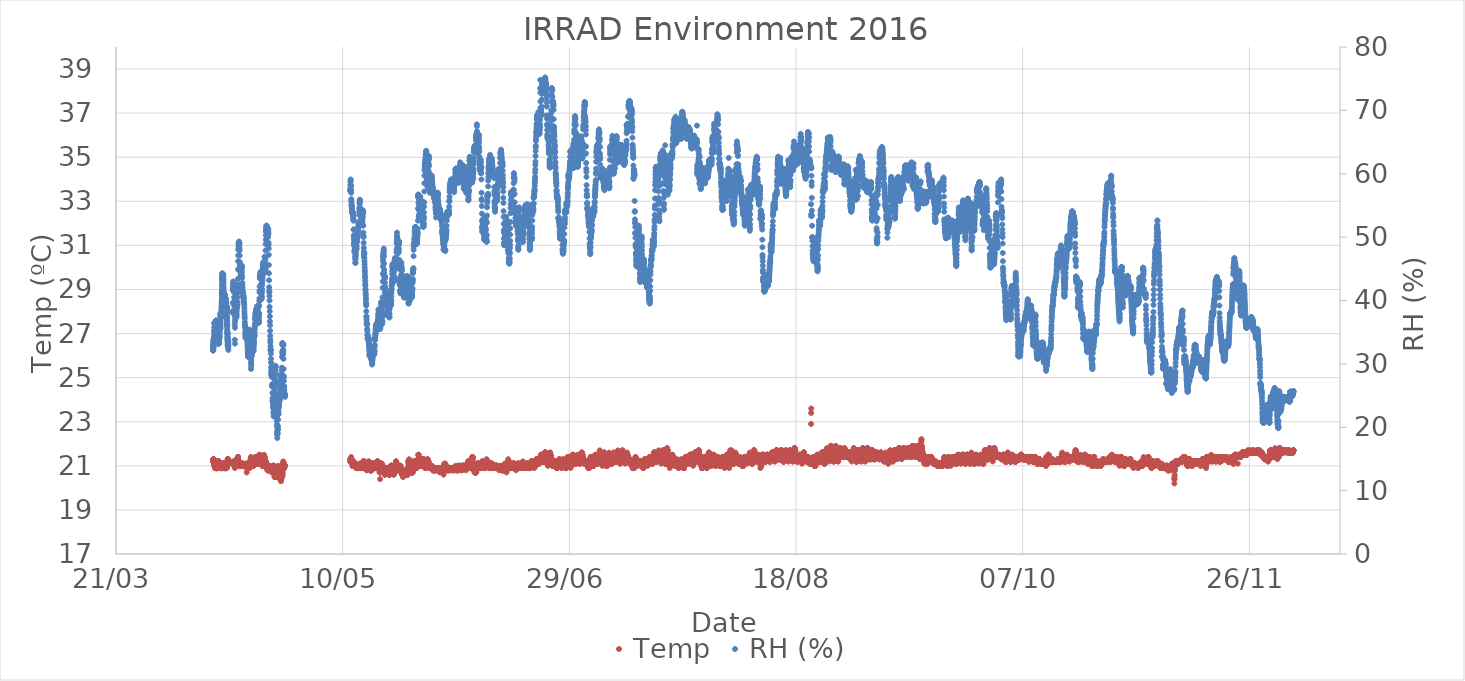
| Category | Temp |
|---|---|
| 42471.41693287037 | 21.2 |
| 42471.42386574074 | 21.2 |
| 42471.430810185186 | 21.2 |
| 42471.43775462963 | 21.2 |
| 42471.444699074076 | 21.2 |
| 42471.45164351852 | 21.2 |
| 42471.45858796296 | 21.2 |
| 42471.465532407405 | 21.2 |
| 42471.47247685185 | 21.2 |
| 42471.479421296295 | 21.2 |
| 42471.48636574074 | 21.2 |
| 42471.493310185186 | 21.3 |
| 42471.50025462963 | 21.3 |
| 42471.507199074076 | 21.3 |
| 42471.51414351852 | 21.3 |
| 42471.52108796296 | 21.2 |
| 42471.528032407405 | 21.2 |
| 42471.53497685185 | 21.3 |
| 42471.541921296295 | 21.3 |
| 42471.54886574074 | 21.2 |
| 42471.555810185186 | 21.2 |
| 42471.56275462963 | 21.2 |
| 42471.569699074076 | 21.2 |
| 42471.57664351852 | 21.2 |
| 42471.58358796296 | 21.2 |
| 42471.590532407405 | 21.2 |
| 42471.59747685185 | 21.2 |
| 42471.604421296295 | 21.2 |
| 42471.61136574074 | 21.2 |
| 42471.618310185186 | 21.2 |
| 42471.62525462963 | 21.2 |
| 42471.632199074076 | 21.2 |
| 42471.63914351852 | 21.2 |
| 42471.64608796296 | 21.2 |
| 42471.653032407405 | 21.2 |
| 42471.65997685185 | 21.2 |
| 42471.666921296295 | 21.2 |
| 42471.67386574074 | 21.2 |
| 42471.680810185186 | 21.2 |
| 42471.68775462963 | 21.2 |
| 42471.694699074076 | 21.1 |
| 42471.70164351852 | 21.1 |
| 42471.70858796296 | 21 |
| 42471.715532407405 | 21.1 |
| 42471.72247685185 | 21.1 |
| 42471.729421296295 | 21 |
| 42471.73636574074 | 21 |
| 42471.743310185186 | 21.1 |
| 42471.75025462963 | 21.1 |
| 42471.757199074076 | 21.1 |
| 42471.76414351852 | 21.1 |
| 42471.77108796296 | 21.1 |
| 42471.778032407405 | 21.1 |
| 42471.78497685185 | 21.1 |
| 42471.791921296295 | 21.1 |
| 42471.79886574074 | 21 |
| 42471.805810185186 | 21 |
| 42471.81275462963 | 21 |
| 42471.819699074076 | 21 |
| 42471.82664351852 | 21 |
| 42471.83358796296 | 21 |
| 42471.840532407405 | 21 |
| 42471.84747685185 | 21 |
| 42471.854421296295 | 21 |
| 42471.86136574074 | 21 |
| 42471.868310185186 | 21 |
| 42471.87525462963 | 21 |
| 42471.882199074076 | 21 |
| 42471.88914351852 | 21 |
| 42471.89608796296 | 20.9 |
| 42471.903032407405 | 20.9 |
| 42471.90997685185 | 20.9 |
| 42471.916921296295 | 20.9 |
| 42471.92386574074 | 21 |
| 42471.930810185186 | 21 |
| 42471.93775462963 | 20.9 |
| 42471.944699074076 | 20.9 |
| 42471.95164351852 | 20.9 |
| 42471.95858796296 | 20.9 |
| 42471.965532407405 | 20.9 |
| 42471.97247685185 | 20.9 |
| 42471.979421296295 | 21 |
| 42471.98636574074 | 21 |
| 42471.993310185186 | 21 |
| 42472.00025462963 | 21 |
| 42472.007199074076 | 21 |
| 42472.01414351852 | 21 |
| 42472.02108796296 | 20.9 |
| 42472.028032407405 | 20.9 |
| 42472.03497685185 | 20.9 |
| 42472.041921296295 | 20.9 |
| 42472.04886574074 | 20.9 |
| 42472.055810185186 | 20.9 |
| 42472.06275462963 | 20.9 |
| 42472.069699074076 | 20.9 |
| 42472.07664351852 | 20.9 |
| 42472.08358796296 | 20.9 |
| 42472.090532407405 | 20.9 |
| 42472.09747685185 | 20.9 |
| 42472.104421296295 | 20.9 |
| 42472.11136574074 | 20.9 |
| 42472.118310185186 | 20.9 |
| 42472.12525462963 | 20.9 |
| 42472.132199074076 | 20.9 |
| 42472.13914351852 | 20.9 |
| 42472.14608796296 | 20.9 |
| 42472.153032407405 | 20.9 |
| 42472.15997685185 | 20.9 |
| 42472.166921296295 | 20.9 |
| 42472.17386574074 | 20.9 |
| 42472.180810185186 | 20.9 |
| 42472.18775462963 | 20.9 |
| 42472.194699074076 | 20.9 |
| 42472.20164351852 | 20.9 |
| 42472.20858796296 | 20.9 |
| 42472.215532407405 | 20.9 |
| 42472.22247685185 | 20.9 |
| 42472.229421296295 | 20.9 |
| 42472.23636574074 | 20.9 |
| 42472.243310185186 | 20.9 |
| 42472.25025462963 | 20.9 |
| 42472.257199074076 | 20.9 |
| 42472.26414351852 | 20.9 |
| 42472.27108796296 | 20.9 |
| 42472.278032407405 | 20.9 |
| 42472.28497685185 | 20.9 |
| 42472.291921296295 | 20.9 |
| 42472.29886574074 | 20.9 |
| 42472.305810185186 | 20.9 |
| 42472.31275462963 | 20.9 |
| 42472.319699074076 | 20.9 |
| 42472.32664351852 | 20.9 |
| 42472.33358796296 | 20.9 |
| 42472.340532407405 | 20.9 |
| 42472.34747685185 | 20.9 |
| 42472.354421296295 | 20.9 |
| 42472.36136574074 | 20.9 |
| 42472.368310185186 | 20.9 |
| 42472.37525462963 | 20.9 |
| 42472.382199074076 | 20.9 |
| 42472.38914351852 | 20.9 |
| 42472.39608796296 | 20.9 |
| 42472.403032407405 | 20.9 |
| 42472.40997685185 | 20.9 |
| 42472.416921296295 | 20.9 |
| 42472.42386574074 | 20.9 |
| 42472.430810185186 | 20.9 |
| 42472.43775462963 | 20.9 |
| 42472.444699074076 | 20.9 |
| 42472.45164351852 | 20.9 |
| 42472.45858796296 | 20.9 |
| 42472.465532407405 | 20.9 |
| 42472.47247685185 | 20.9 |
| 42472.479421296295 | 20.9 |
| 42472.48636574074 | 21 |
| 42472.493310185186 | 20.9 |
| 42472.50025462963 | 21 |
| 42472.507199074076 | 21 |
| 42472.51414351852 | 21 |
| 42472.52108796296 | 21 |
| 42472.528032407405 | 21 |
| 42472.53497685185 | 21 |
| 42472.541921296295 | 21 |
| 42472.54886574074 | 21 |
| 42472.555810185186 | 21.1 |
| 42472.56275462963 | 21.1 |
| 42472.569699074076 | 21.1 |
| 42472.57664351852 | 21.1 |
| 42472.58358796296 | 21.1 |
| 42472.590532407405 | 21.1 |
| 42472.59747685185 | 21.1 |
| 42472.604421296295 | 21.1 |
| 42472.61136574074 | 21.1 |
| 42472.618310185186 | 21.1 |
| 42472.62525462963 | 21.1 |
| 42472.632199074076 | 21.1 |
| 42472.63914351852 | 21.1 |
| 42472.64608796296 | 21.2 |
| 42472.653032407405 | 21.2 |
| 42472.65997685185 | 21.2 |
| 42472.666921296295 | 21.2 |
| 42472.67386574074 | 21.2 |
| 42472.680810185186 | 21.2 |
| 42472.68775462963 | 21.2 |
| 42472.694699074076 | 21.2 |
| 42472.70164351852 | 21.2 |
| 42472.70858796296 | 21.1 |
| 42472.715532407405 | 21.1 |
| 42472.72247685185 | 21.1 |
| 42472.729421296295 | 21.1 |
| 42472.73636574074 | 21.1 |
| 42472.743310185186 | 21.1 |
| 42472.75025462963 | 21.1 |
| 42472.757199074076 | 21.1 |
| 42472.76414351852 | 21.1 |
| 42472.77108796296 | 21.1 |
| 42472.778032407405 | 21.1 |
| 42472.78497685185 | 21.1 |
| 42472.791921296295 | 21.1 |
| 42472.79886574074 | 21.1 |
| 42472.805810185186 | 21.1 |
| 42472.81275462963 | 21.1 |
| 42472.819699074076 | 21.1 |
| 42472.82664351852 | 21 |
| 42472.83358796296 | 21 |
| 42472.840532407405 | 21 |
| 42472.84747685185 | 21 |
| 42472.854421296295 | 21 |
| 42472.86136574074 | 21 |
| 42472.868310185186 | 21 |
| 42472.87525462963 | 21 |
| 42472.882199074076 | 21 |
| 42472.88914351852 | 21 |
| 42472.89608796296 | 21 |
| 42472.903032407405 | 21 |
| 42472.90997685185 | 21 |
| 42472.916921296295 | 21 |
| 42472.92386574074 | 21 |
| 42472.930810185186 | 21 |
| 42472.93775462963 | 21 |
| 42472.944699074076 | 21 |
| 42472.95164351852 | 21 |
| 42472.95858796296 | 21 |
| 42472.965532407405 | 21 |
| 42472.97247685185 | 21 |
| 42472.979421296295 | 21 |
| 42472.98636574074 | 21 |
| 42472.993310185186 | 21 |
| 42473.00025462963 | 21 |
| 42473.007199074076 | 21 |
| 42473.01414351852 | 21 |
| 42473.02108796296 | 21 |
| 42473.028032407405 | 21 |
| 42473.03497685185 | 21 |
| 42473.041921296295 | 21 |
| 42473.04886574074 | 21 |
| 42473.055810185186 | 21 |
| 42473.06275462963 | 21 |
| 42473.069699074076 | 21 |
| 42473.07664351852 | 20.9 |
| 42473.08358796296 | 20.9 |
| 42473.090532407405 | 20.9 |
| 42473.09747685185 | 21 |
| 42473.104421296295 | 20.9 |
| 42473.11136574074 | 20.9 |
| 42473.118310185186 | 21 |
| 42473.12525462963 | 20.9 |
| 42473.132199074076 | 21 |
| 42473.13914351852 | 21 |
| 42473.14608796296 | 21 |
| 42473.153032407405 | 20.9 |
| 42473.15997685185 | 21 |
| 42473.166921296295 | 20.9 |
| 42473.17386574074 | 20.9 |
| 42473.180810185186 | 21 |
| 42473.18775462963 | 20.9 |
| 42473.194699074076 | 20.9 |
| 42473.20164351852 | 20.9 |
| 42473.20858796296 | 20.9 |
| 42473.215532407405 | 20.9 |
| 42473.22247685185 | 20.9 |
| 42473.229421296295 | 20.9 |
| 42473.23636574074 | 20.9 |
| 42473.243310185186 | 20.9 |
| 42473.25025462963 | 20.9 |
| 42473.257199074076 | 20.9 |
| 42473.26414351852 | 20.9 |
| 42473.27108796296 | 20.9 |
| 42473.278032407405 | 20.9 |
| 42473.28497685185 | 20.9 |
| 42473.291921296295 | 20.9 |
| 42473.29886574074 | 20.9 |
| 42473.305810185186 | 20.9 |
| 42473.31275462963 | 20.9 |
| 42473.319699074076 | 20.9 |
| 42473.32664351852 | 20.9 |
| 42473.33358796296 | 20.9 |
| 42473.340532407405 | 20.9 |
| 42473.34747685185 | 20.9 |
| 42473.354421296295 | 20.9 |
| 42473.36136574074 | 20.9 |
| 42473.368310185186 | 20.9 |
| 42473.37525462963 | 20.9 |
| 42473.382199074076 | 20.9 |
| 42473.38914351852 | 20.9 |
| 42473.39608796296 | 20.9 |
| 42473.403032407405 | 20.9 |
| 42473.40997685185 | 20.9 |
| 42473.416921296295 | 20.9 |
| 42473.42386574074 | 20.9 |
| 42473.430810185186 | 20.9 |
| 42473.43775462963 | 20.9 |
| 42473.444699074076 | 20.9 |
| 42473.45164351852 | 20.9 |
| 42473.45858796296 | 20.9 |
| 42473.465532407405 | 20.9 |
| 42473.47247685185 | 20.9 |
| 42473.479421296295 | 20.9 |
| 42473.48636574074 | 20.9 |
| 42473.493310185186 | 20.9 |
| 42473.50025462963 | 20.9 |
| 42473.507199074076 | 21 |
| 42473.51414351852 | 20.9 |
| 42473.52108796296 | 21 |
| 42473.528032407405 | 20.9 |
| 42473.53497685185 | 21 |
| 42473.541921296295 | 21 |
| 42473.54886574074 | 21 |
| 42473.555810185186 | 21 |
| 42473.56275462963 | 21 |
| 42473.569699074076 | 21 |
| 42473.57664351852 | 21 |
| 42473.58358796296 | 21 |
| 42473.590532407405 | 21 |
| 42473.59747685185 | 21 |
| 42473.604421296295 | 21 |
| 42473.61136574074 | 21 |
| 42473.618310185186 | 21 |
| 42473.62525462963 | 21 |
| 42473.632199074076 | 21 |
| 42473.63914351852 | 21 |
| 42473.64608796296 | 21 |
| 42473.653032407405 | 21 |
| 42473.65997685185 | 21 |
| 42473.666921296295 | 21 |
| 42473.67386574074 | 21 |
| 42473.680810185186 | 21 |
| 42473.68775462963 | 21.1 |
| 42473.694699074076 | 21.1 |
| 42473.70164351852 | 21.1 |
| 42473.70858796296 | 21.1 |
| 42473.715532407405 | 21.1 |
| 42473.72247685185 | 21.1 |
| 42473.729421296295 | 21.1 |
| 42473.73636574074 | 21.1 |
| 42473.743310185186 | 21.1 |
| 42473.75025462963 | 21.1 |
| 42473.757199074076 | 21.1 |
| 42473.76414351852 | 21.1 |
| 42473.77108796296 | 21.1 |
| 42473.778032407405 | 21.1 |
| 42473.78497685185 | 21 |
| 42473.791921296295 | 21 |
| 42473.79886574074 | 21 |
| 42473.805810185186 | 21 |
| 42473.81275462963 | 21 |
| 42473.819699074076 | 21 |
| 42473.82664351852 | 21 |
| 42473.83358796296 | 21 |
| 42473.840532407405 | 21 |
| 42473.84747685185 | 21 |
| 42473.854421296295 | 21 |
| 42473.86136574074 | 21 |
| 42473.868310185186 | 21 |
| 42473.87525462963 | 21 |
| 42473.882199074076 | 21 |
| 42473.88914351852 | 21 |
| 42473.89608796296 | 21 |
| 42473.903032407405 | 21 |
| 42473.90997685185 | 20.9 |
| 42473.916921296295 | 20.9 |
| 42473.92386574074 | 20.9 |
| 42473.930810185186 | 20.9 |
| 42473.93775462963 | 20.9 |
| 42473.944699074076 | 20.9 |
| 42473.95164351852 | 20.9 |
| 42473.95858796296 | 20.9 |
| 42473.965532407405 | 20.9 |
| 42473.97247685185 | 20.9 |
| 42473.979421296295 | 20.9 |
| 42473.98636574074 | 20.9 |
| 42473.993310185186 | 20.9 |
| 42474.00025462963 | 20.9 |
| 42474.007199074076 | 20.9 |
| 42474.01414351852 | 20.9 |
| 42474.02108796296 | 20.9 |
| 42474.028032407405 | 20.9 |
| 42474.03497685185 | 20.9 |
| 42474.041921296295 | 20.9 |
| 42474.04886574074 | 20.9 |
| 42474.055810185186 | 20.9 |
| 42474.06275462963 | 20.9 |
| 42474.069699074076 | 20.9 |
| 42474.07664351852 | 20.9 |
| 42474.08358796296 | 20.9 |
| 42474.090532407405 | 20.9 |
| 42474.09747685185 | 20.9 |
| 42474.104421296295 | 20.9 |
| 42474.11136574074 | 20.9 |
| 42474.118310185186 | 20.9 |
| 42474.12525462963 | 20.9 |
| 42474.132199074076 | 20.9 |
| 42474.13914351852 | 20.9 |
| 42474.14608796296 | 20.9 |
| 42474.153032407405 | 20.9 |
| 42474.15997685185 | 20.9 |
| 42474.166921296295 | 20.9 |
| 42474.17386574074 | 20.9 |
| 42474.180810185186 | 20.9 |
| 42474.18775462963 | 20.9 |
| 42474.194699074076 | 20.9 |
| 42474.20164351852 | 20.9 |
| 42474.20858796296 | 20.9 |
| 42474.215532407405 | 20.9 |
| 42474.22247685185 | 20.9 |
| 42474.229421296295 | 20.9 |
| 42474.23636574074 | 20.9 |
| 42474.243310185186 | 20.9 |
| 42474.25025462963 | 20.9 |
| 42474.257199074076 | 20.9 |
| 42474.26414351852 | 20.9 |
| 42474.27108796296 | 20.9 |
| 42474.278032407405 | 20.9 |
| 42474.28497685185 | 20.9 |
| 42474.291921296295 | 20.9 |
| 42474.29886574074 | 20.9 |
| 42474.305810185186 | 20.9 |
| 42474.31275462963 | 20.9 |
| 42474.319699074076 | 20.9 |
| 42474.32664351852 | 20.9 |
| 42474.33358796296 | 20.9 |
| 42474.340532407405 | 20.9 |
| 42474.34747685185 | 20.9 |
| 42474.354421296295 | 20.9 |
| 42474.36136574074 | 20.9 |
| 42474.368310185186 | 20.9 |
| 42474.37525462963 | 21 |
| 42474.382199074076 | 20.9 |
| 42474.38914351852 | 20.9 |
| 42474.39608796296 | 20.9 |
| 42474.403032407405 | 21 |
| 42474.40997685185 | 21 |
| 42474.416921296295 | 21 |
| 42474.42386574074 | 21 |
| 42474.430810185186 | 21 |
| 42474.43775462963 | 21 |
| 42474.444699074076 | 21 |
| 42474.45164351852 | 21 |
| 42474.45858796296 | 21 |
| 42474.465532407405 | 21 |
| 42474.47247685185 | 21 |
| 42474.479421296295 | 21 |
| 42474.48636574074 | 21 |
| 42474.493310185186 | 21 |
| 42474.50025462963 | 21 |
| 42474.507199074076 | 21 |
| 42474.51414351852 | 21 |
| 42474.52108796296 | 21 |
| 42474.528032407405 | 21.1 |
| 42474.53497685185 | 21.1 |
| 42474.541921296295 | 21.1 |
| 42474.54886574074 | 21.1 |
| 42474.555810185186 | 21.1 |
| 42474.56275462963 | 21.1 |
| 42474.569699074076 | 21.1 |
| 42474.57664351852 | 21.2 |
| 42474.58358796296 | 21.2 |
| 42474.590532407405 | 21.2 |
| 42474.59747685185 | 21.2 |
| 42474.604421296295 | 21.2 |
| 42474.61136574074 | 21.2 |
| 42474.618310185186 | 21.2 |
| 42474.62525462963 | 21.2 |
| 42474.632199074076 | 21.2 |
| 42474.63914351852 | 21.2 |
| 42474.64608796296 | 21.2 |
| 42474.653032407405 | 21.2 |
| 42474.65997685185 | 21.3 |
| 42474.666921296295 | 21.3 |
| 42474.67386574074 | 21.3 |
| 42474.680810185186 | 21.3 |
| 42474.68775462963 | 21.3 |
| 42474.694699074076 | 21.3 |
| 42474.70164351852 | 21.3 |
| 42474.70858796296 | 21.2 |
| 42474.715532407405 | 21.2 |
| 42474.72247685185 | 21.2 |
| 42474.729421296295 | 21.2 |
| 42474.73636574074 | 21.2 |
| 42474.743310185186 | 21.2 |
| 42474.75025462963 | 21.2 |
| 42474.757199074076 | 21.2 |
| 42474.76414351852 | 21.2 |
| 42474.77108796296 | 21.2 |
| 42474.778032407405 | 21.2 |
| 42475.72274305556 | 21.1 |
| 42475.723078703704 | 21.1 |
| 42475.723391203705 | 21.1 |
| 42475.72390046297 | 21.1 |
| 42475.744733796295 | 21.1 |
| 42475.76556712963 | 21.1 |
| 42475.78640046297 | 21.1 |
| 42475.807233796295 | 21.2 |
| 42475.82806712963 | 21.1 |
| 42475.84890046297 | 21.1 |
| 42475.869733796295 | 21.1 |
| 42475.89056712963 | 21.1 |
| 42475.91140046297 | 21.1 |
| 42475.932233796295 | 21.1 |
| 42475.95306712963 | 21.1 |
| 42475.97390046297 | 21.1 |
| 42475.994733796295 | 21.1 |
| 42476.01556712963 | 21.1 |
| 42476.03640046297 | 21.1 |
| 42476.057233796295 | 21.1 |
| 42476.07806712963 | 21 |
| 42476.09890046297 | 21 |
| 42476.119733796295 | 21 |
| 42476.14056712963 | 21 |
| 42476.16140046297 | 21 |
| 42476.182233796295 | 21 |
| 42476.20306712963 | 21 |
| 42476.22390046297 | 20.9 |
| 42476.244733796295 | 21 |
| 42476.26556712963 | 21 |
| 42476.28640046297 | 21 |
| 42476.307233796295 | 21 |
| 42476.32806712963 | 21 |
| 42476.34890046297 | 21 |
| 42476.369733796295 | 21 |
| 42476.39056712963 | 21 |
| 42476.41140046297 | 21 |
| 42476.432233796295 | 21 |
| 42476.45306712963 | 21 |
| 42476.47390046297 | 21.1 |
| 42476.494733796295 | 21.1 |
| 42476.51556712963 | 21.1 |
| 42476.53640046297 | 21.2 |
| 42476.557233796295 | 21.2 |
| 42476.57806712963 | 21.2 |
| 42476.59890046297 | 21.2 |
| 42476.619733796295 | 21.3 |
| 42476.64056712963 | 21.3 |
| 42476.66140046297 | 21.3 |
| 42476.682233796295 | 21.3 |
| 42476.70306712963 | 21.3 |
| 42476.72390046297 | 21.3 |
| 42476.744733796295 | 21.3 |
| 42476.76556712963 | 21.3 |
| 42476.78640046297 | 21.3 |
| 42476.807233796295 | 21.3 |
| 42476.82806712963 | 21.3 |
| 42476.84890046297 | 21.3 |
| 42476.869733796295 | 21.3 |
| 42476.89056712963 | 21.4 |
| 42476.91140046297 | 21.4 |
| 42476.932233796295 | 21.4 |
| 42476.95306712963 | 21.2 |
| 42476.97390046297 | 21.2 |
| 42476.994733796295 | 21.2 |
| 42477.01556712963 | 21.2 |
| 42477.03640046297 | 21.1 |
| 42477.057233796295 | 21.1 |
| 42477.07806712963 | 21.1 |
| 42477.09890046297 | 21.1 |
| 42477.119733796295 | 21.1 |
| 42477.14056712963 | 21.1 |
| 42477.16140046297 | 21.1 |
| 42477.182233796295 | 21.2 |
| 42477.20306712963 | 21.1 |
| 42477.22390046297 | 21.1 |
| 42477.244733796295 | 21.1 |
| 42477.26556712963 | 21 |
| 42477.28640046297 | 21 |
| 42477.307233796295 | 21.1 |
| 42477.32806712963 | 21 |
| 42477.34890046297 | 21 |
| 42477.369733796295 | 21 |
| 42477.39056712963 | 21.1 |
| 42477.41140046297 | 21.1 |
| 42477.432233796295 | 21.1 |
| 42477.45306712963 | 21.1 |
| 42477.47390046297 | 21.1 |
| 42477.494733796295 | 21.1 |
| 42477.51556712963 | 21.1 |
| 42477.53640046297 | 21.1 |
| 42477.557233796295 | 21.1 |
| 42477.57806712963 | 21.1 |
| 42477.59890046297 | 21.1 |
| 42477.619733796295 | 21.1 |
| 42477.64056712963 | 21.1 |
| 42477.66140046297 | 21.1 |
| 42477.682233796295 | 21.1 |
| 42477.70306712963 | 21.1 |
| 42477.72390046297 | 21.1 |
| 42477.744733796295 | 21.1 |
| 42477.76556712963 | 21.1 |
| 42477.78640046297 | 21 |
| 42477.807233796295 | 21 |
| 42477.82806712963 | 21 |
| 42477.84890046297 | 21 |
| 42477.869733796295 | 21 |
| 42477.89056712963 | 21.1 |
| 42477.91140046297 | 21 |
| 42477.932233796295 | 21.1 |
| 42477.95306712963 | 21 |
| 42477.97390046297 | 21 |
| 42477.994733796295 | 21 |
| 42478.01556712963 | 21 |
| 42478.03640046297 | 21 |
| 42478.057233796295 | 21 |
| 42478.07806712963 | 21 |
| 42478.09890046297 | 21 |
| 42478.119733796295 | 21 |
| 42478.14056712963 | 21 |
| 42478.16140046297 | 21 |
| 42478.182233796295 | 21 |
| 42478.20306712963 | 21 |
| 42478.22390046297 | 21 |
| 42478.244733796295 | 21 |
| 42478.26556712963 | 21 |
| 42478.28640046297 | 21 |
| 42478.307233796295 | 21 |
| 42478.32806712963 | 21 |
| 42478.34890046297 | 21 |
| 42478.369733796295 | 21 |
| 42478.39056712963 | 21 |
| 42478.41140046297 | 21 |
| 42478.432233796295 | 21 |
| 42478.45306712963 | 21 |
| 42478.47390046297 | 21 |
| 42478.494733796295 | 21 |
| 42478.51556712963 | 21 |
| 42478.53640046297 | 21 |
| 42478.557233796295 | 21.1 |
| 42478.57806712963 | 21 |
| 42478.59890046297 | 21 |
| 42478.619733796295 | 21 |
| 42478.64056712963 | 21 |
| 42478.66140046297 | 21 |
| 42478.682233796295 | 21 |
| 42478.70306712963 | 21 |
| 42478.72390046297 | 21 |
| 42478.744733796295 | 20.9 |
| 42478.76556712963 | 21 |
| 42478.78640046297 | 21.1 |
| 42478.807233796295 | 21 |
| 42478.82806712963 | 20.7 |
| 42478.84890046297 | 21 |
| 42478.869733796295 | 21 |
| 42478.89056712963 | 21 |
| 42478.91140046297 | 21 |
| 42478.932233796295 | 21 |
| 42478.95306712963 | 21 |
| 42478.97390046297 | 21 |
| 42478.994733796295 | 20.9 |
| 42479.01556712963 | 20.9 |
| 42479.03640046297 | 20.9 |
| 42479.057233796295 | 20.9 |
| 42479.07806712963 | 20.9 |
| 42479.09890046297 | 20.9 |
| 42479.119733796295 | 20.9 |
| 42479.14056712963 | 20.9 |
| 42479.16140046297 | 20.9 |
| 42479.182233796295 | 20.9 |
| 42479.20306712963 | 20.9 |
| 42479.22390046297 | 20.9 |
| 42479.244733796295 | 20.9 |
| 42479.26556712963 | 20.9 |
| 42479.28640046297 | 20.9 |
| 42479.307233796295 | 20.9 |
| 42479.32806712963 | 20.9 |
| 42479.34890046297 | 21 |
| 42479.369733796295 | 21 |
| 42479.39056712963 | 21.1 |
| 42479.41140046297 | 21.1 |
| 42479.432233796295 | 21 |
| 42479.45306712963 | 20.9 |
| 42479.47390046297 | 21 |
| 42479.494733796295 | 21 |
| 42479.51556712963 | 21 |
| 42479.53640046297 | 21 |
| 42479.557233796295 | 21.1 |
| 42479.57806712963 | 21.2 |
| 42479.59890046297 | 21.2 |
| 42479.619733796295 | 21.2 |
| 42479.64056712963 | 21.2 |
| 42479.66140046297 | 21.2 |
| 42479.682233796295 | 21.2 |
| 42479.70306712963 | 21.3 |
| 42479.72390046297 | 21.3 |
| 42479.744733796295 | 21.4 |
| 42479.76556712963 | 21.2 |
| 42479.78640046297 | 21.3 |
| 42479.807233796295 | 21.3 |
| 42479.82806712963 | 21.3 |
| 42479.84890046297 | 21.3 |
| 42479.869733796295 | 21.3 |
| 42479.89056712963 | 21.3 |
| 42479.91140046297 | 21.2 |
| 42479.932233796295 | 21.2 |
| 42479.95306712963 | 21.2 |
| 42479.97390046297 | 21.2 |
| 42479.994733796295 | 21.2 |
| 42480.01556712963 | 21.2 |
| 42480.03640046297 | 21.1 |
| 42480.057233796295 | 21.1 |
| 42480.07806712963 | 21.1 |
| 42480.09890046297 | 21.1 |
| 42480.119733796295 | 21.1 |
| 42480.14056712963 | 21.1 |
| 42480.16140046297 | 21.1 |
| 42480.182233796295 | 21 |
| 42480.20306712963 | 21.1 |
| 42480.22390046297 | 21 |
| 42480.244733796295 | 21 |
| 42480.26556712963 | 21 |
| 42480.28640046297 | 21 |
| 42480.307233796295 | 21 |
| 42480.32806712963 | 21 |
| 42480.34890046297 | 21 |
| 42480.369733796295 | 21.1 |
| 42480.39056712963 | 21.2 |
| 42480.41140046297 | 21.2 |
| 42480.432233796295 | 21.2 |
| 42480.45306712963 | 21.1 |
| 42480.47390046297 | 21.1 |
| 42480.494733796295 | 21.1 |
| 42480.51556712963 | 21.1 |
| 42480.53640046297 | 21.2 |
| 42480.557233796295 | 21.2 |
| 42480.57806712963 | 21.3 |
| 42480.59890046297 | 21.3 |
| 42480.619733796295 | 21.3 |
| 42480.64056712963 | 21.3 |
| 42480.66140046297 | 21.4 |
| 42480.682233796295 | 21.3 |
| 42480.70306712963 | 21.3 |
| 42480.72390046297 | 21.2 |
| 42480.744733796295 | 21.3 |
| 42480.76556712963 | 21.2 |
| 42480.78640046297 | 21.4 |
| 42480.807233796295 | 21.3 |
| 42480.82806712963 | 21.2 |
| 42480.84890046297 | 21.3 |
| 42480.869733796295 | 21.2 |
| 42480.89056712963 | 21.2 |
| 42480.91140046297 | 21.2 |
| 42480.932233796295 | 21.3 |
| 42480.95306712963 | 21.2 |
| 42480.97390046297 | 21.3 |
| 42480.994733796295 | 21.2 |
| 42481.01556712963 | 21.3 |
| 42481.03640046297 | 21.2 |
| 42481.057233796295 | 21.2 |
| 42481.07806712963 | 21.2 |
| 42481.09890046297 | 21.2 |
| 42481.119733796295 | 21.2 |
| 42481.14056712963 | 21.2 |
| 42481.16140046297 | 21.1 |
| 42481.182233796295 | 21.2 |
| 42481.20306712963 | 21.1 |
| 42481.22390046297 | 21.2 |
| 42481.244733796295 | 21.1 |
| 42481.26556712963 | 21.1 |
| 42481.28640046297 | 21.1 |
| 42481.307233796295 | 21.1 |
| 42481.32806712963 | 21.1 |
| 42481.34890046297 | 21.2 |
| 42481.369733796295 | 21.2 |
| 42481.39056712963 | 21.2 |
| 42481.41140046297 | 21.2 |
| 42481.432233796295 | 21.3 |
| 42481.45306712963 | 21.2 |
| 42481.47390046297 | 21.3 |
| 42481.494733796295 | 21.3 |
| 42481.51556712963 | 21.3 |
| 42481.53640046297 | 21.4 |
| 42481.557233796295 | 21.4 |
| 42481.57806712963 | 21.5 |
| 42481.59890046297 | 21.3 |
| 42481.619733796295 | 21.3 |
| 42481.64056712963 | 21.3 |
| 42481.66140046297 | 21.3 |
| 42481.682233796295 | 21.2 |
| 42481.70306712963 | 21.4 |
| 42481.72390046297 | 21.4 |
| 42481.744733796295 | 21.4 |
| 42481.76556712963 | 21.5 |
| 42481.78640046297 | 21.4 |
| 42481.807233796295 | 21.3 |
| 42481.82806712963 | 21.2 |
| 42481.84890046297 | 21.3 |
| 42481.869733796295 | 21.2 |
| 42481.89056712963 | 21.2 |
| 42481.91140046297 | 21.2 |
| 42481.932233796295 | 21.2 |
| 42481.95306712963 | 21.3 |
| 42481.97390046297 | 21.3 |
| 42481.994733796295 | 21.3 |
| 42482.01556712963 | 21.3 |
| 42482.03640046297 | 21.2 |
| 42482.057233796295 | 21.2 |
| 42482.07806712963 | 21.2 |
| 42482.09890046297 | 21.2 |
| 42482.119733796295 | 21.1 |
| 42482.14056712963 | 21.1 |
| 42482.16140046297 | 21.1 |
| 42482.182233796295 | 21.1 |
| 42482.20306712963 | 21.1 |
| 42482.22390046297 | 21.1 |
| 42482.244733796295 | 21.1 |
| 42482.26556712963 | 21 |
| 42482.28640046297 | 21.1 |
| 42482.307233796295 | 21 |
| 42482.32806712963 | 21 |
| 42482.34890046297 | 21 |
| 42482.369733796295 | 21 |
| 42482.39056712963 | 21 |
| 42482.41140046297 | 21 |
| 42482.432233796295 | 21.1 |
| 42482.45306712963 | 21.1 |
| 42482.47390046297 | 21.2 |
| 42482.494733796295 | 21.3 |
| 42482.51556712963 | 21.4 |
| 42482.53640046297 | 21.4 |
| 42482.557233796295 | 21.4 |
| 42482.57806712963 | 21.4 |
| 42482.59890046297 | 21.3 |
| 42482.619733796295 | 21.4 |
| 42482.64056712963 | 21.4 |
| 42482.66140046297 | 21.5 |
| 42482.682233796295 | 21.4 |
| 42482.70306712963 | 21.4 |
| 42482.72390046297 | 21.4 |
| 42482.744733796295 | 21.3 |
| 42482.76556712963 | 21.3 |
| 42482.78640046297 | 21.2 |
| 42482.807233796295 | 21.4 |
| 42482.82806712963 | 21.2 |
| 42482.84890046297 | 21.3 |
| 42482.869733796295 | 21.3 |
| 42482.89056712963 | 21.2 |
| 42482.91140046297 | 21.2 |
| 42482.932233796295 | 21.2 |
| 42482.95306712963 | 21.2 |
| 42482.97390046297 | 21.2 |
| 42482.994733796295 | 21.2 |
| 42483.01556712963 | 21.2 |
| 42483.03640046297 | 21.1 |
| 42483.057233796295 | 21.1 |
| 42483.07806712963 | 21.1 |
| 42483.09890046297 | 21.1 |
| 42483.119733796295 | 21 |
| 42483.14056712963 | 21 |
| 42483.16140046297 | 21 |
| 42483.182233796295 | 21 |
| 42483.20306712963 | 21 |
| 42483.22390046297 | 20.9 |
| 42483.244733796295 | 20.9 |
| 42483.26556712963 | 20.9 |
| 42483.28640046297 | 20.9 |
| 42483.307233796295 | 20.9 |
| 42483.32806712963 | 20.9 |
| 42483.34890046297 | 20.9 |
| 42483.369733796295 | 20.9 |
| 42483.39056712963 | 20.9 |
| 42483.41140046297 | 20.8 |
| 42483.432233796295 | 20.9 |
| 42483.45306712963 | 20.8 |
| 42483.47390046297 | 20.9 |
| 42483.494733796295 | 20.8 |
| 42483.51556712963 | 20.9 |
| 42483.53640046297 | 20.8 |
| 42483.557233796295 | 20.8 |
| 42483.57806712963 | 20.9 |
| 42483.59890046297 | 20.8 |
| 42483.619733796295 | 20.8 |
| 42483.64056712963 | 20.9 |
| 42483.66140046297 | 20.9 |
| 42483.682233796295 | 21 |
| 42483.70306712963 | 21 |
| 42483.72390046297 | 21 |
| 42483.744733796295 | 21 |
| 42483.76556712963 | 20.9 |
| 42483.78640046297 | 20.9 |
| 42483.807233796295 | 20.9 |
| 42483.82806712963 | 20.9 |
| 42483.84890046297 | 20.9 |
| 42483.869733796295 | 20.9 |
| 42483.89056712963 | 20.9 |
| 42483.91140046297 | 20.9 |
| 42483.932233796295 | 20.9 |
| 42483.95306712963 | 20.9 |
| 42483.97390046297 | 20.9 |
| 42483.994733796295 | 20.9 |
| 42484.01556712963 | 20.8 |
| 42484.03640046297 | 20.8 |
| 42484.057233796295 | 20.8 |
| 42484.07806712963 | 20.9 |
| 42484.09890046297 | 20.9 |
| 42484.119733796295 | 20.9 |
| 42484.14056712963 | 20.9 |
| 42484.16140046297 | 20.9 |
| 42484.182233796295 | 20.9 |
| 42484.20306712963 | 20.9 |
| 42484.22390046297 | 20.8 |
| 42484.244733796295 | 20.8 |
| 42484.26556712963 | 20.8 |
| 42484.28640046297 | 20.8 |
| 42484.307233796295 | 20.8 |
| 42484.32806712963 | 20.7 |
| 42484.34890046297 | 20.8 |
| 42484.369733796295 | 20.8 |
| 42484.39056712963 | 20.8 |
| 42484.41140046297 | 20.9 |
| 42484.432233796295 | 20.8 |
| 42484.45306712963 | 20.8 |
| 42484.47390046297 | 20.8 |
| 42484.494733796295 | 20.8 |
| 42484.51556712963 | 20.9 |
| 42484.53640046297 | 20.8 |
| 42484.557233796295 | 20.9 |
| 42484.57806712963 | 20.9 |
| 42484.59890046297 | 21 |
| 42484.619733796295 | 20.9 |
| 42484.64056712963 | 21 |
| 42484.66140046297 | 21 |
| 42484.682233796295 | 20.9 |
| 42484.70306712963 | 21 |
| 42484.72390046297 | 20.9 |
| 42484.744733796295 | 21 |
| 42484.76556712963 | 21 |
| 42484.78640046297 | 21 |
| 42484.807233796295 | 21 |
| 42484.82806712963 | 21 |
| 42484.84890046297 | 20.9 |
| 42484.869733796295 | 20.9 |
| 42484.89056712963 | 20.9 |
| 42484.91140046297 | 20.7 |
| 42484.932233796295 | 20.7 |
| 42484.95306712963 | 20.7 |
| 42484.97390046297 | 20.6 |
| 42484.994733796295 | 20.5 |
| 42485.01556712963 | 20.5 |
| 42485.03640046297 | 20.5 |
| 42485.057233796295 | 20.5 |
| 42485.07806712963 | 20.5 |
| 42485.09890046297 | 20.5 |
| 42485.119733796295 | 20.5 |
| 42485.14056712963 | 20.5 |
| 42485.16140046297 | 20.5 |
| 42485.182233796295 | 20.5 |
| 42485.20306712963 | 20.5 |
| 42485.22390046297 | 20.6 |
| 42485.244733796295 | 20.6 |
| 42485.26556712963 | 20.5 |
| 42485.28640046297 | 20.6 |
| 42485.307233796295 | 20.6 |
| 42485.32806712963 | 20.6 |
| 42485.34890046297 | 20.7 |
| 42485.369733796295 | 20.7 |
| 42485.39056712963 | 20.6 |
| 42485.41140046297 | 20.6 |
| 42485.432233796295 | 20.5 |
| 42485.45306712963 | 20.6 |
| 42485.47390046297 | 20.7 |
| 42485.494733796295 | 20.8 |
| 42485.51556712963 | 20.7 |
| 42485.53640046297 | 20.8 |
| 42485.557233796295 | 20.9 |
| 42485.57806712963 | 20.9 |
| 42485.59890046297 | 20.9 |
| 42485.619733796295 | 20.9 |
| 42485.64056712963 | 20.9 |
| 42485.66140046297 | 20.9 |
| 42485.682233796295 | 20.9 |
| 42485.70306712963 | 20.9 |
| 42485.72390046297 | 20.9 |
| 42485.744733796295 | 20.9 |
| 42485.76556712963 | 21 |
| 42485.78640046297 | 20.9 |
| 42485.807233796295 | 20.9 |
| 42485.82806712963 | 20.8 |
| 42485.84890046297 | 20.8 |
| 42485.869733796295 | 20.8 |
| 42485.89056712963 | 20.7 |
| 42485.91140046297 | 20.7 |
| 42485.932233796295 | 20.7 |
| 42485.95306712963 | 20.7 |
| 42485.97390046297 | 20.7 |
| 42485.994733796295 | 20.6 |
| 42486.01556712963 | 20.6 |
| 42486.03640046297 | 20.6 |
| 42486.057233796295 | 20.6 |
| 42486.07806712963 | 20.6 |
| 42486.09890046297 | 20.5 |
| 42486.119733796295 | 20.5 |
| 42486.14056712963 | 20.5 |
| 42486.16140046297 | 20.4 |
| 42486.182233796295 | 20.5 |
| 42486.20306712963 | 20.5 |
| 42486.22390046297 | 20.5 |
| 42486.244733796295 | 20.5 |
| 42486.26556712963 | 20.5 |
| 42486.28640046297 | 20.5 |
| 42486.307233796295 | 20.4 |
| 42486.32806712963 | 20.4 |
| 42486.34890046297 | 20.4 |
| 42486.369733796295 | 20.4 |
| 42486.39056712963 | 20.3 |
| 42486.41140046297 | 20.4 |
| 42486.432233796295 | 20.4 |
| 42486.45306712963 | 20.4 |
| 42486.47390046297 | 20.5 |
| 42486.494733796295 | 20.5 |
| 42486.51556712963 | 20.5 |
| 42486.53640046297 | 20.5 |
| 42486.557233796295 | 20.6 |
| 42486.57806712963 | 20.6 |
| 42486.59890046297 | 20.6 |
| 42486.619733796295 | 20.6 |
| 42486.64056712963 | 20.6 |
| 42486.66140046297 | 20.6 |
| 42486.682233796295 | 20.5 |
| 42486.70306712963 | 20.6 |
| 42486.72390046297 | 20.6 |
| 42486.744733796295 | 20.8 |
| 42486.76556712963 | 20.7 |
| 42486.78640046297 | 21.1 |
| 42486.807233796295 | 21.1 |
| 42486.82806712963 | 21.1 |
| 42486.84890046297 | 21.1 |
| 42486.869733796295 | 21.1 |
| 42486.89056712963 | 21.2 |
| 42486.91140046297 | 21.1 |
| 42486.932233796295 | 21.1 |
| 42486.95306712963 | 21.1 |
| 42486.97390046297 | 21.1 |
| 42486.994733796295 | 21.1 |
| 42487.01556712963 | 21.1 |
| 42487.03640046297 | 21.1 |
| 42487.057233796295 | 21.1 |
| 42487.07806712963 | 21.1 |
| 42487.09890046297 | 21 |
| 42487.119733796295 | 21 |
| 42487.14056712963 | 21 |
| 42487.16140046297 | 20.9 |
| 42487.182233796295 | 21 |
| 42487.20306712963 | 21 |
| 42487.22390046297 | 21 |
| 42487.244733796295 | 21 |
| 42487.26556712963 | 21 |
| 42487.28640046297 | 21 |
| 42501.67082175926 | 21.3 |
| 42501.671273148146 | 21.2 |
| 42501.69210648148 | 21.2 |
| 42501.71293981482 | 21.2 |
| 42501.733773148146 | 21.3 |
| 42501.75460648148 | 21.3 |
| 42501.77543981482 | 21.2 |
| 42501.796273148146 | 21.3 |
| 42501.81710648148 | 21.3 |
| 42501.83793981482 | 21.2 |
| 42501.858773148146 | 21.3 |
| 42501.87960648148 | 21.4 |
| 42501.90043981482 | 21.3 |
| 42501.921273148146 | 21.2 |
| 42501.94210648148 | 21.2 |
| 42501.96293981482 | 21.3 |
| 42501.983773148146 | 21.2 |
| 42502.00460648148 | 21.2 |
| 42502.02543981482 | 21.2 |
| 42502.046273148146 | 21.2 |
| 42502.06710648148 | 21.2 |
| 42502.08793981482 | 21.2 |
| 42502.108773148146 | 21.1 |
| 42502.12960648148 | 21.1 |
| 42502.15043981482 | 21.2 |
| 42502.171273148146 | 21 |
| 42502.19210648148 | 21.1 |
| 42502.21293981482 | 21 |
| 42502.233773148146 | 21.1 |
| 42502.25460648148 | 21 |
| 42502.27543981482 | 21 |
| 42502.296273148146 | 21 |
| 42502.31710648148 | 21 |
| 42502.33793981482 | 21.2 |
| 42502.358773148146 | 21.1 |
| 42502.37960648148 | 21.1 |
| 42502.40043981482 | 21 |
| 42502.421273148146 | 21.2 |
| 42502.44210648148 | 21.1 |
| 42502.46293981482 | 21 |
| 42502.483773148146 | 21 |
| 42502.50460648148 | 21.1 |
| 42502.52543981482 | 21.1 |
| 42502.546273148146 | 21.1 |
| 42502.550462962965 | 21 |
| 42502.551516203705 | 21.1 |
| 42502.55201388889 | 21.1 |
| 42502.55216435185 | 21.1 |
| 42502.55231481481 | 21 |
| 42502.55318287037 | 21 |
| 42502.574016203704 | 21 |
| 42502.59484953704 | 21 |
| 42502.61568287037 | 21 |
| 42502.636516203704 | 21 |
| 42502.65734953704 | 21.1 |
| 42502.67818287037 | 21 |
| 42502.699016203704 | 21 |
| 42502.71984953704 | 21 |
| 42502.74068287037 | 21 |
| 42502.761516203704 | 21 |
| 42502.78234953704 | 21 |
| 42502.80318287037 | 21.1 |
| 42502.824016203704 | 21 |
| 42502.84484953704 | 21 |
| 42502.86568287037 | 21 |
| 42502.886516203704 | 21 |
| 42502.90734953704 | 21 |
| 42502.92818287037 | 21 |
| 42502.949016203704 | 21 |
| 42502.96984953704 | 21 |
| 42502.99068287037 | 20.9 |
| 42503.011516203704 | 20.9 |
| 42503.03234953704 | 20.9 |
| 42503.05318287037 | 20.9 |
| 42503.074016203704 | 20.9 |
| 42503.09484953704 | 20.9 |
| 42503.11568287037 | 20.9 |
| 42503.136516203704 | 20.9 |
| 42503.15734953704 | 20.9 |
| 42503.17818287037 | 20.9 |
| 42503.199016203704 | 20.9 |
| 42503.21984953704 | 20.9 |
| 42503.24068287037 | 20.9 |
| 42503.261516203704 | 20.9 |
| 42503.28234953704 | 20.9 |
| 42503.30318287037 | 20.9 |
| 42503.324016203704 | 20.9 |
| 42503.34484953704 | 20.9 |
| 42503.36568287037 | 20.9 |
| 42503.386516203704 | 20.9 |
| 42503.40734953704 | 20.9 |
| 42503.42818287037 | 20.9 |
| 42503.449016203704 | 20.9 |
| 42503.46984953704 | 20.9 |
| 42503.49068287037 | 21 |
| 42503.511516203704 | 21 |
| 42503.53234953704 | 20.9 |
| 42503.54733796296 | 21 |
| 42503.547534722224 | 21 |
| 42503.548946759256 | 21 |
| 42503.569768518515 | 21 |
| 42503.59060185185 | 21 |
| 42503.61143518519 | 21 |
| 42503.632268518515 | 20.9 |
| 42503.65310185185 | 21 |
| 42503.67393518519 | 21.1 |
| 42503.694768518515 | 21 |
| 42503.71560185185 | 21 |
| 42503.73643518519 | 20.9 |
| 42503.757268518515 | 21 |
| 42503.77810185185 | 21 |
| 42503.79893518519 | 21 |
| 42503.819768518515 | 21 |
| 42503.84060185185 | 20.9 |
| 42503.86143518519 | 21 |
| 42503.882268518515 | 20.9 |
| 42503.90310185185 | 21 |
| 42503.92393518519 | 21 |
| 42503.944768518515 | 20.9 |
| 42503.96560185185 | 21 |
| 42503.98643518519 | 20.9 |
| 42504.007268518515 | 21 |
| 42504.02810185185 | 21 |
| 42504.04893518519 | 21 |
| 42504.069768518515 | 20.9 |
| 42504.09060185185 | 20.9 |
| 42504.11143518519 | 21 |
| 42504.132268518515 | 20.9 |
| 42504.15310185185 | 21 |
| 42504.17393518519 | 21 |
| 42504.194768518515 | 20.9 |
| 42504.21560185185 | 20.9 |
| 42504.23643518519 | 20.9 |
| 42504.257268518515 | 20.9 |
| 42504.27810185185 | 20.9 |
| 42504.29893518519 | 20.9 |
| 42504.319768518515 | 21 |
| 42504.34060185185 | 21 |
| 42504.36143518519 | 20.9 |
| 42504.382268518515 | 20.9 |
| 42504.40310185185 | 21 |
| 42504.42393518519 | 21 |
| 42504.444768518515 | 21 |
| 42504.46560185185 | 21 |
| 42504.48643518519 | 21.1 |
| 42504.507268518515 | 21.1 |
| 42504.52810185185 | 21.1 |
| 42504.54893518519 | 21.2 |
| 42504.569768518515 | 21.2 |
| 42504.59060185185 | 21.1 |
| 42504.61143518519 | 21.1 |
| 42504.632268518515 | 21.2 |
| 42504.65310185185 | 21.1 |
| 42504.67393518519 | 21.1 |
| 42504.694768518515 | 21.1 |
| 42504.71560185185 | 21 |
| 42504.73643518519 | 21.1 |
| 42504.757268518515 | 21.2 |
| 42504.77810185185 | 21.2 |
| 42504.79893518519 | 21.1 |
| 42504.819768518515 | 21.1 |
| 42504.84060185185 | 21.1 |
| 42504.86143518519 | 21.1 |
| 42504.882268518515 | 21.1 |
| 42504.90310185185 | 21 |
| 42504.92393518519 | 21.1 |
| 42504.944768518515 | 21 |
| 42504.96560185185 | 21 |
| 42504.98643518519 | 21 |
| 42505.007268518515 | 21 |
| 42505.02810185185 | 21 |
| 42505.04893518519 | 21 |
| 42505.069768518515 | 21 |
| 42505.09060185185 | 21 |
| 42505.11143518519 | 21 |
| 42505.132268518515 | 20.9 |
| 42505.15310185185 | 20.9 |
| 42505.17393518519 | 20.9 |
| 42505.194768518515 | 20.9 |
| 42505.21560185185 | 20.9 |
| 42505.23643518519 | 20.9 |
| 42505.257268518515 | 20.8 |
| 42505.27810185185 | 20.9 |
| 42505.29893518519 | 20.9 |
| 42505.319768518515 | 20.9 |
| 42505.34060185185 | 20.8 |
| 42505.36143518519 | 20.9 |
| 42505.382268518515 | 20.9 |
| 42505.40310185185 | 20.9 |
| 42505.42393518519 | 20.9 |
| 42505.444768518515 | 20.9 |
| 42505.46560185185 | 20.9 |
| 42505.48643518519 | 21 |
| 42505.507268518515 | 21 |
| 42505.52810185185 | 21 |
| 42505.54893518519 | 21 |
| 42505.569768518515 | 21 |
| 42505.59060185185 | 21.1 |
| 42505.61143518519 | 21.1 |
| 42505.632268518515 | 21 |
| 42505.65310185185 | 21.1 |
| 42505.67393518519 | 21.1 |
| 42505.694768518515 | 21.1 |
| 42505.71560185185 | 21.1 |
| 42505.73643518519 | 21.2 |
| 42505.757268518515 | 21.2 |
| 42505.77810185185 | 21.1 |
| 42505.79893518519 | 21.1 |
| 42505.819768518515 | 21.1 |
| 42505.84060185185 | 21.1 |
| 42505.86143518519 | 21 |
| 42505.882268518515 | 21.1 |
| 42505.90310185185 | 21 |
| 42505.92393518519 | 21 |
| 42505.944768518515 | 20.9 |
| 42505.96560185185 | 20.9 |
| 42505.98643518519 | 21 |
| 42506.007268518515 | 20.9 |
| 42506.02810185185 | 20.9 |
| 42506.04893518519 | 20.9 |
| 42506.069768518515 | 20.9 |
| 42506.09060185185 | 20.8 |
| 42506.11143518519 | 20.8 |
| 42506.132268518515 | 20.8 |
| 42506.15310185185 | 20.8 |
| 42506.17393518519 | 20.8 |
| 42506.194768518515 | 20.8 |
| 42506.21560185185 | 20.8 |
| 42506.23643518519 | 20.8 |
| 42506.257268518515 | 20.8 |
| 42506.27810185185 | 20.8 |
| 42506.29893518519 | 20.8 |
| 42506.319768518515 | 20.8 |
| 42506.34060185185 | 20.8 |
| 42506.36143518519 | 20.9 |
| 42506.382268518515 | 20.8 |
| 42506.40310185185 | 20.8 |
| 42506.42393518519 | 20.9 |
| 42506.444768518515 | 20.9 |
| 42506.46560185185 | 20.9 |
| 42506.48643518519 | 20.9 |
| 42506.507268518515 | 20.9 |
| 42506.52810185185 | 20.9 |
| 42506.54893518519 | 20.9 |
| 42506.569768518515 | 21 |
| 42506.59060185185 | 21 |
| 42506.61143518519 | 21 |
| 42506.632268518515 | 21 |
| 42506.65310185185 | 21 |
| 42506.67393518519 | 21 |
| 42506.694768518515 | 21.1 |
| 42506.71560185185 | 21.1 |
| 42506.73643518519 | 21.1 |
| 42506.757268518515 | 21.1 |
| 42506.77810185185 | 21.1 |
| 42506.79893518519 | 21.1 |
| 42506.819768518515 | 21.1 |
| 42506.84060185185 | 21.1 |
| 42506.86143518519 | 21 |
| 42506.882268518515 | 21.1 |
| 42506.90310185185 | 21 |
| 42506.92393518519 | 21 |
| 42506.944768518515 | 21 |
| 42506.96560185185 | 21 |
| 42506.98643518519 | 21 |
| 42507.007268518515 | 20.9 |
| 42507.02810185185 | 21 |
| 42507.04893518519 | 20.9 |
| 42507.069768518515 | 21 |
| 42507.09060185185 | 20.9 |
| 42507.11143518519 | 20.9 |
| 42507.132268518515 | 20.9 |
| 42507.15310185185 | 20.9 |
| 42507.17393518519 | 20.9 |
| 42507.194768518515 | 20.9 |
| 42507.21560185185 | 20.9 |
| 42507.23643518519 | 20.9 |
| 42507.257268518515 | 20.9 |
| 42507.27810185185 | 20.9 |
| 42507.29893518519 | 20.9 |
| 42507.319768518515 | 20.9 |
| 42507.34060185185 | 20.9 |
| 42507.36143518519 | 20.9 |
| 42507.382268518515 | 20.9 |
| 42507.40310185185 | 20.9 |
| 42507.42393518519 | 20.9 |
| 42507.444768518515 | 21 |
| 42507.46560185185 | 21 |
| 42507.48643518519 | 21 |
| 42507.507268518515 | 21.1 |
| 42507.52810185185 | 21.1 |
| 42507.54893518519 | 21 |
| 42507.569768518515 | 21.2 |
| 42507.59060185185 | 21.1 |
| 42507.61143518519 | 21.2 |
| 42507.632268518515 | 21.1 |
| 42507.65310185185 | 21.1 |
| 42507.67393518519 | 21.1 |
| 42507.694768518515 | 21.1 |
| 42507.71560185185 | 21.2 |
| 42507.73643518519 | 21.1 |
| 42507.757268518515 | 21.1 |
| 42507.77810185185 | 21.2 |
| 42507.79893518519 | 21 |
| 42507.819768518515 | 21 |
| 42507.84060185185 | 21 |
| 42507.86143518519 | 21 |
| 42507.882268518515 | 21.1 |
| 42507.90310185185 | 21 |
| 42507.92393518519 | 21 |
| 42507.944768518515 | 21 |
| 42507.96560185185 | 21 |
| 42507.98643518519 | 20.9 |
| 42508.007268518515 | 20.9 |
| 42508.02810185185 | 20.9 |
| 42508.04893518519 | 20.9 |
| 42508.069768518515 | 20.9 |
| 42508.09060185185 | 20.9 |
| 42508.11143518519 | 20.8 |
| 42508.132268518515 | 20.8 |
| 42508.15310185185 | 20.7 |
| 42508.17393518519 | 20.8 |
| 42508.194768518515 | 20.7 |
| 42508.21560185185 | 20.7 |
| 42508.23643518519 | 20.7 |
| 42508.257268518515 | 20.4 |
| 42508.27810185185 | 20.9 |
| 42508.29893518519 | 20.9 |
| 42508.319768518515 | 21 |
| 42508.34060185185 | 21 |
| 42508.36143518519 | 21 |
| 42508.382268518515 | 21 |
| 42508.40310185185 | 20.9 |
| 42508.42393518519 | 20.9 |
| 42508.444768518515 | 21 |
| 42508.46560185185 | 21.1 |
| 42508.48643518519 | 21.1 |
| 42508.507268518515 | 21 |
| 42508.52810185185 | 21.1 |
| 42508.54893518519 | 21 |
| 42508.569768518515 | 21 |
| 42508.59060185185 | 21 |
| 42508.61143518519 | 21 |
| 42508.632268518515 | 21 |
| 42508.65310185185 | 21.1 |
| 42508.67393518519 | 21 |
| 42508.694768518515 | 21 |
| 42508.71560185185 | 21 |
| 42508.73643518519 | 21 |
| 42508.757268518515 | 21 |
| 42508.77810185185 | 21 |
| 42508.79893518519 | 21 |
| 42508.819768518515 | 21 |
| 42508.84060185185 | 20.9 |
| 42508.86143518519 | 20.9 |
| 42508.882268518515 | 20.9 |
| 42508.90310185185 | 20.8 |
| 42508.92393518519 | 20.8 |
| 42508.944768518515 | 20.8 |
| 42508.96560185185 | 20.8 |
| 42508.98643518519 | 20.8 |
| 42509.007268518515 | 20.8 |
| 42509.02810185185 | 20.8 |
| 42509.04893518519 | 20.7 |
| 42509.069768518515 | 20.7 |
| 42509.09060185185 | 20.7 |
| 42509.11143518519 | 20.7 |
| 42509.132268518515 | 20.7 |
| 42509.15310185185 | 20.7 |
| 42509.17393518519 | 20.7 |
| 42509.194768518515 | 20.7 |
| 42509.21560185185 | 20.7 |
| 42509.23643518519 | 20.7 |
| 42509.257268518515 | 20.7 |
| 42509.27810185185 | 20.6 |
| 42509.29893518519 | 20.7 |
| 42509.319768518515 | 20.6 |
| 42509.34060185185 | 20.6 |
| 42509.36143518519 | 20.6 |
| 42509.382268518515 | 20.7 |
| 42509.40310185185 | 20.7 |
| 42509.42393518519 | 20.9 |
| 42509.444768518515 | 20.7 |
| 42509.46560185185 | 20.7 |
| 42509.48643518519 | 20.7 |
| 42509.507268518515 | 20.9 |
| 42509.52810185185 | 20.9 |
| 42509.54893518519 | 20.7 |
| 42509.569768518515 | 20.7 |
| 42509.59060185185 | 20.8 |
| 42509.61143518519 | 20.8 |
| 42509.632268518515 | 20.8 |
| 42509.65310185185 | 20.8 |
| 42509.67393518519 | 20.8 |
| 42509.694768518515 | 20.9 |
| 42509.71560185185 | 20.8 |
| 42509.73643518519 | 20.8 |
| 42509.757268518515 | 20.8 |
| 42509.77810185185 | 20.9 |
| 42509.79893518519 | 20.9 |
| 42509.819768518515 | 20.9 |
| 42509.84060185185 | 20.8 |
| 42509.86143518519 | 20.9 |
| 42509.882268518515 | 20.8 |
| 42509.90310185185 | 20.8 |
| 42509.92393518519 | 20.8 |
| 42509.944768518515 | 20.8 |
| 42509.96560185185 | 20.8 |
| 42509.98643518519 | 20.8 |
| 42510.007268518515 | 20.8 |
| 42510.02810185185 | 20.8 |
| 42510.04893518519 | 20.8 |
| 42510.069768518515 | 20.8 |
| 42510.09060185185 | 20.7 |
| 42510.11143518519 | 20.8 |
| 42510.132268518515 | 20.7 |
| 42510.15310185185 | 20.7 |
| 42510.17393518519 | 20.7 |
| 42510.194768518515 | 20.7 |
| 42510.21560185185 | 20.7 |
| 42510.23643518519 | 20.6 |
| 42510.257268518515 | 20.6 |
| 42510.27810185185 | 20.6 |
| 42510.29893518519 | 20.6 |
| 42510.319768518515 | 20.6 |
| 42510.34060185185 | 20.7 |
| 42510.36143518519 | 20.6 |
| 42510.382268518515 | 20.6 |
| 42510.40310185185 | 20.7 |
| 42510.42393518519 | 20.7 |
| 42510.444768518515 | 20.7 |
| 42510.46560185185 | 20.7 |
| 42510.48643518519 | 20.7 |
| 42510.507268518515 | 20.8 |
| 42510.52810185185 | 20.8 |
| 42510.54893518519 | 20.9 |
| 42510.569768518515 | 20.9 |
| 42510.59060185185 | 20.9 |
| 42510.61143518519 | 20.9 |
| 42510.632268518515 | 20.9 |
| 42510.65310185185 | 21 |
| 42510.67393518519 | 21 |
| 42510.694768518515 | 21 |
| 42510.71560185185 | 21 |
| 42510.73643518519 | 21 |
| 42510.757268518515 | 21 |
| 42510.77810185185 | 21 |
| 42510.79893518519 | 21 |
| 42510.819768518515 | 21 |
| 42510.84060185185 | 21 |
| 42510.86143518519 | 20.9 |
| 42510.882268518515 | 21 |
| 42510.90310185185 | 20.9 |
| 42510.92393518519 | 20.9 |
| 42510.944768518515 | 20.9 |
| 42510.96560185185 | 20.9 |
| 42510.98643518519 | 20.9 |
| 42511.007268518515 | 20.8 |
| 42511.02810185185 | 20.8 |
| 42511.04893518519 | 20.8 |
| 42511.069768518515 | 20.8 |
| 42511.09060185185 | 20.7 |
| 42511.11143518519 | 20.8 |
| 42511.132268518515 | 20.7 |
| 42511.15310185185 | 20.7 |
| 42511.17393518519 | 20.7 |
| 42511.194768518515 | 20.7 |
| 42511.21560185185 | 20.7 |
| 42511.23643518519 | 20.7 |
| 42511.257268518515 | 20.6 |
| 42511.27810185185 | 20.7 |
| 42511.29893518519 | 20.6 |
| 42511.319768518515 | 20.7 |
| 42511.34060185185 | 20.7 |
| 42511.36143518519 | 20.7 |
| 42511.382268518515 | 20.7 |
| 42511.40310185185 | 20.7 |
| 42511.42393518519 | 20.8 |
| 42511.444768518515 | 20.8 |
| 42511.46560185185 | 20.8 |
| 42511.48643518519 | 20.8 |
| 42511.507268518515 | 20.8 |
| 42511.52810185185 | 20.8 |
| 42511.54893518519 | 20.9 |
| 42511.569768518515 | 20.9 |
| 42511.59060185185 | 21 |
| 42511.61143518519 | 21 |
| 42511.632268518515 | 21 |
| 42511.65310185185 | 21 |
| 42511.67393518519 | 21 |
| 42511.694768518515 | 21.1 |
| 42511.71560185185 | 21.1 |
| 42511.73643518519 | 21.1 |
| 42511.757268518515 | 21.2 |
| 42511.77810185185 | 21.2 |
| 42511.79893518519 | 21.2 |
| 42511.819768518515 | 21.1 |
| 42511.84060185185 | 21.1 |
| 42511.86143518519 | 21.1 |
| 42511.882268518515 | 21 |
| 42511.90310185185 | 21 |
| 42511.92393518519 | 21 |
| 42511.944768518515 | 21 |
| 42511.96560185185 | 21.1 |
| 42511.98643518519 | 21 |
| 42512.007268518515 | 20.9 |
| 42512.02810185185 | 20.9 |
| 42512.04893518519 | 20.9 |
| 42512.069768518515 | 20.9 |
| 42512.09060185185 | 20.9 |
| 42512.11143518519 | 20.8 |
| 42512.132268518515 | 20.9 |
| 42512.15310185185 | 20.8 |
| 42512.17393518519 | 20.8 |
| 42512.194768518515 | 20.8 |
| 42512.21560185185 | 20.8 |
| 42512.23643518519 | 20.8 |
| 42512.257268518515 | 20.8 |
| 42512.27810185185 | 20.8 |
| 42512.29893518519 | 20.8 |
| 42512.319768518515 | 20.8 |
| 42512.34060185185 | 20.8 |
| 42512.36143518519 | 20.9 |
| 42512.382268518515 | 20.8 |
| 42512.40310185185 | 20.9 |
| 42512.42393518519 | 20.9 |
| 42512.444768518515 | 20.9 |
| 42512.46560185185 | 20.9 |
| 42512.48643518519 | 20.9 |
| 42512.507268518515 | 20.9 |
| 42512.52810185185 | 20.9 |
| 42512.54893518519 | 20.9 |
| 42512.569768518515 | 20.9 |
| 42512.59060185185 | 20.9 |
| 42512.61143518519 | 20.9 |
| 42512.632268518515 | 20.9 |
| 42512.65310185185 | 20.9 |
| 42512.67393518519 | 21 |
| 42512.694768518515 | 21 |
| 42512.71560185185 | 20.9 |
| 42512.73643518519 | 21 |
| 42512.757268518515 | 20.9 |
| 42512.77810185185 | 21 |
| 42512.79893518519 | 20.9 |
| 42512.819768518515 | 20.9 |
| 42512.84060185185 | 20.8 |
| 42512.86143518519 | 20.8 |
| 42512.882268518515 | 20.7 |
| 42512.90310185185 | 20.7 |
| 42512.92393518519 | 20.7 |
| 42512.944768518515 | 20.7 |
| 42512.96560185185 | 20.7 |
| 42512.98643518519 | 20.7 |
| 42513.007268518515 | 20.7 |
| 42513.02810185185 | 20.7 |
| 42513.04893518519 | 20.7 |
| 42513.069768518515 | 20.7 |
| 42513.09060185185 | 20.7 |
| 42513.11143518519 | 20.6 |
| 42513.132268518515 | 20.6 |
| 42513.15310185185 | 20.6 |
| 42513.17393518519 | 20.6 |
| 42513.194768518515 | 20.6 |
| 42513.21560185185 | 20.6 |
| 42513.23643518519 | 20.6 |
| 42513.257268518515 | 20.6 |
| 42513.27810185185 | 20.6 |
| 42513.29893518519 | 20.5 |
| 42513.319768518515 | 20.6 |
| 42513.34060185185 | 20.5 |
| 42513.36143518519 | 20.6 |
| 42513.382268518515 | 20.6 |
| 42513.40310185185 | 20.7 |
| 42513.42393518519 | 20.7 |
| 42513.444768518515 | 20.7 |
| 42513.46560185185 | 20.7 |
| 42513.48643518519 | 20.7 |
| 42513.507268518515 | 20.7 |
| 42513.52810185185 | 20.7 |
| 42513.54893518519 | 20.7 |
| 42513.569768518515 | 20.7 |
| 42513.59060185185 | 20.7 |
| 42513.61143518519 | 20.8 |
| 42513.632268518515 | 20.7 |
| 42513.65310185185 | 20.7 |
| 42513.67393518519 | 20.6 |
| 42513.694768518515 | 20.7 |
| 42513.71560185185 | 20.6 |
| 42513.73643518519 | 20.7 |
| 42513.757268518515 | 20.6 |
| 42513.77810185185 | 20.6 |
| 42513.79893518519 | 20.6 |
| 42513.819768518515 | 20.6 |
| 42513.84060185185 | 20.7 |
| 42513.86143518519 | 20.7 |
| 42513.882268518515 | 20.7 |
| 42513.90310185185 | 20.7 |
| 42513.92393518519 | 20.7 |
| 42513.944768518515 | 20.7 |
| 42513.96560185185 | 20.6 |
| 42513.98643518519 | 20.7 |
| 42514.007268518515 | 20.7 |
| 42514.02810185185 | 20.7 |
| 42514.04893518519 | 20.7 |
| 42514.069768518515 | 20.7 |
| 42514.09060185185 | 20.7 |
| 42514.11143518519 | 20.7 |
| 42514.132268518515 | 20.6 |
| 42514.15310185185 | 20.7 |
| 42514.17393518519 | 20.6 |
| 42514.194768518515 | 20.6 |
| 42514.21560185185 | 20.6 |
| 42514.23643518519 | 20.6 |
| 42514.257268518515 | 20.6 |
| 42514.27810185185 | 20.6 |
| 42514.29893518519 | 20.7 |
| 42514.319768518515 | 20.6 |
| 42514.34060185185 | 20.7 |
| 42514.36143518519 | 20.7 |
| 42514.382268518515 | 20.7 |
| 42514.40310185185 | 20.7 |
| 42514.42393518519 | 20.7 |
| 42514.444768518515 | 20.9 |
| 42514.46560185185 | 21.2 |
| 42514.48643518519 | 20.9 |
| 42514.507268518515 | 21 |
| 42514.52810185185 | 21.1 |
| 42514.54893518519 | 21.2 |
| 42514.569768518515 | 21.2 |
| 42514.59060185185 | 21.1 |
| 42514.61143518519 | 21.2 |
| 42514.632268518515 | 21.1 |
| 42514.65310185185 | 21.3 |
| 42514.67393518519 | 20.7 |
| 42514.694768518515 | 20.9 |
| 42514.71560185185 | 20.9 |
| 42514.73643518519 | 20.9 |
| 42514.757268518515 | 20.9 |
| 42514.77810185185 | 20.9 |
| 42514.79893518519 | 20.9 |
| 42514.819768518515 | 20.9 |
| 42514.84060185185 | 20.9 |
| 42514.86143518519 | 20.8 |
| 42514.882268518515 | 20.8 |
| 42514.90310185185 | 20.8 |
| 42514.92393518519 | 20.8 |
| 42514.944768518515 | 20.9 |
| 42514.96560185185 | 20.9 |
| 42514.98643518519 | 20.9 |
| 42515.007268518515 | 20.9 |
| 42515.02810185185 | 20.9 |
| 42515.04893518519 | 20.9 |
| 42515.069768518515 | 20.9 |
| 42515.09060185185 | 20.8 |
| 42515.11143518519 | 20.8 |
| 42515.132268518515 | 20.8 |
| 42515.15310185185 | 20.8 |
| 42515.17393518519 | 20.8 |
| 42515.194768518515 | 20.8 |
| 42515.21560185185 | 20.7 |
| 42515.23643518519 | 20.7 |
| 42515.257268518515 | 20.7 |
| 42515.27810185185 | 20.7 |
| 42515.29893518519 | 20.7 |
| 42515.319768518515 | 20.7 |
| 42515.34060185185 | 20.7 |
| 42515.36143518519 | 20.8 |
| 42515.382268518515 | 20.9 |
| 42515.40310185185 | 21.2 |
| 42515.42393518519 | 20.9 |
| 42515.444768518515 | 20.9 |
| 42515.46560185185 | 20.9 |
| 42515.48643518519 | 20.7 |
| 42515.507268518515 | 20.8 |
| 42515.52810185185 | 20.9 |
| 42515.54893518519 | 20.9 |
| 42515.569768518515 | 20.9 |
| 42515.59060185185 | 20.9 |
| 42515.61143518519 | 20.9 |
| 42515.632268518515 | 20.8 |
| 42515.65310185185 | 21.2 |
| 42515.67393518519 | 21.2 |
| 42515.694768518515 | 21.2 |
| 42515.71560185185 | 21.1 |
| 42515.73643518519 | 21.1 |
| 42515.757268518515 | 21 |
| 42515.77810185185 | 21.1 |
| 42515.79893518519 | 21.1 |
| 42515.819768518515 | 21.1 |
| 42515.84060185185 | 21.1 |
| 42515.86143518519 | 21.1 |
| 42515.882268518515 | 21.1 |
| 42515.90310185185 | 21.1 |
| 42515.92393518519 | 21.1 |
| 42515.944768518515 | 21 |
| 42515.96560185185 | 21 |
| 42515.98643518519 | 21 |
| 42516.007268518515 | 21 |
| 42516.02810185185 | 21 |
| 42516.04893518519 | 21 |
| 42516.069768518515 | 21 |
| 42516.09060185185 | 20.9 |
| 42516.11143518519 | 21 |
| 42516.132268518515 | 20.9 |
| 42516.15310185185 | 21 |
| 42516.17393518519 | 20.9 |
| 42516.194768518515 | 21 |
| 42516.21560185185 | 21 |
| 42516.23643518519 | 20.9 |
| 42516.257268518515 | 20.9 |
| 42516.27810185185 | 20.9 |
| 42516.29893518519 | 20.9 |
| 42516.319768518515 | 20.9 |
| 42516.34060185185 | 21 |
| 42516.36143518519 | 21 |
| 42516.382268518515 | 21 |
| 42516.40310185185 | 21 |
| 42516.42393518519 | 21.1 |
| 42516.444768518515 | 21.1 |
| 42516.46560185185 | 21.2 |
| 42516.48643518519 | 21.2 |
| 42516.507268518515 | 21.2 |
| 42516.52810185185 | 21.2 |
| 42516.54893518519 | 21.3 |
| 42516.569768518515 | 21.2 |
| 42516.59060185185 | 21.2 |
| 42516.61143518519 | 21.2 |
| 42516.632268518515 | 21.3 |
| 42516.65310185185 | 21.3 |
| 42516.67393518519 | 21.3 |
| 42516.694768518515 | 21.5 |
| 42516.71560185185 | 21.5 |
| 42516.73643518519 | 21.2 |
| 42516.757268518515 | 21.5 |
| 42516.77810185185 | 21.2 |
| 42516.79893518519 | 21.1 |
| 42516.819768518515 | 21 |
| 42516.84060185185 | 21.1 |
| 42516.86143518519 | 21.1 |
| 42516.882268518515 | 21.1 |
| 42516.90310185185 | 21 |
| 42516.92393518519 | 21 |
| 42516.944768518515 | 21 |
| 42516.96560185185 | 21.1 |
| 42516.98643518519 | 21.1 |
| 42517.007268518515 | 21 |
| 42517.02810185185 | 21 |
| 42517.04893518519 | 21 |
| 42517.069768518515 | 21 |
| 42517.09060185185 | 21 |
| 42517.11143518519 | 21 |
| 42517.132268518515 | 21.1 |
| 42517.15310185185 | 21 |
| 42517.17393518519 | 21.1 |
| 42517.194768518515 | 21.1 |
| 42517.21560185185 | 21.1 |
| 42517.23643518519 | 21 |
| 42517.257268518515 | 21.1 |
| 42517.27810185185 | 21.1 |
| 42517.29893518519 | 21.1 |
| 42517.319768518515 | 21.1 |
| 42517.34060185185 | 21.1 |
| 42517.36143518519 | 21.1 |
| 42517.382268518515 | 21 |
| 42517.40310185185 | 21.1 |
| 42517.42393518519 | 21 |
| 42517.444768518515 | 21.1 |
| 42517.46560185185 | 21.1 |
| 42517.48643518519 | 21 |
| 42517.507268518515 | 21.1 |
| 42517.52810185185 | 21.2 |
| 42517.54893518519 | 21.1 |
| 42517.569768518515 | 21.2 |
| 42517.59060185185 | 21.1 |
| 42517.61143518519 | 21.3 |
| 42517.632268518515 | 21.3 |
| 42517.65310185185 | 21.3 |
| 42517.67393518519 | 21.3 |
| 42517.694768518515 | 21.3 |
| 42517.71560185185 | 21.3 |
| 42517.73643518519 | 21.3 |
| 42517.757268518515 | 21.3 |
| 42517.77810185185 | 21.3 |
| 42517.79893518519 | 21.3 |
| 42517.819768518515 | 21.3 |
| 42517.84060185185 | 21.3 |
| 42517.86143518519 | 21.3 |
| 42517.882268518515 | 21.2 |
| 42517.90310185185 | 21.2 |
| 42517.92393518519 | 21.2 |
| 42517.944768518515 | 21.2 |
| 42517.96560185185 | 21 |
| 42517.98643518519 | 21.1 |
| 42518.007268518515 | 21.1 |
| 42518.02810185185 | 21.1 |
| 42518.04893518519 | 21.1 |
| 42518.069768518515 | 21 |
| 42518.09060185185 | 21 |
| 42518.11143518519 | 21 |
| 42518.132268518515 | 21 |
| 42518.15310185185 | 21.1 |
| 42518.17393518519 | 21 |
| 42518.194768518515 | 20.9 |
| 42518.21560185185 | 20.9 |
| 42518.23643518519 | 20.9 |
| 42518.257268518515 | 21 |
| 42518.27810185185 | 21 |
| 42518.29893518519 | 20.9 |
| 42518.319768518515 | 20.9 |
| 42518.34060185185 | 20.9 |
| 42518.36143518519 | 21 |
| 42518.382268518515 | 21 |
| 42518.40310185185 | 21 |
| 42518.42393518519 | 21 |
| 42518.444768518515 | 21 |
| 42518.46560185185 | 21 |
| 42518.48643518519 | 21.1 |
| 42518.507268518515 | 21.1 |
| 42518.52810185185 | 21.1 |
| 42518.54893518519 | 21.1 |
| 42518.569768518515 | 21.1 |
| 42518.59060185185 | 21.1 |
| 42518.61143518519 | 21.2 |
| 42518.632268518515 | 21.2 |
| 42518.65310185185 | 21.2 |
| 42518.67393518519 | 21.2 |
| 42518.694768518515 | 21.2 |
| 42518.71560185185 | 21.3 |
| 42518.73643518519 | 21.3 |
| 42518.757268518515 | 21.2 |
| 42518.77810185185 | 21.2 |
| 42518.79893518519 | 21.1 |
| 42518.819768518515 | 21.2 |
| 42518.84060185185 | 21.2 |
| 42518.86143518519 | 21.1 |
| 42518.882268518515 | 21.2 |
| 42518.90310185185 | 21.2 |
| 42518.92393518519 | 21.2 |
| 42518.944768518515 | 21.1 |
| 42518.96560185185 | 21.1 |
| 42518.98643518519 | 21.1 |
| 42519.007268518515 | 21 |
| 42519.02810185185 | 21 |
| 42519.04893518519 | 21.1 |
| 42519.069768518515 | 21 |
| 42519.09060185185 | 21 |
| 42519.11143518519 | 20.9 |
| 42519.132268518515 | 20.9 |
| 42519.15310185185 | 21 |
| 42519.17393518519 | 21 |
| 42519.194768518515 | 21 |
| 42519.21560185185 | 20.9 |
| 42519.23643518519 | 20.9 |
| 42519.257268518515 | 21 |
| 42519.27810185185 | 21 |
| 42519.29893518519 | 21 |
| 42519.319768518515 | 20.9 |
| 42519.34060185185 | 20.9 |
| 42519.36143518519 | 20.9 |
| 42519.382268518515 | 21 |
| 42519.40310185185 | 21 |
| 42519.42393518519 | 21 |
| 42519.444768518515 | 20.9 |
| 42519.46560185185 | 21 |
| 42519.48643518519 | 21 |
| 42519.507268518515 | 21 |
| 42519.52810185185 | 20.9 |
| 42519.54893518519 | 21 |
| 42519.569768518515 | 20.9 |
| 42519.59060185185 | 21 |
| 42519.61143518519 | 21 |
| 42519.632268518515 | 20.9 |
| 42519.65310185185 | 20.9 |
| 42519.67393518519 | 20.9 |
| 42519.694768518515 | 20.9 |
| 42519.71560185185 | 21 |
| 42519.73643518519 | 20.9 |
| 42519.757268518515 | 20.9 |
| 42519.77810185185 | 20.9 |
| 42519.79893518519 | 20.9 |
| 42519.819768518515 | 20.9 |
| 42519.84060185185 | 20.9 |
| 42519.86143518519 | 20.9 |
| 42519.882268518515 | 20.8 |
| 42519.90310185185 | 20.9 |
| 42519.92393518519 | 20.8 |
| 42519.944768518515 | 20.8 |
| 42519.96560185185 | 20.8 |
| 42519.98643518519 | 20.8 |
| 42520.007268518515 | 20.9 |
| 42520.02810185185 | 20.8 |
| 42520.04893518519 | 20.8 |
| 42520.069768518515 | 20.8 |
| 42520.09060185185 | 20.8 |
| 42520.11143518519 | 20.9 |
| 42520.132268518515 | 20.9 |
| 42520.15310185185 | 20.9 |
| 42520.17393518519 | 20.9 |
| 42520.194768518515 | 20.8 |
| 42520.21560185185 | 20.9 |
| 42520.23643518519 | 20.9 |
| 42520.257268518515 | 20.9 |
| 42520.27810185185 | 20.9 |
| 42520.29893518519 | 20.8 |
| 42520.319768518515 | 20.8 |
| 42520.34060185185 | 20.8 |
| 42520.36143518519 | 20.8 |
| 42520.382268518515 | 20.8 |
| 42520.40310185185 | 20.9 |
| 42520.42393518519 | 20.9 |
| 42520.444768518515 | 20.9 |
| 42520.46560185185 | 20.8 |
| 42520.48643518519 | 20.8 |
| 42520.507268518515 | 20.9 |
| 42520.52810185185 | 20.9 |
| 42520.54893518519 | 20.9 |
| 42520.569768518515 | 20.9 |
| 42520.59060185185 | 20.9 |
| 42520.61143518519 | 20.9 |
| 42520.632268518515 | 20.9 |
| 42520.65310185185 | 20.8 |
| 42520.67393518519 | 20.9 |
| 42520.694768518515 | 20.9 |
| 42520.71560185185 | 20.9 |
| 42520.73643518519 | 20.9 |
| 42520.757268518515 | 20.9 |
| 42520.77810185185 | 20.8 |
| 42520.79893518519 | 20.9 |
| 42520.819768518515 | 20.9 |
| 42520.84060185185 | 20.9 |
| 42520.86143518519 | 20.9 |
| 42520.882268518515 | 20.9 |
| 42520.90310185185 | 20.8 |
| 42520.92393518519 | 20.9 |
| 42520.944768518515 | 20.9 |
| 42520.96560185185 | 20.9 |
| 42520.98643518519 | 20.9 |
| 42521.007268518515 | 20.9 |
| 42521.02810185185 | 20.9 |
| 42521.04893518519 | 20.8 |
| 42521.069768518515 | 20.8 |
| 42521.09060185185 | 20.9 |
| 42521.11143518519 | 20.9 |
| 42521.132268518515 | 20.9 |
| 42521.15310185185 | 20.8 |
| 42521.17393518519 | 20.8 |
| 42521.194768518515 | 20.8 |
| 42521.21560185185 | 20.8 |
| 42521.23643518519 | 20.8 |
| 42521.257268518515 | 20.8 |
| 42521.27810185185 | 20.8 |
| 42521.29893518519 | 20.8 |
| 42521.319768518515 | 20.8 |
| 42521.34060185185 | 20.8 |
| 42521.36143518519 | 20.8 |
| 42521.382268518515 | 20.8 |
| 42521.40310185185 | 20.8 |
| 42521.42393518519 | 20.7 |
| 42521.444768518515 | 20.8 |
| 42521.46560185185 | 20.8 |
| 42521.48643518519 | 20.8 |
| 42521.507268518515 | 20.8 |
| 42521.52810185185 | 20.8 |
| 42521.54893518519 | 20.8 |
| 42521.569768518515 | 20.8 |
| 42521.59060185185 | 20.8 |
| 42521.61143518519 | 20.8 |
| 42521.632268518515 | 20.8 |
| 42521.65310185185 | 20.8 |
| 42521.67393518519 | 20.9 |
| 42521.694768518515 | 20.9 |
| 42521.71560185185 | 20.8 |
| 42521.73643518519 | 20.8 |
| 42521.757268518515 | 20.9 |
| 42521.77810185185 | 20.9 |
| 42521.79893518519 | 20.9 |
| 42521.819768518515 | 20.9 |
| 42521.84060185185 | 20.9 |
| 42521.86143518519 | 20.9 |
| 42521.882268518515 | 20.8 |
| 42521.90310185185 | 20.9 |
| 42521.92393518519 | 20.8 |
| 42521.944768518515 | 20.8 |
| 42521.96560185185 | 20.9 |
| 42521.98643518519 | 20.8 |
| 42522.007268518515 | 20.8 |
| 42522.02810185185 | 20.8 |
| 42522.04893518519 | 20.8 |
| 42522.069768518515 | 20.8 |
| 42522.09060185185 | 20.8 |
| 42522.11143518519 | 20.8 |
| 42522.132268518515 | 20.8 |
| 42522.15310185185 | 20.7 |
| 42522.17393518519 | 20.8 |
| 42522.194768518515 | 20.8 |
| 42522.21560185185 | 20.8 |
| 42522.23643518519 | 20.7 |
| 42522.257268518515 | 20.6 |
| 42522.27810185185 | 20.9 |
| 42522.29893518519 | 21 |
| 42522.319768518515 | 21 |
| 42522.34060185185 | 20.9 |
| 42522.36143518519 | 21 |
| 42522.382268518515 | 21 |
| 42522.40310185185 | 21.1 |
| 42522.42393518519 | 21 |
| 42522.444768518515 | 21 |
| 42522.46560185185 | 21 |
| 42522.48643518519 | 20.9 |
| 42522.507268518515 | 21 |
| 42522.52810185185 | 20.9 |
| 42522.54893518519 | 20.9 |
| 42522.569768518515 | 20.9 |
| 42522.59060185185 | 20.9 |
| 42522.61143518519 | 20.9 |
| 42522.632268518515 | 20.9 |
| 42522.65310185185 | 21.1 |
| 42522.67393518519 | 20.9 |
| 42522.694768518515 | 20.9 |
| 42522.71560185185 | 21 |
| 42522.73643518519 | 20.9 |
| 42522.757268518515 | 21 |
| 42522.77810185185 | 20.9 |
| 42522.79893518519 | 21 |
| 42522.819768518515 | 21 |
| 42522.84060185185 | 20.9 |
| 42522.86143518519 | 20.9 |
| 42522.882268518515 | 20.9 |
| 42522.90310185185 | 20.9 |
| 42522.92393518519 | 20.9 |
| 42522.944768518515 | 20.9 |
| 42522.96560185185 | 20.9 |
| 42522.98643518519 | 20.8 |
| 42523.007268518515 | 20.9 |
| 42523.02810185185 | 20.8 |
| 42523.04893518519 | 20.9 |
| 42523.069768518515 | 20.8 |
| 42523.09060185185 | 20.9 |
| 42523.11143518519 | 20.9 |
| 42523.132268518515 | 20.8 |
| 42523.15310185185 | 20.9 |
| 42523.17393518519 | 20.8 |
| 42523.194768518515 | 20.9 |
| 42523.21560185185 | 20.9 |
| 42523.23643518519 | 20.9 |
| 42523.257268518515 | 20.9 |
| 42523.27810185185 | 20.8 |
| 42523.29893518519 | 20.9 |
| 42523.319768518515 | 20.9 |
| 42523.34060185185 | 20.9 |
| 42523.36143518519 | 20.9 |
| 42523.382268518515 | 20.9 |
| 42523.40310185185 | 20.8 |
| 42523.42393518519 | 20.8 |
| 42523.444768518515 | 20.9 |
| 42523.46560185185 | 20.9 |
| 42523.48643518519 | 20.9 |
| 42523.507268518515 | 20.9 |
| 42523.52810185185 | 20.8 |
| 42523.54893518519 | 20.9 |
| 42523.569768518515 | 20.9 |
| 42523.59060185185 | 20.9 |
| 42523.61143518519 | 20.9 |
| 42523.632268518515 | 20.9 |
| 42523.65310185185 | 20.8 |
| 42523.67393518519 | 20.9 |
| 42523.694768518515 | 20.9 |
| 42523.71560185185 | 20.9 |
| 42523.73643518519 | 20.9 |
| 42523.757268518515 | 20.8 |
| 42523.77810185185 | 20.9 |
| 42523.79893518519 | 20.9 |
| 42523.819768518515 | 20.9 |
| 42523.84060185185 | 20.9 |
| 42523.86143518519 | 20.9 |
| 42523.882268518515 | 20.9 |
| 42523.90310185185 | 20.8 |
| 42523.92393518519 | 20.9 |
| 42523.944768518515 | 20.9 |
| 42523.96560185185 | 20.9 |
| 42523.98643518519 | 20.9 |
| 42524.007268518515 | 20.9 |
| 42524.02810185185 | 20.9 |
| 42524.04893518519 | 20.9 |
| 42524.069768518515 | 20.9 |
| 42524.09060185185 | 20.9 |
| 42524.11143518519 | 20.9 |
| 42524.132268518515 | 20.9 |
| 42524.15310185185 | 20.9 |
| 42524.17393518519 | 20.9 |
| 42524.194768518515 | 20.9 |
| 42524.21560185185 | 20.9 |
| 42524.23643518519 | 20.9 |
| 42524.257268518515 | 20.9 |
| 42524.27810185185 | 20.9 |
| 42524.29893518519 | 20.9 |
| 42524.319768518515 | 20.8 |
| 42524.34060185185 | 20.9 |
| 42524.36143518519 | 20.9 |
| 42524.382268518515 | 20.9 |
| 42524.40310185185 | 20.9 |
| 42524.42393518519 | 20.8 |
| 42524.444768518515 | 20.9 |
| 42524.46560185185 | 20.9 |
| 42524.48643518519 | 20.8 |
| 42524.507268518515 | 20.8 |
| 42524.52810185185 | 20.9 |
| 42524.54893518519 | 20.8 |
| 42524.569768518515 | 20.9 |
| 42524.59060185185 | 20.9 |
| 42524.61143518519 | 20.9 |
| 42524.632268518515 | 20.9 |
| 42524.65310185185 | 20.9 |
| 42524.67393518519 | 20.9 |
| 42524.694768518515 | 20.9 |
| 42524.71560185185 | 20.9 |
| 42524.73643518519 | 20.9 |
| 42524.757268518515 | 20.9 |
| 42524.77810185185 | 20.9 |
| 42524.79893518519 | 20.9 |
| 42524.819768518515 | 20.9 |
| 42524.84060185185 | 20.9 |
| 42524.86143518519 | 20.9 |
| 42524.882268518515 | 20.9 |
| 42524.90310185185 | 21 |
| 42524.92393518519 | 20.9 |
| 42524.944768518515 | 20.9 |
| 42524.96560185185 | 20.9 |
| 42524.98643518519 | 20.8 |
| 42525.007268518515 | 20.9 |
| 42525.02810185185 | 20.9 |
| 42525.04893518519 | 20.9 |
| 42525.069768518515 | 20.9 |
| 42525.09060185185 | 20.9 |
| 42525.11143518519 | 20.9 |
| 42525.132268518515 | 20.9 |
| 42525.15310185185 | 20.8 |
| 42525.17393518519 | 20.8 |
| 42525.194768518515 | 20.9 |
| 42525.21560185185 | 20.9 |
| 42525.23643518519 | 20.9 |
| 42525.257268518515 | 20.9 |
| 42525.27810185185 | 20.8 |
| 42525.29893518519 | 20.9 |
| 42525.319768518515 | 20.9 |
| 42525.34060185185 | 20.9 |
| 42525.36143518519 | 21 |
| 42525.382268518515 | 20.8 |
| 42525.40310185185 | 20.8 |
| 42525.42393518519 | 20.9 |
| 42525.444768518515 | 20.9 |
| 42525.46560185185 | 20.8 |
| 42525.48643518519 | 20.9 |
| 42525.507268518515 | 20.8 |
| 42525.52810185185 | 20.9 |
| 42525.54893518519 | 20.9 |
| 42525.569768518515 | 20.9 |
| 42525.59060185185 | 20.9 |
| 42525.61143518519 | 20.9 |
| 42525.632268518515 | 20.9 |
| 42525.65310185185 | 21 |
| 42525.67393518519 | 20.9 |
| 42525.694768518515 | 20.9 |
| 42525.71560185185 | 21 |
| 42525.73643518519 | 21 |
| 42525.757268518515 | 21 |
| 42525.77810185185 | 20.9 |
| 42525.79893518519 | 21 |
| 42525.819768518515 | 20.9 |
| 42525.84060185185 | 21 |
| 42525.86143518519 | 21 |
| 42525.882268518515 | 20.9 |
| 42525.90310185185 | 20.9 |
| 42525.92393518519 | 20.9 |
| 42525.944768518515 | 20.9 |
| 42525.96560185185 | 20.9 |
| 42525.98643518519 | 20.9 |
| 42526.007268518515 | 20.9 |
| 42526.02810185185 | 20.9 |
| 42526.04893518519 | 21 |
| 42526.069768518515 | 20.9 |
| 42526.09060185185 | 20.9 |
| 42526.11143518519 | 20.9 |
| 42526.132268518515 | 20.8 |
| 42526.15310185185 | 21 |
| 42526.17393518519 | 20.9 |
| 42526.194768518515 | 20.9 |
| 42526.21560185185 | 20.9 |
| 42526.23643518519 | 20.9 |
| 42526.257268518515 | 20.9 |
| 42526.27810185185 | 21 |
| 42526.29893518519 | 20.9 |
| 42526.319768518515 | 20.9 |
| 42526.34060185185 | 20.8 |
| 42526.36143518519 | 20.9 |
| 42526.382268518515 | 21 |
| 42526.40310185185 | 20.9 |
| 42526.42393518519 | 20.9 |
| 42526.444768518515 | 20.9 |
| 42526.46560185185 | 20.9 |
| 42526.48643518519 | 21 |
| 42526.507268518515 | 20.9 |
| 42526.52810185185 | 21 |
| 42526.54893518519 | 21 |
| 42526.569768518515 | 20.9 |
| 42526.59060185185 | 20.9 |
| 42526.61143518519 | 21 |
| 42526.632268518515 | 21 |
| 42526.65310185185 | 21 |
| 42526.67393518519 | 21 |
| 42526.694768518515 | 21 |
| 42526.71560185185 | 21 |
| 42526.73643518519 | 21 |
| 42526.757268518515 | 21 |
| 42526.77810185185 | 20.9 |
| 42526.79893518519 | 21 |
| 42526.819768518515 | 21 |
| 42526.84060185185 | 21 |
| 42526.86143518519 | 21 |
| 42526.882268518515 | 20.9 |
| 42526.90310185185 | 20.9 |
| 42526.92393518519 | 20.9 |
| 42526.944768518515 | 21 |
| 42526.96560185185 | 20.9 |
| 42526.98643518519 | 20.9 |
| 42527.007268518515 | 20.9 |
| 42527.02810185185 | 20.9 |
| 42527.04893518519 | 20.9 |
| 42527.069768518515 | 20.9 |
| 42527.09060185185 | 20.9 |
| 42527.11143518519 | 20.9 |
| 42527.132268518515 | 21 |
| 42527.15310185185 | 20.9 |
| 42527.17393518519 | 20.9 |
| 42527.194768518515 | 20.8 |
| 42527.21560185185 | 20.9 |
| 42527.23643518519 | 21 |
| 42527.257268518515 | 20.9 |
| 42527.27810185185 | 20.9 |
| 42527.29893518519 | 20.9 |
| 42527.319768518515 | 20.9 |
| 42527.34060185185 | 21 |
| 42527.36143518519 | 20.9 |
| 42527.382268518515 | 20.9 |
| 42527.40310185185 | 20.9 |
| 42527.42393518519 | 20.9 |
| 42527.444768518515 | 20.9 |
| 42527.46560185185 | 20.9 |
| 42527.48643518519 | 21 |
| 42527.507268518515 | 21 |
| 42527.52810185185 | 21 |
| 42527.54893518519 | 21 |
| 42527.569768518515 | 21 |
| 42527.59060185185 | 21 |
| 42527.61143518519 | 21.1 |
| 42527.632268518515 | 21.1 |
| 42527.65310185185 | 21.2 |
| 42527.67393518519 | 21.1 |
| 42527.694768518515 | 21.2 |
| 42527.71560185185 | 21.2 |
| 42527.73643518519 | 21.2 |
| 42527.757268518515 | 21.2 |
| 42527.77810185185 | 21.2 |
| 42527.79893518519 | 21.2 |
| 42527.819768518515 | 21.1 |
| 42527.84060185185 | 21.1 |
| 42527.86143518519 | 21.1 |
| 42527.882268518515 | 21 |
| 42527.90310185185 | 21.1 |
| 42527.92393518519 | 21.1 |
| 42527.944768518515 | 21.1 |
| 42527.96560185185 | 21.1 |
| 42527.98643518519 | 21 |
| 42528.007268518515 | 21 |
| 42528.02810185185 | 21 |
| 42528.04893518519 | 21 |
| 42528.069768518515 | 21 |
| 42528.09060185185 | 21 |
| 42528.11143518519 | 20.9 |
| 42528.132268518515 | 20.9 |
| 42528.15310185185 | 20.9 |
| 42528.17393518519 | 21.2 |
| 42528.194768518515 | 21 |
| 42528.21560185185 | 21.1 |
| 42528.23643518519 | 21 |
| 42528.257268518515 | 21.1 |
| 42528.27810185185 | 21.1 |
| 42528.29893518519 | 21 |
| 42528.319768518515 | 21.1 |
| 42528.34060185185 | 21 |
| 42528.36143518519 | 21.1 |
| 42528.382268518515 | 21.1 |
| 42528.40310185185 | 21.1 |
| 42528.42393518519 | 21.2 |
| 42528.444768518515 | 21.1 |
| 42528.46560185185 | 21.2 |
| 42528.48643518519 | 21.1 |
| 42528.507268518515 | 21.2 |
| 42528.52810185185 | 21.2 |
| 42528.54893518519 | 21.3 |
| 42528.569768518515 | 21.3 |
| 42528.59060185185 | 21.4 |
| 42528.61143518519 | 21.4 |
| 42528.632268518515 | 21.4 |
| 42528.65310185185 | 21.4 |
| 42528.67393518519 | 21.3 |
| 42528.694768518515 | 21.3 |
| 42528.71560185185 | 21.4 |
| 42528.73643518519 | 21.1 |
| 42528.757268518515 | 21 |
| 42528.77810185185 | 21 |
| 42528.79893518519 | 21 |
| 42528.819768518515 | 20.9 |
| 42528.84060185185 | 21 |
| 42528.86143518519 | 21 |
| 42528.882268518515 | 20.9 |
| 42528.90310185185 | 20.9 |
| 42528.92393518519 | 20.9 |
| 42528.944768518515 | 20.8 |
| 42528.96560185185 | 20.9 |
| 42528.98643518519 | 20.8 |
| 42529.007268518515 | 20.8 |
| 42529.02810185185 | 20.8 |
| 42529.04893518519 | 20.8 |
| 42529.069768518515 | 20.8 |
| 42529.09060185185 | 20.7 |
| 42529.11143518519 | 20.8 |
| 42529.132268518515 | 20.8 |
| 42529.15310185185 | 20.8 |
| 42529.17393518519 | 20.7 |
| 42529.194768518515 | 20.7 |
| 42529.21560185185 | 20.7 |
| 42529.23643518519 | 20.7 |
| 42529.257268518515 | 20.7 |
| 42529.27810185185 | 20.7 |
| 42529.29893518519 | 20.7 |
| 42529.319768518515 | 20.7 |
| 42529.34060185185 | 20.7 |
| 42529.36143518519 | 20.7 |
| 42529.382268518515 | 20.7 |
| 42529.40310185185 | 20.7 |
| 42529.42393518519 | 20.8 |
| 42529.444768518515 | 20.8 |
| 42529.46560185185 | 20.7 |
| 42529.48643518519 | 20.8 |
| 42529.507268518515 | 20.8 |
| 42529.52810185185 | 20.9 |
| 42529.54893518519 | 20.9 |
| 42529.569768518515 | 21 |
| 42529.59060185185 | 21 |
| 42529.61143518519 | 21 |
| 42529.632268518515 | 21 |
| 42529.65310185185 | 21 |
| 42529.67393518519 | 21.1 |
| 42529.694768518515 | 21 |
| 42529.71560185185 | 21.1 |
| 42529.73643518519 | 21 |
| 42529.757268518515 | 21.1 |
| 42529.77810185185 | 21.1 |
| 42529.79893518519 | 21 |
| 42529.819768518515 | 21.1 |
| 42529.84060185185 | 21.1 |
| 42529.86143518519 | 21.1 |
| 42529.882268518515 | 21.1 |
| 42529.90310185185 | 21.1 |
| 42529.92393518519 | 21.1 |
| 42529.944768518515 | 21 |
| 42529.96560185185 | 21 |
| 42529.98643518519 | 21 |
| 42530.007268518515 | 21 |
| 42530.02810185185 | 21 |
| 42530.04893518519 | 21 |
| 42530.069768518515 | 20.9 |
| 42530.09060185185 | 20.9 |
| 42530.11143518519 | 20.9 |
| 42530.132268518515 | 20.9 |
| 42530.15310185185 | 20.9 |
| 42530.17393518519 | 20.9 |
| 42530.194768518515 | 20.9 |
| 42530.21560185185 | 20.9 |
| 42530.23643518519 | 20.9 |
| 42530.257268518515 | 20.9 |
| 42530.27810185185 | 20.9 |
| 42530.29893518519 | 20.9 |
| 42530.319768518515 | 20.9 |
| 42530.34060185185 | 20.9 |
| 42530.36143518519 | 20.9 |
| 42530.382268518515 | 20.9 |
| 42530.40310185185 | 20.9 |
| 42530.42393518519 | 20.9 |
| 42530.444768518515 | 21 |
| 42530.46560185185 | 20.9 |
| 42530.48643518519 | 21 |
| 42530.507268518515 | 21 |
| 42530.52810185185 | 21 |
| 42530.54893518519 | 21 |
| 42530.569768518515 | 21 |
| 42530.59060185185 | 21 |
| 42530.61143518519 | 21 |
| 42530.632268518515 | 21 |
| 42530.65310185185 | 21.1 |
| 42530.67393518519 | 21.1 |
| 42530.694768518515 | 21.1 |
| 42530.71560185185 | 21.1 |
| 42530.73643518519 | 21.1 |
| 42530.757268518515 | 21.2 |
| 42530.77810185185 | 21.1 |
| 42530.79893518519 | 21.2 |
| 42530.819768518515 | 21.2 |
| 42530.84060185185 | 21.1 |
| 42530.86143518519 | 21.1 |
| 42530.882268518515 | 21.1 |
| 42530.90310185185 | 21.1 |
| 42530.92393518519 | 21.1 |
| 42530.944768518515 | 21.1 |
| 42530.96560185185 | 21 |
| 42530.98643518519 | 21 |
| 42531.007268518515 | 21 |
| 42531.02810185185 | 21 |
| 42531.04893518519 | 21 |
| 42531.069768518515 | 21 |
| 42531.09060185185 | 21 |
| 42531.11143518519 | 21 |
| 42531.132268518515 | 21 |
| 42531.15310185185 | 20.9 |
| 42531.17393518519 | 20.9 |
| 42531.194768518515 | 20.9 |
| 42531.21560185185 | 20.9 |
| 42531.23643518519 | 21 |
| 42531.257268518515 | 20.9 |
| 42531.27810185185 | 20.9 |
| 42531.29893518519 | 20.9 |
| 42531.319768518515 | 20.9 |
| 42531.34060185185 | 21 |
| 42531.36143518519 | 20.9 |
| 42531.382268518515 | 21 |
| 42531.40310185185 | 20.9 |
| 42531.42393518519 | 21 |
| 42531.444768518515 | 21 |
| 42531.46560185185 | 21 |
| 42531.48643518519 | 21 |
| 42531.507268518515 | 21.1 |
| 42531.52810185185 | 21.1 |
| 42531.54893518519 | 21.1 |
| 42531.569768518515 | 21.1 |
| 42531.59060185185 | 21.1 |
| 42531.61143518519 | 21.2 |
| 42531.632268518515 | 21.2 |
| 42531.65310185185 | 21.2 |
| 42531.67393518519 | 21.2 |
| 42531.694768518515 | 21.2 |
| 42531.71560185185 | 21.2 |
| 42531.73643518519 | 21.3 |
| 42531.757268518515 | 21.2 |
| 42531.77810185185 | 21.2 |
| 42531.79893518519 | 21.2 |
| 42531.819768518515 | 21.2 |
| 42531.84060185185 | 21.2 |
| 42531.86143518519 | 21.2 |
| 42531.882268518515 | 21.2 |
| 42531.90310185185 | 21.2 |
| 42531.92393518519 | 21.1 |
| 42531.944768518515 | 21.2 |
| 42531.96560185185 | 21.2 |
| 42531.98643518519 | 21.1 |
| 42532.007268518515 | 21.2 |
| 42532.02810185185 | 21.1 |
| 42532.04893518519 | 21.1 |
| 42532.069768518515 | 21.1 |
| 42532.09060185185 | 21.1 |
| 42532.11143518519 | 21.1 |
| 42532.132268518515 | 21.1 |
| 42532.15310185185 | 21 |
| 42532.17393518519 | 21 |
| 42532.194768518515 | 21 |
| 42532.21560185185 | 21 |
| 42532.23643518519 | 21 |
| 42532.257268518515 | 21 |
| 42532.27810185185 | 21 |
| 42532.29893518519 | 20.9 |
| 42532.319768518515 | 20.9 |
| 42532.34060185185 | 20.9 |
| 42532.36143518519 | 21 |
| 42532.382268518515 | 20.9 |
| 42532.40310185185 | 20.9 |
| 42532.42393518519 | 20.9 |
| 42532.444768518515 | 20.9 |
| 42532.46560185185 | 21 |
| 42532.48643518519 | 21 |
| 42532.507268518515 | 20.9 |
| 42532.52810185185 | 20.9 |
| 42532.54893518519 | 20.9 |
| 42532.569768518515 | 20.9 |
| 42532.59060185185 | 20.9 |
| 42532.61143518519 | 21 |
| 42532.632268518515 | 20.9 |
| 42532.65310185185 | 21 |
| 42532.67393518519 | 21 |
| 42532.694768518515 | 21 |
| 42532.71560185185 | 21.1 |
| 42532.73643518519 | 21.1 |
| 42532.757268518515 | 21.1 |
| 42532.77810185185 | 21.1 |
| 42532.79893518519 | 21.1 |
| 42532.819768518515 | 21.1 |
| 42532.84060185185 | 21 |
| 42532.86143518519 | 21.1 |
| 42532.882268518515 | 21 |
| 42532.90310185185 | 21.1 |
| 42532.92393518519 | 21 |
| 42532.944768518515 | 21 |
| 42532.96560185185 | 21 |
| 42532.98643518519 | 21 |
| 42533.007268518515 | 20.9 |
| 42533.02810185185 | 20.9 |
| 42533.04893518519 | 20.9 |
| 42533.069768518515 | 20.9 |
| 42533.09060185185 | 20.9 |
| 42533.11143518519 | 20.9 |
| 42533.132268518515 | 20.9 |
| 42533.15310185185 | 20.9 |
| 42533.17393518519 | 20.9 |
| 42533.194768518515 | 20.9 |
| 42533.21560185185 | 20.9 |
| 42533.23643518519 | 20.9 |
| 42533.257268518515 | 20.9 |
| 42533.27810185185 | 20.9 |
| 42533.29893518519 | 20.9 |
| 42533.319768518515 | 20.9 |
| 42533.34060185185 | 20.9 |
| 42533.36143518519 | 20.9 |
| 42533.382268518515 | 20.9 |
| 42533.40310185185 | 20.9 |
| 42533.42393518519 | 20.9 |
| 42533.444768518515 | 21 |
| 42533.46560185185 | 21 |
| 42533.48643518519 | 20.9 |
| 42533.507268518515 | 20.9 |
| 42533.52810185185 | 20.9 |
| 42533.54893518519 | 21 |
| 42533.569768518515 | 21 |
| 42533.59060185185 | 21 |
| 42533.61143518519 | 21 |
| 42533.632268518515 | 20.9 |
| 42533.65310185185 | 21 |
| 42533.67393518519 | 21 |
| 42533.694768518515 | 21 |
| 42533.71560185185 | 21 |
| 42533.73643518519 | 21 |
| 42533.757268518515 | 21 |
| 42533.77810185185 | 21 |
| 42533.79893518519 | 21 |
| 42533.819768518515 | 21 |
| 42533.84060185185 | 21 |
| 42533.86143518519 | 21 |
| 42533.882268518515 | 21 |
| 42533.90310185185 | 21 |
| 42533.92393518519 | 21 |
| 42533.944768518515 | 21 |
| 42533.96560185185 | 21 |
| 42533.98643518519 | 21 |
| 42534.007268518515 | 20.9 |
| 42534.02810185185 | 21 |
| 42534.04893518519 | 21 |
| 42534.069768518515 | 21 |
| 42534.09060185185 | 20.9 |
| 42534.11143518519 | 21 |
| 42534.132268518515 | 20.9 |
| 42534.15310185185 | 20.9 |
| 42534.17393518519 | 20.9 |
| 42534.194768518515 | 20.9 |
| 42534.21560185185 | 20.9 |
| 42534.23643518519 | 20.9 |
| 42534.257268518515 | 20.9 |
| 42534.27810185185 | 20.9 |
| 42534.29893518519 | 20.9 |
| 42534.319768518515 | 20.9 |
| 42534.34060185185 | 20.9 |
| 42534.36143518519 | 20.9 |
| 42534.382268518515 | 20.9 |
| 42534.40310185185 | 20.9 |
| 42534.42393518519 | 20.9 |
| 42534.444768518515 | 20.9 |
| 42534.46560185185 | 20.9 |
| 42534.48643518519 | 20.9 |
| 42534.507268518515 | 20.8 |
| 42534.52810185185 | 20.9 |
| 42534.54893518519 | 20.9 |
| 42534.569768518515 | 20.9 |
| 42534.59060185185 | 20.9 |
| 42534.61143518519 | 20.9 |
| 42534.632268518515 | 20.9 |
| 42534.65310185185 | 20.9 |
| 42534.67393518519 | 20.9 |
| 42534.694768518515 | 21 |
| 42534.71560185185 | 20.9 |
| 42534.73643518519 | 20.9 |
| 42534.757268518515 | 20.9 |
| 42534.77810185185 | 20.9 |
| 42534.79893518519 | 20.9 |
| 42534.819768518515 | 20.9 |
| 42534.84060185185 | 20.9 |
| 42534.86143518519 | 20.9 |
| 42534.882268518515 | 20.9 |
| 42534.90310185185 | 20.9 |
| 42534.92393518519 | 20.9 |
| 42534.944768518515 | 20.9 |
| 42534.96560185185 | 20.9 |
| 42534.98643518519 | 20.9 |
| 42535.007268518515 | 20.9 |
| 42535.02810185185 | 20.9 |
| 42535.04893518519 | 20.8 |
| 42535.069768518515 | 20.9 |
| 42535.09060185185 | 20.9 |
| 42535.11143518519 | 20.9 |
| 42535.132268518515 | 21 |
| 42535.15310185185 | 20.9 |
| 42535.17393518519 | 20.9 |
| 42535.194768518515 | 20.9 |
| 42535.21560185185 | 20.8 |
| 42535.23643518519 | 20.8 |
| 42535.257268518515 | 20.8 |
| 42535.27810185185 | 20.8 |
| 42535.29893518519 | 20.9 |
| 42535.319768518515 | 20.8 |
| 42535.34060185185 | 20.8 |
| 42535.36143518519 | 20.8 |
| 42535.382268518515 | 20.8 |
| 42535.40310185185 | 20.8 |
| 42535.42393518519 | 20.8 |
| 42535.444768518515 | 20.8 |
| 42535.46560185185 | 20.9 |
| 42535.48643518519 | 21 |
| 42535.507268518515 | 20.9 |
| 42535.52810185185 | 20.9 |
| 42535.54893518519 | 20.9 |
| 42535.569768518515 | 20.9 |
| 42535.59060185185 | 20.9 |
| 42535.61143518519 | 20.9 |
| 42535.632268518515 | 20.9 |
| 42535.65310185185 | 20.9 |
| 42535.67393518519 | 20.9 |
| 42535.694768518515 | 20.9 |
| 42535.71560185185 | 21 |
| 42535.73643518519 | 21.1 |
| 42535.757268518515 | 21 |
| 42535.77810185185 | 21 |
| 42535.79893518519 | 20.9 |
| 42535.819768518515 | 21 |
| 42535.84060185185 | 20.9 |
| 42535.86143518519 | 20.9 |
| 42535.882268518515 | 20.9 |
| 42535.90310185185 | 20.9 |
| 42535.92393518519 | 20.9 |
| 42535.944768518515 | 20.9 |
| 42535.96560185185 | 20.9 |
| 42535.98643518519 | 21 |
| 42536.007268518515 | 20.9 |
| 42536.02810185185 | 20.9 |
| 42536.04893518519 | 20.9 |
| 42536.069768518515 | 20.8 |
| 42536.09060185185 | 20.9 |
| 42536.11143518519 | 20.8 |
| 42536.132268518515 | 20.7 |
| 42536.15310185185 | 21.1 |
| 42536.17393518519 | 20.9 |
| 42536.194768518515 | 21 |
| 42536.21560185185 | 20.9 |
| 42536.23643518519 | 20.9 |
| 42536.257268518515 | 20.8 |
| 42536.27810185185 | 20.9 |
| 42536.29893518519 | 20.9 |
| 42536.319768518515 | 20.9 |
| 42536.34060185185 | 20.9 |
| 42536.36143518519 | 20.9 |
| 42536.382268518515 | 20.9 |
| 42536.40310185185 | 21 |
| 42536.42393518519 | 21 |
| 42536.444768518515 | 21 |
| 42536.46560185185 | 21 |
| 42536.48643518519 | 21 |
| 42536.507268518515 | 21.3 |
| 42536.52810185185 | 21.2 |
| 42536.54893518519 | 21.1 |
| 42536.569768518515 | 21.1 |
| 42536.59060185185 | 21.1 |
| 42536.61143518519 | 21.1 |
| 42536.632268518515 | 21.2 |
| 42536.65310185185 | 21.2 |
| 42536.67393518519 | 21.1 |
| 42536.694768518515 | 21.1 |
| 42536.71560185185 | 21.1 |
| 42536.73643518519 | 21.2 |
| 42536.757268518515 | 21.1 |
| 42536.77810185185 | 21.1 |
| 42536.79893518519 | 21.1 |
| 42536.819768518515 | 21 |
| 42536.84060185185 | 21.1 |
| 42536.86143518519 | 21 |
| 42536.882268518515 | 21 |
| 42536.90310185185 | 21 |
| 42536.92393518519 | 21.1 |
| 42536.944768518515 | 21 |
| 42536.96560185185 | 21 |
| 42536.98643518519 | 21 |
| 42537.007268518515 | 21 |
| 42537.02810185185 | 21 |
| 42537.04893518519 | 21.1 |
| 42537.069768518515 | 21 |
| 42537.09060185185 | 20.9 |
| 42537.11143518519 | 20.9 |
| 42537.132268518515 | 20.9 |
| 42537.15310185185 | 20.9 |
| 42537.17393518519 | 20.9 |
| 42537.194768518515 | 20.9 |
| 42537.21560185185 | 21 |
| 42537.23643518519 | 21 |
| 42537.257268518515 | 20.9 |
| 42537.27810185185 | 20.9 |
| 42537.29893518519 | 21 |
| 42537.319768518515 | 21 |
| 42537.34060185185 | 20.9 |
| 42537.36143518519 | 20.9 |
| 42537.382268518515 | 20.9 |
| 42537.40310185185 | 20.9 |
| 42537.42393518519 | 20.9 |
| 42537.444768518515 | 21 |
| 42537.46560185185 | 21 |
| 42537.48643518519 | 21 |
| 42537.507268518515 | 21 |
| 42537.52810185185 | 21 |
| 42537.54893518519 | 21 |
| 42537.569768518515 | 21 |
| 42537.59060185185 | 21.1 |
| 42537.61143518519 | 21.1 |
| 42537.632268518515 | 21.1 |
| 42537.65310185185 | 21.1 |
| 42537.67393518519 | 21.1 |
| 42537.694768518515 | 21.1 |
| 42537.71560185185 | 21 |
| 42537.73643518519 | 21 |
| 42537.757268518515 | 21 |
| 42537.77810185185 | 21.1 |
| 42537.79893518519 | 21.1 |
| 42537.819768518515 | 21.1 |
| 42537.84060185185 | 21.1 |
| 42537.86143518519 | 21 |
| 42537.882268518515 | 21 |
| 42537.90310185185 | 21 |
| 42537.92393518519 | 21 |
| 42537.944768518515 | 21 |
| 42537.96560185185 | 21 |
| 42537.98643518519 | 20.9 |
| 42538.007268518515 | 20.9 |
| 42538.02810185185 | 20.9 |
| 42538.04893518519 | 21 |
| 42538.069768518515 | 20.9 |
| 42538.09060185185 | 20.9 |
| 42538.11143518519 | 20.9 |
| 42538.132268518515 | 21 |
| 42538.15310185185 | 20.9 |
| 42538.17393518519 | 20.9 |
| 42538.194768518515 | 20.9 |
| 42538.21560185185 | 20.9 |
| 42538.23643518519 | 20.9 |
| 42538.257268518515 | 20.8 |
| 42538.27810185185 | 20.9 |
| 42538.29893518519 | 20.9 |
| 42538.319768518515 | 20.9 |
| 42538.34060185185 | 20.9 |
| 42538.36143518519 | 20.9 |
| 42538.382268518515 | 20.9 |
| 42538.40310185185 | 20.9 |
| 42538.42393518519 | 20.9 |
| 42538.444768518515 | 20.9 |
| 42538.46560185185 | 20.9 |
| 42538.48643518519 | 20.9 |
| 42538.507268518515 | 21 |
| 42538.52810185185 | 21 |
| 42538.54893518519 | 21 |
| 42538.569768518515 | 21 |
| 42538.59060185185 | 21 |
| 42538.61143518519 | 21 |
| 42538.632268518515 | 21.1 |
| 42538.65310185185 | 21.1 |
| 42538.67393518519 | 21.1 |
| 42538.694768518515 | 21 |
| 42538.71560185185 | 21.1 |
| 42538.73643518519 | 21.1 |
| 42538.757268518515 | 21.1 |
| 42538.77810185185 | 21 |
| 42538.79893518519 | 21 |
| 42538.819768518515 | 21 |
| 42538.84060185185 | 21 |
| 42538.86143518519 | 21 |
| 42538.882268518515 | 21 |
| 42538.90310185185 | 21 |
| 42538.92393518519 | 21 |
| 42538.944768518515 | 21 |
| 42538.96560185185 | 21.1 |
| 42538.98643518519 | 21 |
| 42539.007268518515 | 21 |
| 42539.02810185185 | 21 |
| 42539.04893518519 | 20.9 |
| 42539.069768518515 | 20.9 |
| 42539.09060185185 | 21 |
| 42539.11143518519 | 21 |
| 42539.132268518515 | 21 |
| 42539.15310185185 | 20.9 |
| 42539.17393518519 | 20.9 |
| 42539.194768518515 | 20.9 |
| 42539.21560185185 | 21 |
| 42539.23643518519 | 20.9 |
| 42539.257268518515 | 20.9 |
| 42539.27810185185 | 20.9 |
| 42539.29893518519 | 20.9 |
| 42539.319768518515 | 21 |
| 42539.34060185185 | 20.9 |
| 42539.36143518519 | 20.9 |
| 42539.382268518515 | 21 |
| 42539.40310185185 | 20.9 |
| 42539.42393518519 | 20.9 |
| 42539.444768518515 | 20.9 |
| 42539.46560185185 | 21 |
| 42539.48643518519 | 21 |
| 42539.507268518515 | 21 |
| 42539.52810185185 | 21 |
| 42539.54893518519 | 21 |
| 42539.569768518515 | 21 |
| 42539.59060185185 | 21.1 |
| 42539.61143518519 | 21 |
| 42539.632268518515 | 21.1 |
| 42539.65310185185 | 21.1 |
| 42539.67393518519 | 21.1 |
| 42539.694768518515 | 21.1 |
| 42539.71560185185 | 21.1 |
| 42539.73643518519 | 21.2 |
| 42539.757268518515 | 21.1 |
| 42539.77810185185 | 21.1 |
| 42539.79893518519 | 21.1 |
| 42539.819768518515 | 21 |
| 42539.84060185185 | 21.1 |
| 42539.86143518519 | 21 |
| 42539.882268518515 | 21 |
| 42539.90310185185 | 21 |
| 42539.92393518519 | 21 |
| 42539.944768518515 | 21 |
| 42539.96560185185 | 20.9 |
| 42539.98643518519 | 21 |
| 42540.007268518515 | 21 |
| 42540.02810185185 | 21 |
| 42540.04893518519 | 21 |
| 42540.069768518515 | 21 |
| 42540.09060185185 | 21 |
| 42540.11143518519 | 21 |
| 42540.132268518515 | 20.9 |
| 42540.15310185185 | 20.9 |
| 42540.17393518519 | 20.9 |
| 42540.194768518515 | 20.9 |
| 42540.21560185185 | 21 |
| 42540.23643518519 | 21 |
| 42540.257268518515 | 20.9 |
| 42540.27810185185 | 20.9 |
| 42540.29893518519 | 20.9 |
| 42540.319768518515 | 21 |
| 42540.34060185185 | 20.9 |
| 42540.36143518519 | 20.9 |
| 42540.382268518515 | 20.9 |
| 42540.40310185185 | 20.9 |
| 42540.42393518519 | 21 |
| 42540.444768518515 | 21 |
| 42540.46560185185 | 21 |
| 42540.48643518519 | 21 |
| 42540.507268518515 | 21 |
| 42540.52810185185 | 21 |
| 42540.54893518519 | 21 |
| 42540.569768518515 | 21 |
| 42540.59060185185 | 21 |
| 42540.61143518519 | 21.1 |
| 42540.632268518515 | 21.1 |
| 42540.65310185185 | 21.1 |
| 42540.67393518519 | 21.1 |
| 42540.694768518515 | 21.1 |
| 42540.71560185185 | 21.1 |
| 42540.73643518519 | 21.1 |
| 42540.757268518515 | 21.1 |
| 42540.77810185185 | 21 |
| 42540.79893518519 | 21.1 |
| 42540.819768518515 | 21.1 |
| 42540.84060185185 | 21.1 |
| 42540.86143518519 | 21.1 |
| 42540.882268518515 | 21 |
| 42540.90310185185 | 21 |
| 42540.92393518519 | 21 |
| 42540.944768518515 | 21 |
| 42540.96560185185 | 21 |
| 42540.98643518519 | 21 |
| 42541.007268518515 | 20.9 |
| 42541.02810185185 | 20.9 |
| 42541.04893518519 | 21 |
| 42541.069768518515 | 21 |
| 42541.09060185185 | 21 |
| 42541.11143518519 | 20.9 |
| 42541.132268518515 | 20.9 |
| 42541.15310185185 | 21 |
| 42541.17393518519 | 20.9 |
| 42541.194768518515 | 20.9 |
| 42541.21560185185 | 20.9 |
| 42541.23643518519 | 20.9 |
| 42541.257268518515 | 20.9 |
| 42541.27810185185 | 20.9 |
| 42541.29893518519 | 20.9 |
| 42541.319768518515 | 20.9 |
| 42541.34060185185 | 20.9 |
| 42541.36143518519 | 21 |
| 42541.382268518515 | 21 |
| 42541.40310185185 | 21.1 |
| 42541.42393518519 | 21 |
| 42541.444768518515 | 21 |
| 42541.46560185185 | 21 |
| 42541.48643518519 | 21 |
| 42541.507268518515 | 21 |
| 42541.52810185185 | 21 |
| 42541.54893518519 | 21.1 |
| 42541.569768518515 | 21.1 |
| 42541.59060185185 | 21.1 |
| 42541.61143518519 | 21.1 |
| 42541.632268518515 | 21.2 |
| 42541.65310185185 | 21.1 |
| 42541.67393518519 | 21.2 |
| 42541.694768518515 | 21.2 |
| 42541.71560185185 | 21.2 |
| 42541.73643518519 | 21.2 |
| 42541.757268518515 | 21.2 |
| 42541.77810185185 | 21.2 |
| 42541.79893518519 | 21.2 |
| 42541.819768518515 | 21.1 |
| 42541.84060185185 | 21.2 |
| 42541.86143518519 | 21.1 |
| 42541.882268518515 | 21.2 |
| 42541.90310185185 | 21.1 |
| 42541.92393518519 | 21.1 |
| 42541.944768518515 | 21.1 |
| 42541.96560185185 | 21.1 |
| 42541.98643518519 | 21.1 |
| 42542.007268518515 | 21.1 |
| 42542.02810185185 | 21 |
| 42542.04893518519 | 21 |
| 42542.069768518515 | 21.1 |
| 42542.09060185185 | 21 |
| 42542.11143518519 | 21 |
| 42542.132268518515 | 21 |
| 42542.15310185185 | 21 |
| 42542.17393518519 | 21.1 |
| 42542.194768518515 | 21 |
| 42542.21560185185 | 21 |
| 42542.23643518519 | 21 |
| 42542.257268518515 | 21 |
| 42542.27810185185 | 20.9 |
| 42542.29893518519 | 21 |
| 42542.319768518515 | 21 |
| 42542.34060185185 | 21 |
| 42542.36143518519 | 21 |
| 42542.382268518515 | 21 |
| 42542.40310185185 | 21 |
| 42542.42393518519 | 21.1 |
| 42542.444768518515 | 21.1 |
| 42542.46560185185 | 21 |
| 42542.48643518519 | 21 |
| 42542.507268518515 | 21 |
| 42542.52810185185 | 21.1 |
| 42542.54893518519 | 21 |
| 42542.569768518515 | 21 |
| 42542.59060185185 | 21.1 |
| 42542.61143518519 | 21.2 |
| 42542.632268518515 | 21.2 |
| 42542.65310185185 | 21.2 |
| 42542.67393518519 | 21.2 |
| 42542.694768518515 | 21.2 |
| 42542.71560185185 | 21.2 |
| 42542.73643518519 | 21.2 |
| 42542.757268518515 | 21.2 |
| 42542.77810185185 | 21.3 |
| 42542.79893518519 | 21.2 |
| 42542.819768518515 | 21.3 |
| 42542.84060185185 | 21.2 |
| 42542.86143518519 | 21.3 |
| 42542.882268518515 | 21.2 |
| 42542.90310185185 | 21.3 |
| 42542.92393518519 | 21.2 |
| 42542.944768518515 | 21.2 |
| 42542.96560185185 | 21.2 |
| 42542.98643518519 | 21.2 |
| 42543.007268518515 | 21.2 |
| 42543.02810185185 | 21.2 |
| 42543.04893518519 | 21.2 |
| 42543.069768518515 | 21.2 |
| 42543.09060185185 | 21.1 |
| 42543.11143518519 | 21.1 |
| 42543.132268518515 | 21.1 |
| 42543.15310185185 | 21.2 |
| 42543.17393518519 | 21.2 |
| 42543.194768518515 | 21.2 |
| 42543.21560185185 | 21.2 |
| 42543.23643518519 | 21.1 |
| 42543.257268518515 | 21.1 |
| 42543.27810185185 | 21.1 |
| 42543.29893518519 | 21.1 |
| 42543.319768518515 | 21.2 |
| 42543.34060185185 | 21.2 |
| 42543.36143518519 | 21.2 |
| 42543.382268518515 | 21.2 |
| 42543.40310185185 | 21.1 |
| 42543.42393518519 | 21.2 |
| 42543.444768518515 | 21.3 |
| 42543.46560185185 | 21.2 |
| 42543.48643518519 | 21.3 |
| 42543.507268518515 | 21.2 |
| 42543.52810185185 | 21.3 |
| 42543.54893518519 | 21.3 |
| 42543.569768518515 | 21.4 |
| 42543.59060185185 | 21.4 |
| 42543.61143518519 | 21.3 |
| 42543.632268518515 | 21.3 |
| 42543.65310185185 | 21.4 |
| 42543.67393518519 | 21.3 |
| 42543.694768518515 | 21.3 |
| 42543.71560185185 | 21.4 |
| 42543.73643518519 | 21.4 |
| 42543.757268518515 | 21.4 |
| 42543.77810185185 | 21.5 |
| 42543.79893518519 | 21.5 |
| 42543.819768518515 | 21.5 |
| 42543.84060185185 | 21.5 |
| 42543.86143518519 | 21.4 |
| 42543.882268518515 | 21.4 |
| 42543.90310185185 | 21.4 |
| 42543.92393518519 | 21.4 |
| 42543.944768518515 | 21.4 |
| 42543.96560185185 | 21.4 |
| 42543.98643518519 | 21.4 |
| 42544.007268518515 | 21.4 |
| 42544.02810185185 | 21.3 |
| 42544.04893518519 | 21.3 |
| 42544.069768518515 | 21.2 |
| 42544.09060185185 | 21.3 |
| 42544.11143518519 | 21.3 |
| 42544.132268518515 | 21.2 |
| 42544.15310185185 | 21.2 |
| 42544.17393518519 | 21.2 |
| 42544.194768518515 | 21.2 |
| 42544.21560185185 | 21.2 |
| 42544.23643518519 | 21.2 |
| 42544.257268518515 | 21.2 |
| 42544.27810185185 | 21.2 |
| 42544.29893518519 | 21.2 |
| 42544.319768518515 | 21.2 |
| 42544.34060185185 | 21.2 |
| 42544.36143518519 | 21.2 |
| 42544.382268518515 | 21.3 |
| 42544.40310185185 | 21.2 |
| 42544.42393518519 | 21.3 |
| 42544.444768518515 | 21.4 |
| 42544.46560185185 | 21.4 |
| 42544.48643518519 | 21.4 |
| 42544.507268518515 | 21.4 |
| 42544.52810185185 | 21.5 |
| 42544.54893518519 | 21.5 |
| 42544.569768518515 | 21.6 |
| 42544.59060185185 | 21.6 |
| 42544.61143518519 | 21.6 |
| 42544.632268518515 | 21.6 |
| 42544.65310185185 | 21.6 |
| 42544.67393518519 | 21.6 |
| 42544.694768518515 | 21.6 |
| 42544.71560185185 | 21.6 |
| 42544.73643518519 | 21.5 |
| 42544.757268518515 | 21.6 |
| 42544.77810185185 | 21.6 |
| 42544.79893518519 | 21.5 |
| 42544.819768518515 | 21.5 |
| 42544.84060185185 | 21.5 |
| 42544.86143518519 | 21.5 |
| 42544.882268518515 | 21.5 |
| 42544.90310185185 | 21.4 |
| 42544.92393518519 | 21.4 |
| 42544.944768518515 | 21.4 |
| 42544.96560185185 | 21.4 |
| 42544.98643518519 | 21.3 |
| 42545.007268518515 | 21.3 |
| 42545.02810185185 | 21.3 |
| 42545.04893518519 | 21.2 |
| 42545.069768518515 | 21.2 |
| 42545.09060185185 | 21.2 |
| 42545.11143518519 | 21.1 |
| 42545.132268518515 | 21.2 |
| 42545.15310185185 | 21.2 |
| 42545.17393518519 | 21.1 |
| 42545.194768518515 | 21.1 |
| 42545.21560185185 | 21.1 |
| 42545.23643518519 | 21.1 |
| 42545.257268518515 | 21.1 |
| 42545.27810185185 | 21 |
| 42545.29893518519 | 21.1 |
| 42545.319768518515 | 21.1 |
| 42545.34060185185 | 21.1 |
| 42545.36143518519 | 21.2 |
| 42545.382268518515 | 21.1 |
| 42545.40310185185 | 21.2 |
| 42545.42393518519 | 21.2 |
| 42545.444768518515 | 21.2 |
| 42545.46560185185 | 21.3 |
| 42545.48643518519 | 21.3 |
| 42545.507268518515 | 21.3 |
| 42545.52810185185 | 21.3 |
| 42545.54893518519 | 21.3 |
| 42545.569768518515 | 21.4 |
| 42545.59060185185 | 21.3 |
| 42545.61143518519 | 21.4 |
| 42545.632268518515 | 21.5 |
| 42545.65310185185 | 21.5 |
| 42545.67393518519 | 21.5 |
| 42545.694768518515 | 21.5 |
| 42545.71560185185 | 21.5 |
| 42545.73643518519 | 21.5 |
| 42545.757268518515 | 21.6 |
| 42545.77810185185 | 21.6 |
| 42545.79893518519 | 21.5 |
| 42545.819768518515 | 21.5 |
| 42545.84060185185 | 21.5 |
| 42545.86143518519 | 21.5 |
| 42545.882268518515 | 21.4 |
| 42545.90310185185 | 21.4 |
| 42545.92393518519 | 21.4 |
| 42545.944768518515 | 21.4 |
| 42545.96560185185 | 21.4 |
| 42545.98643518519 | 21.3 |
| 42546.007268518515 | 21.3 |
| 42546.02810185185 | 21.3 |
| 42546.04893518519 | 21.3 |
| 42546.069768518515 | 21.3 |
| 42546.09060185185 | 21.3 |
| 42546.11143518519 | 21.3 |
| 42546.132268518515 | 21.3 |
| 42546.15310185185 | 21.2 |
| 42546.17393518519 | 21.2 |
| 42546.194768518515 | 21.2 |
| 42546.21560185185 | 21.2 |
| 42546.23643518519 | 21.1 |
| 42546.257268518515 | 21.1 |
| 42546.27810185185 | 21.1 |
| 42546.29893518519 | 21 |
| 42546.319768518515 | 21.1 |
| 42546.34060185185 | 21 |
| 42546.36143518519 | 21.1 |
| 42546.382268518515 | 21.1 |
| 42546.40310185185 | 21 |
| 42546.42393518519 | 21.2 |
| 42546.444768518515 | 21.1 |
| 42546.46560185185 | 21.1 |
| 42546.48643518519 | 21.2 |
| 42546.507268518515 | 21.1 |
| 42546.52810185185 | 21.2 |
| 42546.54893518519 | 21.2 |
| 42546.569768518515 | 21.2 |
| 42546.59060185185 | 21.2 |
| 42546.61143518519 | 21.2 |
| 42546.632268518515 | 21.2 |
| 42546.65310185185 | 21.2 |
| 42546.67393518519 | 21.1 |
| 42546.694768518515 | 21.2 |
| 42546.71560185185 | 21.2 |
| 42546.73643518519 | 21.2 |
| 42546.757268518515 | 21.2 |
| 42546.77810185185 | 21.2 |
| 42546.79893518519 | 21.2 |
| 42546.819768518515 | 21.1 |
| 42546.84060185185 | 21.2 |
| 42546.86143518519 | 21.1 |
| 42546.882268518515 | 21.1 |
| 42546.90310185185 | 21.1 |
| 42546.92393518519 | 21 |
| 42546.944768518515 | 21.1 |
| 42546.96560185185 | 21.1 |
| 42546.98643518519 | 21 |
| 42547.007268518515 | 21 |
| 42547.02810185185 | 21 |
| 42547.04893518519 | 21 |
| 42547.069768518515 | 21 |
| 42547.09060185185 | 21 |
| 42547.11143518519 | 21 |
| 42547.132268518515 | 21 |
| 42547.15310185185 | 21 |
| 42547.17393518519 | 21 |
| 42547.194768518515 | 20.9 |
| 42547.21560185185 | 21 |
| 42547.23643518519 | 20.9 |
| 42547.257268518515 | 20.9 |
| 42547.27810185185 | 20.9 |
| 42547.29893518519 | 20.9 |
| 42547.319768518515 | 21 |
| 42547.34060185185 | 20.9 |
| 42547.36143518519 | 21 |
| 42547.382268518515 | 21 |
| 42547.40310185185 | 21 |
| 42547.42393518519 | 21 |
| 42547.444768518515 | 21 |
| 42547.46560185185 | 21.1 |
| 42547.48643518519 | 21 |
| 42547.507268518515 | 21.1 |
| 42547.52810185185 | 21.1 |
| 42547.54893518519 | 21.2 |
| 42547.569768518515 | 21.1 |
| 42547.59060185185 | 21.2 |
| 42547.61143518519 | 21.2 |
| 42547.632268518515 | 21.2 |
| 42547.65310185185 | 21.2 |
| 42547.67393518519 | 21.2 |
| 42547.694768518515 | 21.2 |
| 42547.71560185185 | 21.2 |
| 42547.73643518519 | 21.2 |
| 42547.757268518515 | 21.3 |
| 42547.77810185185 | 21.2 |
| 42547.79893518519 | 21.3 |
| 42547.819768518515 | 21.3 |
| 42547.84060185185 | 21.2 |
| 42547.86143518519 | 21.2 |
| 42547.882268518515 | 21.2 |
| 42547.90310185185 | 21.1 |
| 42547.92393518519 | 21.2 |
| 42547.944768518515 | 21.1 |
| 42547.96560185185 | 21.1 |
| 42547.98643518519 | 21.1 |
| 42548.007268518515 | 21.1 |
| 42548.02810185185 | 21.1 |
| 42548.04893518519 | 21.1 |
| 42548.069768518515 | 21.1 |
| 42548.09060185185 | 21.1 |
| 42548.11143518519 | 21 |
| 42548.132268518515 | 21 |
| 42548.15310185185 | 21 |
| 42548.17393518519 | 21 |
| 42548.194768518515 | 21 |
| 42548.21560185185 | 21 |
| 42548.23643518519 | 21 |
| 42548.257268518515 | 20.9 |
| 42548.27810185185 | 21 |
| 42548.29893518519 | 21 |
| 42548.319768518515 | 20.9 |
| 42548.34060185185 | 21 |
| 42548.36143518519 | 21 |
| 42548.382268518515 | 21 |
| 42548.40310185185 | 21 |
| 42548.42393518519 | 21.1 |
| 42548.444768518515 | 21.1 |
| 42548.46560185185 | 21.1 |
| 42548.48643518519 | 21.1 |
| 42548.507268518515 | 21.1 |
| 42548.52810185185 | 21.1 |
| 42548.54893518519 | 21.2 |
| 42548.569768518515 | 21.2 |
| 42548.59060185185 | 21.1 |
| 42548.61143518519 | 21.2 |
| 42548.632268518515 | 21.2 |
| 42548.65310185185 | 21.3 |
| 42548.67393518519 | 21.3 |
| 42548.694768518515 | 21.2 |
| 42548.71560185185 | 21.2 |
| 42548.73643518519 | 21.2 |
| 42548.757268518515 | 21.1 |
| 42548.77810185185 | 21.1 |
| 42548.79893518519 | 21.1 |
| 42548.819768518515 | 21.2 |
| 42548.84060185185 | 21.2 |
| 42548.86143518519 | 21.2 |
| 42548.882268518515 | 21.1 |
| 42548.90310185185 | 21 |
| 42548.92393518519 | 21 |
| 42548.944768518515 | 21.1 |
| 42548.96560185185 | 21.1 |
| 42548.98643518519 | 21.1 |
| 42549.007268518515 | 21.1 |
| 42549.02810185185 | 21.1 |
| 42549.04893518519 | 21 |
| 42549.069768518515 | 21 |
| 42549.09060185185 | 21 |
| 42549.11143518519 | 21 |
| 42549.132268518515 | 21 |
| 42549.15310185185 | 20.9 |
| 42549.17393518519 | 21 |
| 42549.194768518515 | 20.9 |
| 42549.21560185185 | 21 |
| 42549.23643518519 | 20.9 |
| 42549.257268518515 | 20.9 |
| 42549.27810185185 | 20.9 |
| 42549.29893518519 | 20.9 |
| 42549.319768518515 | 20.9 |
| 42549.34060185185 | 20.9 |
| 42549.36143518519 | 20.9 |
| 42549.382268518515 | 21 |
| 42549.40310185185 | 21 |
| 42549.42393518519 | 21 |
| 42549.444768518515 | 21.1 |
| 42549.46560185185 | 21 |
| 42549.48643518519 | 21.1 |
| 42549.507268518515 | 21.1 |
| 42549.52810185185 | 21.1 |
| 42549.54893518519 | 21.2 |
| 42549.569768518515 | 21.2 |
| 42549.59060185185 | 21.2 |
| 42549.61143518519 | 21.3 |
| 42549.632268518515 | 21.3 |
| 42549.65310185185 | 21.3 |
| 42549.67393518519 | 21.4 |
| 42549.694768518515 | 21.4 |
| 42549.71560185185 | 21.4 |
| 42549.73643518519 | 21.4 |
| 42549.757268518515 | 21.4 |
| 42549.77810185185 | 21.4 |
| 42549.79893518519 | 21.4 |
| 42549.819768518515 | 21.3 |
| 42549.84060185185 | 21.2 |
| 42549.86143518519 | 21.3 |
| 42549.882268518515 | 21.3 |
| 42549.90310185185 | 21.2 |
| 42549.92393518519 | 21.2 |
| 42549.944768518515 | 21.2 |
| 42549.96560185185 | 21.2 |
| 42549.98643518519 | 21.2 |
| 42550.007268518515 | 21.1 |
| 42550.02810185185 | 21.1 |
| 42550.04893518519 | 21.1 |
| 42550.069768518515 | 21.1 |
| 42550.09060185185 | 21.1 |
| 42550.11143518519 | 21 |
| 42550.132268518515 | 21.1 |
| 42550.15310185185 | 21.1 |
| 42550.17393518519 | 21 |
| 42550.194768518515 | 21.1 |
| 42550.21560185185 | 21 |
| 42550.23643518519 | 21 |
| 42550.257268518515 | 21.1 |
| 42550.27810185185 | 20.9 |
| 42550.29893518519 | 21 |
| 42550.319768518515 | 21 |
| 42550.34060185185 | 21 |
| 42550.36143518519 | 21 |
| 42550.382268518515 | 21 |
| 42550.40310185185 | 21.2 |
| 42550.42393518519 | 21.3 |
| 42550.444768518515 | 21.3 |
| 42550.46560185185 | 21.2 |
| 42550.48643518519 | 21.3 |
| 42550.507268518515 | 21.3 |
| 42550.52810185185 | 21.2 |
| 42550.54893518519 | 21.3 |
| 42550.569768518515 | 21.3 |
| 42550.59060185185 | 21.2 |
| 42550.61143518519 | 21.2 |
| 42550.632268518515 | 21.4 |
| 42550.65310185185 | 21.4 |
| 42550.67393518519 | 21.4 |
| 42550.694768518515 | 21.5 |
| 42550.71560185185 | 21.4 |
| 42550.73643518519 | 21.5 |
| 42550.757268518515 | 21.5 |
| 42550.77810185185 | 21.5 |
| 42550.79893518519 | 21.4 |
| 42550.819768518515 | 21.4 |
| 42550.84060185185 | 21.4 |
| 42550.86143518519 | 21.4 |
| 42550.882268518515 | 21.4 |
| 42550.90310185185 | 21.3 |
| 42550.92393518519 | 21.3 |
| 42550.944768518515 | 21.3 |
| 42550.96560185185 | 21.2 |
| 42550.98643518519 | 21.3 |
| 42551.007268518515 | 21.2 |
| 42551.02810185185 | 21.2 |
| 42551.04893518519 | 21.2 |
| 42551.069768518515 | 21.2 |
| 42551.09060185185 | 21.1 |
| 42551.11143518519 | 21.1 |
| 42551.132268518515 | 21.1 |
| 42551.15310185185 | 21.1 |
| 42551.17393518519 | 21.1 |
| 42551.194768518515 | 21.1 |
| 42551.21560185185 | 21.1 |
| 42551.23643518519 | 21.1 |
| 42551.257268518515 | 21.1 |
| 42551.27810185185 | 21.1 |
| 42551.29893518519 | 21.1 |
| 42551.319768518515 | 21.1 |
| 42551.34060185185 | 21.1 |
| 42551.36143518519 | 21.1 |
| 42551.382268518515 | 21.2 |
| 42551.40310185185 | 21.1 |
| 42551.42393518519 | 21.1 |
| 42551.444768518515 | 21.2 |
| 42551.46560185185 | 21.1 |
| 42551.48643518519 | 21.1 |
| 42551.507268518515 | 21.2 |
| 42551.52810185185 | 21.2 |
| 42551.54893518519 | 21.2 |
| 42551.569768518515 | 21.3 |
| 42551.59060185185 | 21.3 |
| 42551.61143518519 | 21.3 |
| 42551.632268518515 | 21.4 |
| 42551.65310185185 | 21.4 |
| 42551.67393518519 | 21.4 |
| 42551.694768518515 | 21.4 |
| 42551.71560185185 | 21.4 |
| 42551.73643518519 | 21.5 |
| 42551.757268518515 | 21.4 |
| 42551.77810185185 | 21.4 |
| 42551.79893518519 | 21.4 |
| 42551.819768518515 | 21.4 |
| 42551.84060185185 | 21.4 |
| 42551.86143518519 | 21.4 |
| 42551.882268518515 | 21.4 |
| 42551.90310185185 | 21.3 |
| 42551.92393518519 | 21.4 |
| 42551.944768518515 | 21.4 |
| 42551.96560185185 | 21.3 |
| 42551.98643518519 | 21.3 |
| 42552.007268518515 | 21.3 |
| 42552.02810185185 | 21.3 |
| 42552.04893518519 | 21.3 |
| 42552.069768518515 | 21.2 |
| 42552.09060185185 | 21.2 |
| 42552.11143518519 | 21.1 |
| 42552.132268518515 | 21.2 |
| 42552.15310185185 | 21.2 |
| 42552.17393518519 | 21.2 |
| 42552.194768518515 | 21.2 |
| 42552.21560185185 | 21.2 |
| 42552.23643518519 | 21.1 |
| 42552.257268518515 | 21.2 |
| 42552.27810185185 | 21.1 |
| 42552.29893518519 | 21.1 |
| 42552.319768518515 | 21.1 |
| 42552.34060185185 | 21.2 |
| 42552.36143518519 | 21.1 |
| 42552.382268518515 | 21.2 |
| 42552.40310185185 | 21.2 |
| 42552.42393518519 | 21.1 |
| 42552.444768518515 | 21.2 |
| 42552.46560185185 | 21.2 |
| 42552.48643518519 | 21.2 |
| 42552.507268518515 | 21.3 |
| 42552.52810185185 | 21.3 |
| 42552.54893518519 | 21.3 |
| 42552.569768518515 | 21.4 |
| 42552.59060185185 | 21.3 |
| 42552.61143518519 | 21.4 |
| 42552.632268518515 | 21.4 |
| 42552.65310185185 | 21.5 |
| 42552.67393518519 | 21.5 |
| 42552.694768518515 | 21.6 |
| 42552.71560185185 | 21.5 |
| 42552.73643518519 | 21.5 |
| 42552.757268518515 | 21.6 |
| 42552.77810185185 | 21.5 |
| 42552.79893518519 | 21.6 |
| 42552.819768518515 | 21.5 |
| 42552.84060185185 | 21.5 |
| 42552.86143518519 | 21.5 |
| 42552.882268518515 | 21.5 |
| 42552.90310185185 | 21.5 |
| 42552.92393518519 | 21.4 |
| 42552.944768518515 | 21.4 |
| 42552.96560185185 | 21.4 |
| 42552.98643518519 | 21.4 |
| 42553.007268518515 | 21.4 |
| 42553.02810185185 | 21.3 |
| 42553.04893518519 | 21.3 |
| 42553.069768518515 | 21.3 |
| 42553.09060185185 | 21.2 |
| 42553.11143518519 | 21.2 |
| 42553.132268518515 | 21.2 |
| 42553.15310185185 | 21.2 |
| 42553.17393518519 | 21.2 |
| 42553.194768518515 | 21.2 |
| 42553.21560185185 | 21.2 |
| 42553.23643518519 | 21.2 |
| 42553.257268518515 | 21.1 |
| 42553.27810185185 | 21.2 |
| 42553.29893518519 | 21.1 |
| 42553.319768518515 | 21.2 |
| 42553.34060185185 | 21.1 |
| 42553.36143518519 | 21.1 |
| 42553.382268518515 | 21.2 |
| 42553.40310185185 | 21.1 |
| 42553.42393518519 | 21.2 |
| 42553.444768518515 | 21.2 |
| 42553.46560185185 | 21.2 |
| 42553.48643518519 | 21.2 |
| 42553.507268518515 | 21.1 |
| 42553.52810185185 | 21.1 |
| 42553.54893518519 | 21.1 |
| 42553.569768518515 | 21.1 |
| 42553.59060185185 | 21.1 |
| 42553.61143518519 | 21.2 |
| 42553.632268518515 | 21.2 |
| 42553.65310185185 | 21.1 |
| 42553.67393518519 | 21.1 |
| 42553.694768518515 | 21.2 |
| 42553.71560185185 | 21.2 |
| 42553.73643518519 | 21.2 |
| 42553.757268518515 | 21.1 |
| 42553.77810185185 | 21.1 |
| 42553.79893518519 | 21.2 |
| 42553.819768518515 | 21.1 |
| 42553.84060185185 | 21.2 |
| 42553.86143518519 | 21.2 |
| 42553.882268518515 | 21.1 |
| 42553.90310185185 | 21.2 |
| 42553.92393518519 | 21.2 |
| 42553.944768518515 | 21.1 |
| 42553.96560185185 | 21.1 |
| 42553.98643518519 | 21.1 |
| 42554.007268518515 | 21 |
| 42554.02810185185 | 21 |
| 42554.04893518519 | 21 |
| 42554.069768518515 | 21 |
| 42554.09060185185 | 21 |
| 42554.11143518519 | 21 |
| 42554.132268518515 | 21 |
| 42554.15310185185 | 21 |
| 42554.17393518519 | 20.9 |
| 42554.194768518515 | 20.9 |
| 42554.21560185185 | 20.9 |
| 42554.23643518519 | 20.9 |
| 42554.257268518515 | 21 |
| 42554.27810185185 | 20.9 |
| 42554.29893518519 | 20.9 |
| 42554.319768518515 | 20.9 |
| 42554.34060185185 | 20.9 |
| 42554.36143518519 | 21 |
| 42554.382268518515 | 21 |
| 42554.40310185185 | 21 |
| 42554.42393518519 | 21.1 |
| 42554.444768518515 | 21.1 |
| 42554.46560185185 | 21.1 |
| 42554.48643518519 | 21.1 |
| 42554.507268518515 | 21.1 |
| 42554.52810185185 | 21.1 |
| 42554.54893518519 | 21.1 |
| 42554.569768518515 | 21.2 |
| 42554.59060185185 | 21.2 |
| 42554.61143518519 | 21.2 |
| 42554.632268518515 | 21.3 |
| 42554.65310185185 | 21.2 |
| 42554.67393518519 | 21.4 |
| 42554.694768518515 | 21.4 |
| 42554.71560185185 | 21.3 |
| 42554.73643518519 | 21.4 |
| 42554.757268518515 | 21.4 |
| 42554.77810185185 | 21.3 |
| 42554.79893518519 | 21.4 |
| 42554.819768518515 | 21.3 |
| 42554.84060185185 | 21.4 |
| 42554.86143518519 | 21.3 |
| 42554.882268518515 | 21.4 |
| 42554.90310185185 | 21.4 |
| 42554.92393518519 | 21.3 |
| 42554.944768518515 | 21.2 |
| 42554.96560185185 | 21.2 |
| 42554.98643518519 | 21.2 |
| 42555.007268518515 | 21.2 |
| 42555.02810185185 | 21.2 |
| 42555.04893518519 | 21.2 |
| 42555.069768518515 | 21.1 |
| 42555.09060185185 | 21.2 |
| 42555.11143518519 | 21.1 |
| 42555.132268518515 | 21.1 |
| 42555.15310185185 | 21 |
| 42555.17393518519 | 21.1 |
| 42555.194768518515 | 21.1 |
| 42555.21560185185 | 21 |
| 42555.23643518519 | 21 |
| 42555.257268518515 | 21 |
| 42555.27810185185 | 21 |
| 42555.29893518519 | 21.1 |
| 42555.319768518515 | 21 |
| 42555.34060185185 | 21 |
| 42555.36143518519 | 21.1 |
| 42555.382268518515 | 21.1 |
| 42555.40310185185 | 21.2 |
| 42555.42393518519 | 21.1 |
| 42555.444768518515 | 21.2 |
| 42555.46560185185 | 21.1 |
| 42555.48643518519 | 21.2 |
| 42555.507268518515 | 21.2 |
| 42555.52810185185 | 21.2 |
| 42555.54893518519 | 21.2 |
| 42555.569768518515 | 21.3 |
| 42555.59060185185 | 21.3 |
| 42555.61143518519 | 21.4 |
| 42555.632268518515 | 21.3 |
| 42555.65310185185 | 21.4 |
| 42555.67393518519 | 21.4 |
| 42555.694768518515 | 21.4 |
| 42555.71560185185 | 21.4 |
| 42555.73643518519 | 21.5 |
| 42555.757268518515 | 21.5 |
| 42555.77810185185 | 21.5 |
| 42555.79893518519 | 21.5 |
| 42555.819768518515 | 21.5 |
| 42555.84060185185 | 21.4 |
| 42555.86143518519 | 21.4 |
| 42555.882268518515 | 21.4 |
| 42555.90310185185 | 21.4 |
| 42555.92393518519 | 21.3 |
| 42555.944768518515 | 21.4 |
| 42555.96560185185 | 21.4 |
| 42555.98643518519 | 21.4 |
| 42556.007268518515 | 21.3 |
| 42556.02810185185 | 21.3 |
| 42556.04893518519 | 21.3 |
| 42556.069768518515 | 21.3 |
| 42556.09060185185 | 21.2 |
| 42556.11143518519 | 21.2 |
| 42556.132268518515 | 21.2 |
| 42556.15310185185 | 21.2 |
| 42556.17393518519 | 21.2 |
| 42556.194768518515 | 21.2 |
| 42556.21560185185 | 21.2 |
| 42556.23643518519 | 21.1 |
| 42556.257268518515 | 21.1 |
| 42556.27810185185 | 21.1 |
| 42556.29893518519 | 21.2 |
| 42556.319768518515 | 21.2 |
| 42556.34060185185 | 21.2 |
| 42556.36143518519 | 21.2 |
| 42556.382268518515 | 21.2 |
| 42556.40310185185 | 21.2 |
| 42556.42393518519 | 21.2 |
| 42556.444768518515 | 21.2 |
| 42556.46560185185 | 21.3 |
| 42556.48643518519 | 21.2 |
| 42556.507268518515 | 21.3 |
| 42556.52810185185 | 21.2 |
| 42556.54893518519 | 21.3 |
| 42556.569768518515 | 21.4 |
| 42556.59060185185 | 21.4 |
| 42556.61143518519 | 21.5 |
| 42556.632268518515 | 21.5 |
| 42556.65310185185 | 21.4 |
| 42556.67393518519 | 21.5 |
| 42556.694768518515 | 21.5 |
| 42556.71560185185 | 21.7 |
| 42556.73643518519 | 21.5 |
| 42556.757268518515 | 21.6 |
| 42556.77810185185 | 21.6 |
| 42556.79893518519 | 21.5 |
| 42556.819768518515 | 21.5 |
| 42556.84060185185 | 21.6 |
| 42556.86143518519 | 21.5 |
| 42556.882268518515 | 21.5 |
| 42556.90310185185 | 21.5 |
| 42556.92393518519 | 21.5 |
| 42556.944768518515 | 21.4 |
| 42556.96560185185 | 21.4 |
| 42556.98643518519 | 21.3 |
| 42557.007268518515 | 21.3 |
| 42557.02810185185 | 21.2 |
| 42557.04893518519 | 21.3 |
| 42557.069768518515 | 21.3 |
| 42557.09060185185 | 21.2 |
| 42557.11143518519 | 21.2 |
| 42557.132268518515 | 21.2 |
| 42557.15310185185 | 21.3 |
| 42557.17393518519 | 21.2 |
| 42557.194768518515 | 21.2 |
| 42557.21560185185 | 21.2 |
| 42557.23643518519 | 21.1 |
| 42557.257268518515 | 21.1 |
| 42557.27810185185 | 21 |
| 42557.29893518519 | 21.1 |
| 42557.319768518515 | 21.2 |
| 42557.34060185185 | 21.1 |
| 42557.36143518519 | 21.2 |
| 42557.382268518515 | 21.2 |
| 42557.40310185185 | 21.3 |
| 42557.42393518519 | 21.3 |
| 42557.444768518515 | 21.3 |
| 42557.46560185185 | 21.3 |
| 42557.48643518519 | 21.4 |
| 42557.507268518515 | 21.5 |
| 42557.52810185185 | 21.4 |
| 42557.54893518519 | 21.3 |
| 42557.569768518515 | 21.4 |
| 42557.59060185185 | 21.4 |
| 42557.61143518519 | 21.5 |
| 42557.632268518515 | 21.6 |
| 42557.65310185185 | 21.5 |
| 42557.67393518519 | 21.6 |
| 42557.694768518515 | 21.5 |
| 42557.71560185185 | 21.6 |
| 42557.73643518519 | 21.5 |
| 42557.757268518515 | 21.6 |
| 42557.77810185185 | 21.4 |
| 42557.79893518519 | 21.4 |
| 42557.819768518515 | 21.4 |
| 42557.84060185185 | 21.4 |
| 42557.86143518519 | 21.4 |
| 42557.882268518515 | 21.3 |
| 42557.90310185185 | 21.3 |
| 42557.92393518519 | 21.3 |
| 42557.944768518515 | 21.3 |
| 42557.96560185185 | 21.2 |
| 42557.98643518519 | 21.2 |
| 42558.007268518515 | 21.2 |
| 42558.02810185185 | 21.2 |
| 42558.04893518519 | 21.2 |
| 42558.069768518515 | 21.2 |
| 42558.09060185185 | 21 |
| 42558.11143518519 | 21.2 |
| 42558.132268518515 | 21.1 |
| 42558.15310185185 | 21.1 |
| 42558.17393518519 | 21.1 |
| 42558.194768518515 | 21.1 |
| 42558.21560185185 | 21 |
| 42558.23643518519 | 21 |
| 42558.257268518515 | 21 |
| 42558.27810185185 | 21 |
| 42558.29893518519 | 21 |
| 42558.319768518515 | 21 |
| 42558.34060185185 | 21 |
| 42558.36143518519 | 21.1 |
| 42558.382268518515 | 21.1 |
| 42558.40310185185 | 21.1 |
| 42558.42393518519 | 21.2 |
| 42558.444768518515 | 21.2 |
| 42558.46560185185 | 21.3 |
| 42558.48643518519 | 21.2 |
| 42558.507268518515 | 21.2 |
| 42558.52810185185 | 21.3 |
| 42558.54893518519 | 21.2 |
| 42558.569768518515 | 21.3 |
| 42558.59060185185 | 21.4 |
| 42558.61143518519 | 21.4 |
| 42558.632268518515 | 21.4 |
| 42558.65310185185 | 21.4 |
| 42558.67393518519 | 21.5 |
| 42558.694768518515 | 21.5 |
| 42558.71560185185 | 21.5 |
| 42558.73643518519 | 21.5 |
| 42558.757268518515 | 21.5 |
| 42558.77810185185 | 21.6 |
| 42558.79893518519 | 21.5 |
| 42558.819768518515 | 21.5 |
| 42558.84060185185 | 21.5 |
| 42558.86143518519 | 21.4 |
| 42558.882268518515 | 21.4 |
| 42558.90310185185 | 21.4 |
| 42558.92393518519 | 21.4 |
| 42558.944768518515 | 21.4 |
| 42558.96560185185 | 21.3 |
| 42558.98643518519 | 21.3 |
| 42559.007268518515 | 21.3 |
| 42559.02810185185 | 21.3 |
| 42559.04893518519 | 21.3 |
| 42559.069768518515 | 21.3 |
| 42559.09060185185 | 21.3 |
| 42559.11143518519 | 21.2 |
| 42559.132268518515 | 21.2 |
| 42559.15310185185 | 21.1 |
| 42559.17393518519 | 21.1 |
| 42559.194768518515 | 21.2 |
| 42559.21560185185 | 21.2 |
| 42559.23643518519 | 21.1 |
| 42559.257268518515 | 21.1 |
| 42559.27810185185 | 21.1 |
| 42559.29893518519 | 21.1 |
| 42559.319768518515 | 21.2 |
| 42559.34060185185 | 21.1 |
| 42559.36143518519 | 21.1 |
| 42559.382268518515 | 21.1 |
| 42559.40310185185 | 21.1 |
| 42559.42393518519 | 21.2 |
| 42559.444768518515 | 21.2 |
| 42559.46560185185 | 21.2 |
| 42559.48643518519 | 21.3 |
| 42559.507268518515 | 21.2 |
| 42559.52810185185 | 21.3 |
| 42559.54893518519 | 21.4 |
| 42559.569768518515 | 21.3 |
| 42559.59060185185 | 21.4 |
| 42559.61143518519 | 21.5 |
| 42559.632268518515 | 21.5 |
| 42559.65310185185 | 21.5 |
| 42559.67393518519 | 21.4 |
| 42559.694768518515 | 21.5 |
| 42559.71560185185 | 21.5 |
| 42559.73643518519 | 21.5 |
| 42559.757268518515 | 21.6 |
| 42559.77810185185 | 21.5 |
| 42559.79893518519 | 21.4 |
| 42559.819768518515 | 21.6 |
| 42559.84060185185 | 21.5 |
| 42559.86143518519 | 21.4 |
| 42559.882268518515 | 21.5 |
| 42559.90310185185 | 21.4 |
| 42559.92393518519 | 21.5 |
| 42559.944768518515 | 21.4 |
| 42559.96560185185 | 21.4 |
| 42559.98643518519 | 21.4 |
| 42560.007268518515 | 21.4 |
| 42560.02810185185 | 21.3 |
| 42560.04893518519 | 21.4 |
| 42560.069768518515 | 21.4 |
| 42560.09060185185 | 21.2 |
| 42560.11143518519 | 21.3 |
| 42560.132268518515 | 21.3 |
| 42560.15310185185 | 21.3 |
| 42560.17393518519 | 21.3 |
| 42560.194768518515 | 21.3 |
| 42560.21560185185 | 21.3 |
| 42560.23643518519 | 21.2 |
| 42560.257268518515 | 21.2 |
| 42560.27810185185 | 21.2 |
| 42560.29893518519 | 21.2 |
| 42560.319768518515 | 21.2 |
| 42560.34060185185 | 21.2 |
| 42560.36143518519 | 21.2 |
| 42560.382268518515 | 21.4 |
| 42560.40310185185 | 21.3 |
| 42560.42393518519 | 21.3 |
| 42560.444768518515 | 21.4 |
| 42560.46560185185 | 21.4 |
| 42560.48643518519 | 21.4 |
| 42560.507268518515 | 21.4 |
| 42560.52810185185 | 21.4 |
| 42560.54893518519 | 21.3 |
| 42560.569768518515 | 21.5 |
| 42560.59060185185 | 21.5 |
| 42560.61143518519 | 21.5 |
| 42560.632268518515 | 21.6 |
| 42560.65310185185 | 21.5 |
| 42560.67393518519 | 21.6 |
| 42560.694768518515 | 21.5 |
| 42560.71560185185 | 21.7 |
| 42560.73643518519 | 21.6 |
| 42560.757268518515 | 21.6 |
| 42560.77810185185 | 21.6 |
| 42560.79893518519 | 21.6 |
| 42560.819768518515 | 21.6 |
| 42560.84060185185 | 21.5 |
| 42560.86143518519 | 21.5 |
| 42560.882268518515 | 21.5 |
| 42560.90310185185 | 21.5 |
| 42560.92393518519 | 21.5 |
| 42560.944768518515 | 21.4 |
| 42560.96560185185 | 21.4 |
| 42560.98643518519 | 21.4 |
| 42561.007268518515 | 21.4 |
| 42561.02810185185 | 21.3 |
| 42561.04893518519 | 21.4 |
| 42561.069768518515 | 21.2 |
| 42561.09060185185 | 21.3 |
| 42561.11143518519 | 21.2 |
| 42561.132268518515 | 21.3 |
| 42561.15310185185 | 21.3 |
| 42561.17393518519 | 21.2 |
| 42561.194768518515 | 21.1 |
| 42561.21560185185 | 21.1 |
| 42561.23643518519 | 21.2 |
| 42561.257268518515 | 21.2 |
| 42561.27810185185 | 21.2 |
| 42561.29893518519 | 21.2 |
| 42561.319768518515 | 21.2 |
| 42561.34060185185 | 21.2 |
| 42561.36143518519 | 21.2 |
| 42561.382268518515 | 21.3 |
| 42561.40310185185 | 21.3 |
| 42561.42393518519 | 21.3 |
| 42561.444768518515 | 21.3 |
| 42561.46560185185 | 21.3 |
| 42561.48643518519 | 21.4 |
| 42561.507268518515 | 21.4 |
| 42561.52810185185 | 21.3 |
| 42561.54893518519 | 21.4 |
| 42561.569768518515 | 21.5 |
| 42561.59060185185 | 21.5 |
| 42561.61143518519 | 21.5 |
| 42561.632268518515 | 21.6 |
| 42561.65310185185 | 21.5 |
| 42561.67393518519 | 21.6 |
| 42561.694768518515 | 21.6 |
| 42561.71560185185 | 21.7 |
| 42561.73643518519 | 21.6 |
| 42561.757268518515 | 21.7 |
| 42561.77810185185 | 21.6 |
| 42561.79893518519 | 21.6 |
| 42561.819768518515 | 21.6 |
| 42561.84060185185 | 21.6 |
| 42561.86143518519 | 21.6 |
| 42561.882268518515 | 21.5 |
| 42561.90310185185 | 21.5 |
| 42561.92393518519 | 21.5 |
| 42561.944768518515 | 21.5 |
| 42561.96560185185 | 21.4 |
| 42561.98643518519 | 21.3 |
| 42562.007268518515 | 21.4 |
| 42562.02810185185 | 21.4 |
| 42562.04893518519 | 21.4 |
| 42562.069768518515 | 21.4 |
| 42562.09060185185 | 21.3 |
| 42562.11143518519 | 21.3 |
| 42562.132268518515 | 21.3 |
| 42562.15310185185 | 21.2 |
| 42562.17393518519 | 21.3 |
| 42562.194768518515 | 21.2 |
| 42562.21560185185 | 21.2 |
| 42562.23643518519 | 21.2 |
| 42562.257268518515 | 21.3 |
| 42562.27810185185 | 21.2 |
| 42562.29893518519 | 21.2 |
| 42562.319768518515 | 21.1 |
| 42562.34060185185 | 21.2 |
| 42562.36143518519 | 21.4 |
| 42562.382268518515 | 21.3 |
| 42562.40310185185 | 21.3 |
| 42562.42393518519 | 21.4 |
| 42562.444768518515 | 21.4 |
| 42562.46560185185 | 21.4 |
| 42562.48643518519 | 21.4 |
| 42562.507268518515 | 21.3 |
| 42562.52810185185 | 21.4 |
| 42562.54893518519 | 21.4 |
| 42562.569768518515 | 21.4 |
| 42562.59060185185 | 21.4 |
| 42562.61143518519 | 21.3 |
| 42562.632268518515 | 21.4 |
| 42562.65310185185 | 21.4 |
| 42562.67393518519 | 21.5 |
| 42562.694768518515 | 21.5 |
| 42562.71560185185 | 21.4 |
| 42562.73643518519 | 21.6 |
| 42562.757268518515 | 21.5 |
| 42562.77810185185 | 21.5 |
| 42562.79893518519 | 21.5 |
| 42562.819768518515 | 21.5 |
| 42562.84060185185 | 21.4 |
| 42562.86143518519 | 21.4 |
| 42562.882268518515 | 21.4 |
| 42562.90310185185 | 21.4 |
| 42562.92393518519 | 21.4 |
| 42562.944768518515 | 21.4 |
| 42562.96560185185 | 21.4 |
| 42562.98643518519 | 21.3 |
| 42563.007268518515 | 21.4 |
| 42563.02810185185 | 21.3 |
| 42563.04893518519 | 21.3 |
| 42563.069768518515 | 21.3 |
| 42563.09060185185 | 21.3 |
| 42563.11143518519 | 21.3 |
| 42563.132268518515 | 21.3 |
| 42563.15310185185 | 21.3 |
| 42563.17393518519 | 21.3 |
| 42563.194768518515 | 21.2 |
| 42563.21560185185 | 21.2 |
| 42563.23643518519 | 21.2 |
| 42563.257268518515 | 21.2 |
| 42563.27810185185 | 21.1 |
| 42563.29893518519 | 21.2 |
| 42563.319768518515 | 21.2 |
| 42563.34060185185 | 21.2 |
| 42563.36143518519 | 21.3 |
| 42563.382268518515 | 21.2 |
| 42563.40310185185 | 21.2 |
| 42563.42393518519 | 21.2 |
| 42563.444768518515 | 21.2 |
| 42563.46560185185 | 21.2 |
| 42563.48643518519 | 21.2 |
| 42563.507268518515 | 21.2 |
| 42563.52810185185 | 21.1 |
| 42563.54893518519 | 21.2 |
| 42563.569768518515 | 21.2 |
| 42563.59060185185 | 21.2 |
| 42563.61143518519 | 21.1 |
| 42563.632268518515 | 21.2 |
| 42563.65310185185 | 21.2 |
| 42563.67393518519 | 21.2 |
| 42563.694768518515 | 21.2 |
| 42563.71560185185 | 21.1 |
| 42563.73643518519 | 21.2 |
| 42563.757268518515 | 21.2 |
| 42563.77810185185 | 21 |
| 42563.79893518519 | 21.1 |
| 42563.819768518515 | 21.1 |
| 42563.84060185185 | 21 |
| 42563.86143518519 | 21 |
| 42563.882268518515 | 21 |
| 42563.90310185185 | 21 |
| 42563.92393518519 | 21 |
| 42563.944768518515 | 21 |
| 42563.96560185185 | 21 |
| 42563.98643518519 | 20.9 |
| 42564.007268518515 | 21 |
| 42564.02810185185 | 20.9 |
| 42564.04893518519 | 20.9 |
| 42564.069768518515 | 20.9 |
| 42564.09060185185 | 21 |
| 42564.11143518519 | 20.9 |
| 42564.132268518515 | 20.9 |
| 42564.15310185185 | 20.9 |
| 42564.17393518519 | 21.1 |
| 42564.194768518515 | 21.2 |
| 42564.21560185185 | 20.9 |
| 42564.23643518519 | 20.9 |
| 42564.257268518515 | 21 |
| 42564.27810185185 | 21 |
| 42564.29893518519 | 21 |
| 42564.319768518515 | 20.9 |
| 42564.34060185185 | 21 |
| 42564.36143518519 | 21 |
| 42564.382268518515 | 21 |
| 42564.40310185185 | 21.3 |
| 42564.42393518519 | 21.3 |
| 42564.444768518515 | 21.2 |
| 42564.46560185185 | 21.3 |
| 42564.48643518519 | 21.1 |
| 42564.507268518515 | 21.2 |
| 42564.52810185185 | 21.2 |
| 42564.54893518519 | 21.3 |
| 42564.569768518515 | 21.2 |
| 42564.59060185185 | 21.3 |
| 42564.61143518519 | 21.4 |
| 42564.632268518515 | 21.4 |
| 42564.65310185185 | 21.3 |
| 42564.67393518519 | 21.3 |
| 42564.694768518515 | 21.3 |
| 42564.71560185185 | 21.3 |
| 42564.73643518519 | 21.3 |
| 42564.757268518515 | 21.3 |
| 42564.77810185185 | 21.3 |
| 42564.79893518519 | 21.3 |
| 42564.819768518515 | 21.3 |
| 42564.84060185185 | 21.2 |
| 42564.86143518519 | 21.3 |
| 42564.882268518515 | 21.2 |
| 42564.90310185185 | 21.2 |
| 42564.92393518519 | 21.2 |
| 42564.944768518515 | 21.2 |
| 42564.96560185185 | 21.2 |
| 42564.98643518519 | 21.2 |
| 42565.007268518515 | 21.2 |
| 42565.02810185185 | 21.2 |
| 42565.04893518519 | 21.1 |
| 42565.069768518515 | 21.2 |
| 42565.09060185185 | 21.1 |
| 42565.11143518519 | 21.2 |
| 42565.132268518515 | 21.1 |
| 42565.15310185185 | 21.1 |
| 42565.17393518519 | 21.1 |
| 42565.194768518515 | 21.1 |
| 42565.21560185185 | 21 |
| 42565.23643518519 | 21.1 |
| 42565.257268518515 | 21.1 |
| 42565.27810185185 | 21.1 |
| 42565.29893518519 | 21.1 |
| 42565.319768518515 | 21.1 |
| 42565.34060185185 | 21.1 |
| 42565.36143518519 | 21.1 |
| 42565.382268518515 | 21.2 |
| 42565.40310185185 | 21.1 |
| 42565.42393518519 | 21.1 |
| 42565.444768518515 | 21.1 |
| 42565.46560185185 | 21.2 |
| 42565.48643518519 | 21.2 |
| 42565.507268518515 | 21.1 |
| 42565.52810185185 | 21.2 |
| 42565.54893518519 | 21.1 |
| 42565.569768518515 | 21.2 |
| 42565.59060185185 | 21.2 |
| 42565.61143518519 | 21.2 |
| 42565.632268518515 | 21.2 |
| 42565.65310185185 | 21.2 |
| 42565.67393518519 | 21.2 |
| 42565.694768518515 | 21.2 |
| 42565.71560185185 | 21.2 |
| 42565.73643518519 | 21.2 |
| 42565.757268518515 | 21.2 |
| 42565.77810185185 | 21.2 |
| 42565.79893518519 | 21.2 |
| 42565.819768518515 | 21.2 |
| 42565.84060185185 | 21.2 |
| 42565.86143518519 | 21.2 |
| 42565.882268518515 | 21.2 |
| 42565.90310185185 | 21.1 |
| 42565.92393518519 | 21.1 |
| 42565.944768518515 | 21.2 |
| 42565.96560185185 | 21.1 |
| 42565.98643518519 | 21.1 |
| 42566.007268518515 | 21.1 |
| 42566.02810185185 | 21.1 |
| 42566.04893518519 | 21.1 |
| 42566.069768518515 | 21.1 |
| 42566.09060185185 | 21.1 |
| 42566.11143518519 | 21 |
| 42566.132268518515 | 21 |
| 42566.15310185185 | 21 |
| 42566.17393518519 | 21 |
| 42566.194768518515 | 21 |
| 42566.21560185185 | 21 |
| 42566.23643518519 | 21 |
| 42566.257268518515 | 20.9 |
| 42566.27810185185 | 20.9 |
| 42566.29893518519 | 21 |
| 42566.319768518515 | 20.9 |
| 42566.34060185185 | 20.9 |
| 42566.36143518519 | 21 |
| 42566.382268518515 | 21 |
| 42566.40310185185 | 21 |
| 42566.42393518519 | 21.1 |
| 42566.444768518515 | 21 |
| 42566.46560185185 | 21.1 |
| 42566.48643518519 | 21.1 |
| 42566.507268518515 | 21.1 |
| 42566.52810185185 | 21.2 |
| 42566.54893518519 | 21.2 |
| 42566.569768518515 | 21.2 |
| 42566.59060185185 | 21.2 |
| 42566.61143518519 | 21.2 |
| 42566.632268518515 | 21.2 |
| 42566.65310185185 | 21.3 |
| 42566.67393518519 | 21.3 |
| 42566.694768518515 | 21.3 |
| 42566.71560185185 | 21.3 |
| 42566.73643518519 | 21.3 |
| 42566.757268518515 | 21.3 |
| 42566.77810185185 | 21.3 |
| 42566.79893518519 | 21.3 |
| 42566.819768518515 | 21.3 |
| 42566.84060185185 | 21.3 |
| 42566.86143518519 | 21.2 |
| 42566.882268518515 | 21.3 |
| 42566.90310185185 | 21.2 |
| 42566.92393518519 | 21.2 |
| 42566.944768518515 | 21.2 |
| 42566.96560185185 | 21.2 |
| 42566.98643518519 | 21.2 |
| 42567.007268518515 | 21.2 |
| 42567.02810185185 | 21.2 |
| 42567.04893518519 | 21.2 |
| 42567.069768518515 | 21.2 |
| 42567.09060185185 | 21.1 |
| 42567.11143518519 | 21.2 |
| 42567.132268518515 | 21.1 |
| 42567.15310185185 | 21.1 |
| 42567.17393518519 | 21.1 |
| 42567.194768518515 | 21.1 |
| 42567.21560185185 | 21.1 |
| 42567.23643518519 | 21.1 |
| 42567.257268518515 | 21.1 |
| 42567.27810185185 | 21.1 |
| 42567.29893518519 | 21 |
| 42567.319768518515 | 21.1 |
| 42567.34060185185 | 21.1 |
| 42567.36143518519 | 21.1 |
| 42567.382268518515 | 21.1 |
| 42567.40310185185 | 21.1 |
| 42567.42393518519 | 21.1 |
| 42567.444768518515 | 21.2 |
| 42567.46560185185 | 21.2 |
| 42567.48643518519 | 21.2 |
| 42567.507268518515 | 21.2 |
| 42567.52810185185 | 21.2 |
| 42567.54893518519 | 21.2 |
| 42567.569768518515 | 21.2 |
| 42567.59060185185 | 21.2 |
| 42567.61143518519 | 21.2 |
| 42567.632268518515 | 21.2 |
| 42567.65310185185 | 21.3 |
| 42567.67393518519 | 21.4 |
| 42567.694768518515 | 21.3 |
| 42567.71560185185 | 21.3 |
| 42567.73643518519 | 21.4 |
| 42567.757268518515 | 21.3 |
| 42567.77810185185 | 21.4 |
| 42567.79893518519 | 21.4 |
| 42567.819768518515 | 21.4 |
| 42567.84060185185 | 21.4 |
| 42567.86143518519 | 21.4 |
| 42567.882268518515 | 21.4 |
| 42567.90310185185 | 21.4 |
| 42567.92393518519 | 21.3 |
| 42567.944768518515 | 21.3 |
| 42567.96560185185 | 21.3 |
| 42567.98643518519 | 21.3 |
| 42568.007268518515 | 21.2 |
| 42568.02810185185 | 21.3 |
| 42568.04893518519 | 21.2 |
| 42568.069768518515 | 21.3 |
| 42568.09060185185 | 21.2 |
| 42568.11143518519 | 21.2 |
| 42568.132268518515 | 21.2 |
| 42568.15310185185 | 21.2 |
| 42568.17393518519 | 21.2 |
| 42568.194768518515 | 21.2 |
| 42568.21560185185 | 21.2 |
| 42568.23643518519 | 21.1 |
| 42568.257268518515 | 21.1 |
| 42568.27810185185 | 21.1 |
| 42568.29893518519 | 21.1 |
| 42568.319768518515 | 21.1 |
| 42568.34060185185 | 21.2 |
| 42568.36143518519 | 21.1 |
| 42568.382268518515 | 21.2 |
| 42568.40310185185 | 21.2 |
| 42568.42393518519 | 21.2 |
| 42568.444768518515 | 21.2 |
| 42568.46560185185 | 21.3 |
| 42568.48643518519 | 21.3 |
| 42568.507268518515 | 21.3 |
| 42568.52810185185 | 21.3 |
| 42568.54893518519 | 21.4 |
| 42568.569768518515 | 21.4 |
| 42568.59060185185 | 21.4 |
| 42568.61143518519 | 21.5 |
| 42568.632268518515 | 21.4 |
| 42568.65310185185 | 21.5 |
| 42568.67393518519 | 21.6 |
| 42568.694768518515 | 21.6 |
| 42568.71560185185 | 21.5 |
| 42568.73643518519 | 21.6 |
| 42568.757268518515 | 21.6 |
| 42568.77810185185 | 21.6 |
| 42568.79893518519 | 21.6 |
| 42568.819768518515 | 21.6 |
| 42568.84060185185 | 21.6 |
| 42568.86143518519 | 21.5 |
| 42568.882268518515 | 21.5 |
| 42568.90310185185 | 21.5 |
| 42568.92393518519 | 21.4 |
| 42568.944768518515 | 21.4 |
| 42568.96560185185 | 21.5 |
| 42568.98643518519 | 21.4 |
| 42569.007268518515 | 21.4 |
| 42569.02810185185 | 21.4 |
| 42569.04893518519 | 21.4 |
| 42569.069768518515 | 21.3 |
| 42569.09060185185 | 21.3 |
| 42569.11143518519 | 21.2 |
| 42569.132268518515 | 21.2 |
| 42569.15310185185 | 21.3 |
| 42569.17393518519 | 21.3 |
| 42569.194768518515 | 21.2 |
| 42569.21560185185 | 21.3 |
| 42569.23643518519 | 21.3 |
| 42569.257268518515 | 21.2 |
| 42569.27810185185 | 21.2 |
| 42569.29893518519 | 21.2 |
| 42569.319768518515 | 21.2 |
| 42569.34060185185 | 21.2 |
| 42569.36143518519 | 21.3 |
| 42569.382268518515 | 21.3 |
| 42569.40310185185 | 21.2 |
| 42569.42393518519 | 21.3 |
| 42569.444768518515 | 21.4 |
| 42569.46560185185 | 21.4 |
| 42569.48643518519 | 21.4 |
| 42569.507268518515 | 21.4 |
| 42569.52810185185 | 21.5 |
| 42569.54893518519 | 21.5 |
| 42569.569768518515 | 21.5 |
| 42569.59060185185 | 21.6 |
| 42569.61143518519 | 21.6 |
| 42569.632268518515 | 21.6 |
| 42569.65310185185 | 21.6 |
| 42569.67393518519 | 21.6 |
| 42569.694768518515 | 21.7 |
| 42569.71560185185 | 21.6 |
| 42569.73643518519 | 21.6 |
| 42569.757268518515 | 21.6 |
| 42569.77810185185 | 21.6 |
| 42569.79893518519 | 21.5 |
| 42569.819768518515 | 21.6 |
| 42569.84060185185 | 21.5 |
| 42569.86143518519 | 21.6 |
| 42569.882268518515 | 21.5 |
| 42569.90310185185 | 21.5 |
| 42569.92393518519 | 21.5 |
| 42569.944768518515 | 21.4 |
| 42569.96560185185 | 21.5 |
| 42569.98643518519 | 21.4 |
| 42570.007268518515 | 21.4 |
| 42570.02810185185 | 21.4 |
| 42570.04893518519 | 21.4 |
| 42570.069768518515 | 21.4 |
| 42570.09060185185 | 21.3 |
| 42570.11143518519 | 21.3 |
| 42570.132268518515 | 21.3 |
| 42570.15310185185 | 21.3 |
| 42570.17393518519 | 21.2 |
| 42570.194768518515 | 21.2 |
| 42570.21560185185 | 21.2 |
| 42570.23643518519 | 21.3 |
| 42570.257268518515 | 21.2 |
| 42570.27810185185 | 21.2 |
| 42570.29893518519 | 21.1 |
| 42570.319768518515 | 21.2 |
| 42570.34060185185 | 21.3 |
| 42570.36143518519 | 21.3 |
| 42570.382268518515 | 21.4 |
| 42570.40310185185 | 21.3 |
| 42570.42393518519 | 21.4 |
| 42570.444768518515 | 21.4 |
| 42570.46560185185 | 21.4 |
| 42570.48643518519 | 21.3 |
| 42570.507268518515 | 21.5 |
| 42570.52810185185 | 21.5 |
| 42570.54893518519 | 21.5 |
| 42570.569768518515 | 21.5 |
| 42570.59060185185 | 21.6 |
| 42570.61143518519 | 21.6 |
| 42570.632268518515 | 21.7 |
| 42570.65310185185 | 21.7 |
| 42570.67393518519 | 21.6 |
| 42570.694768518515 | 21.7 |
| 42570.71560185185 | 21.7 |
| 42570.73643518519 | 21.6 |
| 42570.757268518515 | 21.6 |
| 42570.77810185185 | 21.6 |
| 42570.79893518519 | 21.6 |
| 42570.819768518515 | 21.6 |
| 42570.84060185185 | 21.5 |
| 42570.86143518519 | 21.5 |
| 42570.882268518515 | 21.5 |
| 42570.90310185185 | 21.4 |
| 42570.92393518519 | 21.4 |
| 42570.944768518515 | 21.4 |
| 42570.96560185185 | 21.4 |
| 42570.98643518519 | 21.4 |
| 42571.007268518515 | 21.3 |
| 42571.02810185185 | 21.4 |
| 42571.04893518519 | 21.2 |
| 42571.069768518515 | 21.3 |
| 42571.09060185185 | 21.3 |
| 42571.11143518519 | 21.3 |
| 42571.132268518515 | 21.3 |
| 42571.15310185185 | 21.3 |
| 42571.17393518519 | 21.2 |
| 42571.194768518515 | 21.1 |
| 42571.21560185185 | 21.2 |
| 42571.23643518519 | 21.1 |
| 42571.257268518515 | 21.1 |
| 42571.27810185185 | 21.1 |
| 42571.29893518519 | 21.1 |
| 42571.319768518515 | 21.1 |
| 42571.34060185185 | 21.1 |
| 42571.36143518519 | 21.1 |
| 42571.382268518515 | 21.3 |
| 42571.40310185185 | 21.4 |
| 42571.42393518519 | 21.7 |
| 42571.444768518515 | 21.5 |
| 42571.46560185185 | 21.6 |
| 42571.48643518519 | 21.5 |
| 42571.507268518515 | 21.6 |
| 42571.52810185185 | 21.7 |
| 42571.54893518519 | 21.8 |
| 42571.569768518515 | 21.8 |
| 42571.59060185185 | 21.7 |
| 42571.61143518519 | 21.7 |
| 42571.632268518515 | 21.6 |
| 42571.65310185185 | 21.7 |
| 42571.67393518519 | 21.7 |
| 42571.694768518515 | 21.7 |
| 42571.71560185185 | 21.7 |
| 42571.73643518519 | 21.4 |
| 42571.757268518515 | 21.4 |
| 42571.77810185185 | 21.4 |
| 42571.79893518519 | 21.4 |
| 42571.819768518515 | 21.4 |
| 42571.84060185185 | 21.4 |
| 42571.86143518519 | 21.3 |
| 42571.882268518515 | 21.2 |
| 42571.90310185185 | 21.3 |
| 42571.92393518519 | 21.2 |
| 42571.944768518515 | 21.2 |
| 42571.96560185185 | 21.2 |
| 42571.98643518519 | 21.1 |
| 42572.007268518515 | 21.2 |
| 42572.02810185185 | 21.2 |
| 42572.04893518519 | 21.2 |
| 42572.069768518515 | 21.2 |
| 42572.09060185185 | 21.1 |
| 42572.11143518519 | 21.1 |
| 42572.132268518515 | 21.1 |
| 42572.15310185185 | 20.9 |
| 42572.17393518519 | 21.1 |
| 42572.194768518515 | 21.1 |
| 42572.21560185185 | 21 |
| 42572.23643518519 | 21.1 |
| 42572.257268518515 | 21.1 |
| 42572.27810185185 | 21 |
| 42572.29893518519 | 21 |
| 42572.319768518515 | 21.1 |
| 42572.34060185185 | 21.1 |
| 42572.36143518519 | 21.1 |
| 42572.382268518515 | 21 |
| 42572.40310185185 | 21.2 |
| 42572.42393518519 | 21.2 |
| 42572.444768518515 | 21.2 |
| 42572.46560185185 | 21.2 |
| 42572.48643518519 | 21.2 |
| 42572.507268518515 | 21.2 |
| 42572.52810185185 | 21.2 |
| 42572.54893518519 | 21.3 |
| 42572.569768518515 | 21.3 |
| 42572.59060185185 | 21.2 |
| 42572.61143518519 | 21.4 |
| 42572.632268518515 | 21.4 |
| 42572.65310185185 | 21.5 |
| 42572.67393518519 | 21.4 |
| 42572.694768518515 | 21.4 |
| 42572.71560185185 | 21.4 |
| 42572.73643518519 | 21.5 |
| 42572.757268518515 | 21.5 |
| 42572.77810185185 | 21.4 |
| 42572.79893518519 | 21.4 |
| 42572.819768518515 | 21.4 |
| 42572.84060185185 | 21.4 |
| 42572.86143518519 | 21.4 |
| 42572.882268518515 | 21.4 |
| 42572.90310185185 | 21.4 |
| 42572.92393518519 | 21.3 |
| 42572.944768518515 | 21.2 |
| 42572.96560185185 | 21.3 |
| 42572.98643518519 | 21.2 |
| 42573.007268518515 | 21.3 |
| 42573.02810185185 | 21.3 |
| 42573.04893518519 | 21.3 |
| 42573.069768518515 | 21.2 |
| 42573.09060185185 | 21.2 |
| 42573.11143518519 | 21.1 |
| 42573.132268518515 | 21.2 |
| 42573.15310185185 | 21.2 |
| 42573.17393518519 | 21.2 |
| 42573.194768518515 | 21.2 |
| 42573.21560185185 | 21.1 |
| 42573.23643518519 | 21.2 |
| 42573.257268518515 | 21.2 |
| 42573.27810185185 | 21 |
| 42573.29893518519 | 21.1 |
| 42573.319768518515 | 21.1 |
| 42573.34060185185 | 21.1 |
| 42573.36143518519 | 21 |
| 42573.382268518515 | 21.1 |
| 42573.40310185185 | 21.1 |
| 42573.42393518519 | 21.1 |
| 42573.444768518515 | 21.2 |
| 42573.46560185185 | 21.2 |
| 42573.48643518519 | 21.2 |
| 42573.507268518515 | 21.1 |
| 42573.52810185185 | 21.1 |
| 42573.54893518519 | 21 |
| 42573.569768518515 | 21.1 |
| 42573.59060185185 | 21 |
| 42573.61143518519 | 21.1 |
| 42573.632268518515 | 21.1 |
| 42573.65310185185 | 21.1 |
| 42573.67393518519 | 21.1 |
| 42573.694768518515 | 21.2 |
| 42573.71560185185 | 21.2 |
| 42573.73643518519 | 21.2 |
| 42573.757268518515 | 21.3 |
| 42573.77810185185 | 21.2 |
| 42573.79893518519 | 21.2 |
| 42573.819768518515 | 21.2 |
| 42573.84060185185 | 21.1 |
| 42573.86143518519 | 21.1 |
| 42573.882268518515 | 21.1 |
| 42573.90310185185 | 21.1 |
| 42573.92393518519 | 21.1 |
| 42573.944768518515 | 21.1 |
| 42573.96560185185 | 21.1 |
| 42573.98643518519 | 21.1 |
| 42574.007268518515 | 21 |
| 42574.02810185185 | 21.1 |
| 42574.04893518519 | 21 |
| 42574.069768518515 | 20.9 |
| 42574.09060185185 | 21 |
| 42574.11143518519 | 21 |
| 42574.132268518515 | 20.9 |
| 42574.15310185185 | 21 |
| 42574.17393518519 | 21 |
| 42574.194768518515 | 20.9 |
| 42574.21560185185 | 21 |
| 42574.23643518519 | 21 |
| 42574.257268518515 | 21 |
| 42574.27810185185 | 21 |
| 42574.29893518519 | 21 |
| 42574.319768518515 | 21 |
| 42574.34060185185 | 21 |
| 42574.36143518519 | 21 |
| 42574.382268518515 | 21.1 |
| 42574.40310185185 | 21.1 |
| 42574.42393518519 | 21.1 |
| 42574.444768518515 | 21.1 |
| 42574.46560185185 | 21 |
| 42574.48643518519 | 21.2 |
| 42574.507268518515 | 21.1 |
| 42574.52810185185 | 21.1 |
| 42574.54893518519 | 21.2 |
| 42574.569768518515 | 21.1 |
| 42574.59060185185 | 21.2 |
| 42574.61143518519 | 21.2 |
| 42574.632268518515 | 21.2 |
| 42574.65310185185 | 21.3 |
| 42574.67393518519 | 21.2 |
| 42574.694768518515 | 21.2 |
| 42574.71560185185 | 21.2 |
| 42574.73643518519 | 21.2 |
| 42574.757268518515 | 21.2 |
| 42574.77810185185 | 21.2 |
| 42574.79893518519 | 21 |
| 42574.819768518515 | 21.2 |
| 42574.84060185185 | 21.2 |
| 42574.86143518519 | 21.2 |
| 42574.882268518515 | 21.1 |
| 42574.90310185185 | 21.1 |
| 42574.92393518519 | 21.1 |
| 42574.944768518515 | 21.1 |
| 42574.96560185185 | 21 |
| 42574.98643518519 | 21.1 |
| 42575.007268518515 | 21.1 |
| 42575.02810185185 | 21.1 |
| 42575.04893518519 | 21.1 |
| 42575.069768518515 | 21 |
| 42575.09060185185 | 21 |
| 42575.11143518519 | 21 |
| 42575.132268518515 | 21 |
| 42575.15310185185 | 21 |
| 42575.17393518519 | 21 |
| 42575.194768518515 | 20.9 |
| 42575.21560185185 | 21 |
| 42575.23643518519 | 20.9 |
| 42575.257268518515 | 21 |
| 42575.27810185185 | 20.9 |
| 42575.29893518519 | 20.9 |
| 42575.319768518515 | 20.9 |
| 42575.34060185185 | 21 |
| 42575.36143518519 | 21 |
| 42575.382268518515 | 21.1 |
| 42575.40310185185 | 21 |
| 42575.42393518519 | 21 |
| 42575.444768518515 | 21.1 |
| 42575.46560185185 | 21.2 |
| 42575.48643518519 | 21.1 |
| 42575.507268518515 | 21.2 |
| 42575.52810185185 | 21.2 |
| 42575.54893518519 | 21.2 |
| 42575.569768518515 | 21.2 |
| 42575.59060185185 | 21.4 |
| 42575.61143518519 | 21.3 |
| 42575.632268518515 | 21.3 |
| 42575.65310185185 | 21.4 |
| 42575.67393518519 | 21.4 |
| 42575.694768518515 | 21.4 |
| 42575.71560185185 | 21.4 |
| 42575.73643518519 | 21.4 |
| 42575.757268518515 | 21.3 |
| 42575.77810185185 | 21.4 |
| 42575.79893518519 | 21.4 |
| 42575.819768518515 | 21.4 |
| 42575.84060185185 | 21.4 |
| 42575.86143518519 | 21.4 |
| 42575.882268518515 | 21.4 |
| 42575.90310185185 | 21.4 |
| 42575.92393518519 | 21.3 |
| 42575.944768518515 | 21.3 |
| 42575.96560185185 | 21.4 |
| 42575.98643518519 | 21.3 |
| 42576.007268518515 | 21.3 |
| 42576.02810185185 | 21.2 |
| 42576.04893518519 | 21.3 |
| 42576.069768518515 | 21.2 |
| 42576.09060185185 | 21.2 |
| 42576.11143518519 | 21.2 |
| 42576.132268518515 | 21.2 |
| 42576.15310185185 | 21.3 |
| 42576.17393518519 | 21.2 |
| 42576.194768518515 | 21.1 |
| 42576.21560185185 | 21.2 |
| 42576.23643518519 | 21.2 |
| 42576.257268518515 | 21.2 |
| 42576.27810185185 | 21.1 |
| 42576.29893518519 | 21.1 |
| 42576.319768518515 | 21.1 |
| 42576.34060185185 | 21.1 |
| 42576.36143518519 | 21.2 |
| 42576.382268518515 | 21.3 |
| 42576.40310185185 | 21.2 |
| 42576.42393518519 | 21.3 |
| 42576.444768518515 | 21.3 |
| 42576.46560185185 | 21.3 |
| 42576.48643518519 | 21.3 |
| 42576.507268518515 | 21.2 |
| 42576.52810185185 | 21.4 |
| 42576.54893518519 | 21.4 |
| 42576.569768518515 | 21.4 |
| 42576.59060185185 | 21.4 |
| 42576.61143518519 | 21.4 |
| 42576.632268518515 | 21.5 |
| 42576.65310185185 | 21.5 |
| 42576.67393518519 | 21.5 |
| 42576.694768518515 | 21.5 |
| 42576.71560185185 | 21.5 |
| 42576.73643518519 | 21.5 |
| 42576.757268518515 | 21.5 |
| 42576.77810185185 | 21.5 |
| 42576.79893518519 | 21.5 |
| 42576.819768518515 | 21.5 |
| 42576.84060185185 | 21.5 |
| 42576.86143518519 | 21.5 |
| 42576.882268518515 | 21.4 |
| 42576.90310185185 | 21.4 |
| 42576.92393518519 | 21.5 |
| 42576.944768518515 | 21.4 |
| 42576.96560185185 | 21.4 |
| 42576.98643518519 | 21.4 |
| 42577.007268518515 | 21.4 |
| 42577.02810185185 | 21.3 |
| 42577.04893518519 | 21.3 |
| 42577.069768518515 | 21.3 |
| 42577.09060185185 | 21.3 |
| 42577.11143518519 | 21.3 |
| 42577.132268518515 | 21.2 |
| 42577.15310185185 | 21.1 |
| 42577.17393518519 | 21.2 |
| 42577.194768518515 | 21.1 |
| 42577.21560185185 | 21.2 |
| 42577.23643518519 | 21.2 |
| 42577.257268518515 | 21.2 |
| 42577.27810185185 | 21.2 |
| 42577.29893518519 | 21.1 |
| 42577.319768518515 | 21 |
| 42577.34060185185 | 21.1 |
| 42577.36143518519 | 21.2 |
| 42577.382268518515 | 21.2 |
| 42577.40310185185 | 21.3 |
| 42577.42393518519 | 21.3 |
| 42577.444768518515 | 21.4 |
| 42577.46560185185 | 21.3 |
| 42577.48643518519 | 21.4 |
| 42577.507268518515 | 21.4 |
| 42577.52810185185 | 21.4 |
| 42577.54893518519 | 21.4 |
| 42577.569768518515 | 21.5 |
| 42577.59060185185 | 21.5 |
| 42577.61143518519 | 21.5 |
| 42577.632268518515 | 21.5 |
| 42577.65310185185 | 21.6 |
| 42577.67393518519 | 21.6 |
| 42577.694768518515 | 21.6 |
| 42577.71560185185 | 21.5 |
| 42577.73643518519 | 21.6 |
| 42577.757268518515 | 21.5 |
| 42577.77810185185 | 21.6 |
| 42577.79893518519 | 21.6 |
| 42577.819768518515 | 21.5 |
| 42577.84060185185 | 21.5 |
| 42577.86143518519 | 21.5 |
| 42577.882268518515 | 21.5 |
| 42577.90310185185 | 21.5 |
| 42577.92393518519 | 21.5 |
| 42577.944768518515 | 21.5 |
| 42577.96560185185 | 21.4 |
| 42577.98643518519 | 21.4 |
| 42578.007268518515 | 21.4 |
| 42578.02810185185 | 21.4 |
| 42578.04893518519 | 21.4 |
| 42578.069768518515 | 21.4 |
| 42578.09060185185 | 21.3 |
| 42578.11143518519 | 21.3 |
| 42578.132268518515 | 21.4 |
| 42578.15310185185 | 21.4 |
| 42578.17393518519 | 21.3 |
| 42578.194768518515 | 21.2 |
| 42578.21560185185 | 21.2 |
| 42578.23643518519 | 21.2 |
| 42578.257268518515 | 21.2 |
| 42578.27810185185 | 21.2 |
| 42578.29893518519 | 21.2 |
| 42578.319768518515 | 21.2 |
| 42578.34060185185 | 21.2 |
| 42578.36143518519 | 21.2 |
| 42578.382268518515 | 21.2 |
| 42578.40310185185 | 21.4 |
| 42578.42393518519 | 21.4 |
| 42578.444768518515 | 21.4 |
| 42578.46560185185 | 21.4 |
| 42578.48643518519 | 21.5 |
| 42578.507268518515 | 21.7 |
| 42578.52810185185 | 21.7 |
| 42578.54893518519 | 21.7 |
| 42578.569768518515 | 21.6 |
| 42578.59060185185 | 21.7 |
| 42578.61143518519 | 21.5 |
| 42578.632268518515 | 21.6 |
| 42578.65310185185 | 21.5 |
| 42578.67393518519 | 21.4 |
| 42578.694768518515 | 21.3 |
| 42578.71560185185 | 21.3 |
| 42578.73643518519 | 21.4 |
| 42578.757268518515 | 21.2 |
| 42578.77810185185 | 21.4 |
| 42578.79893518519 | 21.4 |
| 42578.819768518515 | 21.4 |
| 42578.84060185185 | 21.3 |
| 42578.86143518519 | 21.4 |
| 42578.882268518515 | 21.1 |
| 42578.90310185185 | 21.2 |
| 42578.92393518519 | 21.1 |
| 42578.944768518515 | 21.1 |
| 42578.96560185185 | 21.2 |
| 42578.98643518519 | 21.1 |
| 42579.007268518515 | 21.2 |
| 42579.02810185185 | 21.1 |
| 42579.04893518519 | 21.1 |
| 42579.069768518515 | 21.1 |
| 42579.09060185185 | 21 |
| 42579.11143518519 | 21.1 |
| 42579.132268518515 | 21 |
| 42579.15310185185 | 21 |
| 42579.17393518519 | 21 |
| 42579.194768518515 | 21 |
| 42579.21560185185 | 21 |
| 42579.23643518519 | 20.9 |
| 42579.257268518515 | 20.9 |
| 42579.27810185185 | 20.9 |
| 42579.29893518519 | 21 |
| 42579.319768518515 | 20.9 |
| 42579.34060185185 | 20.9 |
| 42579.36143518519 | 21 |
| 42579.382268518515 | 21 |
| 42579.40310185185 | 21 |
| 42579.42393518519 | 21 |
| 42579.444768518515 | 21.1 |
| 42579.46560185185 | 21.1 |
| 42579.48643518519 | 21.2 |
| 42579.507268518515 | 21.2 |
| 42579.52810185185 | 21.2 |
| 42579.54893518519 | 21.2 |
| 42579.569768518515 | 21.3 |
| 42579.59060185185 | 21.3 |
| 42579.61143518519 | 21.3 |
| 42579.632268518515 | 21.3 |
| 42579.65310185185 | 21.4 |
| 42579.67393518519 | 21.4 |
| 42579.694768518515 | 21.4 |
| 42579.71560185185 | 21.4 |
| 42579.73643518519 | 21.4 |
| 42579.757268518515 | 21.4 |
| 42579.77810185185 | 21.4 |
| 42579.79893518519 | 21.4 |
| 42579.819768518515 | 21.3 |
| 42579.84060185185 | 21.4 |
| 42579.86143518519 | 21.4 |
| 42579.882268518515 | 21.4 |
| 42579.90310185185 | 21.3 |
| 42579.92393518519 | 21.2 |
| 42579.944768518515 | 21.2 |
| 42579.96560185185 | 21.2 |
| 42579.98643518519 | 21.2 |
| 42580.007268518515 | 21.2 |
| 42580.02810185185 | 21.2 |
| 42580.04893518519 | 21.1 |
| 42580.069768518515 | 21.1 |
| 42580.09060185185 | 21.1 |
| 42580.11143518519 | 21.1 |
| 42580.132268518515 | 21.1 |
| 42580.15310185185 | 21.1 |
| 42580.17393518519 | 21.1 |
| 42580.194768518515 | 21 |
| 42580.21560185185 | 21 |
| 42580.23643518519 | 21 |
| 42580.257268518515 | 21 |
| 42580.27810185185 | 20.9 |
| 42580.29893518519 | 21 |
| 42580.319768518515 | 20.9 |
| 42580.34060185185 | 21 |
| 42580.36143518519 | 20.9 |
| 42580.382268518515 | 21.1 |
| 42580.40310185185 | 21.1 |
| 42580.42393518519 | 21.1 |
| 42580.444768518515 | 21.1 |
| 42580.46560185185 | 21.1 |
| 42580.48643518519 | 21.3 |
| 42580.507268518515 | 21.3 |
| 42580.52810185185 | 21.3 |
| 42580.54893518519 | 21.4 |
| 42580.569768518515 | 21.4 |
| 42580.59060185185 | 21.3 |
| 42580.61143518519 | 21.4 |
| 42580.632268518515 | 21.5 |
| 42580.65310185185 | 21.5 |
| 42580.67393518519 | 21.5 |
| 42580.694768518515 | 21.5 |
| 42580.71560185185 | 21.5 |
| 42580.73643518519 | 21.5 |
| 42580.757268518515 | 21.5 |
| 42580.77810185185 | 21.6 |
| 42580.79893518519 | 21.6 |
| 42580.819768518515 | 21.6 |
| 42580.84060185185 | 21.5 |
| 42580.86143518519 | 21.5 |
| 42580.882268518515 | 21.4 |
| 42580.90310185185 | 21.5 |
| 42580.92393518519 | 21.5 |
| 42580.944768518515 | 21.4 |
| 42580.96560185185 | 21.4 |
| 42580.98643518519 | 21.4 |
| 42581.007268518515 | 21.3 |
| 42581.02810185185 | 21.3 |
| 42581.04893518519 | 21.3 |
| 42581.069768518515 | 21.2 |
| 42581.09060185185 | 21.3 |
| 42581.11143518519 | 21.2 |
| 42581.132268518515 | 21.2 |
| 42581.15310185185 | 21.2 |
| 42581.17393518519 | 21.2 |
| 42581.194768518515 | 21.1 |
| 42581.21560185185 | 21.1 |
| 42581.23643518519 | 21.1 |
| 42581.257268518515 | 21.1 |
| 42581.27810185185 | 21.1 |
| 42581.29893518519 | 21 |
| 42581.319768518515 | 21 |
| 42581.34060185185 | 21.2 |
| 42581.36143518519 | 21.1 |
| 42581.382268518515 | 21.1 |
| 42581.40310185185 | 21.2 |
| 42581.42393518519 | 21.2 |
| 42581.444768518515 | 21.1 |
| 42581.46560185185 | 21.2 |
| 42581.48643518519 | 21.3 |
| 42581.507268518515 | 21.4 |
| 42581.52810185185 | 21.3 |
| 42581.54893518519 | 21.3 |
| 42581.569768518515 | 21.3 |
| 42581.59060185185 | 21.3 |
| 42581.61143518519 | 21.3 |
| 42581.632268518515 | 21.4 |
| 42581.65310185185 | 21.3 |
| 42581.67393518519 | 21.4 |
| 42581.694768518515 | 21.3 |
| 42581.71560185185 | 21.4 |
| 42581.73643518519 | 21.5 |
| 42581.757268518515 | 21.4 |
| 42581.77810185185 | 21.5 |
| 42581.79893518519 | 21.5 |
| 42581.819768518515 | 21.4 |
| 42581.84060185185 | 21.4 |
| 42581.86143518519 | 21.4 |
| 42581.882268518515 | 21.4 |
| 42581.90310185185 | 21.5 |
| 42581.92393518519 | 21.3 |
| 42581.944768518515 | 21.4 |
| 42581.96560185185 | 21.3 |
| 42581.98643518519 | 21.3 |
| 42582.007268518515 | 21.4 |
| 42582.02810185185 | 21.3 |
| 42582.04893518519 | 21.3 |
| 42582.069768518515 | 21.3 |
| 42582.09060185185 | 21.3 |
| 42582.11143518519 | 21.3 |
| 42582.132268518515 | 21.3 |
| 42582.15310185185 | 21.1 |
| 42582.17393518519 | 21.1 |
| 42582.194768518515 | 21 |
| 42582.21560185185 | 21.2 |
| 42582.23643518519 | 21.1 |
| 42582.257268518515 | 21.1 |
| 42582.27810185185 | 21.2 |
| 42582.29893518519 | 21 |
| 42582.319768518515 | 21.2 |
| 42582.34060185185 | 21 |
| 42582.36143518519 | 21.1 |
| 42582.382268518515 | 21.1 |
| 42582.40310185185 | 21.1 |
| 42582.42393518519 | 21.2 |
| 42582.444768518515 | 21.1 |
| 42582.46560185185 | 21.1 |
| 42582.48643518519 | 21.1 |
| 42582.507268518515 | 21.2 |
| 42582.52810185185 | 21.2 |
| 42582.54893518519 | 21.2 |
| 42582.569768518515 | 21.2 |
| 42582.59060185185 | 21.2 |
| 42582.61143518519 | 21.3 |
| 42582.632268518515 | 21.2 |
| 42582.65310185185 | 21.3 |
| 42582.67393518519 | 21.4 |
| 42582.694768518515 | 21.3 |
| 42582.71560185185 | 21.4 |
| 42582.73643518519 | 21.2 |
| 42582.757268518515 | 21.2 |
| 42582.77810185185 | 21.3 |
| 42582.79893518519 | 21.4 |
| 42582.819768518515 | 21.3 |
| 42582.84060185185 | 21.3 |
| 42582.86143518519 | 21.2 |
| 42582.882268518515 | 21.2 |
| 42582.90310185185 | 21.2 |
| 42582.92393518519 | 21.3 |
| 42582.944768518515 | 21.1 |
| 42582.96560185185 | 21.2 |
| 42582.98643518519 | 21.2 |
| 42583.007268518515 | 21.2 |
| 42583.02810185185 | 21.1 |
| 42583.04893518519 | 21.1 |
| 42583.069768518515 | 21.1 |
| 42583.09060185185 | 21.1 |
| 42583.11143518519 | 21.1 |
| 42583.132268518515 | 21.1 |
| 42583.15310185185 | 21 |
| 42583.17393518519 | 21 |
| 42583.194768518515 | 21 |
| 42583.21560185185 | 21 |
| 42583.23643518519 | 21.1 |
| 42583.257268518515 | 21 |
| 42583.27810185185 | 21 |
| 42583.29893518519 | 21 |
| 42583.319768518515 | 21 |
| 42583.34060185185 | 21.1 |
| 42583.36143518519 | 21 |
| 42583.382268518515 | 21.1 |
| 42583.40310185185 | 21.1 |
| 42583.42393518519 | 21.1 |
| 42583.444768518515 | 21 |
| 42583.46560185185 | 21.1 |
| 42583.48643518519 | 21.1 |
| 42583.507268518515 | 21.1 |
| 42583.52810185185 | 21.1 |
| 42583.54893518519 | 21.2 |
| 42583.569768518515 | 21.2 |
| 42583.59060185185 | 21.2 |
| 42583.61143518519 | 21.3 |
| 42583.632268518515 | 21.2 |
| 42583.65310185185 | 21.2 |
| 42583.67393518519 | 21.2 |
| 42583.694768518515 | 21.2 |
| 42583.71560185185 | 21.3 |
| 42583.73643518519 | 21.4 |
| 42583.757268518515 | 21.4 |
| 42583.77810185185 | 21.3 |
| 42583.79893518519 | 21.4 |
| 42583.819768518515 | 21.4 |
| 42583.84060185185 | 21.4 |
| 42583.86143518519 | 21.3 |
| 42583.882268518515 | 21.2 |
| 42583.90310185185 | 21.3 |
| 42583.92393518519 | 21.3 |
| 42583.944768518515 | 21.3 |
| 42583.96560185185 | 21.2 |
| 42583.98643518519 | 21.2 |
| 42584.007268518515 | 21.1 |
| 42584.02810185185 | 21.1 |
| 42584.04893518519 | 21.1 |
| 42584.069768518515 | 21.1 |
| 42584.09060185185 | 21.1 |
| 42584.11143518519 | 21.1 |
| 42584.132268518515 | 21 |
| 42584.15310185185 | 21.1 |
| 42584.17393518519 | 21 |
| 42584.194768518515 | 21.1 |
| 42584.21560185185 | 21.1 |
| 42584.23643518519 | 21 |
| 42584.257268518515 | 20.9 |
| 42584.27810185185 | 21 |
| 42584.29893518519 | 21 |
| 42584.319768518515 | 21 |
| 42584.34060185185 | 21 |
| 42584.36143518519 | 21 |
| 42584.382268518515 | 21 |
| 42584.40310185185 | 21 |
| 42584.42393518519 | 21.1 |
| 42584.444768518515 | 21 |
| 42584.46560185185 | 21.1 |
| 42584.48643518519 | 21.2 |
| 42584.507268518515 | 21.2 |
| 42584.52810185185 | 21.2 |
| 42584.54893518519 | 21.2 |
| 42584.569768518515 | 21.2 |
| 42584.59060185185 | 21.2 |
| 42584.61143518519 | 21.4 |
| 42584.632268518515 | 21.4 |
| 42584.65310185185 | 21.4 |
| 42584.67393518519 | 21.4 |
| 42584.694768518515 | 21.5 |
| 42584.71560185185 | 21.4 |
| 42584.73643518519 | 21.4 |
| 42584.757268518515 | 21.5 |
| 42584.77810185185 | 21.5 |
| 42584.79893518519 | 21.4 |
| 42584.819768518515 | 21.4 |
| 42584.84060185185 | 21.4 |
| 42584.86143518519 | 21.4 |
| 42584.882268518515 | 21.4 |
| 42584.90310185185 | 21.4 |
| 42584.92393518519 | 21.4 |
| 42584.944768518515 | 21.3 |
| 42584.96560185185 | 21.4 |
| 42584.98643518519 | 21.3 |
| 42585.007268518515 | 21.4 |
| 42585.02810185185 | 21.4 |
| 42585.04893518519 | 21.4 |
| 42585.069768518515 | 21.3 |
| 42585.09060185185 | 21.2 |
| 42585.11143518519 | 21.3 |
| 42585.132268518515 | 21.4 |
| 42585.15310185185 | 21.2 |
| 42585.17393518519 | 21.2 |
| 42585.194768518515 | 21.1 |
| 42585.21560185185 | 21.1 |
| 42585.23643518519 | 21.1 |
| 42585.257268518515 | 20.9 |
| 42585.27810185185 | 21 |
| 42585.29893518519 | 21.1 |
| 42585.319768518515 | 21.1 |
| 42585.34060185185 | 21 |
| 42585.36143518519 | 21.1 |
| 42585.382268518515 | 21.2 |
| 42585.40310185185 | 21.5 |
| 42585.42393518519 | 21.5 |
| 42585.444768518515 | 21.5 |
| 42585.46560185185 | 21.6 |
| 42585.48643518519 | 21.6 |
| 42585.507268518515 | 21.7 |
| 42585.52810185185 | 21.7 |
| 42585.54893518519 | 21.3 |
| 42585.569768518515 | 21.4 |
| 42585.59060185185 | 21.5 |
| 42585.61143518519 | 21.5 |
| 42585.632268518515 | 21.5 |
| 42585.65310185185 | 21.5 |
| 42585.67393518519 | 21.5 |
| 42585.694768518515 | 21.6 |
| 42585.71560185185 | 21.6 |
| 42585.73643518519 | 21.6 |
| 42585.757268518515 | 21.6 |
| 42585.77810185185 | 21.6 |
| 42585.79893518519 | 21.7 |
| 42585.819768518515 | 21.6 |
| 42585.84060185185 | 21.5 |
| 42585.86143518519 | 21.5 |
| 42585.882268518515 | 21.5 |
| 42585.90310185185 | 21.5 |
| 42585.92393518519 | 21.4 |
| 42585.944768518515 | 21.4 |
| 42585.96560185185 | 21.4 |
| 42585.98643518519 | 21.4 |
| 42586.007268518515 | 21.3 |
| 42586.02810185185 | 21.3 |
| 42586.04893518519 | 21.3 |
| 42586.069768518515 | 21.2 |
| 42586.09060185185 | 21.1 |
| 42586.11143518519 | 21.2 |
| 42586.132268518515 | 21.1 |
| 42586.15310185185 | 21.2 |
| 42586.17393518519 | 21.2 |
| 42586.194768518515 | 21.2 |
| 42586.21560185185 | 21.1 |
| 42586.23643518519 | 21.1 |
| 42586.257268518515 | 21.2 |
| 42586.27810185185 | 21.1 |
| 42586.29893518519 | 21.2 |
| 42586.319768518515 | 21.1 |
| 42586.34060185185 | 21.2 |
| 42586.36143518519 | 21.2 |
| 42586.382268518515 | 21.1 |
| 42586.40310185185 | 21.2 |
| 42586.42393518519 | 21.2 |
| 42586.444768518515 | 21.3 |
| 42586.46560185185 | 21.3 |
| 42586.48643518519 | 21.3 |
| 42586.507268518515 | 21.2 |
| 42586.52810185185 | 21.4 |
| 42586.54893518519 | 21.4 |
| 42586.569768518515 | 21.5 |
| 42586.59060185185 | 21.5 |
| 42586.61143518519 | 21.5 |
| 42586.632268518515 | 21.5 |
| 42586.65310185185 | 21.6 |
| 42586.67393518519 | 21.5 |
| 42586.694768518515 | 21.5 |
| 42586.71560185185 | 21.5 |
| 42586.73643518519 | 21.5 |
| 42586.757268518515 | 21.5 |
| 42586.77810185185 | 21.5 |
| 42586.79893518519 | 21.4 |
| 42586.819768518515 | 21.4 |
| 42586.84060185185 | 21.4 |
| 42586.86143518519 | 21.3 |
| 42586.882268518515 | 21.4 |
| 42586.90310185185 | 21.3 |
| 42586.92393518519 | 21.2 |
| 42586.944768518515 | 21.4 |
| 42586.96560185185 | 21.2 |
| 42586.98643518519 | 21.3 |
| 42587.007268518515 | 21.3 |
| 42587.02810185185 | 21.3 |
| 42587.04893518519 | 21.3 |
| 42587.069768518515 | 21.3 |
| 42587.09060185185 | 21.2 |
| 42587.11143518519 | 21.2 |
| 42587.132268518515 | 21.3 |
| 42587.15310185185 | 21.2 |
| 42587.17393518519 | 21.2 |
| 42587.194768518515 | 21.3 |
| 42587.21560185185 | 21.2 |
| 42587.23643518519 | 21.2 |
| 42587.257268518515 | 21.1 |
| 42587.27810185185 | 21.2 |
| 42587.29893518519 | 21.2 |
| 42587.319768518515 | 21.2 |
| 42587.34060185185 | 21.1 |
| 42587.36143518519 | 21.1 |
| 42587.382268518515 | 21.2 |
| 42587.40310185185 | 21.2 |
| 42587.42393518519 | 21.2 |
| 42587.444768518515 | 21.2 |
| 42587.46560185185 | 21.1 |
| 42587.48643518519 | 21.2 |
| 42587.507268518515 | 21.2 |
| 42587.52810185185 | 21.2 |
| 42587.54893518519 | 21.1 |
| 42587.569768518515 | 21.2 |
| 42587.59060185185 | 21.3 |
| 42587.61143518519 | 21.3 |
| 42587.632268518515 | 21.2 |
| 42587.65310185185 | 21.2 |
| 42587.67393518519 | 21.3 |
| 42587.694768518515 | 21.2 |
| 42587.71560185185 | 21.3 |
| 42587.73643518519 | 21.3 |
| 42587.757268518515 | 21.4 |
| 42587.77810185185 | 21.3 |
| 42587.79893518519 | 21.3 |
| 42587.819768518515 | 21.2 |
| 42587.84060185185 | 21.2 |
| 42587.86143518519 | 21.2 |
| 42587.882268518515 | 21.2 |
| 42587.90310185185 | 21.2 |
| 42587.92393518519 | 21.2 |
| 42587.944768518515 | 21.2 |
| 42587.96560185185 | 21.2 |
| 42587.98643518519 | 21.1 |
| 42588.007268518515 | 21.1 |
| 42588.02810185185 | 21.1 |
| 42588.04893518519 | 21.1 |
| 42588.069768518515 | 21 |
| 42588.09060185185 | 21.1 |
| 42588.11143518519 | 21.1 |
| 42588.132268518515 | 21 |
| 42588.15310185185 | 21 |
| 42588.17393518519 | 21 |
| 42588.194768518515 | 21 |
| 42588.21560185185 | 21 |
| 42588.23643518519 | 21 |
| 42588.257268518515 | 21 |
| 42588.27810185185 | 21 |
| 42588.29893518519 | 21 |
| 42588.319768518515 | 21 |
| 42588.34060185185 | 21 |
| 42588.36143518519 | 21.1 |
| 42588.382268518515 | 21 |
| 42588.40310185185 | 21.1 |
| 42588.42393518519 | 21.2 |
| 42588.444768518515 | 21.2 |
| 42588.46560185185 | 21.2 |
| 42588.48643518519 | 21.1 |
| 42588.507268518515 | 21.2 |
| 42588.52810185185 | 21.2 |
| 42588.54893518519 | 21.2 |
| 42588.569768518515 | 21.2 |
| 42588.59060185185 | 21.3 |
| 42588.61143518519 | 21.3 |
| 42588.632268518515 | 21.4 |
| 42588.65310185185 | 21.3 |
| 42588.67393518519 | 21.4 |
| 42588.694768518515 | 21.4 |
| 42588.71560185185 | 21.4 |
| 42588.73643518519 | 21.4 |
| 42588.757268518515 | 21.4 |
| 42588.77810185185 | 21.3 |
| 42588.79893518519 | 21.4 |
| 42588.819768518515 | 21.4 |
| 42588.84060185185 | 21.4 |
| 42588.86143518519 | 21.4 |
| 42588.882268518515 | 21.3 |
| 42588.90310185185 | 21.4 |
| 42588.92393518519 | 21.3 |
| 42588.944768518515 | 21.3 |
| 42588.96560185185 | 21.3 |
| 42588.98643518519 | 21.2 |
| 42589.007268518515 | 21.2 |
| 42589.02810185185 | 21.2 |
| 42589.04893518519 | 21.2 |
| 42589.069768518515 | 21.2 |
| 42589.09060185185 | 21.2 |
| 42589.11143518519 | 21.2 |
| 42589.132268518515 | 21.2 |
| 42589.15310185185 | 21.2 |
| 42589.17393518519 | 21.2 |
| 42589.194768518515 | 21.2 |
| 42589.21560185185 | 21.2 |
| 42589.23643518519 | 21.2 |
| 42589.257268518515 | 21.1 |
| 42589.27810185185 | 21.2 |
| 42589.29893518519 | 21.2 |
| 42589.319768518515 | 21.2 |
| 42589.34060185185 | 21.2 |
| 42589.36143518519 | 21.2 |
| 42589.382268518515 | 21.2 |
| 42589.40310185185 | 21.2 |
| 42589.42393518519 | 21.3 |
| 42589.444768518515 | 21.3 |
| 42589.46560185185 | 21.2 |
| 42589.48643518519 | 21.2 |
| 42589.507268518515 | 21.2 |
| 42589.52810185185 | 21.3 |
| 42589.54893518519 | 21.3 |
| 42589.569768518515 | 21.3 |
| 42589.59060185185 | 21.4 |
| 42589.61143518519 | 21.4 |
| 42589.632268518515 | 21.4 |
| 42589.65310185185 | 21.4 |
| 42589.67393518519 | 21.5 |
| 42589.694768518515 | 21.4 |
| 42589.71560185185 | 21.5 |
| 42589.73643518519 | 21.5 |
| 42589.757268518515 | 21.5 |
| 42589.77810185185 | 21.5 |
| 42589.79893518519 | 21.5 |
| 42589.819768518515 | 21.6 |
| 42589.84060185185 | 21.5 |
| 42589.86143518519 | 21.4 |
| 42589.882268518515 | 21.4 |
| 42589.90310185185 | 21.4 |
| 42589.92393518519 | 21.4 |
| 42589.944768518515 | 21.4 |
| 42589.96560185185 | 21.3 |
| 42589.98643518519 | 21.4 |
| 42590.007268518515 | 21.3 |
| 42590.02810185185 | 21.2 |
| 42590.04893518519 | 21.3 |
| 42590.069768518515 | 21.3 |
| 42590.09060185185 | 21.3 |
| 42590.11143518519 | 21.2 |
| 42590.132268518515 | 21.3 |
| 42590.15310185185 | 21.3 |
| 42590.17393518519 | 21.2 |
| 42590.194768518515 | 21.2 |
| 42590.21560185185 | 21.2 |
| 42590.23643518519 | 21.2 |
| 42590.257268518515 | 21.1 |
| 42590.27810185185 | 21.1 |
| 42590.29893518519 | 21.1 |
| 42590.319768518515 | 21.1 |
| 42590.34060185185 | 21.1 |
| 42590.36143518519 | 21.1 |
| 42590.382268518515 | 21.2 |
| 42590.40310185185 | 21.3 |
| 42590.42393518519 | 21.2 |
| 42590.444768518515 | 21.3 |
| 42590.46560185185 | 21.2 |
| 42590.48643518519 | 21.3 |
| 42590.507268518515 | 21.4 |
| 42590.52810185185 | 21.4 |
| 42590.54893518519 | 21.4 |
| 42590.569768518515 | 21.4 |
| 42590.59060185185 | 21.5 |
| 42590.61143518519 | 21.4 |
| 42590.632268518515 | 21.5 |
| 42590.65310185185 | 21.6 |
| 42590.67393518519 | 21.6 |
| 42590.694768518515 | 21.7 |
| 42590.71560185185 | 21.7 |
| 42590.73643518519 | 21.7 |
| 42590.757268518515 | 21.7 |
| 42590.77810185185 | 21.7 |
| 42590.79893518519 | 21.7 |
| 42590.819768518515 | 21.6 |
| 42590.84060185185 | 21.6 |
| 42590.86143518519 | 21.6 |
| 42590.882268518515 | 21.6 |
| 42590.90310185185 | 21.5 |
| 42590.92393518519 | 21.5 |
| 42590.944768518515 | 21.5 |
| 42590.96560185185 | 21.5 |
| 42590.98643518519 | 21.5 |
| 42591.007268518515 | 21.4 |
| 42591.02810185185 | 21.4 |
| 42591.04893518519 | 21.4 |
| 42591.069768518515 | 21.4 |
| 42591.09060185185 | 21.3 |
| 42591.11143518519 | 21.4 |
| 42591.132268518515 | 21.3 |
| 42591.15310185185 | 21.3 |
| 42591.17393518519 | 21.4 |
| 42591.194768518515 | 21.4 |
| 42591.21560185185 | 21.2 |
| 42591.23643518519 | 21.2 |
| 42591.257268518515 | 21.2 |
| 42591.27810185185 | 21.3 |
| 42591.29893518519 | 21.2 |
| 42591.319768518515 | 21.3 |
| 42591.34060185185 | 21.3 |
| 42591.36143518519 | 21.3 |
| 42591.382268518515 | 21.3 |
| 42591.40310185185 | 21.3 |
| 42591.42393518519 | 21.2 |
| 42591.444768518515 | 21.3 |
| 42591.46560185185 | 21.3 |
| 42591.48643518519 | 21.3 |
| 42591.507268518515 | 21.3 |
| 42591.52810185185 | 21.4 |
| 42591.54893518519 | 21.4 |
| 42591.569768518515 | 21.3 |
| 42591.59060185185 | 21.4 |
| 42591.61143518519 | 21.4 |
| 42591.632268518515 | 21.5 |
| 42591.65310185185 | 21.4 |
| 42591.67393518519 | 21.5 |
| 42591.694768518515 | 21.4 |
| 42591.71560185185 | 21.4 |
| 42591.73643518519 | 21.4 |
| 42591.757268518515 | 21.4 |
| 42591.77810185185 | 21.3 |
| 42591.79893518519 | 21.3 |
| 42591.819768518515 | 21.3 |
| 42591.84060185185 | 21.3 |
| 42591.86143518519 | 21.3 |
| 42591.882268518515 | 21.3 |
| 42591.90310185185 | 21.3 |
| 42591.92393518519 | 21.3 |
| 42591.944768518515 | 21.3 |
| 42591.96560185185 | 21.2 |
| 42591.98643518519 | 21.2 |
| 42592.007268518515 | 21.2 |
| 42592.02810185185 | 21.1 |
| 42592.04893518519 | 21.2 |
| 42592.069768518515 | 21.2 |
| 42592.09060185185 | 21.2 |
| 42592.11143518519 | 21.2 |
| 42592.132268518515 | 21.2 |
| 42592.15310185185 | 20.9 |
| 42592.17393518519 | 21.2 |
| 42592.194768518515 | 21.2 |
| 42592.21560185185 | 21.1 |
| 42592.23643518519 | 21 |
| 42592.257268518515 | 21 |
| 42592.27810185185 | 21 |
| 42592.29893518519 | 21 |
| 42592.319768518515 | 21.1 |
| 42592.34060185185 | 21 |
| 42592.36143518519 | 21.2 |
| 42592.382268518515 | 21.2 |
| 42592.40310185185 | 21.2 |
| 42592.42393518519 | 21.3 |
| 42592.444768518515 | 21.5 |
| 42592.46560185185 | 21.2 |
| 42592.48643518519 | 21.4 |
| 42592.507268518515 | 21.4 |
| 42592.52810185185 | 21.3 |
| 42592.54893518519 | 21.4 |
| 42592.569768518515 | 21.4 |
| 42592.59060185185 | 21.4 |
| 42592.61143518519 | 21.4 |
| 42592.632268518515 | 21.4 |
| 42592.65310185185 | 21.4 |
| 42592.67393518519 | 21.5 |
| 42592.694768518515 | 21.5 |
| 42592.71560185185 | 21.5 |
| 42592.73643518519 | 21.5 |
| 42592.757268518515 | 21.5 |
| 42592.77810185185 | 21.4 |
| 42592.79893518519 | 21.5 |
| 42592.819768518515 | 21.5 |
| 42592.84060185185 | 21.5 |
| 42592.86143518519 | 21.4 |
| 42592.882268518515 | 21.5 |
| 42592.90310185185 | 21.4 |
| 42592.92393518519 | 21.4 |
| 42592.944768518515 | 21.4 |
| 42592.96560185185 | 21.4 |
| 42592.98643518519 | 21.4 |
| 42593.007268518515 | 21.3 |
| 42593.02810185185 | 21.3 |
| 42593.04893518519 | 21.3 |
| 42593.069768518515 | 21.3 |
| 42593.09060185185 | 21.3 |
| 42593.11143518519 | 21.3 |
| 42593.132268518515 | 21.2 |
| 42593.15310185185 | 21.2 |
| 42593.17393518519 | 21.2 |
| 42593.194768518515 | 21.2 |
| 42593.21560185185 | 21.2 |
| 42593.23643518519 | 21.2 |
| 42593.257268518515 | 21.2 |
| 42593.27810185185 | 21.2 |
| 42593.29893518519 | 21.2 |
| 42593.319768518515 | 21.2 |
| 42593.34060185185 | 21.2 |
| 42593.36143518519 | 21.2 |
| 42593.382268518515 | 21.2 |
| 42593.40310185185 | 21.3 |
| 42593.42393518519 | 21.3 |
| 42593.444768518515 | 21.3 |
| 42593.46560185185 | 21.4 |
| 42593.48643518519 | 21.4 |
| 42593.507268518515 | 21.3 |
| 42593.52810185185 | 21.4 |
| 42593.54893518519 | 21.4 |
| 42593.569768518515 | 21.4 |
| 42593.59060185185 | 21.5 |
| 42593.61143518519 | 21.5 |
| 42593.632268518515 | 21.5 |
| 42593.65310185185 | 21.5 |
| 42593.67393518519 | 21.5 |
| 42593.694768518515 | 21.5 |
| 42593.71560185185 | 21.5 |
| 42593.73643518519 | 21.4 |
| 42593.757268518515 | 21.5 |
| 42593.77810185185 | 21.5 |
| 42593.79893518519 | 21.4 |
| 42593.819768518515 | 21.4 |
| 42593.84060185185 | 21.4 |
| 42593.86143518519 | 21.4 |
| 42593.882268518515 | 21.4 |
| 42593.90310185185 | 21.4 |
| 42593.92393518519 | 21.4 |
| 42593.944768518515 | 21.4 |
| 42593.96560185185 | 21.3 |
| 42593.98643518519 | 21.3 |
| 42594.007268518515 | 21.3 |
| 42594.02810185185 | 21.3 |
| 42594.04893518519 | 21.3 |
| 42594.069768518515 | 21.3 |
| 42594.09060185185 | 21.2 |
| 42594.11143518519 | 21.3 |
| 42594.132268518515 | 21.2 |
| 42594.15310185185 | 21.2 |
| 42594.17393518519 | 21.3 |
| 42594.194768518515 | 21.3 |
| 42594.21560185185 | 21.3 |
| 42594.23643518519 | 21.2 |
| 42594.257268518515 | 21.2 |
| 42594.27810185185 | 21.2 |
| 42594.29893518519 | 21.2 |
| 42594.319768518515 | 21.2 |
| 42594.34060185185 | 21.2 |
| 42594.36143518519 | 21.2 |
| 42594.382268518515 | 21.2 |
| 42594.40310185185 | 21.3 |
| 42594.42393518519 | 21.3 |
| 42594.444768518515 | 21.3 |
| 42594.46560185185 | 21.3 |
| 42594.48643518519 | 21.3 |
| 42594.507268518515 | 21.4 |
| 42594.52810185185 | 21.4 |
| 42594.54893518519 | 21.4 |
| 42594.569768518515 | 21.5 |
| 42594.59060185185 | 21.5 |
| 42594.61143518519 | 21.5 |
| 42594.632268518515 | 21.5 |
| 42594.65310185185 | 21.5 |
| 42594.67393518519 | 21.6 |
| 42594.694768518515 | 21.6 |
| 42594.71560185185 | 21.6 |
| 42594.73643518519 | 21.6 |
| 42594.757268518515 | 21.6 |
| 42594.77810185185 | 21.5 |
| 42594.79893518519 | 21.6 |
| 42594.819768518515 | 21.6 |
| 42594.84060185185 | 21.6 |
| 42594.86143518519 | 21.6 |
| 42594.882268518515 | 21.6 |
| 42594.90310185185 | 21.4 |
| 42594.92393518519 | 21.5 |
| 42594.944768518515 | 21.5 |
| 42594.96560185185 | 21.4 |
| 42594.98643518519 | 21.4 |
| 42595.007268518515 | 21.4 |
| 42595.02810185185 | 21.4 |
| 42595.04893518519 | 21.4 |
| 42595.069768518515 | 21.4 |
| 42595.09060185185 | 21.4 |
| 42595.11143518519 | 21.4 |
| 42595.132268518515 | 21.4 |
| 42595.15310185185 | 21.3 |
| 42595.17393518519 | 21.3 |
| 42595.194768518515 | 21.3 |
| 42595.21560185185 | 21.3 |
| 42595.23643518519 | 21.3 |
| 42595.257268518515 | 21.3 |
| 42595.27810185185 | 21.3 |
| 42595.29893518519 | 21.3 |
| 42595.319768518515 | 21.2 |
| 42595.34060185185 | 21.2 |
| 42595.36143518519 | 21.3 |
| 42595.382268518515 | 21.4 |
| 42595.40310185185 | 21.4 |
| 42595.42393518519 | 21.4 |
| 42595.444768518515 | 21.4 |
| 42595.46560185185 | 21.4 |
| 42595.48643518519 | 21.4 |
| 42595.507268518515 | 21.5 |
| 42595.52810185185 | 21.5 |
| 42595.54893518519 | 21.5 |
| 42595.569768518515 | 21.5 |
| 42595.59060185185 | 21.6 |
| 42595.61143518519 | 21.6 |
| 42595.632268518515 | 21.6 |
| 42595.65310185185 | 21.7 |
| 42595.67393518519 | 21.7 |
| 42595.694768518515 | 21.7 |
| 42595.71560185185 | 21.7 |
| 42595.73643518519 | 21.6 |
| 42595.757268518515 | 21.7 |
| 42595.77810185185 | 21.7 |
| 42595.79893518519 | 21.6 |
| 42595.819768518515 | 21.6 |
| 42595.84060185185 | 21.7 |
| 42595.86143518519 | 21.6 |
| 42595.882268518515 | 21.5 |
| 42595.90310185185 | 21.6 |
| 42595.92393518519 | 21.5 |
| 42595.944768518515 | 21.5 |
| 42595.96560185185 | 21.5 |
| 42595.98643518519 | 21.5 |
| 42596.007268518515 | 21.5 |
| 42596.02810185185 | 21.5 |
| 42596.04893518519 | 21.5 |
| 42596.069768518515 | 21.4 |
| 42596.09060185185 | 21.4 |
| 42596.11143518519 | 21.4 |
| 42596.132268518515 | 21.4 |
| 42596.15310185185 | 21.4 |
| 42596.17393518519 | 21.3 |
| 42596.194768518515 | 21.3 |
| 42596.21560185185 | 21.3 |
| 42596.23643518519 | 21.4 |
| 42596.257268518515 | 21.3 |
| 42596.27810185185 | 21.3 |
| 42596.29893518519 | 21.3 |
| 42596.319768518515 | 21.3 |
| 42596.34060185185 | 21.3 |
| 42596.36143518519 | 21.3 |
| 42596.382268518515 | 21.3 |
| 42596.40310185185 | 21.4 |
| 42596.42393518519 | 21.4 |
| 42596.444768518515 | 21.4 |
| 42596.46560185185 | 21.4 |
| 42596.48643518519 | 21.4 |
| 42596.507268518515 | 21.4 |
| 42596.52810185185 | 21.5 |
| 42596.54893518519 | 21.6 |
| 42596.569768518515 | 21.6 |
| 42596.59060185185 | 21.6 |
| 42596.61143518519 | 21.6 |
| 42596.632268518515 | 21.7 |
| 42596.65310185185 | 21.7 |
| 42596.67393518519 | 21.7 |
| 42596.694768518515 | 21.7 |
| 42596.71560185185 | 21.7 |
| 42596.73643518519 | 21.7 |
| 42596.757268518515 | 21.7 |
| 42596.77810185185 | 21.7 |
| 42596.79893518519 | 21.7 |
| 42596.819768518515 | 21.6 |
| 42596.84060185185 | 21.7 |
| 42596.86143518519 | 21.6 |
| 42596.882268518515 | 21.5 |
| 42596.90310185185 | 21.5 |
| 42596.92393518519 | 21.5 |
| 42596.944768518515 | 21.5 |
| 42596.96560185185 | 21.5 |
| 42596.98643518519 | 21.5 |
| 42597.007268518515 | 21.4 |
| 42597.02810185185 | 21.4 |
| 42597.04893518519 | 21.4 |
| 42597.069768518515 | 21.4 |
| 42597.09060185185 | 21.3 |
| 42597.11143518519 | 21.3 |
| 42597.132268518515 | 21.3 |
| 42597.15310185185 | 21.3 |
| 42597.17393518519 | 21.3 |
| 42597.194768518515 | 21.2 |
| 42597.21560185185 | 21.2 |
| 42597.23643518519 | 21.2 |
| 42597.257268518515 | 21.2 |
| 42597.27810185185 | 21.2 |
| 42597.29893518519 | 21.2 |
| 42597.319768518515 | 21.2 |
| 42597.34060185185 | 21.2 |
| 42597.36143518519 | 21.2 |
| 42597.382268518515 | 21.3 |
| 42597.40310185185 | 21.3 |
| 42597.42393518519 | 21.4 |
| 42597.444768518515 | 21.3 |
| 42597.46560185185 | 21.4 |
| 42597.48643518519 | 21.3 |
| 42597.507268518515 | 21.4 |
| 42597.52810185185 | 21.4 |
| 42597.54893518519 | 21.5 |
| 42597.569768518515 | 21.4 |
| 42597.59060185185 | 21.6 |
| 42597.61143518519 | 21.5 |
| 42597.632268518515 | 21.5 |
| 42597.65310185185 | 21.6 |
| 42597.67393518519 | 21.6 |
| 42597.694768518515 | 21.6 |
| 42597.71560185185 | 21.5 |
| 42597.73643518519 | 21.7 |
| 42597.757268518515 | 21.6 |
| 42597.77810185185 | 21.7 |
| 42597.79893518519 | 21.7 |
| 42597.819768518515 | 21.6 |
| 42597.84060185185 | 21.7 |
| 42597.86143518519 | 21.6 |
| 42597.882268518515 | 21.6 |
| 42597.90310185185 | 21.5 |
| 42597.92393518519 | 21.5 |
| 42597.944768518515 | 21.5 |
| 42597.96560185185 | 21.5 |
| 42597.98643518519 | 21.5 |
| 42598.007268518515 | 21.5 |
| 42598.02810185185 | 21.5 |
| 42598.04893518519 | 21.5 |
| 42598.069768518515 | 21.4 |
| 42598.09060185185 | 21.3 |
| 42598.11143518519 | 21.4 |
| 42598.132268518515 | 21.4 |
| 42598.15310185185 | 21.3 |
| 42598.17393518519 | 21.4 |
| 42598.194768518515 | 21.3 |
| 42598.21560185185 | 21.3 |
| 42598.23643518519 | 21.3 |
| 42598.257268518515 | 21.4 |
| 42598.27810185185 | 21.2 |
| 42598.29893518519 | 21.3 |
| 42598.319768518515 | 21.3 |
| 42598.34060185185 | 21.3 |
| 42598.36143518519 | 21.3 |
| 42598.382268518515 | 21.3 |
| 42598.40310185185 | 21.3 |
| 42598.42393518519 | 21.2 |
| 42598.444768518515 | 21.4 |
| 42598.46560185185 | 21.4 |
| 42598.48643518519 | 21.5 |
| 42598.507268518515 | 21.5 |
| 42598.52810185185 | 21.5 |
| 42598.54893518519 | 21.5 |
| 42598.569768518515 | 21.5 |
| 42598.59060185185 | 21.5 |
| 42598.61143518519 | 21.6 |
| 42598.632268518515 | 21.7 |
| 42598.65310185185 | 21.7 |
| 42598.67393518519 | 21.7 |
| 42598.694768518515 | 21.6 |
| 42598.71560185185 | 21.7 |
| 42598.73643518519 | 21.5 |
| 42598.757268518515 | 21.6 |
| 42598.77810185185 | 21.5 |
| 42598.79893518519 | 21.6 |
| 42598.819768518515 | 21.6 |
| 42598.84060185185 | 21.6 |
| 42598.86143518519 | 21.6 |
| 42598.882268518515 | 21.6 |
| 42598.90310185185 | 21.5 |
| 42598.92393518519 | 21.5 |
| 42598.944768518515 | 21.5 |
| 42598.96560185185 | 21.5 |
| 42598.98643518519 | 21.4 |
| 42599.007268518515 | 21.4 |
| 42599.02810185185 | 21.4 |
| 42599.04893518519 | 21.4 |
| 42599.069768518515 | 21.4 |
| 42599.09060185185 | 21.4 |
| 42599.11143518519 | 21.4 |
| 42599.132268518515 | 21.3 |
| 42599.15310185185 | 21.3 |
| 42599.17393518519 | 21.3 |
| 42599.194768518515 | 21.3 |
| 42599.21560185185 | 21.3 |
| 42599.23643518519 | 21.3 |
| 42599.257268518515 | 21.3 |
| 42599.27810185185 | 21.2 |
| 42599.29893518519 | 21.3 |
| 42599.319768518515 | 21.2 |
| 42599.34060185185 | 21.3 |
| 42599.36143518519 | 21.2 |
| 42599.382268518515 | 21.3 |
| 42599.40310185185 | 21.3 |
| 42599.42393518519 | 21.3 |
| 42599.444768518515 | 21.3 |
| 42599.46560185185 | 21.3 |
| 42599.48643518519 | 21.4 |
| 42599.507268518515 | 21.4 |
| 42599.52810185185 | 21.4 |
| 42599.54893518519 | 21.4 |
| 42599.569768518515 | 21.5 |
| 42599.59060185185 | 21.6 |
| 42599.61143518519 | 21.5 |
| 42599.632268518515 | 21.5 |
| 42599.65310185185 | 21.7 |
| 42599.67393518519 | 21.8 |
| 42599.694768518515 | 21.8 |
| 42599.71560185185 | 21.8 |
| 42599.73643518519 | 21.8 |
| 42599.757268518515 | 21.7 |
| 42599.77810185185 | 21.7 |
| 42599.79893518519 | 21.7 |
| 42599.819768518515 | 21.7 |
| 42599.84060185185 | 21.7 |
| 42599.86143518519 | 21.4 |
| 42599.882268518515 | 21.4 |
| 42599.90310185185 | 21.4 |
| 42599.92393518519 | 21.4 |
| 42599.944768518515 | 21.4 |
| 42599.96560185185 | 21.3 |
| 42599.98643518519 | 21.4 |
| 42600.007268518515 | 21.4 |
| 42600.02810185185 | 21.3 |
| 42600.04893518519 | 21.4 |
| 42600.069768518515 | 21.3 |
| 42600.09060185185 | 21.3 |
| 42600.11143518519 | 21.3 |
| 42600.132268518515 | 21.3 |
| 42600.15310185185 | 21.2 |
| 42600.17393518519 | 21.2 |
| 42600.194768518515 | 21.2 |
| 42600.21560185185 | 21.2 |
| 42600.23643518519 | 21.2 |
| 42600.257268518515 | 21.2 |
| 42600.27810185185 | 21.2 |
| 42600.29893518519 | 21.2 |
| 42600.319768518515 | 21.2 |
| 42600.34060185185 | 21.2 |
| 42600.36143518519 | 21.2 |
| 42600.382268518515 | 21.3 |
| 42600.40310185185 | 21.3 |
| 42600.42393518519 | 21.4 |
| 42600.444768518515 | 21.4 |
| 42600.46560185185 | 21.4 |
| 42600.48643518519 | 21.3 |
| 42600.507268518515 | 21.3 |
| 42600.52810185185 | 21.3 |
| 42600.54893518519 | 21.3 |
| 42600.569768518515 | 21.3 |
| 42600.59060185185 | 21.4 |
| 42600.61143518519 | 21.4 |
| 42600.632268518515 | 21.4 |
| 42600.65310185185 | 21.4 |
| 42600.67393518519 | 21.5 |
| 42600.694768518515 | 21.5 |
| 42600.71560185185 | 21.4 |
| 42600.73643518519 | 21.4 |
| 42600.757268518515 | 21.4 |
| 42600.77810185185 | 21.4 |
| 42600.79893518519 | 21.5 |
| 42600.819768518515 | 21.4 |
| 42600.84060185185 | 21.5 |
| 42600.86143518519 | 21.3 |
| 42600.882268518515 | 21.5 |
| 42600.90310185185 | 21.4 |
| 42600.92393518519 | 21.4 |
| 42600.944768518515 | 21.3 |
| 42600.96560185185 | 21.4 |
| 42600.98643518519 | 21.4 |
| 42601.007268518515 | 21.3 |
| 42601.02810185185 | 21.4 |
| 42601.04893518519 | 21.3 |
| 42601.069768518515 | 21.4 |
| 42601.09060185185 | 21.4 |
| 42601.11143518519 | 21.3 |
| 42601.132268518515 | 21.4 |
| 42601.15310185185 | 21.3 |
| 42601.17393518519 | 21.2 |
| 42601.194768518515 | 21.3 |
| 42601.21560185185 | 21.3 |
| 42601.23643518519 | 21.3 |
| 42601.257268518515 | 21.3 |
| 42601.27810185185 | 21.2 |
| 42601.29893518519 | 21.2 |
| 42601.319768518515 | 21.1 |
| 42601.34060185185 | 21.2 |
| 42601.36143518519 | 21.2 |
| 42601.382268518515 | 21.2 |
| 42601.40310185185 | 21.3 |
| 42601.42393518519 | 21.3 |
| 42601.444768518515 | 21.3 |
| 42601.46560185185 | 21.2 |
| 42601.48643518519 | 21.3 |
| 42601.507268518515 | 21.4 |
| 42601.52810185185 | 21.4 |
| 42601.54893518519 | 21.3 |
| 42601.569768518515 | 21.4 |
| 42601.59060185185 | 21.5 |
| 42601.61143518519 | 21.5 |
| 42601.632268518515 | 21.5 |
| 42601.65310185185 | 21.6 |
| 42601.67393518519 | 21.6 |
| 42601.694768518515 | 21.6 |
| 42601.71560185185 | 21.6 |
| 42601.73643518519 | 21.6 |
| 42601.757268518515 | 21.6 |
| 42601.77810185185 | 21.6 |
| 42601.79893518519 | 21.5 |
| 42601.819768518515 | 21.5 |
| 42601.84060185185 | 21.5 |
| 42601.86143518519 | 21.5 |
| 42601.882268518515 | 21.5 |
| 42601.90310185185 | 21.4 |
| 42601.92393518519 | 21.4 |
| 42601.944768518515 | 21.4 |
| 42601.96560185185 | 21.4 |
| 42601.98643518519 | 21.4 |
| 42602.007268518515 | 21.4 |
| 42602.02810185185 | 21.4 |
| 42602.04893518519 | 21.4 |
| 42602.069768518515 | 21.4 |
| 42602.09060185185 | 21.4 |
| 42602.11143518519 | 21.4 |
| 42602.132268518515 | 21.3 |
| 42602.15310185185 | 21.4 |
| 42602.17393518519 | 21.3 |
| 42602.194768518515 | 21.3 |
| 42602.21560185185 | 21.3 |
| 42602.23643518519 | 21.2 |
| 42602.257268518515 | 21.3 |
| 42602.27810185185 | 21.2 |
| 42602.29893518519 | 21.3 |
| 42602.319768518515 | 21.2 |
| 42602.34060185185 | 21.3 |
| 42602.36143518519 | 21.3 |
| 42602.382268518515 | 21.3 |
| 42602.40310185185 | 21.2 |
| 42602.42393518519 | 21.3 |
| 42602.444768518515 | 21.2 |
| 42602.46560185185 | 21.3 |
| 42602.48643518519 | 21.3 |
| 42602.507268518515 | 21.3 |
| 42602.52810185185 | 21.2 |
| 42602.54893518519 | 21.3 |
| 42602.569768518515 | 21.3 |
| 42602.59060185185 | 21.2 |
| 42602.61143518519 | 21.3 |
| 42602.632268518515 | 21.4 |
| 42602.65310185185 | 21.3 |
| 42602.67393518519 | 21.2 |
| 42602.694768518515 | 21.3 |
| 42602.71560185185 | 21.4 |
| 42602.73643518519 | 21.3 |
| 42602.757268518515 | 21.3 |
| 42602.77810185185 | 21.3 |
| 42602.79893518519 | 21.3 |
| 42602.819768518515 | 21.3 |
| 42602.84060185185 | 21.2 |
| 42602.86143518519 | 21.2 |
| 42602.882268518515 | 21.3 |
| 42602.90310185185 | 21.2 |
| 42602.92393518519 | 21.2 |
| 42602.944768518515 | 21.2 |
| 42602.96560185185 | 21.2 |
| 42602.98643518519 | 21.2 |
| 42603.007268518515 | 21.1 |
| 42603.02810185185 | 21.2 |
| 42603.04893518519 | 21.1 |
| 42603.069768518515 | 21.1 |
| 42603.09060185185 | 21.1 |
| 42603.11143518519 | 21.1 |
| 42603.132268518515 | 21.1 |
| 42603.15310185185 | 21.1 |
| 42603.17393518519 | 21.1 |
| 42603.194768518515 | 21.1 |
| 42603.21560185185 | 21.1 |
| 42603.23643518519 | 21.1 |
| 42603.257268518515 | 21.1 |
| 42603.27810185185 | 21.1 |
| 42603.29893518519 | 21.1 |
| 42603.319768518515 | 22.9 |
| 42603.34060185185 | 23.4 |
| 42603.36143518519 | 23.6 |
| 42603.382268518515 | 21.3 |
| 42603.40310185185 | 21.2 |
| 42603.42393518519 | 21.1 |
| 42603.444768518515 | 21.2 |
| 42603.46560185185 | 21.2 |
| 42603.48643518519 | 21.2 |
| 42603.507268518515 | 21.2 |
| 42603.52810185185 | 21.2 |
| 42603.54893518519 | 21.2 |
| 42603.569768518515 | 21.2 |
| 42603.59060185185 | 21.2 |
| 42603.61143518519 | 21.2 |
| 42603.632268518515 | 21.2 |
| 42603.65310185185 | 21.3 |
| 42603.67393518519 | 21.3 |
| 42603.694768518515 | 21.3 |
| 42603.71560185185 | 21.3 |
| 42603.73643518519 | 21.3 |
| 42603.757268518515 | 21.4 |
| 42603.77810185185 | 21.3 |
| 42603.79893518519 | 21.3 |
| 42603.819768518515 | 21.3 |
| 42603.84060185185 | 21.3 |
| 42603.86143518519 | 21.2 |
| 42603.882268518515 | 21.2 |
| 42603.90310185185 | 21.2 |
| 42603.92393518519 | 21.1 |
| 42603.944768518515 | 21.2 |
| 42603.96560185185 | 21.2 |
| 42603.98643518519 | 21.2 |
| 42604.007268518515 | 21.2 |
| 42604.02810185185 | 21.1 |
| 42604.04893518519 | 21.1 |
| 42604.069768518515 | 21.1 |
| 42604.09060185185 | 21 |
| 42604.11143518519 | 21 |
| 42604.132268518515 | 21 |
| 42604.15310185185 | 21 |
| 42604.17393518519 | 21 |
| 42604.194768518515 | 21 |
| 42604.21560185185 | 21 |
| 42604.23643518519 | 21 |
| 42604.257268518515 | 21 |
| 42604.27810185185 | 21 |
| 42604.29893518519 | 21.1 |
| 42604.319768518515 | 21.1 |
| 42604.34060185185 | 21.1 |
| 42604.36143518519 | 21.2 |
| 42604.382268518515 | 21.1 |
| 42604.40310185185 | 21.1 |
| 42604.42393518519 | 21.2 |
| 42604.444768518515 | 21.2 |
| 42604.46560185185 | 21.2 |
| 42604.48643518519 | 21.2 |
| 42604.507268518515 | 21.3 |
| 42604.52810185185 | 21.2 |
| 42604.54893518519 | 21.3 |
| 42604.569768518515 | 21.3 |
| 42604.59060185185 | 21.4 |
| 42604.61143518519 | 21.3 |
| 42604.632268518515 | 21.4 |
| 42604.65310185185 | 21.4 |
| 42604.67393518519 | 21.5 |
| 42604.694768518515 | 21.5 |
| 42604.71560185185 | 21.4 |
| 42604.73643518519 | 21.5 |
| 42604.757268518515 | 21.5 |
| 42604.77810185185 | 21.5 |
| 42604.79893518519 | 21.5 |
| 42604.819768518515 | 21.5 |
| 42604.84060185185 | 21.4 |
| 42604.86143518519 | 21.4 |
| 42604.882268518515 | 21.3 |
| 42604.90310185185 | 21.4 |
| 42604.92393518519 | 21.4 |
| 42604.944768518515 | 21.4 |
| 42604.96560185185 | 21.3 |
| 42604.98643518519 | 21.4 |
| 42605.007268518515 | 21.4 |
| 42605.02810185185 | 21.3 |
| 42605.04893518519 | 21.3 |
| 42605.069768518515 | 21.4 |
| 42605.09060185185 | 21.3 |
| 42605.11143518519 | 21.2 |
| 42605.132268518515 | 21.3 |
| 42605.15310185185 | 21.3 |
| 42605.17393518519 | 21.2 |
| 42605.194768518515 | 21.2 |
| 42605.21560185185 | 21.2 |
| 42605.23643518519 | 21.2 |
| 42605.257268518515 | 21.2 |
| 42605.27810185185 | 21.2 |
| 42605.29893518519 | 21.2 |
| 42605.319768518515 | 21.2 |
| 42605.34060185185 | 21.2 |
| 42605.36143518519 | 21.2 |
| 42605.382268518515 | 21.2 |
| 42605.40310185185 | 21.2 |
| 42605.42393518519 | 21.3 |
| 42605.444768518515 | 21.3 |
| 42605.46560185185 | 21.3 |
| 42605.48643518519 | 21.3 |
| 42605.507268518515 | 21.4 |
| 42605.52810185185 | 21.5 |
| 42605.54893518519 | 21.4 |
| 42605.569768518515 | 21.5 |
| 42605.59060185185 | 21.5 |
| 42605.61143518519 | 21.5 |
| 42605.632268518515 | 21.5 |
| 42605.65310185185 | 21.5 |
| 42605.67393518519 | 21.6 |
| 42605.694768518515 | 21.6 |
| 42605.71560185185 | 21.6 |
| 42605.73643518519 | 21.5 |
| 42605.757268518515 | 21.5 |
| 42605.77810185185 | 21.6 |
| 42605.79893518519 | 21.6 |
| 42605.819768518515 | 21.6 |
| 42605.84060185185 | 21.5 |
| 42605.86143518519 | 21.5 |
| 42605.882268518515 | 21.5 |
| 42605.90310185185 | 21.5 |
| 42605.92393518519 | 21.5 |
| 42605.944768518515 | 21.4 |
| 42605.96560185185 | 21.5 |
| 42605.98643518519 | 21.4 |
| 42606.007268518515 | 21.4 |
| 42606.02810185185 | 21.4 |
| 42606.04893518519 | 21.4 |
| 42606.069768518515 | 21.4 |
| 42606.09060185185 | 21.3 |
| 42606.11143518519 | 21.4 |
| 42606.132268518515 | 21.4 |
| 42606.15310185185 | 21.2 |
| 42606.17393518519 | 21.2 |
| 42606.194768518515 | 21.3 |
| 42606.21560185185 | 21.2 |
| 42606.23643518519 | 21.1 |
| 42606.257268518515 | 21.2 |
| 42606.27810185185 | 21.1 |
| 42606.29893518519 | 21.1 |
| 42606.319768518515 | 21.1 |
| 42606.34060185185 | 21.1 |
| 42606.36143518519 | 21.4 |
| 42606.382268518515 | 21.4 |
| 42606.40310185185 | 21.4 |
| 42606.42393518519 | 21.4 |
| 42606.444768518515 | 21.5 |
| 42606.46560185185 | 21.4 |
| 42606.48643518519 | 21.5 |
| 42606.507268518515 | 21.5 |
| 42606.52810185185 | 21.5 |
| 42606.54893518519 | 21.5 |
| 42606.569768518515 | 21.5 |
| 42606.59060185185 | 21.6 |
| 42606.61143518519 | 21.7 |
| 42606.632268518515 | 21.6 |
| 42606.65310185185 | 21.7 |
| 42606.67393518519 | 21.7 |
| 42606.694768518515 | 21.7 |
| 42606.71560185185 | 21.7 |
| 42606.73643518519 | 21.7 |
| 42606.757268518515 | 21.7 |
| 42606.77810185185 | 21.6 |
| 42606.79893518519 | 21.8 |
| 42606.819768518515 | 21.7 |
| 42606.84060185185 | 21.7 |
| 42606.86143518519 | 21.7 |
| 42606.882268518515 | 21.7 |
| 42606.90310185185 | 21.6 |
| 42606.92393518519 | 21.6 |
| 42606.944768518515 | 21.6 |
| 42606.96560185185 | 21.6 |
| 42606.98643518519 | 21.5 |
| 42607.007268518515 | 21.4 |
| 42607.02810185185 | 21.5 |
| 42607.04893518519 | 21.5 |
| 42607.069768518515 | 21.5 |
| 42607.09060185185 | 21.4 |
| 42607.11143518519 | 21.5 |
| 42607.132268518515 | 21.4 |
| 42607.15310185185 | 21.4 |
| 42607.17393518519 | 21.3 |
| 42607.194768518515 | 21.3 |
| 42607.21560185185 | 21.3 |
| 42607.23643518519 | 21.4 |
| 42607.257268518515 | 21.3 |
| 42607.27810185185 | 21.2 |
| 42607.29893518519 | 21.4 |
| 42607.319768518515 | 21.3 |
| 42607.34060185185 | 21.3 |
| 42607.36143518519 | 21.3 |
| 42607.382268518515 | 21.3 |
| 42607.40310185185 | 21.4 |
| 42607.42393518519 | 21.4 |
| 42607.444768518515 | 21.5 |
| 42607.46560185185 | 21.5 |
| 42607.48643518519 | 21.6 |
| 42607.507268518515 | 21.6 |
| 42607.52810185185 | 21.5 |
| 42607.54893518519 | 21.6 |
| 42607.569768518515 | 21.6 |
| 42607.59060185185 | 21.7 |
| 42607.61143518519 | 21.6 |
| 42607.632268518515 | 21.7 |
| 42607.65310185185 | 21.8 |
| 42607.67393518519 | 21.8 |
| 42607.694768518515 | 21.9 |
| 42607.71560185185 | 21.9 |
| 42607.73643518519 | 21.9 |
| 42607.757268518515 | 21.8 |
| 42607.77810185185 | 21.8 |
| 42607.79893518519 | 21.8 |
| 42607.819768518515 | 21.8 |
| 42607.84060185185 | 21.7 |
| 42607.86143518519 | 21.7 |
| 42607.882268518515 | 21.7 |
| 42607.90310185185 | 21.5 |
| 42607.92393518519 | 21.7 |
| 42607.944768518515 | 21.6 |
| 42607.96560185185 | 21.6 |
| 42607.98643518519 | 21.5 |
| 42608.007268518515 | 21.5 |
| 42608.02810185185 | 21.4 |
| 42608.04893518519 | 21.5 |
| 42608.069768518515 | 21.5 |
| 42608.09060185185 | 21.4 |
| 42608.11143518519 | 21.4 |
| 42608.132268518515 | 21.4 |
| 42608.15310185185 | 21.3 |
| 42608.17393518519 | 21.2 |
| 42608.194768518515 | 21.4 |
| 42608.21560185185 | 21.3 |
| 42608.23643518519 | 21.3 |
| 42608.257268518515 | 21.3 |
| 42608.27810185185 | 21.3 |
| 42608.29893518519 | 21.3 |
| 42608.319768518515 | 21.2 |
| 42608.34060185185 | 21.2 |
| 42608.36143518519 | 21.3 |
| 42608.382268518515 | 21.2 |
| 42608.40310185185 | 21.4 |
| 42608.42393518519 | 21.4 |
| 42608.444768518515 | 21.5 |
| 42608.46560185185 | 21.3 |
| 42608.48643518519 | 21.4 |
| 42608.507268518515 | 21.5 |
| 42608.52810185185 | 21.5 |
| 42608.54893518519 | 21.6 |
| 42608.569768518515 | 21.6 |
| 42608.59060185185 | 21.6 |
| 42608.61143518519 | 21.6 |
| 42608.632268518515 | 21.7 |
| 42608.65310185185 | 21.8 |
| 42608.67393518519 | 21.7 |
| 42608.694768518515 | 21.7 |
| 42608.71560185185 | 21.8 |
| 42608.73643518519 | 21.8 |
| 42608.757268518515 | 21.9 |
| 42608.77810185185 | 21.9 |
| 42608.79893518519 | 21.8 |
| 42608.819768518515 | 21.8 |
| 42608.84060185185 | 21.8 |
| 42608.86143518519 | 21.8 |
| 42608.882268518515 | 21.7 |
| 42608.90310185185 | 21.7 |
| 42608.92393518519 | 21.7 |
| 42608.944768518515 | 21.7 |
| 42608.96560185185 | 21.6 |
| 42608.98643518519 | 21.6 |
| 42609.007268518515 | 21.6 |
| 42609.02810185185 | 21.5 |
| 42609.04893518519 | 21.5 |
| 42609.069768518515 | 21.5 |
| 42609.09060185185 | 21.4 |
| 42609.11143518519 | 21.4 |
| 42609.132268518515 | 21.4 |
| 42609.15310185185 | 21.4 |
| 42609.17393518519 | 21.5 |
| 42609.194768518515 | 21.3 |
| 42609.21560185185 | 21.4 |
| 42609.23643518519 | 21.3 |
| 42609.257268518515 | 21.4 |
| 42609.27810185185 | 21.2 |
| 42609.29893518519 | 21.4 |
| 42609.319768518515 | 21.2 |
| 42609.34060185185 | 21.4 |
| 42609.36143518519 | 21.3 |
| 42609.382268518515 | 21.4 |
| 42609.40310185185 | 21.4 |
| 42609.42393518519 | 21.5 |
| 42609.444768518515 | 21.5 |
| 42609.46560185185 | 21.5 |
| 42609.48643518519 | 21.5 |
| 42609.507268518515 | 21.4 |
| 42609.52810185185 | 21.5 |
| 42609.54893518519 | 21.6 |
| 42609.569768518515 | 21.6 |
| 42609.59060185185 | 21.6 |
| 42609.61143518519 | 21.7 |
| 42609.632268518515 | 21.7 |
| 42609.65310185185 | 21.7 |
| 42609.67393518519 | 21.7 |
| 42609.694768518515 | 21.8 |
| 42609.71560185185 | 21.8 |
| 42609.73643518519 | 21.8 |
| 42609.757268518515 | 21.8 |
| 42609.77810185185 | 21.8 |
| 42609.79893518519 | 21.8 |
| 42609.819768518515 | 21.8 |
| 42609.84060185185 | 21.8 |
| 42609.86143518519 | 21.7 |
| 42609.882268518515 | 21.7 |
| 42609.90310185185 | 21.7 |
| 42609.92393518519 | 21.7 |
| 42609.944768518515 | 21.7 |
| 42609.96560185185 | 21.7 |
| 42609.98643518519 | 21.6 |
| 42610.007268518515 | 21.6 |
| 42610.02810185185 | 21.6 |
| 42610.04893518519 | 21.6 |
| 42610.069768518515 | 21.5 |
| 42610.09060185185 | 21.6 |
| 42610.11143518519 | 21.5 |
| 42610.132268518515 | 21.5 |
| 42610.15310185185 | 21.5 |
| 42610.17393518519 | 21.4 |
| 42610.194768518515 | 21.4 |
| 42610.21560185185 | 21.5 |
| 42610.23643518519 | 21.4 |
| 42610.257268518515 | 21.4 |
| 42610.27810185185 | 21.4 |
| 42610.29893518519 | 21.4 |
| 42610.319768518515 | 21.4 |
| 42610.34060185185 | 21.4 |
| 42610.36143518519 | 21.4 |
| 42610.382268518515 | 21.4 |
| 42610.40310185185 | 21.4 |
| 42610.42393518519 | 21.4 |
| 42610.444768518515 | 21.5 |
| 42610.46560185185 | 21.5 |
| 42610.48643518519 | 21.5 |
| 42610.507268518515 | 21.6 |
| 42610.52810185185 | 21.6 |
| 42610.54893518519 | 21.6 |
| 42610.569768518515 | 21.6 |
| 42610.59060185185 | 21.6 |
| 42610.61143518519 | 21.7 |
| 42610.632268518515 | 21.7 |
| 42610.65310185185 | 21.8 |
| 42610.67393518519 | 21.7 |
| 42610.694768518515 | 21.8 |
| 42610.71560185185 | 21.7 |
| 42610.73643518519 | 21.7 |
| 42610.757268518515 | 21.7 |
| 42610.77810185185 | 21.7 |
| 42610.79893518519 | 21.7 |
| 42610.819768518515 | 21.7 |
| 42610.84060185185 | 21.7 |
| 42610.86143518519 | 21.7 |
| 42610.882268518515 | 21.7 |
| 42610.90310185185 | 21.7 |
| 42610.92393518519 | 21.7 |
| 42610.944768518515 | 21.5 |
| 42610.96560185185 | 21.7 |
| 42610.98643518519 | 21.5 |
| 42611.007268518515 | 21.5 |
| 42611.02810185185 | 21.5 |
| 42611.04893518519 | 21.4 |
| 42611.069768518515 | 21.5 |
| 42611.09060185185 | 21.5 |
| 42611.11143518519 | 21.5 |
| 42611.132268518515 | 21.4 |
| 42611.15310185185 | 21.5 |
| 42611.17393518519 | 21.5 |
| 42611.194768518515 | 21.5 |
| 42611.21560185185 | 21.4 |
| 42611.23643518519 | 21.5 |
| 42611.257268518515 | 21.4 |
| 42611.27810185185 | 21.4 |
| 42611.29893518519 | 21.5 |
| 42611.319768518515 | 21.4 |
| 42611.34060185185 | 21.4 |
| 42611.36143518519 | 21.4 |
| 42611.382268518515 | 21.4 |
| 42611.40310185185 | 21.4 |
| 42611.42393518519 | 21.5 |
| 42611.444768518515 | 21.5 |
| 42611.46560185185 | 21.5 |
| 42611.48643518519 | 21.5 |
| 42611.507268518515 | 21.5 |
| 42611.52810185185 | 21.5 |
| 42611.54893518519 | 21.5 |
| 42611.569768518515 | 21.5 |
| 42611.59060185185 | 21.5 |
| 42611.61143518519 | 21.6 |
| 42611.632268518515 | 21.6 |
| 42611.65310185185 | 21.6 |
| 42611.67393518519 | 21.6 |
| 42611.694768518515 | 21.4 |
| 42611.71560185185 | 21.6 |
| 42611.73643518519 | 21.6 |
| 42611.757268518515 | 21.6 |
| 42611.77810185185 | 21.6 |
| 42611.79893518519 | 21.6 |
| 42611.819768518515 | 21.6 |
| 42611.84060185185 | 21.5 |
| 42611.86143518519 | 21.4 |
| 42611.882268518515 | 21.4 |
| 42611.90310185185 | 21.4 |
| 42611.92393518519 | 21.3 |
| 42611.944768518515 | 21.4 |
| 42611.96560185185 | 21.4 |
| 42611.98643518519 | 21.4 |
| 42612.007268518515 | 21.4 |
| 42612.02810185185 | 21.3 |
| 42612.04893518519 | 21.4 |
| 42612.069768518515 | 21.4 |
| 42612.09060185185 | 21.4 |
| 42612.11143518519 | 21.4 |
| 42612.132268518515 | 21.4 |
| 42612.15310185185 | 21.3 |
| 42612.17393518519 | 21.3 |
| 42612.194768518515 | 21.3 |
| 42612.21560185185 | 21.3 |
| 42612.23643518519 | 21.4 |
| 42612.257268518515 | 21.4 |
| 42612.27810185185 | 21.3 |
| 42612.29893518519 | 21.2 |
| 42612.319768518515 | 21.3 |
| 42612.34060185185 | 21.3 |
| 42612.36143518519 | 21.3 |
| 42612.382268518515 | 21.4 |
| 42612.40310185185 | 21.4 |
| 42612.42393518519 | 21.4 |
| 42612.444768518515 | 21.4 |
| 42612.46560185185 | 21.4 |
| 42612.48643518519 | 21.4 |
| 42612.507268518515 | 21.5 |
| 42612.52810185185 | 21.5 |
| 42612.54893518519 | 21.4 |
| 42612.569768518515 | 21.5 |
| 42612.59060185185 | 21.6 |
| 42612.61143518519 | 21.6 |
| 42612.632268518515 | 21.7 |
| 42612.65310185185 | 21.5 |
| 42612.67393518519 | 21.7 |
| 42612.694768518515 | 21.7 |
| 42612.71560185185 | 21.7 |
| 42612.73643518519 | 21.8 |
| 42612.757268518515 | 21.7 |
| 42612.77810185185 | 21.8 |
| 42612.79893518519 | 21.7 |
| 42612.819768518515 | 21.7 |
| 42612.84060185185 | 21.7 |
| 42612.86143518519 | 21.6 |
| 42612.882268518515 | 21.7 |
| 42612.90310185185 | 21.7 |
| 42612.92393518519 | 21.6 |
| 42612.944768518515 | 21.6 |
| 42612.96560185185 | 21.6 |
| 42612.98643518519 | 21.5 |
| 42613.007268518515 | 21.5 |
| 42613.02810185185 | 21.5 |
| 42613.04893518519 | 21.5 |
| 42613.069768518515 | 21.5 |
| 42613.09060185185 | 21.5 |
| 42613.11143518519 | 21.4 |
| 42613.132268518515 | 21.4 |
| 42613.15310185185 | 21.4 |
| 42613.17393518519 | 21.4 |
| 42613.194768518515 | 21.2 |
| 42613.21560185185 | 21.4 |
| 42613.23643518519 | 21.3 |
| 42613.257268518515 | 21.2 |
| 42613.27810185185 | 21.2 |
| 42613.29893518519 | 21.2 |
| 42613.319768518515 | 21.2 |
| 42613.34060185185 | 21.2 |
| 42613.36143518519 | 21.2 |
| 42613.382268518515 | 21.2 |
| 42613.40310185185 | 21.7 |
| 42613.42393518519 | 21.2 |
| 42613.444768518515 | 21.4 |
| 42613.46560185185 | 21.5 |
| 42613.48643518519 | 21.6 |
| 42613.507268518515 | 21.5 |
| 42613.52810185185 | 21.5 |
| 42613.54893518519 | 21.5 |
| 42613.569768518515 | 21.6 |
| 42613.59060185185 | 21.5 |
| 42613.61143518519 | 21.7 |
| 42613.632268518515 | 21.7 |
| 42613.65310185185 | 21.7 |
| 42613.67393518519 | 21.7 |
| 42613.694768518515 | 21.6 |
| 42613.71560185185 | 21.7 |
| 42613.73643518519 | 21.7 |
| 42613.757268518515 | 21.7 |
| 42613.77810185185 | 21.7 |
| 42613.79893518519 | 21.7 |
| 42613.819768518515 | 21.6 |
| 42613.84060185185 | 21.7 |
| 42613.86143518519 | 21.7 |
| 42613.882268518515 | 21.5 |
| 42613.90310185185 | 21.5 |
| 42613.92393518519 | 21.6 |
| 42613.944768518515 | 21.6 |
| 42613.96560185185 | 21.6 |
| 42613.98643518519 | 21.4 |
| 42614.007268518515 | 21.5 |
| 42614.02810185185 | 21.5 |
| 42614.04893518519 | 21.5 |
| 42614.069768518515 | 21.4 |
| 42614.09060185185 | 21.5 |
| 42614.11143518519 | 21.5 |
| 42614.132268518515 | 21.4 |
| 42614.15310185185 | 21.4 |
| 42614.17393518519 | 21.5 |
| 42614.194768518515 | 21.4 |
| 42614.21560185185 | 21.4 |
| 42614.23643518519 | 21.4 |
| 42614.257268518515 | 21.3 |
| 42614.27810185185 | 21.3 |
| 42614.29893518519 | 21.3 |
| 42614.319768518515 | 21.2 |
| 42614.34060185185 | 21.4 |
| 42614.36143518519 | 21.2 |
| 42614.382268518515 | 21.3 |
| 42614.40310185185 | 21.3 |
| 42614.42393518519 | 21.4 |
| 42614.444768518515 | 21.4 |
| 42614.46560185185 | 21.4 |
| 42614.48643518519 | 21.4 |
| 42614.507268518515 | 21.5 |
| 42614.52810185185 | 21.6 |
| 42614.54893518519 | 21.6 |
| 42614.569768518515 | 21.6 |
| 42614.59060185185 | 21.6 |
| 42614.61143518519 | 21.5 |
| 42614.632268518515 | 21.7 |
| 42614.65310185185 | 21.7 |
| 42614.67393518519 | 21.7 |
| 42614.694768518515 | 21.8 |
| 42614.71560185185 | 21.8 |
| 42614.73643518519 | 21.7 |
| 42614.757268518515 | 21.7 |
| 42614.77810185185 | 21.6 |
| 42614.79893518519 | 21.6 |
| 42614.819768518515 | 21.8 |
| 42614.84060185185 | 21.7 |
| 42614.86143518519 | 21.6 |
| 42614.882268518515 | 21.7 |
| 42614.90310185185 | 21.6 |
| 42614.92393518519 | 21.5 |
| 42614.944768518515 | 21.5 |
| 42614.96560185185 | 21.5 |
| 42614.98643518519 | 21.6 |
| 42615.007268518515 | 21.4 |
| 42615.02810185185 | 21.5 |
| 42615.04893518519 | 21.4 |
| 42615.069768518515 | 21.4 |
| 42615.09060185185 | 21.4 |
| 42615.11143518519 | 21.5 |
| 42615.132268518515 | 21.4 |
| 42615.15310185185 | 21.3 |
| 42615.17393518519 | 21.3 |
| 42615.194768518515 | 21.4 |
| 42615.21560185185 | 21.3 |
| 42615.23643518519 | 21.3 |
| 42615.257268518515 | 21.2 |
| 42615.27810185185 | 21.3 |
| 42615.29893518519 | 21.3 |
| 42615.319768518515 | 21.3 |
| 42615.34060185185 | 21.2 |
| 42615.36143518519 | 21.3 |
| 42615.382268518515 | 21.3 |
| 42615.40310185185 | 21.4 |
| 42615.42393518519 | 21.4 |
| 42615.444768518515 | 21.5 |
| 42615.46560185185 | 21.5 |
| 42615.48643518519 | 21.4 |
| 42615.507268518515 | 21.5 |
| 42615.52810185185 | 21.5 |
| 42615.54893518519 | 21.5 |
| 42615.569768518515 | 21.5 |
| 42615.59060185185 | 21.6 |
| 42615.61143518519 | 21.6 |
| 42615.632268518515 | 21.7 |
| 42615.65310185185 | 21.7 |
| 42615.67393518519 | 21.7 |
| 42615.694768518515 | 21.7 |
| 42615.71560185185 | 21.8 |
| 42615.73643518519 | 21.8 |
| 42615.757268518515 | 21.8 |
| 42615.75859953704 | 21.8 |
| 42615.758888888886 | 21.8 |
| 42615.77972222222 | 21.8 |
| 42615.80055555556 | 21.7 |
| 42615.821388888886 | 21.7 |
| 42615.84222222222 | 21.7 |
| 42615.86305555556 | 21.7 |
| 42615.883888888886 | 21.7 |
| 42615.90472222222 | 21.6 |
| 42615.92555555556 | 21.6 |
| 42615.946388888886 | 21.5 |
| 42615.96722222222 | 21.5 |
| 42615.98805555556 | 21.6 |
| 42616.008888888886 | 21.6 |
| 42616.02972222222 | 21.6 |
| 42616.05055555556 | 21.5 |
| 42616.071388888886 | 21.5 |
| 42616.09222222222 | 21.5 |
| 42616.11305555556 | 21.4 |
| 42616.133888888886 | 21.4 |
| 42616.15472222222 | 21.5 |
| 42616.17555555556 | 21.4 |
| 42616.196388888886 | 21.4 |
| 42616.21722222222 | 21.4 |
| 42616.23805555556 | 21.4 |
| 42616.258888888886 | 21.3 |
| 42616.27972222222 | 21.4 |
| 42616.30055555556 | 21.3 |
| 42616.321388888886 | 21.3 |
| 42616.34222222222 | 21.3 |
| 42616.36305555556 | 21.3 |
| 42616.383888888886 | 21.3 |
| 42616.40472222222 | 21.4 |
| 42616.42555555556 | 21.4 |
| 42616.446388888886 | 21.5 |
| 42616.46722222222 | 21.4 |
| 42616.48805555556 | 21.4 |
| 42616.508888888886 | 21.5 |
| 42616.52972222222 | 21.5 |
| 42616.55055555556 | 21.4 |
| 42616.571388888886 | 21.6 |
| 42616.59222222222 | 21.6 |
| 42616.61305555556 | 21.6 |
| 42616.633888888886 | 21.7 |
| 42616.65472222222 | 21.7 |
| 42616.67555555556 | 21.7 |
| 42616.696388888886 | 21.7 |
| 42616.71722222222 | 21.7 |
| 42616.73805555556 | 21.7 |
| 42616.758888888886 | 21.7 |
| 42616.77972222222 | 21.7 |
| 42616.80055555556 | 21.7 |
| 42616.821388888886 | 21.6 |
| 42616.84222222222 | 21.7 |
| 42616.86305555556 | 21.7 |
| 42616.883888888886 | 21.7 |
| 42616.90472222222 | 21.6 |
| 42616.92555555556 | 21.6 |
| 42616.946388888886 | 21.6 |
| 42616.96722222222 | 21.6 |
| 42616.98805555556 | 21.6 |
| 42617.008888888886 | 21.5 |
| 42617.02972222222 | 21.5 |
| 42617.05055555556 | 21.5 |
| 42617.071388888886 | 21.4 |
| 42617.09222222222 | 21.4 |
| 42617.11305555556 | 21.5 |
| 42617.133888888886 | 21.3 |
| 42617.15472222222 | 21.4 |
| 42617.17555555556 | 21.4 |
| 42617.196388888886 | 21.4 |
| 42617.21722222222 | 21.3 |
| 42617.23805555556 | 21.3 |
| 42617.258888888886 | 21.4 |
| 42617.27972222222 | 21.3 |
| 42617.30055555556 | 21.3 |
| 42617.321388888886 | 21.3 |
| 42617.34222222222 | 21.3 |
| 42617.36305555556 | 21.3 |
| 42617.383888888886 | 21.3 |
| 42617.40472222222 | 21.4 |
| 42617.42555555556 | 21.4 |
| 42617.446388888886 | 21.4 |
| 42617.46722222222 | 21.4 |
| 42617.48805555556 | 21.4 |
| 42617.508888888886 | 21.4 |
| 42617.52972222222 | 21.5 |
| 42617.55055555556 | 21.5 |
| 42617.571388888886 | 21.6 |
| 42617.59222222222 | 21.6 |
| 42617.61305555556 | 21.6 |
| 42617.633888888886 | 21.6 |
| 42617.65472222222 | 21.6 |
| 42617.67555555556 | 21.6 |
| 42617.696388888886 | 21.6 |
| 42617.71722222222 | 21.6 |
| 42617.73805555556 | 21.5 |
| 42617.758888888886 | 21.6 |
| 42617.77972222222 | 21.6 |
| 42617.80055555556 | 21.4 |
| 42617.821388888886 | 21.5 |
| 42617.84222222222 | 21.5 |
| 42617.86305555556 | 21.6 |
| 42617.883888888886 | 21.5 |
| 42617.90472222222 | 21.4 |
| 42617.92555555556 | 21.5 |
| 42617.946388888886 | 21.4 |
| 42617.96722222222 | 21.4 |
| 42617.98805555556 | 21.5 |
| 42618.008888888886 | 21.4 |
| 42618.02972222222 | 21.4 |
| 42618.05055555556 | 21.4 |
| 42618.071388888886 | 21.5 |
| 42618.09222222222 | 21.4 |
| 42618.11305555556 | 21.4 |
| 42618.133888888886 | 21.4 |
| 42618.15472222222 | 21.4 |
| 42618.17555555556 | 21.5 |
| 42618.196388888886 | 21.4 |
| 42618.21722222222 | 21.5 |
| 42618.23805555556 | 21.4 |
| 42618.258888888886 | 21.5 |
| 42618.27972222222 | 21.4 |
| 42618.30055555556 | 21.4 |
| 42618.321388888886 | 21.4 |
| 42618.34222222222 | 21.3 |
| 42618.36305555556 | 21.4 |
| 42618.383888888886 | 21.3 |
| 42618.40472222222 | 21.4 |
| 42618.42555555556 | 21.3 |
| 42618.446388888886 | 21.4 |
| 42618.4684837963 | 21.4 |
| 42618.48931712963 | 21.4 |
| 42618.510150462964 | 21.4 |
| 42618.5309837963 | 21.4 |
| 42618.55181712963 | 21.4 |
| 42618.572650462964 | 21.5 |
| 42618.5934837963 | 21.4 |
| 42618.61431712963 | 21.5 |
| 42618.635150462964 | 21.5 |
| 42618.6559837963 | 21.6 |
| 42618.67681712963 | 21.6 |
| 42618.697650462964 | 21.6 |
| 42618.7184837963 | 21.6 |
| 42618.73931712963 | 21.5 |
| 42618.760150462964 | 21.6 |
| 42618.7809837963 | 21.6 |
| 42618.80181712963 | 21.5 |
| 42618.822650462964 | 21.5 |
| 42618.8434837963 | 21.5 |
| 42618.86431712963 | 21.5 |
| 42618.885150462964 | 21.5 |
| 42618.9059837963 | 21.5 |
| 42618.92681712963 | 21.5 |
| 42618.947650462964 | 21.5 |
| 42618.9684837963 | 21.5 |
| 42618.98931712963 | 21.4 |
| 42619.010150462964 | 21.4 |
| 42619.0309837963 | 21.4 |
| 42619.05181712963 | 21.4 |
| 42619.072650462964 | 21.4 |
| 42619.0934837963 | 21.5 |
| 42619.11431712963 | 21.4 |
| 42619.135150462964 | 21.4 |
| 42619.1559837963 | 21.4 |
| 42619.17681712963 | 21.4 |
| 42619.197650462964 | 21.5 |
| 42619.2184837963 | 21.4 |
| 42619.23931712963 | 21.5 |
| 42619.260150462964 | 21.4 |
| 42619.2809837963 | 21.4 |
| 42619.30181712963 | 21.3 |
| 42619.322650462964 | 21.4 |
| 42619.3434837963 | 21.3 |
| 42619.36431712963 | 21.3 |
| 42619.385150462964 | 21.2 |
| 42619.4059837963 | 21.3 |
| 42619.42681712963 | 21.3 |
| 42619.447650462964 | 21.2 |
| 42619.4684837963 | 21.3 |
| 42619.48931712963 | 21.3 |
| 42619.510150462964 | 21.2 |
| 42619.5309837963 | 21.3 |
| 42619.55181712963 | 21.3 |
| 42619.572650462964 | 21.3 |
| 42619.5934837963 | 21.4 |
| 42619.61431712963 | 21.4 |
| 42619.635150462964 | 21.4 |
| 42619.6559837963 | 21.4 |
| 42619.67681712963 | 21.5 |
| 42619.697650462964 | 21.5 |
| 42619.7184837963 | 21.5 |
| 42619.73931712963 | 21.5 |
| 42619.760150462964 | 21.6 |
| 42619.7809837963 | 21.5 |
| 42619.80181712963 | 21.5 |
| 42619.822650462964 | 21.5 |
| 42619.8434837963 | 21.4 |
| 42619.86431712963 | 21.4 |
| 42619.885150462964 | 21.4 |
| 42619.9059837963 | 21.4 |
| 42619.92681712963 | 21.4 |
| 42619.947650462964 | 21.3 |
| 42619.9684837963 | 21.4 |
| 42619.98931712963 | 21.3 |
| 42620.010150462964 | 21.3 |
| 42620.0309837963 | 21.3 |
| 42620.05181712963 | 21.2 |
| 42620.072650462964 | 21.3 |
| 42620.0934837963 | 21.3 |
| 42620.11431712963 | 21.3 |
| 42620.135150462964 | 21.3 |
| 42620.1559837963 | 21.2 |
| 42620.17681712963 | 21.3 |
| 42620.197650462964 | 21.2 |
| 42620.2184837963 | 21.2 |
| 42620.23931712963 | 21.2 |
| 42620.260150462964 | 21.3 |
| 42620.2809837963 | 21.2 |
| 42620.30181712963 | 21.2 |
| 42620.322650462964 | 21.1 |
| 42620.3434837963 | 21.2 |
| 42620.36431712963 | 21.1 |
| 42620.385150462964 | 21.3 |
| 42620.4059837963 | 21.3 |
| 42620.42681712963 | 21.4 |
| 42620.447650462964 | 21.5 |
| 42620.4684837963 | 21.5 |
| 42620.48931712963 | 21.4 |
| 42620.510150462964 | 21.3 |
| 42620.5309837963 | 21.4 |
| 42620.55181712963 | 21.4 |
| 42620.572650462964 | 21.4 |
| 42620.5934837963 | 21.6 |
| 42620.61431712963 | 21.4 |
| 42620.635150462964 | 21.6 |
| 42620.6559837963 | 21.4 |
| 42620.67681712963 | 21.5 |
| 42620.697650462964 | 21.6 |
| 42620.7184837963 | 21.6 |
| 42620.73931712963 | 21.7 |
| 42620.760150462964 | 21.6 |
| 42620.7809837963 | 21.6 |
| 42620.80181712963 | 21.7 |
| 42620.822650462964 | 21.6 |
| 42620.8434837963 | 21.5 |
| 42620.86431712963 | 21.6 |
| 42620.885150462964 | 21.5 |
| 42620.9059837963 | 21.5 |
| 42620.92681712963 | 21.5 |
| 42620.947650462964 | 21.5 |
| 42620.9684837963 | 21.5 |
| 42620.98931712963 | 21.5 |
| 42621.010150462964 | 21.4 |
| 42621.0309837963 | 21.4 |
| 42621.05181712963 | 21.4 |
| 42621.072650462964 | 21.4 |
| 42621.0934837963 | 21.3 |
| 42621.11431712963 | 21.4 |
| 42621.135150462964 | 21.4 |
| 42621.1559837963 | 21.3 |
| 42621.17681712963 | 21.3 |
| 42621.197650462964 | 21.3 |
| 42621.2184837963 | 21.3 |
| 42621.23931712963 | 21.3 |
| 42621.260150462964 | 21.3 |
| 42621.2809837963 | 21.3 |
| 42621.30181712963 | 21.3 |
| 42621.322650462964 | 21.2 |
| 42621.3434837963 | 21.2 |
| 42621.36431712963 | 21.2 |
| 42621.385150462964 | 21.3 |
| 42621.4059837963 | 21.3 |
| 42621.42681712963 | 21.3 |
| 42621.447650462964 | 21.4 |
| 42621.4684837963 | 21.4 |
| 42621.48931712963 | 21.4 |
| 42621.510150462964 | 21.4 |
| 42621.5309837963 | 21.4 |
| 42621.55181712963 | 21.4 |
| 42621.572650462964 | 21.5 |
| 42621.5934837963 | 21.5 |
| 42621.61431712963 | 21.6 |
| 42621.635150462964 | 21.6 |
| 42621.6559837963 | 21.7 |
| 42621.67681712963 | 21.7 |
| 42621.697650462964 | 21.7 |
| 42621.7184837963 | 21.7 |
| 42621.73931712963 | 21.7 |
| 42621.760150462964 | 21.7 |
| 42621.7809837963 | 21.7 |
| 42621.80181712963 | 21.7 |
| 42621.822650462964 | 21.7 |
| 42621.8434837963 | 21.7 |
| 42621.86431712963 | 21.7 |
| 42621.885150462964 | 21.6 |
| 42621.9059837963 | 21.6 |
| 42621.92681712963 | 21.6 |
| 42621.947650462964 | 21.6 |
| 42621.9684837963 | 21.6 |
| 42621.98931712963 | 21.6 |
| 42622.010150462964 | 21.5 |
| 42622.0309837963 | 21.6 |
| 42622.05181712963 | 21.5 |
| 42622.072650462964 | 21.5 |
| 42622.0934837963 | 21.5 |
| 42622.11431712963 | 21.5 |
| 42622.135150462964 | 21.5 |
| 42622.1559837963 | 21.5 |
| 42622.17681712963 | 21.4 |
| 42622.197650462964 | 21.4 |
| 42622.2184837963 | 21.5 |
| 42622.23931712963 | 21.4 |
| 42622.260150462964 | 21.4 |
| 42622.2809837963 | 21.4 |
| 42622.30181712963 | 21.3 |
| 42622.322650462964 | 21.4 |
| 42622.3434837963 | 21.4 |
| 42622.36431712963 | 21.4 |
| 42622.385150462964 | 21.4 |
| 42622.4059837963 | 21.4 |
| 42622.42681712963 | 21.4 |
| 42622.447650462964 | 21.5 |
| 42622.4684837963 | 21.6 |
| 42622.48931712963 | 21.6 |
| 42622.510150462964 | 21.6 |
| 42622.5309837963 | 21.6 |
| 42622.55181712963 | 21.6 |
| 42622.572650462964 | 21.7 |
| 42622.5934837963 | 21.7 |
| 42622.61431712963 | 21.7 |
| 42622.635150462964 | 21.7 |
| 42622.6559837963 | 21.7 |
| 42622.67681712963 | 21.7 |
| 42622.697650462964 | 21.8 |
| 42622.7184837963 | 21.8 |
| 42622.73931712963 | 21.8 |
| 42622.760150462964 | 21.8 |
| 42622.7809837963 | 21.8 |
| 42622.80181712963 | 21.8 |
| 42622.822650462964 | 21.8 |
| 42622.8434837963 | 21.8 |
| 42622.86431712963 | 21.7 |
| 42622.885150462964 | 21.7 |
| 42622.9059837963 | 21.7 |
| 42622.92681712963 | 21.7 |
| 42622.947650462964 | 21.6 |
| 42622.9684837963 | 21.6 |
| 42622.98931712963 | 21.6 |
| 42623.010150462964 | 21.6 |
| 42623.0309837963 | 21.5 |
| 42623.05181712963 | 21.5 |
| 42623.072650462964 | 21.6 |
| 42623.0934837963 | 21.4 |
| 42623.11431712963 | 21.5 |
| 42623.135150462964 | 21.4 |
| 42623.1559837963 | 21.4 |
| 42623.17681712963 | 21.5 |
| 42623.197650462964 | 21.4 |
| 42623.2184837963 | 21.4 |
| 42623.23931712963 | 21.4 |
| 42623.260150462964 | 21.4 |
| 42623.2809837963 | 21.4 |
| 42623.30181712963 | 21.3 |
| 42623.322650462964 | 21.4 |
| 42623.3434837963 | 21.4 |
| 42623.36431712963 | 21.4 |
| 42623.385150462964 | 21.4 |
| 42623.4059837963 | 21.4 |
| 42623.42681712963 | 21.4 |
| 42623.447650462964 | 21.4 |
| 42623.4684837963 | 21.5 |
| 42623.48931712963 | 21.5 |
| 42623.510150462964 | 21.5 |
| 42623.5309837963 | 21.5 |
| 42623.55181712963 | 21.6 |
| 42623.572650462964 | 21.6 |
| 42623.5934837963 | 21.6 |
| 42623.61431712963 | 21.6 |
| 42623.635150462964 | 21.7 |
| 42623.6559837963 | 21.7 |
| 42623.67681712963 | 21.7 |
| 42623.697650462964 | 21.8 |
| 42623.7184837963 | 21.8 |
| 42623.73931712963 | 21.8 |
| 42623.760150462964 | 21.8 |
| 42623.7809837963 | 21.7 |
| 42623.80181712963 | 21.8 |
| 42623.822650462964 | 21.7 |
| 42623.8434837963 | 21.8 |
| 42623.86431712963 | 21.7 |
| 42623.885150462964 | 21.7 |
| 42623.9059837963 | 21.7 |
| 42623.92681712963 | 21.7 |
| 42623.947650462964 | 21.7 |
| 42623.9684837963 | 21.7 |
| 42623.98931712963 | 21.7 |
| 42624.010150462964 | 21.7 |
| 42624.0309837963 | 21.6 |
| 42624.05181712963 | 21.7 |
| 42624.072650462964 | 21.6 |
| 42624.0934837963 | 21.6 |
| 42624.11431712963 | 21.6 |
| 42624.135150462964 | 21.6 |
| 42624.1559837963 | 21.6 |
| 42624.17681712963 | 21.6 |
| 42624.197650462964 | 21.5 |
| 42624.2184837963 | 21.5 |
| 42624.23931712963 | 21.4 |
| 42624.260150462964 | 21.5 |
| 42624.2809837963 | 21.5 |
| 42624.30181712963 | 21.4 |
| 42624.322650462964 | 21.4 |
| 42624.3434837963 | 21.4 |
| 42624.36431712963 | 21.5 |
| 42624.385150462964 | 21.5 |
| 42624.4059837963 | 21.4 |
| 42624.42681712963 | 21.5 |
| 42624.447650462964 | 21.4 |
| 42624.4684837963 | 21.6 |
| 42624.48931712963 | 21.5 |
| 42624.510150462964 | 21.6 |
| 42624.5309837963 | 21.6 |
| 42624.55181712963 | 21.7 |
| 42624.572650462964 | 21.7 |
| 42624.5934837963 | 21.6 |
| 42624.61431712963 | 21.7 |
| 42624.635150462964 | 21.7 |
| 42624.6559837963 | 21.8 |
| 42624.67681712963 | 21.8 |
| 42624.697650462964 | 21.8 |
| 42624.7184837963 | 21.8 |
| 42624.73931712963 | 21.8 |
| 42624.760150462964 | 21.8 |
| 42624.7809837963 | 21.7 |
| 42624.80181712963 | 21.8 |
| 42624.822650462964 | 21.7 |
| 42624.8434837963 | 21.8 |
| 42624.86431712963 | 21.7 |
| 42624.885150462964 | 21.7 |
| 42624.9059837963 | 21.7 |
| 42624.92681712963 | 21.7 |
| 42624.947650462964 | 21.7 |
| 42624.9684837963 | 21.7 |
| 42624.98931712963 | 21.7 |
| 42625.010150462964 | 21.7 |
| 42625.0309837963 | 21.6 |
| 42625.05181712963 | 21.6 |
| 42625.072650462964 | 21.6 |
| 42625.0934837963 | 21.6 |
| 42625.11431712963 | 21.6 |
| 42625.135150462964 | 21.6 |
| 42625.1559837963 | 21.6 |
| 42625.17681712963 | 21.6 |
| 42625.197650462964 | 21.5 |
| 42625.2184837963 | 21.4 |
| 42625.23931712963 | 21.5 |
| 42625.260150462964 | 21.4 |
| 42625.2809837963 | 21.5 |
| 42625.30181712963 | 21.5 |
| 42625.322650462964 | 21.4 |
| 42625.3434837963 | 21.5 |
| 42625.36431712963 | 21.5 |
| 42625.385150462964 | 21.5 |
| 42625.4059837963 | 21.4 |
| 42625.42681712963 | 21.4 |
| 42625.447650462964 | 21.5 |
| 42625.4684837963 | 21.6 |
| 42625.48931712963 | 21.6 |
| 42625.510150462964 | 21.6 |
| 42625.5309837963 | 21.7 |
| 42625.55181712963 | 21.7 |
| 42625.572650462964 | 21.7 |
| 42625.5934837963 | 21.8 |
| 42625.61431712963 | 21.8 |
| 42625.635150462964 | 21.9 |
| 42625.6559837963 | 21.9 |
| 42625.67681712963 | 21.9 |
| 42625.697650462964 | 21.9 |
| 42625.7184837963 | 21.9 |
| 42625.73931712963 | 21.9 |
| 42625.760150462964 | 21.9 |
| 42625.7809837963 | 21.9 |
| 42625.80181712963 | 21.9 |
| 42625.822650462964 | 21.9 |
| 42625.8434837963 | 21.8 |
| 42625.86431712963 | 21.8 |
| 42625.885150462964 | 21.7 |
| 42625.9059837963 | 21.8 |
| 42625.92681712963 | 21.7 |
| 42625.947650462964 | 21.7 |
| 42625.9684837963 | 21.5 |
| 42625.98931712963 | 21.6 |
| 42626.010150462964 | 21.6 |
| 42626.0309837963 | 21.6 |
| 42626.05181712963 | 21.6 |
| 42626.072650462964 | 21.6 |
| 42626.0934837963 | 21.6 |
| 42626.11431712963 | 21.5 |
| 42626.135150462964 | 21.6 |
| 42626.1559837963 | 21.5 |
| 42626.17681712963 | 21.5 |
| 42626.197650462964 | 21.5 |
| 42626.2184837963 | 21.5 |
| 42626.23931712963 | 21.5 |
| 42626.260150462964 | 21.5 |
| 42626.2809837963 | 21.4 |
| 42626.30181712963 | 21.4 |
| 42626.322650462964 | 21.5 |
| 42626.3434837963 | 21.5 |
| 42626.36431712963 | 21.5 |
| 42626.385150462964 | 21.5 |
| 42626.4059837963 | 21.5 |
| 42626.42681712963 | 21.4 |
| 42626.447650462964 | 21.5 |
| 42626.4684837963 | 21.5 |
| 42626.48931712963 | 21.4 |
| 42626.510150462964 | 21.5 |
| 42626.5309837963 | 21.7 |
| 42626.55181712963 | 21.7 |
| 42626.572650462964 | 21.7 |
| 42626.5934837963 | 21.7 |
| 42626.61431712963 | 21.7 |
| 42626.635150462964 | 21.7 |
| 42626.6559837963 | 21.8 |
| 42626.67681712963 | 21.8 |
| 42626.697650462964 | 21.8 |
| 42626.7184837963 | 21.9 |
| 42626.73931712963 | 21.9 |
| 42626.760150462964 | 21.9 |
| 42626.7809837963 | 21.9 |
| 42626.80181712963 | 21.9 |
| 42626.822650462964 | 21.8 |
| 42626.8434837963 | 21.8 |
| 42626.86431712963 | 21.8 |
| 42626.885150462964 | 21.7 |
| 42626.9059837963 | 21.7 |
| 42626.92681712963 | 21.7 |
| 42626.947650462964 | 21.7 |
| 42626.9684837963 | 21.7 |
| 42626.98931712963 | 21.7 |
| 42627.010150462964 | 21.6 |
| 42627.0309837963 | 21.7 |
| 42627.05181712963 | 21.6 |
| 42627.072650462964 | 21.6 |
| 42627.0934837963 | 21.6 |
| 42627.11431712963 | 21.6 |
| 42627.135150462964 | 21.6 |
| 42627.1559837963 | 21.4 |
| 42627.17681712963 | 21.5 |
| 42627.197650462964 | 21.5 |
| 42627.2184837963 | 21.5 |
| 42627.23931712963 | 21.5 |
| 42627.260150462964 | 21.4 |
| 42627.2809837963 | 21.5 |
| 42627.30181712963 | 21.4 |
| 42627.322650462964 | 21.3 |
| 42627.3434837963 | 21.4 |
| 42627.36431712963 | 21.4 |
| 42627.385150462964 | 21.4 |
| 42627.4059837963 | 21.6 |
| 42627.42681712963 | 21.7 |
| 42627.447650462964 | 21.8 |
| 42627.4684837963 | 21.7 |
| 42627.48931712963 | 21.8 |
| 42627.510150462964 | 22 |
| 42627.5309837963 | 21.8 |
| 42627.55181712963 | 21.9 |
| 42627.572650462964 | 21.9 |
| 42627.5934837963 | 21.9 |
| 42627.61431712963 | 21.9 |
| 42627.635150462964 | 22.1 |
| 42627.6559837963 | 22.2 |
| 42627.67681712963 | 22.2 |
| 42627.697650462964 | 21.9 |
| 42627.7184837963 | 21.9 |
| 42627.73931712963 | 21.9 |
| 42627.760150462964 | 21.8 |
| 42627.7809837963 | 21.8 |
| 42627.80181712963 | 21.6 |
| 42627.822650462964 | 21.7 |
| 42627.8434837963 | 21.7 |
| 42627.86431712963 | 21.6 |
| 42627.885150462964 | 21.6 |
| 42627.9059837963 | 21.6 |
| 42627.92681712963 | 21.6 |
| 42627.947650462964 | 21.5 |
| 42627.9684837963 | 21.5 |
| 42627.98931712963 | 21.4 |
| 42628.010150462964 | 21.4 |
| 42628.0309837963 | 21.5 |
| 42628.05181712963 | 21.4 |
| 42628.072650462964 | 21.4 |
| 42628.0934837963 | 21.5 |
| 42628.11431712963 | 21.4 |
| 42628.135150462964 | 21.4 |
| 42628.1559837963 | 21.3 |
| 42628.17681712963 | 21.2 |
| 42628.197650462964 | 21.2 |
| 42628.2184837963 | 21.2 |
| 42628.23931712963 | 21.3 |
| 42628.260150462964 | 21.2 |
| 42628.2809837963 | 21.2 |
| 42628.30181712963 | 21.3 |
| 42628.322650462964 | 21.1 |
| 42628.3434837963 | 21.3 |
| 42628.36431712963 | 21.1 |
| 42628.385150462964 | 21.2 |
| 42628.4059837963 | 21.2 |
| 42628.42681712963 | 21.1 |
| 42628.447650462964 | 21.3 |
| 42628.4684837963 | 21.2 |
| 42628.48931712963 | 21.3 |
| 42628.510150462964 | 21.3 |
| 42628.5309837963 | 21.3 |
| 42628.55181712963 | 21.3 |
| 42628.572650462964 | 21.3 |
| 42628.5934837963 | 21.3 |
| 42628.61431712963 | 21.4 |
| 42628.635150462964 | 21.4 |
| 42628.6559837963 | 21.4 |
| 42628.67681712963 | 21.4 |
| 42628.697650462964 | 21.4 |
| 42628.7184837963 | 21.3 |
| 42628.73931712963 | 21.2 |
| 42628.760150462964 | 21.4 |
| 42628.7809837963 | 21.2 |
| 42628.80181712963 | 21.3 |
| 42628.822650462964 | 21.3 |
| 42628.8434837963 | 21.3 |
| 42628.86431712963 | 21.2 |
| 42628.885150462964 | 21.3 |
| 42628.9059837963 | 21.2 |
| 42628.92681712963 | 21.1 |
| 42628.947650462964 | 21.1 |
| 42628.9684837963 | 21.1 |
| 42628.98931712963 | 21.1 |
| 42629.010150462964 | 21.2 |
| 42629.0309837963 | 21.3 |
| 42629.05181712963 | 21.3 |
| 42629.072650462964 | 21.3 |
| 42629.0934837963 | 21.3 |
| 42629.11431712963 | 21.3 |
| 42629.135150462964 | 21.4 |
| 42629.1559837963 | 21.4 |
| 42629.17681712963 | 21.3 |
| 42629.197650462964 | 21.2 |
| 42629.2184837963 | 21.3 |
| 42629.23931712963 | 21.2 |
| 42629.260150462964 | 21.3 |
| 42629.2809837963 | 21.2 |
| 42629.30181712963 | 21.2 |
| 42629.322650462964 | 21.2 |
| 42629.3434837963 | 21.2 |
| 42629.36431712963 | 21.2 |
| 42629.385150462964 | 21.3 |
| 42629.4059837963 | 21.2 |
| 42629.42681712963 | 21.3 |
| 42629.447650462964 | 21.2 |
| 42629.4684837963 | 21.3 |
| 42629.48931712963 | 21.3 |
| 42629.510150462964 | 21.3 |
| 42629.5309837963 | 21.3 |
| 42629.55181712963 | 21.4 |
| 42629.572650462964 | 21.3 |
| 42629.5934837963 | 21.4 |
| 42629.61431712963 | 21.3 |
| 42629.635150462964 | 21.4 |
| 42629.6559837963 | 21.4 |
| 42629.67681712963 | 21.3 |
| 42629.697650462964 | 21.4 |
| 42629.7184837963 | 21.4 |
| 42629.73931712963 | 21.4 |
| 42629.760150462964 | 21.4 |
| 42629.7809837963 | 21.4 |
| 42629.80181712963 | 21.3 |
| 42629.822650462964 | 21.3 |
| 42629.8434837963 | 21.4 |
| 42629.86431712963 | 21.3 |
| 42629.885150462964 | 21.4 |
| 42629.9059837963 | 21.3 |
| 42629.92681712963 | 21.3 |
| 42629.947650462964 | 21.3 |
| 42629.9684837963 | 21.3 |
| 42629.98931712963 | 21.3 |
| 42630.010150462964 | 21.3 |
| 42630.0309837963 | 21.3 |
| 42630.05181712963 | 21.2 |
| 42630.072650462964 | 21.2 |
| 42630.0934837963 | 21.3 |
| 42630.11431712963 | 21.2 |
| 42630.135150462964 | 21.2 |
| 42630.1559837963 | 21.3 |
| 42630.17681712963 | 21.2 |
| 42630.197650462964 | 21.2 |
| 42630.2184837963 | 21.2 |
| 42630.23931712963 | 21.2 |
| 42630.260150462964 | 21.2 |
| 42630.2809837963 | 21.2 |
| 42630.30181712963 | 21.2 |
| 42630.322650462964 | 21.2 |
| 42630.3434837963 | 21.1 |
| 42630.36431712963 | 21.1 |
| 42630.385150462964 | 21.1 |
| 42630.4059837963 | 21.2 |
| 42630.42681712963 | 21.1 |
| 42630.447650462964 | 21.1 |
| 42630.4684837963 | 21.1 |
| 42630.48931712963 | 21.1 |
| 42630.510150462964 | 21.1 |
| 42630.5309837963 | 21.1 |
| 42630.55181712963 | 21.2 |
| 42630.572650462964 | 21.1 |
| 42630.5934837963 | 21.2 |
| 42630.61431712963 | 21.2 |
| 42630.635150462964 | 21.2 |
| 42630.6559837963 | 21.2 |
| 42630.67681712963 | 21.2 |
| 42630.697650462964 | 21.2 |
| 42630.7184837963 | 21.2 |
| 42630.73931712963 | 21.2 |
| 42630.760150462964 | 21.2 |
| 42630.7809837963 | 21.1 |
| 42630.80181712963 | 21.1 |
| 42630.822650462964 | 21.1 |
| 42630.8434837963 | 21.1 |
| 42630.86431712963 | 21.1 |
| 42630.885150462964 | 21.1 |
| 42630.9059837963 | 21.1 |
| 42630.92681712963 | 21.1 |
| 42630.947650462964 | 21.1 |
| 42630.9684837963 | 21.1 |
| 42630.98931712963 | 21.1 |
| 42631.010150462964 | 21.1 |
| 42631.0309837963 | 21.1 |
| 42631.05181712963 | 21.1 |
| 42631.072650462964 | 21 |
| 42631.0934837963 | 21.1 |
| 42631.11431712963 | 21.1 |
| 42631.135150462964 | 21.1 |
| 42631.1559837963 | 21.1 |
| 42631.17681712963 | 21.1 |
| 42631.197650462964 | 21 |
| 42631.2184837963 | 21 |
| 42631.23931712963 | 21 |
| 42631.260150462964 | 21 |
| 42631.2809837963 | 21 |
| 42631.30181712963 | 21 |
| 42631.322650462964 | 21 |
| 42631.3434837963 | 21 |
| 42631.36431712963 | 21 |
| 42631.385150462964 | 21 |
| 42631.4059837963 | 21.1 |
| 42631.42681712963 | 21 |
| 42631.447650462964 | 21.1 |
| 42631.4684837963 | 21 |
| 42631.48931712963 | 21 |
| 42631.510150462964 | 21 |
| 42631.5309837963 | 21.1 |
| 42631.55181712963 | 21 |
| 42631.572650462964 | 21.1 |
| 42631.5934837963 | 21 |
| 42631.61431712963 | 21.1 |
| 42631.635150462964 | 21.1 |
| 42631.6559837963 | 21.1 |
| 42631.67681712963 | 21 |
| 42631.697650462964 | 21.1 |
| 42631.7184837963 | 21.1 |
| 42631.73931712963 | 21 |
| 42631.760150462964 | 21.1 |
| 42631.7809837963 | 21.1 |
| 42631.80181712963 | 21.1 |
| 42631.822650462964 | 21.1 |
| 42631.8434837963 | 21.1 |
| 42631.86431712963 | 21.1 |
| 42631.885150462964 | 21.1 |
| 42631.9059837963 | 21.1 |
| 42631.92681712963 | 21 |
| 42631.947650462964 | 21 |
| 42631.9684837963 | 21 |
| 42631.98931712963 | 21 |
| 42632.010150462964 | 21.1 |
| 42632.0309837963 | 21 |
| 42632.05181712963 | 21.1 |
| 42632.072650462964 | 21 |
| 42632.0934837963 | 21.1 |
| 42632.11431712963 | 21 |
| 42632.135150462964 | 21 |
| 42632.1559837963 | 21 |
| 42632.17681712963 | 21 |
| 42632.197650462964 | 21 |
| 42632.2184837963 | 21 |
| 42632.23931712963 | 21 |
| 42632.260150462964 | 21 |
| 42632.2809837963 | 21 |
| 42632.30181712963 | 21 |
| 42632.322650462964 | 21 |
| 42632.3434837963 | 21 |
| 42632.36431712963 | 21 |
| 42632.385150462964 | 21.1 |
| 42632.4059837963 | 21 |
| 42632.42681712963 | 21 |
| 42632.447650462964 | 21.1 |
| 42632.4684837963 | 21.1 |
| 42632.48931712963 | 21.1 |
| 42632.510150462964 | 21.2 |
| 42632.5309837963 | 21.2 |
| 42632.55181712963 | 21.2 |
| 42632.572650462964 | 21.2 |
| 42632.5934837963 | 21.2 |
| 42632.61431712963 | 21.2 |
| 42632.635150462964 | 21.2 |
| 42632.6559837963 | 21.3 |
| 42632.67681712963 | 21.3 |
| 42632.697650462964 | 21.3 |
| 42632.7184837963 | 21.4 |
| 42632.73931712963 | 21.4 |
| 42632.760150462964 | 21.3 |
| 42632.7809837963 | 21.4 |
| 42632.80181712963 | 21.3 |
| 42632.822650462964 | 21.3 |
| 42632.8434837963 | 21.3 |
| 42632.86431712963 | 21.3 |
| 42632.885150462964 | 21.3 |
| 42632.9059837963 | 21.3 |
| 42632.92681712963 | 21.2 |
| 42632.947650462964 | 21.3 |
| 42632.9684837963 | 21.2 |
| 42632.98931712963 | 21.2 |
| 42633.010150462964 | 21.2 |
| 42633.0309837963 | 21.2 |
| 42633.05181712963 | 21.2 |
| 42633.072650462964 | 21.1 |
| 42633.0934837963 | 21.1 |
| 42633.11431712963 | 21.2 |
| 42633.135150462964 | 21.1 |
| 42633.1559837963 | 21.2 |
| 42633.17681712963 | 21.1 |
| 42633.197650462964 | 21.1 |
| 42633.2184837963 | 21.1 |
| 42633.23931712963 | 21.1 |
| 42633.260150462964 | 21.1 |
| 42633.2809837963 | 21.1 |
| 42633.30181712963 | 21.1 |
| 42633.322650462964 | 21.1 |
| 42633.3434837963 | 21.1 |
| 42633.36431712963 | 21 |
| 42633.385150462964 | 21 |
| 42633.4059837963 | 21.1 |
| 42633.42681712963 | 21.1 |
| 42633.447650462964 | 21 |
| 42633.4684837963 | 21.1 |
| 42633.48931712963 | 21.1 |
| 42633.510150462964 | 21.2 |
| 42633.5309837963 | 21.1 |
| 42633.55181712963 | 21.2 |
| 42633.572650462964 | 21.2 |
| 42633.5934837963 | 21.2 |
| 42633.61431712963 | 21.2 |
| 42633.635150462964 | 21.4 |
| 42633.6559837963 | 21.4 |
| 42633.67681712963 | 21.2 |
| 42633.697650462964 | 21.2 |
| 42633.7184837963 | 21.3 |
| 42633.73931712963 | 21.3 |
| 42633.760150462964 | 21.4 |
| 42633.7809837963 | 21.3 |
| 42633.80181712963 | 21.3 |
| 42633.822650462964 | 21.3 |
| 42633.8434837963 | 21.3 |
| 42633.86431712963 | 21.2 |
| 42633.885150462964 | 21.2 |
| 42633.9059837963 | 21.2 |
| 42633.92681712963 | 21.2 |
| 42633.947650462964 | 21.2 |
| 42633.9684837963 | 21.2 |
| 42633.98931712963 | 21.2 |
| 42634.010150462964 | 21.2 |
| 42634.0309837963 | 21.2 |
| 42634.05181712963 | 21.2 |
| 42634.072650462964 | 21.2 |
| 42634.0934837963 | 21.1 |
| 42634.11431712963 | 21.2 |
| 42634.135150462964 | 21.1 |
| 42634.1559837963 | 21 |
| 42634.17681712963 | 21.2 |
| 42634.197650462964 | 21.2 |
| 42634.2184837963 | 21.2 |
| 42634.23931712963 | 21.1 |
| 42634.260150462964 | 21.1 |
| 42634.2809837963 | 21.1 |
| 42634.30181712963 | 21.1 |
| 42634.322650462964 | 21.1 |
| 42634.3434837963 | 21.1 |
| 42634.36431712963 | 21.1 |
| 42634.385150462964 | 21.1 |
| 42634.4059837963 | 21.2 |
| 42634.42681712963 | 21.1 |
| 42634.447650462964 | 21.1 |
| 42634.4684837963 | 21.1 |
| 42634.48931712963 | 21.2 |
| 42634.510150462964 | 21.2 |
| 42634.5309837963 | 21.2 |
| 42634.55181712963 | 21.3 |
| 42634.572650462964 | 21.2 |
| 42634.5934837963 | 21.3 |
| 42634.61431712963 | 21.4 |
| 42634.635150462964 | 21.4 |
| 42634.6559837963 | 21.4 |
| 42634.67681712963 | 21.4 |
| 42634.697650462964 | 21.4 |
| 42634.7184837963 | 21.4 |
| 42634.73931712963 | 21.4 |
| 42634.760150462964 | 21.4 |
| 42634.7809837963 | 21.4 |
| 42634.80181712963 | 21.4 |
| 42634.822650462964 | 21.3 |
| 42634.8434837963 | 21.3 |
| 42634.86431712963 | 21.4 |
| 42634.885150462964 | 21.4 |
| 42634.9059837963 | 21.3 |
| 42634.92681712963 | 21.3 |
| 42634.947650462964 | 21.3 |
| 42634.9684837963 | 21.3 |
| 42634.98931712963 | 21.3 |
| 42635.010150462964 | 21.3 |
| 42635.0309837963 | 21.3 |
| 42635.05181712963 | 21.3 |
| 42635.072650462964 | 21.2 |
| 42635.0934837963 | 21.2 |
| 42635.11431712963 | 21.2 |
| 42635.135150462964 | 21.2 |
| 42635.1559837963 | 21.2 |
| 42635.17681712963 | 21.2 |
| 42635.197650462964 | 21.2 |
| 42635.2184837963 | 21.1 |
| 42635.23931712963 | 21.1 |
| 42635.260150462964 | 21.1 |
| 42635.2809837963 | 21.1 |
| 42635.30181712963 | 21.2 |
| 42635.322650462964 | 21.1 |
| 42635.3434837963 | 21.1 |
| 42635.36431712963 | 21.1 |
| 42635.385150462964 | 21.1 |
| 42635.4059837963 | 21.1 |
| 42635.42681712963 | 21.1 |
| 42635.447650462964 | 21.1 |
| 42635.4684837963 | 21.2 |
| 42635.48931712963 | 21.2 |
| 42635.510150462964 | 21.2 |
| 42635.5309837963 | 21.2 |
| 42635.55181712963 | 21.2 |
| 42635.572650462964 | 21.3 |
| 42635.5934837963 | 21.3 |
| 42635.61431712963 | 21.4 |
| 42635.635150462964 | 21.4 |
| 42635.6559837963 | 21.4 |
| 42635.67681712963 | 21.4 |
| 42635.697650462964 | 21.5 |
| 42635.7184837963 | 21.4 |
| 42635.73931712963 | 21.4 |
| 42635.760150462964 | 21.4 |
| 42635.7809837963 | 21.5 |
| 42635.80181712963 | 21.4 |
| 42635.822650462964 | 21.4 |
| 42635.8434837963 | 21.5 |
| 42635.86431712963 | 21.4 |
| 42635.885150462964 | 21.4 |
| 42635.9059837963 | 21.4 |
| 42635.92681712963 | 21.3 |
| 42635.947650462964 | 21.4 |
| 42635.9684837963 | 21.3 |
| 42635.98931712963 | 21.3 |
| 42636.010150462964 | 21.3 |
| 42636.0309837963 | 21.3 |
| 42636.05181712963 | 21.3 |
| 42636.072650462964 | 21.3 |
| 42636.0934837963 | 21.2 |
| 42636.11431712963 | 21.2 |
| 42636.135150462964 | 21.2 |
| 42636.1559837963 | 21.2 |
| 42636.17681712963 | 21.2 |
| 42636.197650462964 | 21.2 |
| 42636.2184837963 | 21.2 |
| 42636.23931712963 | 21.2 |
| 42636.260150462964 | 21.2 |
| 42636.2809837963 | 21.2 |
| 42636.30181712963 | 21.2 |
| 42636.322650462964 | 21.2 |
| 42636.3434837963 | 21.2 |
| 42636.36431712963 | 21.1 |
| 42636.385150462964 | 21.2 |
| 42636.4059837963 | 21.1 |
| 42636.42681712963 | 21.2 |
| 42636.447650462964 | 21.2 |
| 42636.4684837963 | 21.2 |
| 42636.48931712963 | 21.2 |
| 42636.510150462964 | 21.3 |
| 42636.5309837963 | 21.3 |
| 42636.55181712963 | 21.3 |
| 42636.572650462964 | 21.4 |
| 42636.5934837963 | 21.4 |
| 42636.61431712963 | 21.4 |
| 42636.635150462964 | 21.5 |
| 42636.6559837963 | 21.4 |
| 42636.67681712963 | 21.5 |
| 42636.697650462964 | 21.4 |
| 42636.7184837963 | 21.5 |
| 42636.73931712963 | 21.5 |
| 42636.760150462964 | 21.5 |
| 42636.7809837963 | 21.5 |
| 42636.80181712963 | 21.5 |
| 42636.822650462964 | 21.5 |
| 42636.8434837963 | 21.5 |
| 42636.86431712963 | 21.5 |
| 42636.885150462964 | 21.4 |
| 42636.9059837963 | 21.4 |
| 42636.92681712963 | 21.3 |
| 42636.947650462964 | 21.4 |
| 42636.9684837963 | 21.4 |
| 42636.98931712963 | 21.4 |
| 42637.010150462964 | 21.3 |
| 42637.0309837963 | 21.3 |
| 42637.05181712963 | 21.3 |
| 42637.072650462964 | 21.3 |
| 42637.0934837963 | 21.3 |
| 42637.11431712963 | 21.3 |
| 42637.135150462964 | 21.3 |
| 42637.1559837963 | 21.2 |
| 42637.17681712963 | 21.2 |
| 42637.197650462964 | 21.2 |
| 42637.2184837963 | 21.3 |
| 42637.23931712963 | 21.2 |
| 42637.260150462964 | 21.2 |
| 42637.2809837963 | 21.2 |
| 42637.30181712963 | 21.2 |
| 42637.322650462964 | 21.2 |
| 42637.3434837963 | 21.1 |
| 42637.36431712963 | 21.2 |
| 42637.385150462964 | 21.1 |
| 42637.4059837963 | 21.1 |
| 42637.42681712963 | 21.2 |
| 42637.447650462964 | 21.2 |
| 42637.4684837963 | 21.2 |
| 42637.48931712963 | 21.2 |
| 42637.510150462964 | 21.2 |
| 42637.5309837963 | 21.3 |
| 42637.55181712963 | 21.2 |
| 42637.572650462964 | 21.3 |
| 42637.5934837963 | 21.3 |
| 42637.61431712963 | 21.4 |
| 42637.635150462964 | 21.4 |
| 42637.6559837963 | 21.5 |
| 42637.67681712963 | 21.5 |
| 42637.697650462964 | 21.5 |
| 42637.7184837963 | 21.5 |
| 42637.73931712963 | 21.5 |
| 42637.760150462964 | 21.5 |
| 42637.7809837963 | 21.5 |
| 42637.80181712963 | 21.5 |
| 42637.822650462964 | 21.4 |
| 42637.8434837963 | 21.5 |
| 42637.86431712963 | 21.4 |
| 42637.885150462964 | 21.3 |
| 42637.9059837963 | 21.4 |
| 42637.92681712963 | 21.4 |
| 42637.947650462964 | 21.4 |
| 42637.9684837963 | 21.3 |
| 42637.98931712963 | 21.4 |
| 42638.010150462964 | 21.3 |
| 42638.0309837963 | 21.3 |
| 42638.05181712963 | 21.3 |
| 42638.072650462964 | 21.3 |
| 42638.0934837963 | 21.3 |
| 42638.11431712963 | 21.3 |
| 42638.135150462964 | 21.2 |
| 42638.1559837963 | 21.2 |
| 42638.17681712963 | 21.2 |
| 42638.197650462964 | 21.2 |
| 42638.2184837963 | 21.2 |
| 42638.23931712963 | 21.2 |
| 42638.260150462964 | 21.2 |
| 42638.2809837963 | 21.2 |
| 42638.30181712963 | 21.2 |
| 42638.322650462964 | 21.2 |
| 42638.3434837963 | 21.1 |
| 42638.36431712963 | 21.2 |
| 42638.385150462964 | 21.1 |
| 42638.4059837963 | 21.1 |
| 42638.42681712963 | 21.1 |
| 42638.447650462964 | 21.2 |
| 42638.4684837963 | 21.2 |
| 42638.48931712963 | 21.2 |
| 42638.510150462964 | 21.2 |
| 42638.5309837963 | 21.3 |
| 42638.55181712963 | 21.3 |
| 42638.572650462964 | 21.4 |
| 42638.5934837963 | 21.4 |
| 42638.61431712963 | 21.4 |
| 42638.635150462964 | 21.5 |
| 42638.6559837963 | 21.5 |
| 42638.67681712963 | 21.6 |
| 42638.697650462964 | 21.5 |
| 42638.7184837963 | 21.5 |
| 42638.73931712963 | 21.5 |
| 42638.760150462964 | 21.5 |
| 42638.7809837963 | 21.5 |
| 42638.80181712963 | 21.5 |
| 42638.822650462964 | 21.5 |
| 42638.8434837963 | 21.4 |
| 42638.86431712963 | 21.4 |
| 42638.885150462964 | 21.4 |
| 42638.9059837963 | 21.4 |
| 42638.92681712963 | 21.4 |
| 42638.947650462964 | 21.4 |
| 42638.9684837963 | 21.4 |
| 42638.98931712963 | 21.3 |
| 42639.010150462964 | 21.4 |
| 42639.0309837963 | 21.3 |
| 42639.05181712963 | 21.3 |
| 42639.072650462964 | 21.2 |
| 42639.0934837963 | 21.2 |
| 42639.11431712963 | 21.3 |
| 42639.135150462964 | 21.2 |
| 42639.1559837963 | 21.2 |
| 42639.17681712963 | 21.2 |
| 42639.197650462964 | 21.1 |
| 42639.2184837963 | 21.2 |
| 42639.23931712963 | 21.2 |
| 42639.260150462964 | 21.2 |
| 42639.2809837963 | 21.2 |
| 42639.30181712963 | 21.2 |
| 42639.322650462964 | 21.2 |
| 42639.3434837963 | 21.1 |
| 42639.36431712963 | 21.1 |
| 42639.385150462964 | 21.1 |
| 42639.4059837963 | 21.1 |
| 42639.42681712963 | 21.2 |
| 42639.447650462964 | 21.2 |
| 42639.4684837963 | 21.2 |
| 42639.48931712963 | 21.2 |
| 42639.510150462964 | 21.2 |
| 42639.5309837963 | 21.2 |
| 42639.55181712963 | 21.2 |
| 42639.572650462964 | 21.3 |
| 42639.5934837963 | 21.4 |
| 42639.61431712963 | 21.4 |
| 42639.635150462964 | 21.4 |
| 42639.6559837963 | 21.5 |
| 42639.67681712963 | 21.5 |
| 42639.697650462964 | 21.4 |
| 42639.7184837963 | 21.4 |
| 42639.73931712963 | 21.5 |
| 42639.760150462964 | 21.4 |
| 42639.7809837963 | 21.4 |
| 42639.80181712963 | 21.5 |
| 42639.822650462964 | 21.4 |
| 42639.8434837963 | 21.4 |
| 42639.86431712963 | 21.4 |
| 42639.885150462964 | 21.4 |
| 42639.9059837963 | 21.4 |
| 42639.92681712963 | 21.4 |
| 42639.947650462964 | 21.4 |
| 42639.9684837963 | 21.4 |
| 42639.98931712963 | 21.4 |
| 42640.010150462964 | 21.3 |
| 42640.0309837963 | 21.3 |
| 42640.05181712963 | 21.2 |
| 42640.072650462964 | 21.2 |
| 42640.0934837963 | 21.3 |
| 42640.11431712963 | 21.2 |
| 42640.135150462964 | 21.2 |
| 42640.1559837963 | 21.3 |
| 42640.17681712963 | 21.2 |
| 42640.197650462964 | 21.2 |
| 42640.2184837963 | 21.3 |
| 42640.23931712963 | 21.2 |
| 42640.260150462964 | 21.2 |
| 42640.2809837963 | 21.2 |
| 42640.30181712963 | 21.2 |
| 42640.322650462964 | 21.1 |
| 42640.3434837963 | 21.2 |
| 42640.36431712963 | 21.2 |
| 42640.385150462964 | 21.2 |
| 42640.4059837963 | 21.2 |
| 42640.42681712963 | 21.2 |
| 42640.447650462964 | 21.2 |
| 42640.4684837963 | 21.2 |
| 42640.48931712963 | 21.2 |
| 42640.510150462964 | 21.2 |
| 42640.5309837963 | 21.3 |
| 42640.55181712963 | 21.3 |
| 42640.572650462964 | 21.3 |
| 42640.5934837963 | 21.4 |
| 42640.61431712963 | 21.3 |
| 42640.635150462964 | 21.4 |
| 42640.6559837963 | 21.4 |
| 42640.67681712963 | 21.4 |
| 42640.697650462964 | 21.4 |
| 42640.7184837963 | 21.4 |
| 42640.73931712963 | 21.5 |
| 42640.760150462964 | 21.4 |
| 42640.7809837963 | 21.5 |
| 42640.80181712963 | 21.4 |
| 42640.822650462964 | 21.4 |
| 42640.8434837963 | 21.4 |
| 42640.86431712963 | 21.4 |
| 42640.885150462964 | 21.4 |
| 42640.9059837963 | 21.4 |
| 42640.92681712963 | 21.4 |
| 42640.947650462964 | 21.3 |
| 42640.9684837963 | 21.3 |
| 42640.98931712963 | 21.3 |
| 42641.010150462964 | 21.3 |
| 42641.0309837963 | 21.2 |
| 42641.05181712963 | 21.2 |
| 42641.072650462964 | 21.2 |
| 42641.0934837963 | 21.2 |
| 42641.11431712963 | 21.2 |
| 42641.135150462964 | 21.2 |
| 42641.1559837963 | 21.1 |
| 42641.17681712963 | 21.3 |
| 42641.197650462964 | 21.3 |
| 42641.2184837963 | 21.2 |
| 42641.23931712963 | 21.2 |
| 42641.260150462964 | 21.1 |
| 42641.2809837963 | 21.1 |
| 42641.30181712963 | 21.1 |
| 42641.322650462964 | 21.2 |
| 42641.3434837963 | 21.2 |
| 42641.36431712963 | 21.2 |
| 42641.385150462964 | 21.1 |
| 42641.4059837963 | 21.3 |
| 42641.42681712963 | 21.3 |
| 42641.447650462964 | 21.3 |
| 42641.4684837963 | 21.4 |
| 42641.48931712963 | 21.5 |
| 42641.510150462964 | 21.4 |
| 42641.5309837963 | 21.5 |
| 42641.55181712963 | 21.5 |
| 42641.572650462964 | 21.4 |
| 42641.5934837963 | 21.5 |
| 42641.61431712963 | 21.6 |
| 42641.635150462964 | 21.7 |
| 42641.6559837963 | 21.7 |
| 42641.67681712963 | 21.7 |
| 42641.697650462964 | 21.7 |
| 42641.7184837963 | 21.7 |
| 42641.73931712963 | 21.7 |
| 42641.760150462964 | 21.7 |
| 42641.7809837963 | 21.6 |
| 42641.80181712963 | 21.7 |
| 42641.822650462964 | 21.7 |
| 42641.8434837963 | 21.6 |
| 42641.86431712963 | 21.6 |
| 42641.885150462964 | 21.6 |
| 42641.9059837963 | 21.6 |
| 42641.92681712963 | 21.5 |
| 42641.947650462964 | 21.5 |
| 42641.9684837963 | 21.5 |
| 42641.98931712963 | 21.5 |
| 42642.010150462964 | 21.5 |
| 42642.0309837963 | 21.5 |
| 42642.05181712963 | 21.4 |
| 42642.072650462964 | 21.4 |
| 42642.0934837963 | 21.4 |
| 42642.11431712963 | 21.4 |
| 42642.135150462964 | 21.4 |
| 42642.1559837963 | 21.4 |
| 42642.17681712963 | 21.3 |
| 42642.197650462964 | 21.4 |
| 42642.2184837963 | 21.4 |
| 42642.23931712963 | 21.3 |
| 42642.260150462964 | 21.3 |
| 42642.2809837963 | 21.3 |
| 42642.30181712963 | 21.3 |
| 42642.322650462964 | 21.3 |
| 42642.3434837963 | 21.3 |
| 42642.36431712963 | 21.3 |
| 42642.385150462964 | 21.3 |
| 42642.4059837963 | 21.4 |
| 42642.42681712963 | 21.3 |
| 42642.447650462964 | 21.4 |
| 42642.4684837963 | 21.4 |
| 42642.48931712963 | 21.4 |
| 42642.510150462964 | 21.5 |
| 42642.5309837963 | 21.5 |
| 42642.55181712963 | 21.5 |
| 42642.572650462964 | 21.6 |
| 42642.5934837963 | 21.6 |
| 42642.61431712963 | 21.6 |
| 42642.635150462964 | 21.7 |
| 42642.6559837963 | 21.7 |
| 42642.67681712963 | 21.7 |
| 42642.697650462964 | 21.7 |
| 42642.7184837963 | 21.8 |
| 42642.73931712963 | 21.8 |
| 42642.760150462964 | 21.8 |
| 42642.7809837963 | 21.7 |
| 42642.80181712963 | 21.7 |
| 42642.822650462964 | 21.7 |
| 42642.8434837963 | 21.7 |
| 42642.86431712963 | 21.6 |
| 42642.885150462964 | 21.6 |
| 42642.9059837963 | 21.6 |
| 42642.92681712963 | 21.5 |
| 42642.947650462964 | 21.6 |
| 42642.9684837963 | 21.5 |
| 42642.98931712963 | 21.5 |
| 42643.010150462964 | 21.5 |
| 42643.0309837963 | 21.4 |
| 42643.05181712963 | 21.5 |
| 42643.072650462964 | 21.5 |
| 42643.0934837963 | 21.5 |
| 42643.11431712963 | 21.5 |
| 42643.135150462964 | 21.4 |
| 42643.1559837963 | 21.4 |
| 42643.17681712963 | 21.4 |
| 42643.197650462964 | 21.4 |
| 42643.2184837963 | 21.4 |
| 42643.23931712963 | 21.4 |
| 42643.260150462964 | 21.4 |
| 42643.2809837963 | 21.4 |
| 42643.30181712963 | 21.4 |
| 42643.322650462964 | 21.4 |
| 42643.3434837963 | 21.4 |
| 42643.36431712963 | 21.4 |
| 42643.385150462964 | 21.4 |
| 42643.4059837963 | 21.2 |
| 42643.42681712963 | 21.5 |
| 42643.447650462964 | 21.5 |
| 42643.4684837963 | 21.5 |
| 42643.48931712963 | 21.5 |
| 42643.510150462964 | 21.5 |
| 42643.5309837963 | 21.6 |
| 42643.55181712963 | 21.6 |
| 42643.572650462964 | 21.7 |
| 42643.5934837963 | 21.7 |
| 42643.61431712963 | 21.7 |
| 42643.635150462964 | 21.7 |
| 42643.6559837963 | 21.7 |
| 42643.67681712963 | 21.8 |
| 42643.697650462964 | 21.8 |
| 42643.7184837963 | 21.8 |
| 42643.73931712963 | 21.8 |
| 42643.760150462964 | 21.7 |
| 42643.7809837963 | 21.8 |
| 42643.80181712963 | 21.7 |
| 42643.822650462964 | 21.7 |
| 42643.8434837963 | 21.7 |
| 42643.86431712963 | 21.7 |
| 42643.885150462964 | 21.6 |
| 42643.9059837963 | 21.6 |
| 42643.92681712963 | 21.6 |
| 42643.947650462964 | 21.6 |
| 42643.9684837963 | 21.6 |
| 42643.98931712963 | 21.6 |
| 42644.010150462964 | 21.5 |
| 42644.0309837963 | 21.5 |
| 42644.05181712963 | 21.5 |
| 42644.072650462964 | 21.5 |
| 42644.0934837963 | 21.5 |
| 42644.11431712963 | 21.5 |
| 42644.135150462964 | 21.5 |
| 42644.1559837963 | 21.4 |
| 42644.17681712963 | 21.5 |
| 42644.197650462964 | 21.4 |
| 42644.2184837963 | 21.5 |
| 42644.23931712963 | 21.4 |
| 42644.260150462964 | 21.4 |
| 42644.2809837963 | 21.4 |
| 42644.30181712963 | 21.4 |
| 42644.322650462964 | 21.4 |
| 42644.3434837963 | 21.4 |
| 42644.36431712963 | 21.4 |
| 42644.385150462964 | 21.4 |
| 42644.4059837963 | 21.5 |
| 42644.42681712963 | 21.5 |
| 42644.447650462964 | 21.5 |
| 42644.4684837963 | 21.5 |
| 42644.48931712963 | 21.5 |
| 42644.510150462964 | 21.5 |
| 42644.5309837963 | 21.4 |
| 42644.55181712963 | 21.4 |
| 42644.572650462964 | 21.4 |
| 42644.5934837963 | 21.4 |
| 42644.61431712963 | 21.4 |
| 42644.635150462964 | 21.4 |
| 42644.6559837963 | 21.4 |
| 42644.67681712963 | 21.5 |
| 42644.697650462964 | 21.4 |
| 42644.7184837963 | 21.4 |
| 42644.73931712963 | 21.4 |
| 42644.760150462964 | 21.5 |
| 42644.7809837963 | 21.4 |
| 42644.80181712963 | 21.4 |
| 42644.822650462964 | 21.4 |
| 42644.8434837963 | 21.4 |
| 42644.86431712963 | 21.5 |
| 42644.885150462964 | 21.4 |
| 42644.9059837963 | 21.4 |
| 42644.92681712963 | 21.4 |
| 42644.947650462964 | 21.4 |
| 42644.9684837963 | 21.4 |
| 42644.98931712963 | 21.4 |
| 42645.010150462964 | 21.4 |
| 42645.0309837963 | 21.4 |
| 42645.05181712963 | 21.4 |
| 42645.072650462964 | 21.4 |
| 42645.0934837963 | 21.4 |
| 42645.11431712963 | 21.4 |
| 42645.135150462964 | 21.4 |
| 42645.1559837963 | 21.4 |
| 42645.17681712963 | 21.4 |
| 42645.197650462964 | 21.4 |
| 42645.2184837963 | 21.4 |
| 42645.23931712963 | 21.4 |
| 42645.260150462964 | 21.4 |
| 42645.2809837963 | 21.4 |
| 42645.30181712963 | 21.3 |
| 42645.322650462964 | 21.3 |
| 42645.3434837963 | 21.3 |
| 42645.36431712963 | 21.3 |
| 42645.385150462964 | 21.3 |
| 42645.4059837963 | 21.3 |
| 42645.42681712963 | 21.3 |
| 42645.447650462964 | 21.3 |
| 42645.4684837963 | 21.4 |
| 42645.48931712963 | 21.4 |
| 42645.510150462964 | 21.4 |
| 42645.5309837963 | 21.4 |
| 42645.55181712963 | 21.4 |
| 42645.572650462964 | 21.4 |
| 42645.5934837963 | 21.4 |
| 42645.61431712963 | 21.4 |
| 42645.635150462964 | 21.4 |
| 42645.6559837963 | 21.4 |
| 42645.67681712963 | 21.5 |
| 42645.697650462964 | 21.5 |
| 42645.7184837963 | 21.5 |
| 42645.73931712963 | 21.5 |
| 42645.760150462964 | 21.5 |
| 42645.7809837963 | 21.5 |
| 42645.80181712963 | 21.5 |
| 42645.822650462964 | 21.5 |
| 42645.8434837963 | 21.5 |
| 42645.86431712963 | 21.4 |
| 42645.885150462964 | 21.4 |
| 42645.9059837963 | 21.4 |
| 42645.92681712963 | 21.4 |
| 42645.947650462964 | 21.4 |
| 42645.9684837963 | 21.4 |
| 42645.98931712963 | 21.4 |
| 42646.010150462964 | 21.3 |
| 42646.0309837963 | 21.4 |
| 42646.05181712963 | 21.3 |
| 42646.072650462964 | 21.3 |
| 42646.0934837963 | 21.3 |
| 42646.11431712963 | 21.2 |
| 42646.135150462964 | 21.3 |
| 42646.1559837963 | 21.2 |
| 42646.17681712963 | 21.2 |
| 42646.197650462964 | 21.2 |
| 42646.2184837963 | 21.2 |
| 42646.23931712963 | 21.2 |
| 42646.260150462964 | 21.2 |
| 42646.2809837963 | 21.2 |
| 42646.30181712963 | 21.2 |
| 42646.322650462964 | 21.2 |
| 42646.3434837963 | 21.2 |
| 42646.36431712963 | 21.2 |
| 42646.385150462964 | 21.2 |
| 42646.4059837963 | 21.2 |
| 42646.42681712963 | 21.2 |
| 42646.447650462964 | 21.2 |
| 42646.4684837963 | 21.2 |
| 42646.48931712963 | 21.3 |
| 42646.510150462964 | 21.3 |
| 42646.5309837963 | 21.4 |
| 42646.55181712963 | 21.4 |
| 42646.572650462964 | 21.4 |
| 42646.5934837963 | 21.4 |
| 42646.61431712963 | 21.4 |
| 42646.635150462964 | 21.4 |
| 42646.6559837963 | 21.5 |
| 42646.67681712963 | 21.5 |
| 42646.697650462964 | 21.6 |
| 42646.7184837963 | 21.5 |
| 42646.73931712963 | 21.6 |
| 42646.760150462964 | 21.5 |
| 42646.7809837963 | 21.5 |
| 42646.80181712963 | 21.5 |
| 42646.822650462964 | 21.5 |
| 42646.8434837963 | 21.4 |
| 42646.86431712963 | 21.5 |
| 42646.885150462964 | 21.5 |
| 42646.9059837963 | 21.4 |
| 42646.92681712963 | 21.4 |
| 42646.947650462964 | 21.4 |
| 42646.9684837963 | 21.4 |
| 42646.98931712963 | 21.4 |
| 42647.010150462964 | 21.4 |
| 42647.0309837963 | 21.4 |
| 42647.05181712963 | 21.4 |
| 42647.072650462964 | 21.4 |
| 42647.0934837963 | 21.3 |
| 42647.11431712963 | 21.3 |
| 42647.135150462964 | 21.3 |
| 42647.1559837963 | 21.3 |
| 42647.17681712963 | 21.4 |
| 42647.197650462964 | 21.3 |
| 42647.2184837963 | 21.3 |
| 42647.23931712963 | 21.2 |
| 42647.260150462964 | 21.2 |
| 42647.2809837963 | 21.2 |
| 42647.30181712963 | 21.2 |
| 42647.322650462964 | 21.2 |
| 42647.3434837963 | 21.2 |
| 42647.36431712963 | 21.2 |
| 42647.385150462964 | 21.2 |
| 42647.4059837963 | 21.2 |
| 42647.42681712963 | 21.2 |
| 42647.447650462964 | 21.2 |
| 42647.4684837963 | 21.2 |
| 42647.48931712963 | 21.2 |
| 42647.510150462964 | 21.3 |
| 42647.5309837963 | 21.3 |
| 42647.55181712963 | 21.3 |
| 42647.572650462964 | 21.3 |
| 42647.5934837963 | 21.4 |
| 42647.61431712963 | 21.4 |
| 42647.635150462964 | 21.4 |
| 42647.6559837963 | 21.4 |
| 42647.67681712963 | 21.4 |
| 42647.697650462964 | 21.5 |
| 42647.7184837963 | 21.4 |
| 42647.73931712963 | 21.5 |
| 42647.760150462964 | 21.4 |
| 42647.7809837963 | 21.4 |
| 42647.80181712963 | 21.5 |
| 42647.822650462964 | 21.4 |
| 42647.8434837963 | 21.4 |
| 42647.86431712963 | 21.4 |
| 42647.885150462964 | 21.4 |
| 42647.9059837963 | 21.4 |
| 42647.92681712963 | 21.4 |
| 42647.947650462964 | 21.4 |
| 42647.9684837963 | 21.4 |
| 42647.98931712963 | 21.4 |
| 42648.010150462964 | 21.4 |
| 42648.0309837963 | 21.4 |
| 42648.05181712963 | 21.4 |
| 42648.072650462964 | 21.3 |
| 42648.0934837963 | 21.3 |
| 42648.11431712963 | 21.3 |
| 42648.135150462964 | 21.3 |
| 42648.1559837963 | 21.2 |
| 42648.17681712963 | 21.4 |
| 42648.197650462964 | 21.4 |
| 42648.2184837963 | 21.3 |
| 42648.23931712963 | 21.2 |
| 42648.260150462964 | 21.2 |
| 42648.2809837963 | 21.2 |
| 42648.30181712963 | 21.2 |
| 42648.322650462964 | 21.2 |
| 42648.3434837963 | 21.2 |
| 42648.36431712963 | 21.2 |
| 42648.385150462964 | 21.2 |
| 42648.4059837963 | 21.2 |
| 42648.42681712963 | 21.3 |
| 42648.447650462964 | 21.3 |
| 42648.4684837963 | 21.2 |
| 42648.48931712963 | 21.2 |
| 42648.510150462964 | 21.2 |
| 42648.5309837963 | 21.2 |
| 42648.55181712963 | 21.3 |
| 42648.572650462964 | 21.3 |
| 42648.5934837963 | 21.3 |
| 42648.61431712963 | 21.4 |
| 42648.635150462964 | 21.4 |
| 42648.6559837963 | 21.4 |
| 42648.67681712963 | 21.4 |
| 42648.697650462964 | 21.4 |
| 42648.7184837963 | 21.4 |
| 42648.73931712963 | 21.4 |
| 42648.760150462964 | 21.4 |
| 42648.7809837963 | 21.4 |
| 42648.80181712963 | 21.4 |
| 42648.822650462964 | 21.4 |
| 42648.8434837963 | 21.4 |
| 42648.86431712963 | 21.4 |
| 42648.885150462964 | 21.4 |
| 42648.9059837963 | 21.4 |
| 42648.92681712963 | 21.4 |
| 42648.947650462964 | 21.4 |
| 42648.9684837963 | 21.4 |
| 42648.98931712963 | 21.4 |
| 42649.010150462964 | 21.4 |
| 42649.0309837963 | 21.4 |
| 42649.05181712963 | 21.4 |
| 42649.072650462964 | 21.4 |
| 42649.0934837963 | 21.4 |
| 42649.11431712963 | 21.4 |
| 42649.135150462964 | 21.4 |
| 42649.1559837963 | 21.3 |
| 42649.17681712963 | 21.3 |
| 42649.197650462964 | 21.3 |
| 42649.2184837963 | 21.3 |
| 42649.23931712963 | 21.3 |
| 42649.260150462964 | 21.3 |
| 42649.2809837963 | 21.3 |
| 42649.30181712963 | 21.3 |
| 42649.322650462964 | 21.3 |
| 42649.3434837963 | 21.3 |
| 42649.36431712963 | 21.3 |
| 42649.385150462964 | 21.3 |
| 42649.4059837963 | 21.3 |
| 42649.42681712963 | 21.3 |
| 42649.447650462964 | 21.3 |
| 42649.4684837963 | 21.4 |
| 42649.48931712963 | 21.3 |
| 42649.510150462964 | 21.3 |
| 42649.5309837963 | 21.4 |
| 42649.55181712963 | 21.4 |
| 42649.572650462964 | 21.4 |
| 42649.5934837963 | 21.4 |
| 42649.61431712963 | 21.5 |
| 42649.635150462964 | 21.5 |
| 42649.6559837963 | 21.5 |
| 42649.67681712963 | 21.5 |
| 42649.697650462964 | 21.5 |
| 42649.7184837963 | 21.5 |
| 42649.73931712963 | 21.5 |
| 42649.760150462964 | 21.5 |
| 42649.7809837963 | 21.4 |
| 42649.80181712963 | 21.4 |
| 42649.822650462964 | 21.4 |
| 42649.8434837963 | 21.4 |
| 42649.86431712963 | 21.4 |
| 42649.885150462964 | 21.4 |
| 42649.9059837963 | 21.4 |
| 42649.92681712963 | 21.4 |
| 42649.947650462964 | 21.4 |
| 42649.9684837963 | 21.4 |
| 42649.98931712963 | 21.4 |
| 42650.010150462964 | 21.4 |
| 42650.0309837963 | 21.4 |
| 42650.05181712963 | 21.4 |
| 42650.072650462964 | 21.3 |
| 42650.0934837963 | 21.3 |
| 42650.11431712963 | 21.3 |
| 42650.135150462964 | 21.3 |
| 42650.1559837963 | 21.3 |
| 42650.17681712963 | 21.3 |
| 42650.197650462964 | 21.3 |
| 42650.2184837963 | 21.3 |
| 42650.23931712963 | 21.3 |
| 42650.260150462964 | 21.3 |
| 42650.2809837963 | 21.3 |
| 42650.30181712963 | 21.3 |
| 42650.322650462964 | 21.3 |
| 42650.3434837963 | 21.3 |
| 42650.36431712963 | 21.3 |
| 42650.385150462964 | 21.3 |
| 42650.4059837963 | 21.3 |
| 42650.42681712963 | 21.3 |
| 42650.447650462964 | 21.3 |
| 42650.4684837963 | 21.3 |
| 42650.48931712963 | 21.3 |
| 42650.510150462964 | 21.3 |
| 42650.5309837963 | 21.3 |
| 42650.55181712963 | 21.3 |
| 42650.572650462964 | 21.4 |
| 42650.5934837963 | 21.4 |
| 42650.61431712963 | 21.3 |
| 42650.635150462964 | 21.3 |
| 42650.6559837963 | 21.4 |
| 42650.67681712963 | 21.4 |
| 42650.697650462964 | 21.4 |
| 42650.7184837963 | 21.4 |
| 42650.73931712963 | 21.4 |
| 42650.760150462964 | 21.4 |
| 42650.7809837963 | 21.4 |
| 42650.80181712963 | 21.4 |
| 42650.822650462964 | 21.4 |
| 42650.8434837963 | 21.4 |
| 42650.86431712963 | 21.4 |
| 42650.885150462964 | 21.4 |
| 42650.9059837963 | 21.4 |
| 42650.92681712963 | 21.4 |
| 42650.947650462964 | 21.4 |
| 42650.9684837963 | 21.4 |
| 42650.98931712963 | 21.4 |
| 42651.010150462964 | 21.4 |
| 42651.0309837963 | 21.3 |
| 42651.05181712963 | 21.3 |
| 42651.072650462964 | 21.4 |
| 42651.0934837963 | 21.3 |
| 42651.11431712963 | 21.3 |
| 42651.135150462964 | 21.3 |
| 42651.1559837963 | 21.4 |
| 42651.17681712963 | 21.3 |
| 42651.197650462964 | 21.3 |
| 42651.2184837963 | 21.3 |
| 42651.23931712963 | 21.3 |
| 42651.260150462964 | 21.3 |
| 42651.2809837963 | 21.3 |
| 42651.30181712963 | 21.2 |
| 42651.322650462964 | 21.2 |
| 42651.3434837963 | 21.2 |
| 42651.36431712963 | 21.2 |
| 42651.385150462964 | 21.2 |
| 42651.4059837963 | 21.2 |
| 42651.42681712963 | 21.3 |
| 42651.447650462964 | 21.2 |
| 42651.4684837963 | 21.3 |
| 42651.48931712963 | 21.3 |
| 42651.510150462964 | 21.4 |
| 42651.5309837963 | 21.4 |
| 42651.55181712963 | 21.4 |
| 42651.572650462964 | 21.4 |
| 42651.5934837963 | 21.4 |
| 42651.61431712963 | 21.4 |
| 42651.635150462964 | 21.4 |
| 42651.6559837963 | 21.4 |
| 42651.67681712963 | 21.4 |
| 42651.697650462964 | 21.4 |
| 42651.7184837963 | 21.4 |
| 42651.73931712963 | 21.4 |
| 42651.760150462964 | 21.4 |
| 42651.7809837963 | 21.4 |
| 42651.80181712963 | 21.4 |
| 42651.822650462964 | 21.4 |
| 42651.8434837963 | 21.4 |
| 42651.86431712963 | 21.4 |
| 42651.885150462964 | 21.4 |
| 42651.9059837963 | 21.4 |
| 42651.92681712963 | 21.4 |
| 42651.947650462964 | 21.4 |
| 42651.9684837963 | 21.3 |
| 42651.98931712963 | 21.4 |
| 42652.010150462964 | 21.3 |
| 42652.0309837963 | 21.3 |
| 42652.05181712963 | 21.3 |
| 42652.072650462964 | 21.3 |
| 42652.0934837963 | 21.3 |
| 42652.11431712963 | 21.3 |
| 42652.135150462964 | 21.3 |
| 42652.1559837963 | 21.3 |
| 42652.17681712963 | 21.2 |
| 42652.197650462964 | 21.2 |
| 42652.2184837963 | 21.2 |
| 42652.23931712963 | 21.2 |
| 42652.260150462964 | 21.2 |
| 42652.2809837963 | 21.2 |
| 42652.30181712963 | 21.2 |
| 42652.322650462964 | 21.2 |
| 42652.3434837963 | 21.2 |
| 42652.36431712963 | 21.2 |
| 42652.385150462964 | 21.2 |
| 42652.4059837963 | 21.2 |
| 42652.42681712963 | 21.2 |
| 42652.447650462964 | 21.2 |
| 42652.4684837963 | 21.2 |
| 42652.48931712963 | 21.2 |
| 42652.510150462964 | 21.3 |
| 42652.5309837963 | 21.3 |
| 42652.55181712963 | 21.3 |
| 42652.572650462964 | 21.3 |
| 42652.5934837963 | 21.4 |
| 42652.61431712963 | 21.3 |
| 42652.635150462964 | 21.3 |
| 42652.6559837963 | 21.3 |
| 42652.67681712963 | 21.4 |
| 42652.697650462964 | 21.4 |
| 42652.7184837963 | 21.3 |
| 42652.73931712963 | 21.4 |
| 42652.760150462964 | 21.4 |
| 42652.7809837963 | 21.4 |
| 42652.80181712963 | 21.4 |
| 42652.822650462964 | 21.3 |
| 42652.8434837963 | 21.3 |
| 42652.86431712963 | 21.3 |
| 42652.885150462964 | 21.3 |
| 42652.9059837963 | 21.3 |
| 42652.92681712963 | 21.3 |
| 42652.947650462964 | 21.3 |
| 42652.9684837963 | 21.3 |
| 42652.98931712963 | 21.2 |
| 42653.010150462964 | 21.2 |
| 42653.0309837963 | 21.2 |
| 42653.05181712963 | 21.2 |
| 42653.072650462964 | 21.2 |
| 42653.0934837963 | 21.3 |
| 42653.11431712963 | 21.2 |
| 42653.135150462964 | 21.2 |
| 42653.1559837963 | 21.1 |
| 42653.17681712963 | 21.1 |
| 42653.197650462964 | 21.1 |
| 42653.2184837963 | 21.1 |
| 42653.23931712963 | 21.2 |
| 42653.260150462964 | 21.2 |
| 42653.2809837963 | 21.1 |
| 42653.30181712963 | 21.2 |
| 42653.322650462964 | 21.1 |
| 42653.3434837963 | 21.1 |
| 42653.36431712963 | 21.1 |
| 42653.385150462964 | 21.1 |
| 42653.4059837963 | 21.1 |
| 42653.42681712963 | 21.1 |
| 42653.447650462964 | 21.1 |
| 42653.4684837963 | 21.1 |
| 42653.48931712963 | 21.2 |
| 42653.510150462964 | 21.2 |
| 42653.5309837963 | 21.2 |
| 42653.55181712963 | 21.2 |
| 42653.572650462964 | 21.2 |
| 42653.5934837963 | 21.2 |
| 42653.61431712963 | 21.3 |
| 42653.635150462964 | 21.3 |
| 42653.6559837963 | 21.3 |
| 42653.67681712963 | 21.3 |
| 42653.697650462964 | 21.3 |
| 42653.7184837963 | 21.2 |
| 42653.73931712963 | 21.3 |
| 42653.760150462964 | 21.2 |
| 42653.7809837963 | 21.2 |
| 42653.80181712963 | 21.2 |
| 42653.822650462964 | 21.2 |
| 42653.8434837963 | 21.2 |
| 42653.86431712963 | 21.2 |
| 42653.885150462964 | 21.2 |
| 42653.9059837963 | 21.2 |
| 42653.92681712963 | 21.2 |
| 42653.947650462964 | 21.2 |
| 42653.9684837963 | 21.2 |
| 42653.98931712963 | 21.2 |
| 42654.010150462964 | 21.2 |
| 42654.0309837963 | 21.2 |
| 42654.05181712963 | 21.1 |
| 42654.072650462964 | 21.1 |
| 42654.0934837963 | 21.2 |
| 42654.11431712963 | 21.1 |
| 42654.135150462964 | 21.1 |
| 42654.1559837963 | 21.1 |
| 42654.17681712963 | 21.1 |
| 42654.197650462964 | 21.1 |
| 42654.2184837963 | 21.1 |
| 42654.23931712963 | 21.1 |
| 42654.260150462964 | 21.1 |
| 42654.2809837963 | 21.1 |
| 42654.30181712963 | 21.1 |
| 42654.322650462964 | 21.1 |
| 42654.3434837963 | 21.1 |
| 42654.36431712963 | 21.1 |
| 42654.385150462964 | 21.1 |
| 42654.4059837963 | 21.1 |
| 42654.42681712963 | 21.1 |
| 42654.447650462964 | 21.1 |
| 42654.4684837963 | 21.1 |
| 42654.48931712963 | 21.1 |
| 42654.510150462964 | 21.1 |
| 42654.5309837963 | 21.2 |
| 42654.55181712963 | 21.2 |
| 42654.572650462964 | 21.2 |
| 42654.5934837963 | 21.1 |
| 42654.61431712963 | 21.1 |
| 42654.635150462964 | 21.2 |
| 42654.6559837963 | 21.2 |
| 42654.67681712963 | 21.2 |
| 42654.697650462964 | 21.2 |
| 42654.7184837963 | 21.2 |
| 42654.73931712963 | 21.2 |
| 42654.760150462964 | 21.2 |
| 42654.7809837963 | 21.2 |
| 42654.80181712963 | 21.2 |
| 42654.822650462964 | 21.2 |
| 42654.8434837963 | 21.2 |
| 42654.86431712963 | 21.2 |
| 42654.885150462964 | 21.2 |
| 42654.9059837963 | 21.1 |
| 42654.92681712963 | 21.1 |
| 42654.947650462964 | 21.1 |
| 42654.9684837963 | 21.1 |
| 42654.98931712963 | 21.1 |
| 42655.010150462964 | 21.1 |
| 42655.0309837963 | 21.1 |
| 42655.05181712963 | 21.1 |
| 42655.072650462964 | 21.1 |
| 42655.0934837963 | 21.1 |
| 42655.11431712963 | 21.1 |
| 42655.135150462964 | 21 |
| 42655.1559837963 | 21 |
| 42655.17681712963 | 21.4 |
| 42655.197650462964 | 21.2 |
| 42655.2184837963 | 21.2 |
| 42655.23931712963 | 21.1 |
| 42655.260150462964 | 21.1 |
| 42655.2809837963 | 21.1 |
| 42655.30181712963 | 21.2 |
| 42655.322650462964 | 21.1 |
| 42655.3434837963 | 21.1 |
| 42655.36431712963 | 21.1 |
| 42655.385150462964 | 21.1 |
| 42655.4059837963 | 21.1 |
| 42655.42681712963 | 21.1 |
| 42655.447650462964 | 21.1 |
| 42655.4684837963 | 21.1 |
| 42655.48931712963 | 21.2 |
| 42655.510150462964 | 21.2 |
| 42655.5309837963 | 21.2 |
| 42655.55181712963 | 21.2 |
| 42655.572650462964 | 21.3 |
| 42655.5934837963 | 21.3 |
| 42655.61431712963 | 21.3 |
| 42655.635150462964 | 21.4 |
| 42655.6559837963 | 21.5 |
| 42655.67681712963 | 21.5 |
| 42655.697650462964 | 21.4 |
| 42655.7184837963 | 21.5 |
| 42655.73931712963 | 21.5 |
| 42655.760150462964 | 21.4 |
| 42655.7809837963 | 21.4 |
| 42655.80181712963 | 21.4 |
| 42655.822650462964 | 21.4 |
| 42655.8434837963 | 21.4 |
| 42655.86431712963 | 21.4 |
| 42655.885150462964 | 21.4 |
| 42655.9059837963 | 21.3 |
| 42655.92681712963 | 21.3 |
| 42655.947650462964 | 21.3 |
| 42655.9684837963 | 21.3 |
| 42655.98931712963 | 21.3 |
| 42656.010150462964 | 21.2 |
| 42656.0309837963 | 21.2 |
| 42656.05181712963 | 21.3 |
| 42656.072650462964 | 21.2 |
| 42656.0934837963 | 21.3 |
| 42656.11431712963 | 21.2 |
| 42656.135150462964 | 21.2 |
| 42656.1559837963 | 21.3 |
| 42656.17681712963 | 21.2 |
| 42656.197650462964 | 21.2 |
| 42656.2184837963 | 21.3 |
| 42656.23931712963 | 21.2 |
| 42656.260150462964 | 21.2 |
| 42656.2809837963 | 21.2 |
| 42656.30181712963 | 21.2 |
| 42656.322650462964 | 21.2 |
| 42656.3434837963 | 21.2 |
| 42656.36431712963 | 21.2 |
| 42656.385150462964 | 21.2 |
| 42656.4059837963 | 21.2 |
| 42656.42681712963 | 21.2 |
| 42656.447650462964 | 21.2 |
| 42656.4684837963 | 21.2 |
| 42656.48931712963 | 21.2 |
| 42656.510150462964 | 21.2 |
| 42656.5309837963 | 21.3 |
| 42656.55181712963 | 21.2 |
| 42656.572650462964 | 21.2 |
| 42656.5934837963 | 21.3 |
| 42656.61431712963 | 21.2 |
| 42656.635150462964 | 21.2 |
| 42656.6559837963 | 21.2 |
| 42656.67681712963 | 21.2 |
| 42656.697650462964 | 21.2 |
| 42656.7184837963 | 21.2 |
| 42656.73931712963 | 21.2 |
| 42656.760150462964 | 21.2 |
| 42656.7809837963 | 21.2 |
| 42656.80181712963 | 21.2 |
| 42656.822650462964 | 21.2 |
| 42656.8434837963 | 21.2 |
| 42656.86431712963 | 21.2 |
| 42656.885150462964 | 21.2 |
| 42656.9059837963 | 21.2 |
| 42656.92681712963 | 21.2 |
| 42656.947650462964 | 21.2 |
| 42656.9684837963 | 21.2 |
| 42656.98931712963 | 21.2 |
| 42657.010150462964 | 21.2 |
| 42657.0309837963 | 21.2 |
| 42657.05181712963 | 21.2 |
| 42657.072650462964 | 21.2 |
| 42657.0934837963 | 21.2 |
| 42657.11431712963 | 21.2 |
| 42657.135150462964 | 21.2 |
| 42657.1559837963 | 21.2 |
| 42657.17681712963 | 21.2 |
| 42657.197650462964 | 21.2 |
| 42657.2184837963 | 21.2 |
| 42657.23931712963 | 21.2 |
| 42657.260150462964 | 21.2 |
| 42657.2809837963 | 21.2 |
| 42657.30181712963 | 21.2 |
| 42657.322650462964 | 21.2 |
| 42657.3434837963 | 21.2 |
| 42657.36431712963 | 21.2 |
| 42657.385150462964 | 21.2 |
| 42657.4059837963 | 21.2 |
| 42657.42681712963 | 21.2 |
| 42657.447650462964 | 21.2 |
| 42657.4684837963 | 21.2 |
| 42657.48931712963 | 21.2 |
| 42657.510150462964 | 21.2 |
| 42657.5309837963 | 21.2 |
| 42657.55181712963 | 21.2 |
| 42657.572650462964 | 21.2 |
| 42657.5934837963 | 21.2 |
| 42657.61431712963 | 21.2 |
| 42657.635150462964 | 21.2 |
| 42657.6559837963 | 21.2 |
| 42657.67681712963 | 21.2 |
| 42657.697650462964 | 21.2 |
| 42657.7184837963 | 21.2 |
| 42657.73931712963 | 21.3 |
| 42657.760150462964 | 21.2 |
| 42657.7809837963 | 21.3 |
| 42657.80181712963 | 21.3 |
| 42657.822650462964 | 21.2 |
| 42657.8434837963 | 21.3 |
| 42657.86431712963 | 21.3 |
| 42657.885150462964 | 21.2 |
| 42657.9059837963 | 21.2 |
| 42657.92681712963 | 21.2 |
| 42657.947650462964 | 21.2 |
| 42657.9684837963 | 21.2 |
| 42657.98931712963 | 21.2 |
| 42658.010150462964 | 21.2 |
| 42658.0309837963 | 21.2 |
| 42658.05181712963 | 21.2 |
| 42658.072650462964 | 21.2 |
| 42658.0934837963 | 21.2 |
| 42658.11431712963 | 21.2 |
| 42658.135150462964 | 21.2 |
| 42658.1559837963 | 21.2 |
| 42658.17681712963 | 21.2 |
| 42658.197650462964 | 21.2 |
| 42658.2184837963 | 21.2 |
| 42658.23931712963 | 21.3 |
| 42658.260150462964 | 21.2 |
| 42658.2809837963 | 21.2 |
| 42658.30181712963 | 21.2 |
| 42658.322650462964 | 21.2 |
| 42658.3434837963 | 21.2 |
| 42658.36431712963 | 21.2 |
| 42658.385150462964 | 21.2 |
| 42658.4059837963 | 21.2 |
| 42658.42681712963 | 21.2 |
| 42658.447650462964 | 21.3 |
| 42658.4684837963 | 21.2 |
| 42658.48931712963 | 21.3 |
| 42658.510150462964 | 21.3 |
| 42658.5309837963 | 21.4 |
| 42658.55181712963 | 21.4 |
| 42658.572650462964 | 21.4 |
| 42658.5934837963 | 21.4 |
| 42658.61431712963 | 21.4 |
| 42658.635150462964 | 21.5 |
| 42658.6559837963 | 21.5 |
| 42658.67681712963 | 21.5 |
| 42658.697650462964 | 21.5 |
| 42658.7184837963 | 21.6 |
| 42658.73931712963 | 21.5 |
| 42658.760150462964 | 21.5 |
| 42658.7809837963 | 21.5 |
| 42658.80181712963 | 21.5 |
| 42658.822650462964 | 21.5 |
| 42658.8434837963 | 21.4 |
| 42658.86431712963 | 21.4 |
| 42658.885150462964 | 21.4 |
| 42658.9059837963 | 21.4 |
| 42658.92681712963 | 21.4 |
| 42658.947650462964 | 21.3 |
| 42658.9684837963 | 21.3 |
| 42658.98931712963 | 21.3 |
| 42659.010150462964 | 21.3 |
| 42659.0309837963 | 21.3 |
| 42659.05181712963 | 21.2 |
| 42659.072650462964 | 21.2 |
| 42659.0934837963 | 21.2 |
| 42659.11431712963 | 21.2 |
| 42659.135150462964 | 21.2 |
| 42659.1559837963 | 21.2 |
| 42659.17681712963 | 21.2 |
| 42659.197650462964 | 21.2 |
| 42659.2184837963 | 21.2 |
| 42659.23931712963 | 21.2 |
| 42659.260150462964 | 21.2 |
| 42659.2809837963 | 21.2 |
| 42659.30181712963 | 21.2 |
| 42659.322650462964 | 21.2 |
| 42659.3434837963 | 21.2 |
| 42659.36431712963 | 21.2 |
| 42659.385150462964 | 21.2 |
| 42659.4059837963 | 21.2 |
| 42659.42681712963 | 21.2 |
| 42659.447650462964 | 21.2 |
| 42659.4684837963 | 21.2 |
| 42659.48931712963 | 21.2 |
| 42659.510150462964 | 21.3 |
| 42659.5309837963 | 21.2 |
| 42659.55181712963 | 21.3 |
| 42659.572650462964 | 21.3 |
| 42659.5934837963 | 21.4 |
| 42659.61431712963 | 21.4 |
| 42659.635150462964 | 21.4 |
| 42659.6559837963 | 21.4 |
| 42659.67681712963 | 21.5 |
| 42659.697650462964 | 21.4 |
| 42659.7184837963 | 21.4 |
| 42659.73931712963 | 21.5 |
| 42659.760150462964 | 21.5 |
| 42659.7809837963 | 21.4 |
| 42659.80181712963 | 21.4 |
| 42659.822650462964 | 21.4 |
| 42659.8434837963 | 21.4 |
| 42659.86431712963 | 21.4 |
| 42659.885150462964 | 21.4 |
| 42659.9059837963 | 21.4 |
| 42659.92681712963 | 21.4 |
| 42659.947650462964 | 21.3 |
| 42659.9684837963 | 21.4 |
| 42659.98931712963 | 21.4 |
| 42660.010150462964 | 21.3 |
| 42660.0309837963 | 21.4 |
| 42660.05181712963 | 21.3 |
| 42660.072650462964 | 21.3 |
| 42660.0934837963 | 21.3 |
| 42660.11431712963 | 21.3 |
| 42660.135150462964 | 21.3 |
| 42660.1559837963 | 21.3 |
| 42660.17681712963 | 21.3 |
| 42660.197650462964 | 21.3 |
| 42660.2184837963 | 21.3 |
| 42660.23931712963 | 21.3 |
| 42660.260150462964 | 21.3 |
| 42660.2809837963 | 21.3 |
| 42660.30181712963 | 21.3 |
| 42660.322650462964 | 21.2 |
| 42660.3434837963 | 21.2 |
| 42660.36431712963 | 21.3 |
| 42660.385150462964 | 21.3 |
| 42660.4059837963 | 21.3 |
| 42660.42681712963 | 21.3 |
| 42660.447650462964 | 21.3 |
| 42660.4684837963 | 21.3 |
| 42660.48931712963 | 21.3 |
| 42660.510150462964 | 21.3 |
| 42660.5309837963 | 21.3 |
| 42660.55181712963 | 21.3 |
| 42660.572650462964 | 21.3 |
| 42660.5934837963 | 21.3 |
| 42660.61431712963 | 21.3 |
| 42660.635150462964 | 21.3 |
| 42660.6559837963 | 21.4 |
| 42660.67681712963 | 21.4 |
| 42660.697650462964 | 21.4 |
| 42660.7184837963 | 21.4 |
| 42660.73931712963 | 21.3 |
| 42660.760150462964 | 21.4 |
| 42660.7809837963 | 21.3 |
| 42660.80181712963 | 21.3 |
| 42660.822650462964 | 21.3 |
| 42660.8434837963 | 21.3 |
| 42660.86431712963 | 21.4 |
| 42660.885150462964 | 21.3 |
| 42660.9059837963 | 21.3 |
| 42660.92681712963 | 21.4 |
| 42660.947650462964 | 21.3 |
| 42660.9684837963 | 21.4 |
| 42660.98931712963 | 21.4 |
| 42661.010150462964 | 21.3 |
| 42661.0309837963 | 21.4 |
| 42661.05181712963 | 21.3 |
| 42661.072650462964 | 21.3 |
| 42661.0934837963 | 21.3 |
| 42661.11431712963 | 21.3 |
| 42661.135150462964 | 21.3 |
| 42661.1559837963 | 21.3 |
| 42661.17681712963 | 21.3 |
| 42661.197650462964 | 21.3 |
| 42661.2184837963 | 21.3 |
| 42661.23931712963 | 21.3 |
| 42661.260150462964 | 21.3 |
| 42661.2809837963 | 21.3 |
| 42661.30181712963 | 21.3 |
| 42661.322650462964 | 21.3 |
| 42661.3434837963 | 21.3 |
| 42661.36431712963 | 21.3 |
| 42661.385150462964 | 21.3 |
| 42661.4059837963 | 21.3 |
| 42661.42681712963 | 21.3 |
| 42661.447650462964 | 21.3 |
| 42661.4684837963 | 21.4 |
| 42661.48931712963 | 21.4 |
| 42661.510150462964 | 21.4 |
| 42661.5309837963 | 21.5 |
| 42661.55181712963 | 21.5 |
| 42661.572650462964 | 21.5 |
| 42661.5934837963 | 21.5 |
| 42661.61431712963 | 21.6 |
| 42661.635150462964 | 21.7 |
| 42661.6559837963 | 21.6 |
| 42661.67681712963 | 21.6 |
| 42661.697650462964 | 21.7 |
| 42661.7184837963 | 21.7 |
| 42661.73931712963 | 21.6 |
| 42661.760150462964 | 21.6 |
| 42661.7809837963 | 21.6 |
| 42661.80181712963 | 21.6 |
| 42661.822650462964 | 21.5 |
| 42661.8434837963 | 21.5 |
| 42661.86431712963 | 21.5 |
| 42661.885150462964 | 21.4 |
| 42661.9059837963 | 21.4 |
| 42661.92681712963 | 21.4 |
| 42661.947650462964 | 21.3 |
| 42661.9684837963 | 21.3 |
| 42661.98931712963 | 21.3 |
| 42662.010150462964 | 21.3 |
| 42662.0309837963 | 21.2 |
| 42662.05181712963 | 21.2 |
| 42662.072650462964 | 21.3 |
| 42662.0934837963 | 21.3 |
| 42662.11431712963 | 21.2 |
| 42662.135150462964 | 21.2 |
| 42662.1559837963 | 21.2 |
| 42662.17681712963 | 21.4 |
| 42662.197650462964 | 21.4 |
| 42662.2184837963 | 21.3 |
| 42662.23931712963 | 21.2 |
| 42662.260150462964 | 21.2 |
| 42662.2809837963 | 21.2 |
| 42662.30181712963 | 21.3 |
| 42662.322650462964 | 21.2 |
| 42662.3434837963 | 21.3 |
| 42662.36431712963 | 21.2 |
| 42662.385150462964 | 21.2 |
| 42662.4059837963 | 21.2 |
| 42662.42681712963 | 21.3 |
| 42662.447650462964 | 21.2 |
| 42662.4684837963 | 21.3 |
| 42662.48931712963 | 21.4 |
| 42662.510150462964 | 21.2 |
| 42662.5309837963 | 21.3 |
| 42662.55181712963 | 21.3 |
| 42662.572650462964 | 21.2 |
| 42662.5934837963 | 21.3 |
| 42662.61431712963 | 21.3 |
| 42662.635150462964 | 21.3 |
| 42662.6559837963 | 21.2 |
| 42662.67681712963 | 21.3 |
| 42662.697650462964 | 21.4 |
| 42662.7184837963 | 21.4 |
| 42662.73931712963 | 21.4 |
| 42662.760150462964 | 21.4 |
| 42662.7809837963 | 21.5 |
| 42662.80181712963 | 21.4 |
| 42662.822650462964 | 21.4 |
| 42662.8434837963 | 21.4 |
| 42662.86431712963 | 21.4 |
| 42662.885150462964 | 21.4 |
| 42662.9059837963 | 21.4 |
| 42662.92681712963 | 21.4 |
| 42662.947650462964 | 21.3 |
| 42662.9684837963 | 21.4 |
| 42662.98931712963 | 21.3 |
| 42663.010150462964 | 21.3 |
| 42663.0309837963 | 21.3 |
| 42663.05181712963 | 21.3 |
| 42663.072650462964 | 21.3 |
| 42663.0934837963 | 21.3 |
| 42663.11431712963 | 21.3 |
| 42663.135150462964 | 21.3 |
| 42663.1559837963 | 21.3 |
| 42663.17681712963 | 21.3 |
| 42663.197650462964 | 21.2 |
| 42663.2184837963 | 21.2 |
| 42663.23931712963 | 21.2 |
| 42663.260150462964 | 21.3 |
| 42663.2809837963 | 21.2 |
| 42663.30181712963 | 21.2 |
| 42663.322650462964 | 21.2 |
| 42663.3434837963 | 21.3 |
| 42663.36431712963 | 21.3 |
| 42663.385150462964 | 21.2 |
| 42663.4059837963 | 21.3 |
| 42663.42681712963 | 21.2 |
| 42663.447650462964 | 21.2 |
| 42663.4684837963 | 21.2 |
| 42663.48931712963 | 21.2 |
| 42663.510150462964 | 21.2 |
| 42663.5309837963 | 21.3 |
| 42663.55181712963 | 21.3 |
| 42663.572650462964 | 21.3 |
| 42663.5934837963 | 21.4 |
| 42663.61431712963 | 21.4 |
| 42663.635150462964 | 21.5 |
| 42663.6559837963 | 21.4 |
| 42663.67681712963 | 21.5 |
| 42663.697650462964 | 21.5 |
| 42663.7184837963 | 21.4 |
| 42663.73931712963 | 21.5 |
| 42663.760150462964 | 21.5 |
| 42663.7809837963 | 21.4 |
| 42663.80181712963 | 21.4 |
| 42663.822650462964 | 21.4 |
| 42663.8434837963 | 21.4 |
| 42663.86431712963 | 21.4 |
| 42663.885150462964 | 21.3 |
| 42663.9059837963 | 21.3 |
| 42663.92681712963 | 21.3 |
| 42663.947650462964 | 21.2 |
| 42663.9684837963 | 21.3 |
| 42663.98931712963 | 21.2 |
| 42664.010150462964 | 21.2 |
| 42664.0309837963 | 21.2 |
| 42664.05181712963 | 21.2 |
| 42664.072650462964 | 21.2 |
| 42664.0934837963 | 21.2 |
| 42664.11431712963 | 21.2 |
| 42664.135150462964 | 21.2 |
| 42664.1559837963 | 21.3 |
| 42664.17681712963 | 21.3 |
| 42664.197650462964 | 21.2 |
| 42664.2184837963 | 21.2 |
| 42664.23931712963 | 21.2 |
| 42664.260150462964 | 21.2 |
| 42664.2809837963 | 21.2 |
| 42664.30181712963 | 21.1 |
| 42664.322650462964 | 21.2 |
| 42664.3434837963 | 21.2 |
| 42664.36431712963 | 21.1 |
| 42664.385150462964 | 21.2 |
| 42664.4059837963 | 21.1 |
| 42664.42681712963 | 21.1 |
| 42664.447650462964 | 21.1 |
| 42664.4684837963 | 21.1 |
| 42664.48931712963 | 21.2 |
| 42664.510150462964 | 21.1 |
| 42664.5309837963 | 21.2 |
| 42664.55181712963 | 21.2 |
| 42664.572650462964 | 21.3 |
| 42664.5934837963 | 21.3 |
| 42664.61431712963 | 21.4 |
| 42664.635150462964 | 21.4 |
| 42664.6559837963 | 21.4 |
| 42664.67681712963 | 21.4 |
| 42664.697650462964 | 21.4 |
| 42664.7184837963 | 21.4 |
| 42664.73931712963 | 21.4 |
| 42664.760150462964 | 21.3 |
| 42664.7809837963 | 21.4 |
| 42664.80181712963 | 21.3 |
| 42664.822650462964 | 21.3 |
| 42664.8434837963 | 21.3 |
| 42664.86431712963 | 21.3 |
| 42664.885150462964 | 21.3 |
| 42664.9059837963 | 21.3 |
| 42664.92681712963 | 21.2 |
| 42664.947650462964 | 21.2 |
| 42664.9684837963 | 21.2 |
| 42664.98931712963 | 21.2 |
| 42665.010150462964 | 21.2 |
| 42665.0309837963 | 21.2 |
| 42665.05181712963 | 21.2 |
| 42665.072650462964 | 21.2 |
| 42665.0934837963 | 21.2 |
| 42665.11431712963 | 21.1 |
| 42665.135150462964 | 21.1 |
| 42665.1559837963 | 21.1 |
| 42665.17681712963 | 21.2 |
| 42665.197650462964 | 21.1 |
| 42665.2184837963 | 21.1 |
| 42665.23931712963 | 21.1 |
| 42665.260150462964 | 21 |
| 42665.2809837963 | 21.1 |
| 42665.30181712963 | 21 |
| 42665.322650462964 | 21 |
| 42665.3434837963 | 21 |
| 42665.36431712963 | 21 |
| 42665.385150462964 | 21 |
| 42665.4059837963 | 21 |
| 42665.42681712963 | 21.1 |
| 42665.447650462964 | 21 |
| 42665.4684837963 | 21 |
| 42665.48931712963 | 21.1 |
| 42665.510150462964 | 21.1 |
| 42665.5309837963 | 21.2 |
| 42665.55181712963 | 21.2 |
| 42665.572650462964 | 21.2 |
| 42665.5934837963 | 21.3 |
| 42665.61431712963 | 21.3 |
| 42665.635150462964 | 21.3 |
| 42665.6559837963 | 21.3 |
| 42665.67681712963 | 21.4 |
| 42665.697650462964 | 21.4 |
| 42665.7184837963 | 21.4 |
| 42665.73931712963 | 21.4 |
| 42665.760150462964 | 21.4 |
| 42665.7809837963 | 21.4 |
| 42665.80181712963 | 21.3 |
| 42665.822650462964 | 21.3 |
| 42665.8434837963 | 21.3 |
| 42665.86431712963 | 21.2 |
| 42665.885150462964 | 21.3 |
| 42665.9059837963 | 21.2 |
| 42665.92681712963 | 21.2 |
| 42665.947650462964 | 21.2 |
| 42665.9684837963 | 21.2 |
| 42665.98931712963 | 21.2 |
| 42666.010150462964 | 21.1 |
| 42666.0309837963 | 21.2 |
| 42666.05181712963 | 21.1 |
| 42666.072650462964 | 21.1 |
| 42666.0934837963 | 21.1 |
| 42666.11431712963 | 21.1 |
| 42666.135150462964 | 21.1 |
| 42666.1559837963 | 21.1 |
| 42666.17681712963 | 21 |
| 42666.197650462964 | 21.1 |
| 42666.2184837963 | 21.1 |
| 42666.23931712963 | 21.1 |
| 42666.260150462964 | 21.1 |
| 42666.2809837963 | 21.1 |
| 42666.30181712963 | 21 |
| 42666.322650462964 | 21.1 |
| 42666.3434837963 | 21 |
| 42666.36431712963 | 21 |
| 42666.385150462964 | 21 |
| 42666.4059837963 | 21 |
| 42666.42681712963 | 21.1 |
| 42666.447650462964 | 21.1 |
| 42666.4684837963 | 21 |
| 42666.48931712963 | 21 |
| 42666.510150462964 | 21 |
| 42666.5309837963 | 21 |
| 42666.55181712963 | 21.1 |
| 42666.572650462964 | 21.1 |
| 42666.5934837963 | 21.1 |
| 42666.61431712963 | 21.1 |
| 42666.635150462964 | 21.1 |
| 42666.6559837963 | 21.1 |
| 42666.67681712963 | 21.1 |
| 42666.697650462964 | 21.1 |
| 42666.7184837963 | 21.1 |
| 42666.73931712963 | 21.1 |
| 42666.760150462964 | 21.2 |
| 42666.7809837963 | 21.1 |
| 42666.80181712963 | 21.1 |
| 42666.822650462964 | 21.2 |
| 42666.8434837963 | 21.1 |
| 42666.86431712963 | 21.1 |
| 42666.885150462964 | 21.1 |
| 42666.9059837963 | 21.1 |
| 42666.92681712963 | 21.1 |
| 42666.947650462964 | 21.1 |
| 42666.9684837963 | 21.1 |
| 42666.98931712963 | 21.1 |
| 42667.010150462964 | 21.1 |
| 42667.0309837963 | 21.1 |
| 42667.05181712963 | 21.1 |
| 42667.072650462964 | 21.1 |
| 42667.0934837963 | 21.1 |
| 42667.11431712963 | 21.1 |
| 42667.135150462964 | 21.1 |
| 42667.1559837963 | 21.1 |
| 42667.17681712963 | 21.1 |
| 42667.197650462964 | 21.1 |
| 42667.2184837963 | 21 |
| 42667.23931712963 | 21.1 |
| 42667.260150462964 | 21 |
| 42667.2809837963 | 21.1 |
| 42667.30181712963 | 21.1 |
| 42667.322650462964 | 21.1 |
| 42667.3434837963 | 21.1 |
| 42667.36431712963 | 21.1 |
| 42667.385150462964 | 21.1 |
| 42667.4059837963 | 21.1 |
| 42667.42681712963 | 21.1 |
| 42667.447650462964 | 21.1 |
| 42667.4684837963 | 21.1 |
| 42667.48931712963 | 21.1 |
| 42667.510150462964 | 21.1 |
| 42667.5309837963 | 21.1 |
| 42667.55181712963 | 21.1 |
| 42667.572650462964 | 21.1 |
| 42667.5934837963 | 21.2 |
| 42667.61431712963 | 21.2 |
| 42667.635150462964 | 21.2 |
| 42667.6559837963 | 21.2 |
| 42667.67681712963 | 21.2 |
| 42667.697650462964 | 21.3 |
| 42667.7184837963 | 21.3 |
| 42667.73931712963 | 21.2 |
| 42667.760150462964 | 21.3 |
| 42667.7809837963 | 21.2 |
| 42667.80181712963 | 21.3 |
| 42667.822650462964 | 21.2 |
| 42667.8434837963 | 21.2 |
| 42667.86431712963 | 21.3 |
| 42667.885150462964 | 21.3 |
| 42667.9059837963 | 21.2 |
| 42667.92681712963 | 21.2 |
| 42667.947650462964 | 21.2 |
| 42667.9684837963 | 21.2 |
| 42667.98931712963 | 21.2 |
| 42668.010150462964 | 21.2 |
| 42668.0309837963 | 21.2 |
| 42668.05181712963 | 21.2 |
| 42668.072650462964 | 21.2 |
| 42668.0934837963 | 21.2 |
| 42668.11431712963 | 21.2 |
| 42668.135150462964 | 21.2 |
| 42668.1559837963 | 21.2 |
| 42668.17681712963 | 21.2 |
| 42668.197650462964 | 21.2 |
| 42668.2184837963 | 21.2 |
| 42668.23931712963 | 21.2 |
| 42668.260150462964 | 21.2 |
| 42668.2809837963 | 21.2 |
| 42668.30181712963 | 21.2 |
| 42668.322650462964 | 21.2 |
| 42668.3434837963 | 21.2 |
| 42668.36431712963 | 21.2 |
| 42668.385150462964 | 21.2 |
| 42668.4059837963 | 21.2 |
| 42668.42681712963 | 21.2 |
| 42668.447650462964 | 21.2 |
| 42668.4684837963 | 21.2 |
| 42668.48931712963 | 21.2 |
| 42668.510150462964 | 21.2 |
| 42668.5309837963 | 21.2 |
| 42668.55181712963 | 21.2 |
| 42668.572650462964 | 21.2 |
| 42668.5934837963 | 21.2 |
| 42668.61431712963 | 21.2 |
| 42668.635150462964 | 21.2 |
| 42668.6559837963 | 21.2 |
| 42668.67681712963 | 21.2 |
| 42668.697650462964 | 21.3 |
| 42668.7184837963 | 21.3 |
| 42668.73931712963 | 21.3 |
| 42668.760150462964 | 21.3 |
| 42668.7809837963 | 21.3 |
| 42668.80181712963 | 21.2 |
| 42668.822650462964 | 21.3 |
| 42668.8434837963 | 21.2 |
| 42668.86431712963 | 21.3 |
| 42668.885150462964 | 21.3 |
| 42668.9059837963 | 21.3 |
| 42668.92681712963 | 21.3 |
| 42668.947650462964 | 21.3 |
| 42668.9684837963 | 21.3 |
| 42668.98931712963 | 21.3 |
| 42669.010150462964 | 21.2 |
| 42669.0309837963 | 21.3 |
| 42669.05181712963 | 21.3 |
| 42669.072650462964 | 21.2 |
| 42669.0934837963 | 21.3 |
| 42669.11431712963 | 21.3 |
| 42669.135150462964 | 21.3 |
| 42669.1559837963 | 21.3 |
| 42669.17681712963 | 21.4 |
| 42669.197650462964 | 21.4 |
| 42669.2184837963 | 21.3 |
| 42669.23931712963 | 21.2 |
| 42669.260150462964 | 21.3 |
| 42669.2809837963 | 21.2 |
| 42669.30181712963 | 21.2 |
| 42669.322650462964 | 21.3 |
| 42669.3434837963 | 21.2 |
| 42669.36431712963 | 21.2 |
| 42669.385150462964 | 21.2 |
| 42669.4059837963 | 21.2 |
| 42669.42681712963 | 21.3 |
| 42669.447650462964 | 21.2 |
| 42669.4684837963 | 21.3 |
| 42669.48931712963 | 21.3 |
| 42669.510150462964 | 21.4 |
| 42669.5309837963 | 21.3 |
| 42669.55181712963 | 21.2 |
| 42669.572650462964 | 21.3 |
| 42669.5934837963 | 21.3 |
| 42669.61431712963 | 21.4 |
| 42669.635150462964 | 21.3 |
| 42669.6559837963 | 21.4 |
| 42669.67681712963 | 21.5 |
| 42669.697650462964 | 21.5 |
| 42669.7184837963 | 21.4 |
| 42669.73931712963 | 21.4 |
| 42669.760150462964 | 21.4 |
| 42669.7809837963 | 21.4 |
| 42669.80181712963 | 21.4 |
| 42669.822650462964 | 21.4 |
| 42669.8434837963 | 21.4 |
| 42669.86431712963 | 21.4 |
| 42669.885150462964 | 21.3 |
| 42669.9059837963 | 21.4 |
| 42669.92681712963 | 21.3 |
| 42669.947650462964 | 21.4 |
| 42669.9684837963 | 21.3 |
| 42669.98931712963 | 21.3 |
| 42670.010150462964 | 21.3 |
| 42670.0309837963 | 21.3 |
| 42670.05181712963 | 21.3 |
| 42670.072650462964 | 21.3 |
| 42670.0934837963 | 21.3 |
| 42670.11431712963 | 21.3 |
| 42670.135150462964 | 21.3 |
| 42670.1559837963 | 21.3 |
| 42670.17681712963 | 21.2 |
| 42670.197650462964 | 21.3 |
| 42670.2184837963 | 21.2 |
| 42670.23931712963 | 21.3 |
| 42670.260150462964 | 21.3 |
| 42670.2809837963 | 21.2 |
| 42670.30181712963 | 21.3 |
| 42670.322650462964 | 21.2 |
| 42670.3434837963 | 21.2 |
| 42670.36431712963 | 21.2 |
| 42670.385150462964 | 21.3 |
| 42670.4059837963 | 21.2 |
| 42670.42681712963 | 21.2 |
| 42670.447650462964 | 21.2 |
| 42670.4684837963 | 21.2 |
| 42670.48931712963 | 21.2 |
| 42670.510150462964 | 21.2 |
| 42670.5309837963 | 21.2 |
| 42670.55181712963 | 21.3 |
| 42670.572650462964 | 21.3 |
| 42670.5934837963 | 21.3 |
| 42670.61431712963 | 21.3 |
| 42670.635150462964 | 21.3 |
| 42670.6559837963 | 21.3 |
| 42670.67681712963 | 21.4 |
| 42670.697650462964 | 21.4 |
| 42670.7184837963 | 21.4 |
| 42670.73931712963 | 21.4 |
| 42670.760150462964 | 21.4 |
| 42670.7809837963 | 21.4 |
| 42670.80181712963 | 21.3 |
| 42670.822650462964 | 21.3 |
| 42670.8434837963 | 21.3 |
| 42670.86431712963 | 21.3 |
| 42670.885150462964 | 21.3 |
| 42670.9059837963 | 21.2 |
| 42670.92681712963 | 21.2 |
| 42670.947650462964 | 21.2 |
| 42670.9684837963 | 21.2 |
| 42670.98931712963 | 21.2 |
| 42671.010150462964 | 21.2 |
| 42671.0309837963 | 21.2 |
| 42671.05181712963 | 21.1 |
| 42671.072650462964 | 21.1 |
| 42671.0934837963 | 21.1 |
| 42671.11431712963 | 21.1 |
| 42671.135150462964 | 21.1 |
| 42671.1559837963 | 21.1 |
| 42671.17681712963 | 21.1 |
| 42671.197650462964 | 21.1 |
| 42671.2184837963 | 21.2 |
| 42671.23931712963 | 21.1 |
| 42671.260150462964 | 21.1 |
| 42671.2809837963 | 21.1 |
| 42671.30181712963 | 21.1 |
| 42671.322650462964 | 21.1 |
| 42671.3434837963 | 21.2 |
| 42671.36431712963 | 21.2 |
| 42671.385150462964 | 21 |
| 42671.4059837963 | 21.1 |
| 42671.42681712963 | 21.1 |
| 42671.447650462964 | 21.1 |
| 42671.4684837963 | 21.1 |
| 42671.48931712963 | 21.2 |
| 42671.510150462964 | 21.2 |
| 42671.5309837963 | 21.2 |
| 42671.55181712963 | 21.2 |
| 42671.572650462964 | 21.2 |
| 42671.5934837963 | 21.3 |
| 42671.61431712963 | 21.3 |
| 42671.635150462964 | 21.4 |
| 42671.6559837963 | 21.4 |
| 42671.67681712963 | 21.4 |
| 42671.697650462964 | 21.4 |
| 42671.7184837963 | 21.4 |
| 42671.73931712963 | 21.4 |
| 42671.760150462964 | 21.4 |
| 42671.7809837963 | 21.3 |
| 42671.80181712963 | 21.3 |
| 42671.822650462964 | 21.3 |
| 42671.8434837963 | 21.3 |
| 42671.86431712963 | 21.2 |
| 42671.885150462964 | 21.2 |
| 42671.9059837963 | 21.2 |
| 42671.92681712963 | 21.2 |
| 42671.947650462964 | 21.2 |
| 42671.9684837963 | 21.2 |
| 42671.98931712963 | 21.1 |
| 42672.010150462964 | 21.1 |
| 42672.0309837963 | 21.1 |
| 42672.05181712963 | 21.1 |
| 42672.072650462964 | 21.1 |
| 42672.0934837963 | 21.1 |
| 42672.11431712963 | 21.1 |
| 42672.135150462964 | 21.1 |
| 42672.1559837963 | 21.1 |
| 42672.17681712963 | 21.1 |
| 42672.197650462964 | 21.1 |
| 42672.2184837963 | 21.1 |
| 42672.23931712963 | 21.1 |
| 42672.260150462964 | 21 |
| 42672.2809837963 | 21.1 |
| 42672.30181712963 | 21.1 |
| 42672.322650462964 | 21.1 |
| 42672.3434837963 | 21.1 |
| 42672.36431712963 | 21.1 |
| 42672.385150462964 | 21 |
| 42672.4059837963 | 21 |
| 42672.42681712963 | 21 |
| 42672.447650462964 | 21.1 |
| 42672.4684837963 | 21.1 |
| 42672.48931712963 | 21.1 |
| 42672.510150462964 | 21.1 |
| 42672.5309837963 | 21.1 |
| 42672.55181712963 | 21.1 |
| 42672.572650462964 | 21.2 |
| 42672.5934837963 | 21.2 |
| 42672.61431712963 | 21.2 |
| 42672.635150462964 | 21.2 |
| 42672.6559837963 | 21.3 |
| 42672.67681712963 | 21.3 |
| 42672.697650462964 | 21.3 |
| 42672.7184837963 | 21.3 |
| 42672.73931712963 | 21.3 |
| 42672.760150462964 | 21.3 |
| 42672.7809837963 | 21.3 |
| 42672.80181712963 | 21.2 |
| 42672.822650462964 | 21.2 |
| 42672.8434837963 | 21.2 |
| 42672.86431712963 | 21.2 |
| 42672.885150462964 | 21.2 |
| 42672.9059837963 | 21.2 |
| 42672.92681712963 | 21.2 |
| 42672.947650462964 | 21.2 |
| 42672.9684837963 | 21.2 |
| 42672.98931712963 | 21.2 |
| 42673.010150462964 | 21.2 |
| 42673.0309837963 | 21.2 |
| 42673.05181712963 | 21.2 |
| 42673.072650462964 | 21.2 |
| 42673.0934837963 | 21.2 |
| 42673.11431712963 | 21.1 |
| 42673.135150462964 | 21.2 |
| 42673.1559837963 | 21.2 |
| 42673.17681712963 | 21.2 |
| 42673.197650462964 | 21.2 |
| 42673.2184837963 | 21.1 |
| 42673.23931712963 | 21.2 |
| 42673.260150462964 | 21.1 |
| 42673.2809837963 | 21.1 |
| 42673.30181712963 | 21.1 |
| 42673.322650462964 | 21.2 |
| 42673.3434837963 | 21.1 |
| 42673.36431712963 | 21.1 |
| 42673.385150462964 | 21.1 |
| 42673.4059837963 | 21.1 |
| 42673.42681712963 | 21.1 |
| 42673.447650462964 | 21.1 |
| 42673.4684837963 | 21.1 |
| 42673.48931712963 | 21.1 |
| 42673.510150462964 | 21.1 |
| 42673.5309837963 | 21.1 |
| 42673.55181712963 | 21.1 |
| 42673.572650462964 | 21.2 |
| 42673.5934837963 | 21.2 |
| 42673.61431712963 | 21.2 |
| 42673.635150462964 | 21.2 |
| 42673.6559837963 | 21.2 |
| 42673.67681712963 | 21.3 |
| 42673.697650462964 | 21.3 |
| 42673.7184837963 | 21.3 |
| 42673.73931712963 | 21.3 |
| 42673.760150462964 | 21.3 |
| 42673.7809837963 | 21.3 |
| 42673.80181712963 | 21.2 |
| 42673.822650462964 | 21.2 |
| 42673.8434837963 | 21.2 |
| 42673.86431712963 | 21.2 |
| 42673.885150462964 | 21.2 |
| 42673.9059837963 | 21.2 |
| 42673.92681712963 | 21.1 |
| 42673.947650462964 | 21.1 |
| 42673.9684837963 | 21.1 |
| 42673.98931712963 | 21.1 |
| 42674.010150462964 | 21.1 |
| 42674.0309837963 | 21.1 |
| 42674.05181712963 | 21.1 |
| 42674.072650462964 | 21.1 |
| 42674.0934837963 | 21.1 |
| 42674.11431712963 | 21.1 |
| 42674.135150462964 | 21 |
| 42674.1559837963 | 21 |
| 42674.17681712963 | 21 |
| 42674.197650462964 | 21 |
| 42674.2184837963 | 21.1 |
| 42674.23931712963 | 21 |
| 42674.260150462964 | 21.1 |
| 42674.2809837963 | 21.1 |
| 42674.30181712963 | 21.1 |
| 42674.322650462964 | 21 |
| 42674.3434837963 | 21.1 |
| 42674.36431712963 | 21 |
| 42674.385150462964 | 21.1 |
| 42674.4059837963 | 21 |
| 42674.42681712963 | 21 |
| 42674.447650462964 | 20.9 |
| 42674.4684837963 | 21 |
| 42674.48931712963 | 21 |
| 42674.510150462964 | 21 |
| 42674.5309837963 | 21 |
| 42674.55181712963 | 21.1 |
| 42674.572650462964 | 21.1 |
| 42674.5934837963 | 21 |
| 42674.61431712963 | 21 |
| 42674.635150462964 | 21.1 |
| 42674.6559837963 | 21.1 |
| 42674.67681712963 | 21.1 |
| 42674.697650462964 | 21.1 |
| 42674.7184837963 | 21.1 |
| 42674.73931712963 | 21.1 |
| 42674.760150462964 | 21.1 |
| 42674.7809837963 | 21.1 |
| 42674.80181712963 | 21.1 |
| 42674.822650462964 | 21 |
| 42674.8434837963 | 21 |
| 42674.86431712963 | 21.1 |
| 42674.885150462964 | 21.1 |
| 42674.9059837963 | 21 |
| 42674.92681712963 | 21 |
| 42674.947650462964 | 21 |
| 42674.9684837963 | 21 |
| 42674.98931712963 | 21 |
| 42675.010150462964 | 21 |
| 42675.0309837963 | 21 |
| 42675.05181712963 | 21 |
| 42675.072650462964 | 21 |
| 42675.0934837963 | 21 |
| 42675.11431712963 | 21 |
| 42675.135150462964 | 21 |
| 42675.1559837963 | 21 |
| 42675.17681712963 | 21 |
| 42675.197650462964 | 21 |
| 42675.2184837963 | 21 |
| 42675.23931712963 | 21 |
| 42675.260150462964 | 21 |
| 42675.2809837963 | 21 |
| 42675.30181712963 | 21 |
| 42675.322650462964 | 21 |
| 42675.3434837963 | 21 |
| 42675.36431712963 | 21 |
| 42675.385150462964 | 21 |
| 42675.4059837963 | 21 |
| 42675.42681712963 | 21 |
| 42675.447650462964 | 20.9 |
| 42675.4684837963 | 20.9 |
| 42675.48931712963 | 21 |
| 42675.510150462964 | 21 |
| 42675.5309837963 | 21 |
| 42675.55181712963 | 21 |
| 42675.572650462964 | 21 |
| 42675.5934837963 | 21 |
| 42675.61431712963 | 21 |
| 42675.635150462964 | 21 |
| 42675.6559837963 | 21 |
| 42675.67681712963 | 21.1 |
| 42675.697650462964 | 21.1 |
| 42675.7184837963 | 21.1 |
| 42675.73931712963 | 21.1 |
| 42675.760150462964 | 21.1 |
| 42675.7809837963 | 21.1 |
| 42675.80181712963 | 21.1 |
| 42675.822650462964 | 21.1 |
| 42675.8434837963 | 21.1 |
| 42675.86431712963 | 21.1 |
| 42675.885150462964 | 21 |
| 42675.9059837963 | 21 |
| 42675.92681712963 | 21 |
| 42675.947650462964 | 21 |
| 42675.9684837963 | 21 |
| 42675.98931712963 | 21 |
| 42676.010150462964 | 21 |
| 42676.0309837963 | 21 |
| 42676.05181712963 | 21 |
| 42676.072650462964 | 21 |
| 42676.0934837963 | 21 |
| 42676.11431712963 | 21 |
| 42676.135150462964 | 21 |
| 42676.1559837963 | 21 |
| 42676.17681712963 | 21 |
| 42676.197650462964 | 21 |
| 42676.2184837963 | 21.2 |
| 42676.23931712963 | 21.2 |
| 42676.260150462964 | 21.1 |
| 42676.2809837963 | 21.1 |
| 42676.30181712963 | 21.1 |
| 42676.322650462964 | 21 |
| 42676.3434837963 | 21.1 |
| 42676.36431712963 | 21.1 |
| 42676.385150462964 | 21 |
| 42676.4059837963 | 21 |
| 42676.42681712963 | 21.1 |
| 42676.447650462964 | 21 |
| 42676.4684837963 | 21.1 |
| 42676.48931712963 | 21.1 |
| 42676.510150462964 | 21.1 |
| 42676.5309837963 | 21.2 |
| 42676.55181712963 | 21.2 |
| 42676.572650462964 | 21.2 |
| 42676.5934837963 | 21.2 |
| 42676.61431712963 | 21.2 |
| 42676.635150462964 | 21.3 |
| 42676.6559837963 | 21.3 |
| 42676.67681712963 | 21.4 |
| 42676.697650462964 | 21.3 |
| 42676.7184837963 | 21.3 |
| 42676.73931712963 | 21.3 |
| 42676.760150462964 | 21.3 |
| 42676.7809837963 | 21.3 |
| 42676.80181712963 | 21.3 |
| 42676.822650462964 | 21.2 |
| 42676.8434837963 | 21.2 |
| 42676.86431712963 | 21.2 |
| 42676.885150462964 | 21.2 |
| 42676.9059837963 | 21.2 |
| 42676.92681712963 | 21.2 |
| 42676.947650462964 | 21.2 |
| 42676.9684837963 | 21.2 |
| 42676.98931712963 | 21.1 |
| 42677.010150462964 | 21.2 |
| 42677.0309837963 | 21.2 |
| 42677.05181712963 | 21.1 |
| 42677.072650462964 | 21.2 |
| 42677.0934837963 | 21.1 |
| 42677.11431712963 | 21.1 |
| 42677.135150462964 | 21.1 |
| 42677.1559837963 | 21.1 |
| 42677.17681712963 | 21.1 |
| 42677.197650462964 | 21.1 |
| 42677.2184837963 | 21.1 |
| 42677.23931712963 | 21.1 |
| 42677.260150462964 | 21.1 |
| 42677.2809837963 | 21.1 |
| 42677.30181712963 | 21.1 |
| 42677.322650462964 | 21.1 |
| 42677.3434837963 | 21.1 |
| 42677.36431712963 | 21.1 |
| 42677.385150462964 | 21.1 |
| 42677.4059837963 | 21.1 |
| 42677.42681712963 | 21.1 |
| 42677.447650462964 | 21.1 |
| 42677.4684837963 | 21.1 |
| 42677.48931712963 | 21.1 |
| 42677.510150462964 | 21.1 |
| 42677.5309837963 | 21.1 |
| 42677.55181712963 | 21.1 |
| 42677.572650462964 | 21.2 |
| 42677.5934837963 | 21.2 |
| 42677.61431712963 | 21.2 |
| 42677.635150462964 | 21.3 |
| 42677.6559837963 | 21.4 |
| 42677.67681712963 | 21.3 |
| 42677.697650462964 | 21.4 |
| 42677.7184837963 | 21.4 |
| 42677.73931712963 | 21.4 |
| 42677.760150462964 | 21.4 |
| 42677.7809837963 | 21.3 |
| 42677.80181712963 | 21.3 |
| 42677.822650462964 | 21.3 |
| 42677.8434837963 | 21.2 |
| 42677.86431712963 | 21.2 |
| 42677.885150462964 | 21.2 |
| 42677.9059837963 | 21.2 |
| 42677.92681712963 | 21.2 |
| 42677.947650462964 | 21.2 |
| 42677.9684837963 | 21.2 |
| 42677.98931712963 | 21.1 |
| 42678.010150462964 | 21.2 |
| 42678.0309837963 | 21.1 |
| 42678.05181712963 | 21.1 |
| 42678.072650462964 | 21.2 |
| 42678.0934837963 | 21.1 |
| 42678.11431712963 | 21.1 |
| 42678.135150462964 | 21.1 |
| 42678.1559837963 | 21 |
| 42678.17681712963 | 21 |
| 42678.197650462964 | 21.1 |
| 42678.2184837963 | 21 |
| 42678.23931712963 | 21 |
| 42678.260150462964 | 21 |
| 42678.2809837963 | 21 |
| 42678.30181712963 | 21 |
| 42678.322650462964 | 21 |
| 42678.3434837963 | 21 |
| 42678.36431712963 | 20.9 |
| 42678.385150462964 | 21 |
| 42678.4059837963 | 21 |
| 42678.42681712963 | 21 |
| 42678.447650462964 | 21 |
| 42678.4684837963 | 20.9 |
| 42678.48931712963 | 21 |
| 42678.510150462964 | 21 |
| 42678.5309837963 | 21 |
| 42678.55181712963 | 21 |
| 42678.572650462964 | 21.1 |
| 42678.5934837963 | 21.1 |
| 42678.61431712963 | 21.2 |
| 42678.635150462964 | 21.2 |
| 42678.6559837963 | 21.2 |
| 42678.67681712963 | 21.2 |
| 42678.697650462964 | 21.2 |
| 42678.7184837963 | 21.2 |
| 42678.73931712963 | 21.2 |
| 42678.760150462964 | 21.2 |
| 42678.7809837963 | 21.2 |
| 42678.80181712963 | 21.1 |
| 42678.822650462964 | 21.2 |
| 42678.8434837963 | 21.2 |
| 42678.86431712963 | 21.1 |
| 42678.885150462964 | 21.1 |
| 42678.9059837963 | 21.1 |
| 42678.92681712963 | 21.1 |
| 42678.947650462964 | 21.1 |
| 42678.9684837963 | 21.1 |
| 42678.98931712963 | 21.1 |
| 42679.010150462964 | 21.1 |
| 42679.0309837963 | 21.1 |
| 42679.05181712963 | 21.1 |
| 42679.072650462964 | 21 |
| 42679.0934837963 | 21.1 |
| 42679.11431712963 | 21.1 |
| 42679.135150462964 | 21.1 |
| 42679.1559837963 | 21 |
| 42679.17681712963 | 21.1 |
| 42679.197650462964 | 21.1 |
| 42679.2184837963 | 21.1 |
| 42679.23931712963 | 21 |
| 42679.260150462964 | 21.1 |
| 42679.2809837963 | 21.1 |
| 42679.30181712963 | 21.1 |
| 42679.322650462964 | 21.1 |
| 42679.3434837963 | 21.1 |
| 42679.36431712963 | 21.1 |
| 42679.385150462964 | 21.1 |
| 42679.4059837963 | 21.1 |
| 42679.42681712963 | 21.1 |
| 42679.447650462964 | 21.1 |
| 42679.4684837963 | 21.1 |
| 42679.48931712963 | 21.1 |
| 42679.510150462964 | 21.1 |
| 42679.5309837963 | 21.1 |
| 42679.55181712963 | 21.2 |
| 42679.572650462964 | 21.2 |
| 42679.5934837963 | 21.2 |
| 42679.61431712963 | 21.2 |
| 42679.635150462964 | 21.2 |
| 42679.6559837963 | 21.2 |
| 42679.67681712963 | 21.1 |
| 42679.697650462964 | 21.2 |
| 42679.7184837963 | 21.2 |
| 42679.73931712963 | 21.2 |
| 42679.760150462964 | 21.2 |
| 42679.7809837963 | 21.2 |
| 42679.80181712963 | 21.2 |
| 42679.822650462964 | 21.2 |
| 42679.8434837963 | 21.2 |
| 42679.86431712963 | 21.2 |
| 42679.885150462964 | 21.1 |
| 42679.9059837963 | 21.2 |
| 42679.92681712963 | 21.1 |
| 42679.947650462964 | 21.1 |
| 42679.9684837963 | 21.1 |
| 42679.98931712963 | 21.1 |
| 42680.010150462964 | 21 |
| 42680.0309837963 | 21.1 |
| 42680.05181712963 | 21.1 |
| 42680.072650462964 | 21.1 |
| 42680.0934837963 | 21.1 |
| 42680.11431712963 | 21.1 |
| 42680.135150462964 | 21.1 |
| 42680.1559837963 | 21 |
| 42680.17681712963 | 21 |
| 42680.197650462964 | 21 |
| 42680.2184837963 | 21.1 |
| 42680.23931712963 | 21 |
| 42680.260150462964 | 21 |
| 42680.2809837963 | 21 |
| 42680.30181712963 | 21 |
| 42680.322650462964 | 21 |
| 42680.3434837963 | 21 |
| 42680.36431712963 | 21 |
| 42680.385150462964 | 21 |
| 42680.4059837963 | 20.9 |
| 42680.42681712963 | 20.9 |
| 42680.447650462964 | 21 |
| 42680.4684837963 | 20.9 |
| 42680.48931712963 | 21 |
| 42680.510150462964 | 21 |
| 42680.5309837963 | 21 |
| 42680.55181712963 | 21 |
| 42680.572650462964 | 21 |
| 42680.5934837963 | 21 |
| 42680.61431712963 | 21 |
| 42680.635150462964 | 21 |
| 42680.6559837963 | 21 |
| 42680.67681712963 | 21.1 |
| 42680.697650462964 | 21 |
| 42680.7184837963 | 21 |
| 42680.73931712963 | 21 |
| 42680.760150462964 | 21 |
| 42680.7809837963 | 21 |
| 42680.80181712963 | 21 |
| 42680.822650462964 | 21 |
| 42680.8434837963 | 20.9 |
| 42680.86431712963 | 21 |
| 42680.885150462964 | 20.9 |
| 42680.9059837963 | 20.9 |
| 42680.92681712963 | 21 |
| 42680.947650462964 | 20.9 |
| 42680.9684837963 | 21 |
| 42680.98931712963 | 21 |
| 42681.010150462964 | 21 |
| 42681.0309837963 | 21 |
| 42681.05181712963 | 20.9 |
| 42681.072650462964 | 20.9 |
| 42681.0934837963 | 20.9 |
| 42681.11431712963 | 20.9 |
| 42681.135150462964 | 20.9 |
| 42681.1559837963 | 20.9 |
| 42681.17681712963 | 21 |
| 42681.197650462964 | 20.9 |
| 42681.2184837963 | 20.9 |
| 42681.23931712963 | 20.9 |
| 42681.260150462964 | 21 |
| 42681.2809837963 | 20.9 |
| 42681.30181712963 | 20.9 |
| 42681.322650462964 | 20.9 |
| 42681.3434837963 | 20.9 |
| 42681.36431712963 | 20.9 |
| 42681.385150462964 | 20.9 |
| 42681.4059837963 | 20.9 |
| 42681.42681712963 | 20.9 |
| 42681.447650462964 | 20.9 |
| 42681.4684837963 | 20.9 |
| 42681.48931712963 | 20.9 |
| 42681.510150462964 | 20.9 |
| 42681.5309837963 | 20.9 |
| 42681.55181712963 | 21 |
| 42681.572650462964 | 21 |
| 42681.5934837963 | 21 |
| 42681.61431712963 | 20.9 |
| 42681.635150462964 | 20.9 |
| 42681.6559837963 | 21 |
| 42681.67681712963 | 21 |
| 42681.697650462964 | 21 |
| 42681.7184837963 | 21 |
| 42681.73931712963 | 21 |
| 42681.760150462964 | 20.9 |
| 42681.7809837963 | 21 |
| 42681.80181712963 | 21 |
| 42681.822650462964 | 21 |
| 42681.8434837963 | 21 |
| 42681.86431712963 | 20.9 |
| 42681.885150462964 | 21 |
| 42681.9059837963 | 20.9 |
| 42681.92681712963 | 20.9 |
| 42681.947650462964 | 20.9 |
| 42681.9684837963 | 20.9 |
| 42681.98931712963 | 20.8 |
| 42682.010150462964 | 20.9 |
| 42682.0309837963 | 20.8 |
| 42682.05181712963 | 20.9 |
| 42682.072650462964 | 20.8 |
| 42682.0934837963 | 20.9 |
| 42682.11431712963 | 20.8 |
| 42682.135150462964 | 20.8 |
| 42682.1559837963 | 20.8 |
| 42682.17681712963 | 20.8 |
| 42682.197650462964 | 20.9 |
| 42682.2184837963 | 20.8 |
| 42682.23931712963 | 20.9 |
| 42682.260150462964 | 20.8 |
| 42682.2809837963 | 20.9 |
| 42682.30181712963 | 20.9 |
| 42682.322650462964 | 20.9 |
| 42682.3434837963 | 20.9 |
| 42682.36431712963 | 20.9 |
| 42682.385150462964 | 20.9 |
| 42682.4059837963 | 20.9 |
| 42682.42681712963 | 20.9 |
| 42682.447650462964 | 20.9 |
| 42682.4684837963 | 20.9 |
| 42682.48931712963 | 20.9 |
| 42682.510150462964 | 20.9 |
| 42682.5309837963 | 20.9 |
| 42682.55181712963 | 20.9 |
| 42682.572650462964 | 20.9 |
| 42682.5934837963 | 20.9 |
| 42682.61431712963 | 20.9 |
| 42682.635150462964 | 20.9 |
| 42682.6559837963 | 20.9 |
| 42682.67681712963 | 20.9 |
| 42682.697650462964 | 20.9 |
| 42682.7184837963 | 20.9 |
| 42682.73931712963 | 20.8 |
| 42682.760150462964 | 20.9 |
| 42682.7809837963 | 20.9 |
| 42682.80181712963 | 20.9 |
| 42682.822650462964 | 20.9 |
| 42682.8434837963 | 20.9 |
| 42682.86431712963 | 20.9 |
| 42682.885150462964 | 20.9 |
| 42682.9059837963 | 21 |
| 42682.92681712963 | 21.1 |
| 42682.947650462964 | 21 |
| 42682.9684837963 | 21 |
| 42682.98931712963 | 21 |
| 42683.010150462964 | 21 |
| 42683.0309837963 | 21 |
| 42683.05181712963 | 21 |
| 42683.072650462964 | 21 |
| 42683.0934837963 | 21.1 |
| 42683.11431712963 | 21 |
| 42683.135150462964 | 21.1 |
| 42683.1559837963 | 21.1 |
| 42683.17681712963 | 21.1 |
| 42683.197650462964 | 21 |
| 42683.2184837963 | 21 |
| 42683.23931712963 | 21 |
| 42683.260150462964 | 21 |
| 42683.2809837963 | 21 |
| 42683.30181712963 | 21 |
| 42683.322650462964 | 21 |
| 42683.3434837963 | 21 |
| 42683.36431712963 | 21 |
| 42683.385150462964 | 21 |
| 42683.4059837963 | 21 |
| 42683.42681712963 | 21 |
| 42683.447650462964 | 20.4 |
| 42683.4684837963 | 20.2 |
| 42683.48931712963 | 20.5 |
| 42683.510150462964 | 20.4 |
| 42683.5309837963 | 20.6 |
| 42683.55181712963 | 20.8 |
| 42683.572650462964 | 20.8 |
| 42683.5934837963 | 20.9 |
| 42683.61431712963 | 21 |
| 42683.635150462964 | 21.1 |
| 42683.6559837963 | 21 |
| 42683.67681712963 | 21.1 |
| 42683.697650462964 | 21.1 |
| 42683.7184837963 | 21.2 |
| 42683.73931712963 | 21.1 |
| 42683.760150462964 | 21.2 |
| 42683.7809837963 | 21.2 |
| 42683.80181712963 | 21.2 |
| 42683.822650462964 | 21.2 |
| 42683.8434837963 | 21.2 |
| 42683.86431712963 | 21.2 |
| 42683.885150462964 | 21.2 |
| 42683.9059837963 | 21.2 |
| 42683.92681712963 | 21.2 |
| 42683.947650462964 | 21.2 |
| 42683.9684837963 | 21.2 |
| 42683.98931712963 | 21.2 |
| 42684.010150462964 | 21.2 |
| 42684.0309837963 | 21.2 |
| 42684.05181712963 | 21.2 |
| 42684.072650462964 | 21.2 |
| 42684.0934837963 | 21.2 |
| 42684.11431712963 | 21.2 |
| 42684.135150462964 | 21.2 |
| 42684.1559837963 | 21.2 |
| 42684.17681712963 | 21.1 |
| 42684.197650462964 | 21.2 |
| 42684.2184837963 | 21.2 |
| 42684.23931712963 | 21.2 |
| 42684.260150462964 | 21.1 |
| 42684.2809837963 | 21.2 |
| 42684.30181712963 | 21.1 |
| 42684.322650462964 | 21.1 |
| 42684.3434837963 | 21.2 |
| 42684.36431712963 | 21.2 |
| 42684.385150462964 | 21.2 |
| 42684.4059837963 | 21.2 |
| 42684.42681712963 | 21.2 |
| 42684.447650462964 | 21.2 |
| 42684.4684837963 | 21.2 |
| 42684.48931712963 | 21.2 |
| 42684.510150462964 | 21.2 |
| 42684.5309837963 | 21.2 |
| 42684.55181712963 | 21.2 |
| 42684.572650462964 | 21.2 |
| 42684.5934837963 | 21.2 |
| 42684.61431712963 | 21.2 |
| 42684.635150462964 | 21.2 |
| 42684.6559837963 | 21.2 |
| 42684.67681712963 | 21.2 |
| 42684.697650462964 | 21.2 |
| 42684.7184837963 | 21.2 |
| 42684.73931712963 | 21.2 |
| 42684.760150462964 | 21.2 |
| 42684.7809837963 | 21.2 |
| 42684.80181712963 | 21.2 |
| 42684.822650462964 | 21.2 |
| 42684.8434837963 | 21.2 |
| 42684.86431712963 | 21.2 |
| 42684.885150462964 | 21.2 |
| 42684.9059837963 | 21.3 |
| 42684.92681712963 | 21.2 |
| 42684.947650462964 | 21.3 |
| 42684.9684837963 | 21.2 |
| 42684.98931712963 | 21.2 |
| 42685.010150462964 | 21.2 |
| 42685.0309837963 | 21.3 |
| 42685.05181712963 | 21.3 |
| 42685.072650462964 | 21.2 |
| 42685.0934837963 | 21.2 |
| 42685.11431712963 | 21.2 |
| 42685.135150462964 | 21.2 |
| 42685.1559837963 | 21.2 |
| 42685.17681712963 | 21.2 |
| 42685.197650462964 | 21.2 |
| 42685.2184837963 | 21.2 |
| 42685.23931712963 | 21.3 |
| 42685.260150462964 | 21.3 |
| 42685.2809837963 | 21.3 |
| 42685.30181712963 | 21.3 |
| 42685.322650462964 | 21.3 |
| 42685.3434837963 | 21.3 |
| 42685.36431712963 | 21.3 |
| 42685.385150462964 | 21.3 |
| 42685.4059837963 | 21.3 |
| 42685.42681712963 | 21.4 |
| 42685.447650462964 | 21.3 |
| 42685.4684837963 | 21.3 |
| 42685.48931712963 | 21.3 |
| 42685.510150462964 | 21.3 |
| 42685.5309837963 | 21.3 |
| 42685.55181712963 | 21.4 |
| 42685.572650462964 | 21.4 |
| 42685.5934837963 | 21.4 |
| 42685.61431712963 | 21.4 |
| 42685.635150462964 | 21.4 |
| 42685.6559837963 | 21.4 |
| 42685.67681712963 | 21.4 |
| 42685.697650462964 | 21.4 |
| 42685.7184837963 | 21.3 |
| 42685.73931712963 | 21.4 |
| 42685.760150462964 | 21.3 |
| 42685.7809837963 | 21.3 |
| 42685.80181712963 | 21.4 |
| 42685.822650462964 | 21.3 |
| 42685.8434837963 | 21.3 |
| 42685.86431712963 | 21.3 |
| 42685.885150462964 | 21.3 |
| 42685.9059837963 | 21.3 |
| 42685.92681712963 | 21.3 |
| 42685.947650462964 | 21.2 |
| 42685.9684837963 | 21.2 |
| 42685.98931712963 | 21.2 |
| 42686.010150462964 | 21.2 |
| 42686.0309837963 | 21.2 |
| 42686.05181712963 | 21.2 |
| 42686.072650462964 | 21.2 |
| 42686.0934837963 | 21.2 |
| 42686.11431712963 | 21.2 |
| 42686.135150462964 | 21.1 |
| 42686.1559837963 | 21.2 |
| 42686.17681712963 | 21.1 |
| 42686.197650462964 | 21.1 |
| 42686.2184837963 | 21.1 |
| 42686.23931712963 | 21.1 |
| 42686.260150462964 | 21.1 |
| 42686.2809837963 | 21.1 |
| 42686.30181712963 | 21.1 |
| 42686.322650462964 | 21.1 |
| 42686.3434837963 | 21 |
| 42686.36431712963 | 21 |
| 42686.385150462964 | 21 |
| 42686.4059837963 | 21.1 |
| 42686.42681712963 | 21 |
| 42686.447650462964 | 21 |
| 42686.4684837963 | 21 |
| 42686.48931712963 | 21.1 |
| 42686.510150462964 | 21.1 |
| 42686.5309837963 | 21.2 |
| 42686.55181712963 | 21.2 |
| 42686.572650462964 | 21.3 |
| 42686.5934837963 | 21.3 |
| 42686.61431712963 | 21.3 |
| 42686.635150462964 | 21.3 |
| 42686.6559837963 | 21.3 |
| 42686.67681712963 | 21.3 |
| 42686.697650462964 | 21.3 |
| 42686.7184837963 | 21.3 |
| 42686.73931712963 | 21.3 |
| 42686.760150462964 | 21.3 |
| 42686.7809837963 | 21.3 |
| 42686.80181712963 | 21.2 |
| 42686.822650462964 | 21.3 |
| 42686.8434837963 | 21.2 |
| 42686.86431712963 | 21.2 |
| 42686.885150462964 | 21.2 |
| 42686.9059837963 | 21.2 |
| 42686.92681712963 | 21.2 |
| 42686.947650462964 | 21.1 |
| 42686.9684837963 | 21.2 |
| 42686.98931712963 | 21.1 |
| 42687.010150462964 | 21.1 |
| 42687.0309837963 | 21.1 |
| 42687.05181712963 | 21.1 |
| 42687.072650462964 | 21.1 |
| 42687.0934837963 | 21.1 |
| 42687.11431712963 | 21.1 |
| 42687.135150462964 | 21.1 |
| 42687.1559837963 | 21.1 |
| 42687.17681712963 | 21.1 |
| 42687.197650462964 | 21.1 |
| 42687.2184837963 | 21 |
| 42687.23931712963 | 21.1 |
| 42687.260150462964 | 21.1 |
| 42687.2809837963 | 21.1 |
| 42687.30181712963 | 21.1 |
| 42687.322650462964 | 21.1 |
| 42687.3434837963 | 21.1 |
| 42687.36431712963 | 21.1 |
| 42687.385150462964 | 21 |
| 42687.4059837963 | 21.1 |
| 42687.42681712963 | 21 |
| 42687.447650462964 | 21.1 |
| 42687.4684837963 | 21.1 |
| 42687.48931712963 | 21.1 |
| 42687.510150462964 | 21.1 |
| 42687.5309837963 | 21.1 |
| 42687.55181712963 | 21.2 |
| 42687.572650462964 | 21.2 |
| 42687.5934837963 | 21.2 |
| 42687.61431712963 | 21.2 |
| 42687.635150462964 | 21.2 |
| 42687.6559837963 | 21.2 |
| 42687.67681712963 | 21.2 |
| 42687.697650462964 | 21.2 |
| 42687.7184837963 | 21.2 |
| 42687.73931712963 | 21.2 |
| 42687.760150462964 | 21.2 |
| 42687.7809837963 | 21.2 |
| 42687.80181712963 | 21.2 |
| 42687.822650462964 | 21.2 |
| 42687.8434837963 | 21.2 |
| 42687.86431712963 | 21.2 |
| 42687.885150462964 | 21.2 |
| 42687.9059837963 | 21.2 |
| 42687.92681712963 | 21.2 |
| 42687.947650462964 | 21.2 |
| 42687.9684837963 | 21.2 |
| 42687.98931712963 | 21.2 |
| 42688.010150462964 | 21.2 |
| 42688.0309837963 | 21.2 |
| 42688.05181712963 | 21.2 |
| 42688.072650462964 | 21.2 |
| 42688.0934837963 | 21.2 |
| 42688.11431712963 | 21.2 |
| 42688.135150462964 | 21.2 |
| 42688.1559837963 | 21.1 |
| 42688.17681712963 | 21.2 |
| 42688.197650462964 | 21.2 |
| 42688.2184837963 | 21.2 |
| 42688.23931712963 | 21.2 |
| 42688.260150462964 | 21.1 |
| 42688.2809837963 | 21.1 |
| 42688.30181712963 | 21.2 |
| 42688.322650462964 | 21.2 |
| 42688.3434837963 | 21.2 |
| 42688.36431712963 | 21.1 |
| 42688.385150462964 | 21.2 |
| 42688.4059837963 | 21.1 |
| 42688.42681712963 | 21.2 |
| 42688.447650462964 | 21.2 |
| 42688.4684837963 | 21.2 |
| 42688.48931712963 | 21.2 |
| 42688.510150462964 | 21.2 |
| 42688.5309837963 | 21.2 |
| 42688.55181712963 | 21.2 |
| 42688.572650462964 | 21.2 |
| 42688.5934837963 | 21.2 |
| 42688.61431712963 | 21.2 |
| 42688.635150462964 | 21.2 |
| 42688.6559837963 | 21.2 |
| 42688.67681712963 | 21.2 |
| 42688.697650462964 | 21.1 |
| 42688.7184837963 | 21.1 |
| 42688.73931712963 | 21.1 |
| 42688.760150462964 | 21.2 |
| 42688.7809837963 | 21.2 |
| 42688.80181712963 | 21.1 |
| 42688.822650462964 | 21.2 |
| 42688.8434837963 | 21.1 |
| 42688.86431712963 | 21.1 |
| 42688.885150462964 | 21.1 |
| 42688.9059837963 | 21.1 |
| 42688.92681712963 | 21.1 |
| 42688.947650462964 | 21.1 |
| 42688.9684837963 | 21.1 |
| 42688.98931712963 | 21.1 |
| 42689.010150462964 | 21.1 |
| 42689.0309837963 | 21.1 |
| 42689.05181712963 | 21.1 |
| 42689.072650462964 | 21.1 |
| 42689.0934837963 | 21.1 |
| 42689.11431712963 | 21.1 |
| 42689.135150462964 | 21.1 |
| 42689.1559837963 | 21.1 |
| 42689.17681712963 | 21.1 |
| 42689.197650462964 | 21.1 |
| 42689.2184837963 | 21.1 |
| 42689.23931712963 | 21.1 |
| 42689.260150462964 | 21.1 |
| 42689.2809837963 | 21 |
| 42689.30181712963 | 21 |
| 42689.322650462964 | 21.1 |
| 42689.3434837963 | 21.1 |
| 42689.36431712963 | 21.1 |
| 42689.385150462964 | 21.1 |
| 42689.4059837963 | 21.1 |
| 42689.42681712963 | 21.1 |
| 42689.447650462964 | 21.1 |
| 42689.4684837963 | 21.1 |
| 42689.48931712963 | 21.1 |
| 42689.510150462964 | 21.1 |
| 42689.5309837963 | 21.2 |
| 42689.55181712963 | 21.2 |
| 42689.572650462964 | 21.2 |
| 42689.5934837963 | 21.3 |
| 42689.61431712963 | 21.3 |
| 42689.635150462964 | 21.3 |
| 42689.6559837963 | 21.2 |
| 42689.67681712963 | 21.2 |
| 42689.697650462964 | 21.3 |
| 42689.7184837963 | 21.3 |
| 42689.73931712963 | 21.3 |
| 42689.760150462964 | 21.3 |
| 42689.7809837963 | 21.3 |
| 42689.80181712963 | 21.2 |
| 42689.822650462964 | 21.2 |
| 42689.8434837963 | 21.2 |
| 42689.86431712963 | 21.2 |
| 42689.885150462964 | 21.2 |
| 42689.9059837963 | 21.2 |
| 42689.92681712963 | 21.1 |
| 42689.947650462964 | 21.2 |
| 42689.9684837963 | 21.1 |
| 42689.98931712963 | 21.1 |
| 42690.010150462964 | 21.1 |
| 42690.0309837963 | 21.1 |
| 42690.05181712963 | 21.1 |
| 42690.072650462964 | 21 |
| 42690.0934837963 | 21 |
| 42690.11431712963 | 21.1 |
| 42690.135150462964 | 21 |
| 42690.1559837963 | 21 |
| 42690.17681712963 | 21 |
| 42690.197650462964 | 21 |
| 42690.2184837963 | 21 |
| 42690.23931712963 | 21 |
| 42690.260150462964 | 21 |
| 42690.2809837963 | 21 |
| 42690.30181712963 | 21 |
| 42690.322650462964 | 21 |
| 42690.3434837963 | 21 |
| 42690.36431712963 | 21 |
| 42690.385150462964 | 21 |
| 42690.4059837963 | 21 |
| 42690.42681712963 | 21 |
| 42690.447650462964 | 21 |
| 42690.4684837963 | 20.9 |
| 42690.48931712963 | 21.3 |
| 42690.510150462964 | 21.2 |
| 42690.5309837963 | 21.3 |
| 42690.55181712963 | 21.3 |
| 42690.572650462964 | 21.3 |
| 42690.5934837963 | 21.3 |
| 42690.61431712963 | 21.4 |
| 42690.635150462964 | 21.4 |
| 42690.6559837963 | 21.4 |
| 42690.67681712963 | 21.4 |
| 42690.697650462964 | 21.4 |
| 42690.7184837963 | 21.4 |
| 42690.73931712963 | 21.3 |
| 42690.760150462964 | 21.4 |
| 42690.7809837963 | 21.4 |
| 42690.80181712963 | 21.3 |
| 42690.822650462964 | 21.4 |
| 42690.8434837963 | 21.3 |
| 42690.86431712963 | 21.3 |
| 42690.885150462964 | 21.4 |
| 42690.9059837963 | 21.3 |
| 42690.92681712963 | 21.4 |
| 42690.947650462964 | 21.4 |
| 42690.9684837963 | 21.3 |
| 42690.98931712963 | 21.4 |
| 42691.010150462964 | 21.4 |
| 42691.0309837963 | 21.3 |
| 42691.05181712963 | 21.4 |
| 42691.072650462964 | 21.4 |
| 42691.0934837963 | 21.3 |
| 42691.11431712963 | 21.3 |
| 42691.135150462964 | 21.3 |
| 42691.1559837963 | 21.3 |
| 42691.17681712963 | 21.3 |
| 42691.197650462964 | 21.3 |
| 42691.2184837963 | 21.2 |
| 42691.23931712963 | 21.3 |
| 42691.260150462964 | 21.3 |
| 42691.2809837963 | 21.2 |
| 42691.30181712963 | 21.3 |
| 42691.322650462964 | 21.3 |
| 42691.3434837963 | 21.3 |
| 42691.36431712963 | 21.3 |
| 42691.385150462964 | 21.3 |
| 42691.4059837963 | 21.3 |
| 42691.42681712963 | 21.3 |
| 42691.447650462964 | 21.3 |
| 42691.4684837963 | 21.3 |
| 42691.48931712963 | 21.4 |
| 42691.510150462964 | 21.4 |
| 42691.5309837963 | 21.4 |
| 42691.55181712963 | 21.4 |
| 42691.572650462964 | 21.4 |
| 42691.5934837963 | 21.5 |
| 42691.61431712963 | 21.4 |
| 42691.635150462964 | 21.4 |
| 42691.6559837963 | 21.4 |
| 42691.67681712963 | 21.3 |
| 42691.697650462964 | 21.4 |
| 42691.7184837963 | 21.4 |
| 42691.73931712963 | 21.4 |
| 42691.760150462964 | 21.4 |
| 42691.7809837963 | 21.3 |
| 42691.80181712963 | 21.3 |
| 42691.822650462964 | 21.3 |
| 42691.8434837963 | 21.2 |
| 42691.86431712963 | 21.2 |
| 42691.885150462964 | 21.3 |
| 42691.9059837963 | 21.3 |
| 42691.92681712963 | 21.4 |
| 42691.947650462964 | 21.4 |
| 42691.9684837963 | 21.4 |
| 42691.98931712963 | 21.3 |
| 42692.010150462964 | 21.4 |
| 42692.0309837963 | 21.3 |
| 42692.05181712963 | 21.3 |
| 42692.072650462964 | 21.3 |
| 42692.0934837963 | 21.3 |
| 42692.11431712963 | 21.3 |
| 42692.135150462964 | 21.4 |
| 42692.1559837963 | 21.4 |
| 42692.17681712963 | 21.3 |
| 42692.197650462964 | 21.4 |
| 42692.2184837963 | 21.4 |
| 42692.23931712963 | 21.4 |
| 42692.260150462964 | 21.4 |
| 42692.2809837963 | 21.3 |
| 42692.30181712963 | 21.3 |
| 42692.322650462964 | 21.4 |
| 42692.3434837963 | 21.4 |
| 42692.36431712963 | 21.4 |
| 42692.385150462964 | 21.4 |
| 42692.4059837963 | 21.3 |
| 42692.42681712963 | 21.4 |
| 42692.447650462964 | 21.3 |
| 42692.4684837963 | 21.3 |
| 42692.48931712963 | 21.3 |
| 42692.510150462964 | 21.3 |
| 42692.5309837963 | 21.3 |
| 42692.55181712963 | 21.3 |
| 42692.572650462964 | 21.2 |
| 42692.5934837963 | 21.3 |
| 42692.61431712963 | 21.2 |
| 42692.635150462964 | 21.2 |
| 42692.6559837963 | 21.2 |
| 42692.67681712963 | 21.2 |
| 42692.697650462964 | 21.3 |
| 42692.7184837963 | 21.3 |
| 42692.73931712963 | 21.3 |
| 42692.760150462964 | 21.3 |
| 42692.7809837963 | 21.3 |
| 42692.80181712963 | 21.3 |
| 42692.822650462964 | 21.3 |
| 42692.8434837963 | 21.3 |
| 42692.86431712963 | 21.3 |
| 42692.885150462964 | 21.3 |
| 42692.9059837963 | 21.3 |
| 42692.92681712963 | 21.3 |
| 42692.947650462964 | 21.3 |
| 42692.9684837963 | 21.4 |
| 42692.98931712963 | 21.4 |
| 42693.010150462964 | 21.4 |
| 42693.0309837963 | 21.4 |
| 42693.05181712963 | 21.4 |
| 42693.072650462964 | 21.4 |
| 42693.0934837963 | 21.4 |
| 42693.11431712963 | 21.4 |
| 42693.135150462964 | 21.4 |
| 42693.1559837963 | 21.4 |
| 42693.17681712963 | 21.4 |
| 42693.197650462964 | 21.4 |
| 42693.2184837963 | 21.4 |
| 42693.23931712963 | 21.4 |
| 42693.260150462964 | 21.4 |
| 42693.2809837963 | 21.4 |
| 42693.30181712963 | 21.4 |
| 42693.322650462964 | 21.4 |
| 42693.3434837963 | 21.4 |
| 42693.36431712963 | 21.3 |
| 42693.385150462964 | 21.2 |
| 42693.4059837963 | 21.2 |
| 42693.42681712963 | 21.2 |
| 42693.447650462964 | 21.2 |
| 42693.4684837963 | 21.2 |
| 42693.48931712963 | 21.2 |
| 42693.510150462964 | 21.2 |
| 42693.5309837963 | 21.2 |
| 42693.55181712963 | 21.3 |
| 42693.572650462964 | 21.3 |
| 42693.5934837963 | 21.3 |
| 42693.61431712963 | 21.3 |
| 42693.635150462964 | 21.3 |
| 42693.6559837963 | 21.4 |
| 42693.67681712963 | 21.4 |
| 42693.697650462964 | 21.4 |
| 42693.7184837963 | 21.3 |
| 42693.73931712963 | 21.3 |
| 42693.760150462964 | 21.3 |
| 42693.7809837963 | 21.2 |
| 42693.80181712963 | 21.3 |
| 42693.822650462964 | 21.4 |
| 42693.8434837963 | 21.4 |
| 42693.86431712963 | 21.4 |
| 42693.885150462964 | 21.4 |
| 42693.9059837963 | 21.3 |
| 42693.92681712963 | 21.4 |
| 42693.947650462964 | 21.3 |
| 42693.9684837963 | 21.3 |
| 42693.98931712963 | 21.3 |
| 42694.010150462964 | 21.3 |
| 42694.0309837963 | 21.3 |
| 42694.05181712963 | 21.3 |
| 42694.072650462964 | 21.3 |
| 42694.0934837963 | 21.3 |
| 42694.11431712963 | 21.3 |
| 42694.135150462964 | 21.3 |
| 42694.1559837963 | 21.3 |
| 42694.17681712963 | 21.3 |
| 42694.197650462964 | 21.3 |
| 42694.2184837963 | 21.3 |
| 42694.23931712963 | 21.3 |
| 42694.260150462964 | 21.3 |
| 42694.2809837963 | 21.3 |
| 42694.30181712963 | 21.3 |
| 42694.322650462964 | 21.3 |
| 42694.3434837963 | 21.3 |
| 42694.36431712963 | 21.3 |
| 42694.385150462964 | 21.3 |
| 42694.4059837963 | 21.3 |
| 42694.42681712963 | 21.3 |
| 42694.447650462964 | 21.4 |
| 42694.4684837963 | 21.4 |
| 42694.48931712963 | 21.4 |
| 42694.510150462964 | 21.4 |
| 42694.5309837963 | 21.4 |
| 42694.55181712963 | 21.3 |
| 42694.572650462964 | 21.3 |
| 42694.5934837963 | 21.3 |
| 42694.61431712963 | 21.4 |
| 42694.635150462964 | 21.4 |
| 42694.6559837963 | 21.4 |
| 42694.67681712963 | 21.4 |
| 42694.697650462964 | 21.4 |
| 42694.7184837963 | 21.4 |
| 42694.73931712963 | 21.4 |
| 42694.760150462964 | 21.3 |
| 42694.7809837963 | 21.3 |
| 42694.80181712963 | 21.3 |
| 42694.822650462964 | 21.3 |
| 42694.8434837963 | 21.3 |
| 42694.86431712963 | 21.3 |
| 42694.885150462964 | 21.3 |
| 42694.9059837963 | 21.4 |
| 42694.92681712963 | 21.4 |
| 42694.947650462964 | 21.3 |
| 42694.9684837963 | 21.3 |
| 42694.98931712963 | 21.3 |
| 42695.010150462964 | 21.4 |
| 42695.0309837963 | 21.4 |
| 42695.05181712963 | 21.3 |
| 42695.072650462964 | 21.3 |
| 42695.0934837963 | 21.3 |
| 42695.11431712963 | 21.3 |
| 42695.135150462964 | 21.3 |
| 42695.1559837963 | 21.3 |
| 42695.17681712963 | 21.3 |
| 42695.197650462964 | 21.3 |
| 42695.2184837963 | 21.3 |
| 42695.23931712963 | 21.2 |
| 42695.260150462964 | 21.2 |
| 42695.2809837963 | 21.2 |
| 42695.30181712963 | 21.2 |
| 42695.322650462964 | 21.2 |
| 42695.3434837963 | 21.2 |
| 42695.36431712963 | 21.2 |
| 42695.385150462964 | 21.2 |
| 42695.4059837963 | 21.2 |
| 42695.42681712963 | 21.2 |
| 42695.447650462964 | 21.2 |
| 42695.4684837963 | 21.2 |
| 42695.48931712963 | 21.2 |
| 42695.510150462964 | 21.2 |
| 42695.5309837963 | 21.2 |
| 42695.55181712963 | 21.2 |
| 42695.572650462964 | 21.2 |
| 42695.5934837963 | 21.2 |
| 42695.61431712963 | 21.2 |
| 42695.635150462964 | 21.2 |
| 42695.6559837963 | 21.3 |
| 42695.67681712963 | 21.3 |
| 42695.697650462964 | 21.3 |
| 42695.7184837963 | 21.2 |
| 42695.73931712963 | 21.3 |
| 42695.760150462964 | 21.3 |
| 42695.7809837963 | 21.3 |
| 42695.80181712963 | 21.3 |
| 42695.822650462964 | 21.3 |
| 42695.8434837963 | 21.3 |
| 42695.86431712963 | 21.3 |
| 42695.885150462964 | 21.3 |
| 42695.9059837963 | 21.3 |
| 42695.92681712963 | 21.3 |
| 42695.947650462964 | 21.4 |
| 42695.9684837963 | 21.3 |
| 42695.98931712963 | 21.3 |
| 42696.010150462964 | 21.3 |
| 42696.0309837963 | 21.3 |
| 42696.05181712963 | 21.3 |
| 42696.072650462964 | 21.3 |
| 42696.0934837963 | 21.3 |
| 42696.11431712963 | 21.3 |
| 42696.135150462964 | 21.3 |
| 42696.1559837963 | 21.3 |
| 42696.17681712963 | 21.3 |
| 42696.197650462964 | 21.3 |
| 42696.2184837963 | 21.3 |
| 42696.23931712963 | 21.3 |
| 42696.260150462964 | 21.3 |
| 42696.2809837963 | 21.3 |
| 42696.30181712963 | 21.3 |
| 42696.322650462964 | 21.3 |
| 42696.3434837963 | 21.3 |
| 42696.36431712963 | 21.3 |
| 42696.385150462964 | 21.4 |
| 42696.4059837963 | 21.3 |
| 42696.42681712963 | 21.3 |
| 42696.447650462964 | 21.3 |
| 42696.4684837963 | 21.1 |
| 42696.48931712963 | 21.1 |
| 42696.510150462964 | 21.1 |
| 42696.5309837963 | 21.2 |
| 42696.55181712963 | 21.2 |
| 42696.572650462964 | 21.2 |
| 42696.5934837963 | 21.2 |
| 42696.61431712963 | 21.2 |
| 42696.635150462964 | 21.2 |
| 42696.6559837963 | 21.2 |
| 42696.67681712963 | 21.2 |
| 42696.697650462964 | 21.3 |
| 42696.7184837963 | 21.2 |
| 42696.73931712963 | 21.4 |
| 42696.760150462964 | 21.4 |
| 42696.7809837963 | 21.4 |
| 42696.80181712963 | 21.4 |
| 42696.822650462964 | 21.5 |
| 42696.8434837963 | 21.5 |
| 42696.86431712963 | 21.5 |
| 42696.885150462964 | 21.4 |
| 42696.9059837963 | 21.5 |
| 42696.92681712963 | 21.5 |
| 42696.947650462964 | 21.5 |
| 42696.9684837963 | 21.5 |
| 42696.98931712963 | 21.4 |
| 42697.010150462964 | 21.4 |
| 42697.0309837963 | 21.5 |
| 42697.05181712963 | 21.5 |
| 42697.072650462964 | 21.4 |
| 42697.0934837963 | 21.4 |
| 42697.11431712963 | 21.4 |
| 42697.135150462964 | 21.4 |
| 42697.1559837963 | 21.4 |
| 42697.17681712963 | 21.4 |
| 42697.197650462964 | 21.4 |
| 42697.2184837963 | 21.4 |
| 42697.23931712963 | 21.4 |
| 42697.260150462964 | 21.4 |
| 42697.2809837963 | 21.4 |
| 42697.30181712963 | 21.4 |
| 42697.322650462964 | 21.4 |
| 42697.3434837963 | 21.4 |
| 42697.36431712963 | 21.4 |
| 42697.385150462964 | 21.4 |
| 42697.4059837963 | 21.5 |
| 42697.42681712963 | 21.4 |
| 42697.447650462964 | 21.1 |
| 42697.4684837963 | 21.4 |
| 42697.48931712963 | 21.4 |
| 42697.510150462964 | 21.4 |
| 42697.5309837963 | 21.4 |
| 42697.55181712963 | 21.4 |
| 42697.572650462964 | 21.4 |
| 42697.5934837963 | 21.4 |
| 42697.61431712963 | 21.4 |
| 42697.635150462964 | 21.4 |
| 42697.6559837963 | 21.4 |
| 42697.67681712963 | 21.5 |
| 42697.697650462964 | 21.5 |
| 42697.7184837963 | 21.4 |
| 42697.73931712963 | 21.4 |
| 42697.760150462964 | 21.4 |
| 42697.7809837963 | 21.5 |
| 42697.80181712963 | 21.5 |
| 42697.822650462964 | 21.4 |
| 42697.8434837963 | 21.4 |
| 42697.86431712963 | 21.4 |
| 42697.885150462964 | 21.4 |
| 42697.9059837963 | 21.4 |
| 42697.92681712963 | 21.4 |
| 42697.947650462964 | 21.4 |
| 42697.9684837963 | 21.4 |
| 42697.98931712963 | 21.4 |
| 42698.010150462964 | 21.4 |
| 42698.0309837963 | 21.4 |
| 42698.05181712963 | 21.4 |
| 42698.072650462964 | 21.4 |
| 42698.0934837963 | 21.4 |
| 42698.11431712963 | 21.5 |
| 42698.135150462964 | 21.5 |
| 42698.1559837963 | 21.5 |
| 42698.17681712963 | 21.5 |
| 42698.197650462964 | 21.5 |
| 42698.2184837963 | 21.5 |
| 42698.23931712963 | 21.5 |
| 42698.260150462964 | 21.5 |
| 42698.2809837963 | 21.5 |
| 42698.30181712963 | 21.5 |
| 42698.322650462964 | 21.5 |
| 42698.3434837963 | 21.5 |
| 42698.36431712963 | 21.5 |
| 42698.385150462964 | 21.5 |
| 42698.4059837963 | 21.5 |
| 42698.42681712963 | 21.5 |
| 42698.447650462964 | 21.6 |
| 42698.4684837963 | 21.6 |
| 42698.48931712963 | 21.6 |
| 42698.510150462964 | 21.6 |
| 42698.5309837963 | 21.6 |
| 42698.55181712963 | 21.6 |
| 42698.572650462964 | 21.6 |
| 42698.5934837963 | 21.5 |
| 42698.61431712963 | 21.6 |
| 42698.635150462964 | 21.6 |
| 42698.6559837963 | 21.6 |
| 42698.67681712963 | 21.6 |
| 42698.697650462964 | 21.6 |
| 42698.7184837963 | 21.5 |
| 42698.73931712963 | 21.6 |
| 42698.760150462964 | 21.6 |
| 42698.7809837963 | 21.6 |
| 42698.80181712963 | 21.6 |
| 42698.822650462964 | 21.6 |
| 42698.8434837963 | 21.6 |
| 42698.86431712963 | 21.6 |
| 42698.885150462964 | 21.6 |
| 42698.9059837963 | 21.6 |
| 42698.92681712963 | 21.6 |
| 42698.947650462964 | 21.6 |
| 42698.9684837963 | 21.6 |
| 42698.98931712963 | 21.6 |
| 42699.010150462964 | 21.5 |
| 42699.0309837963 | 21.6 |
| 42699.05181712963 | 21.6 |
| 42699.072650462964 | 21.6 |
| 42699.0934837963 | 21.6 |
| 42699.11431712963 | 21.6 |
| 42699.135150462964 | 21.5 |
| 42699.1559837963 | 21.5 |
| 42699.17681712963 | 21.5 |
| 42699.197650462964 | 21.5 |
| 42699.2184837963 | 21.5 |
| 42699.23931712963 | 21.5 |
| 42699.260150462964 | 21.5 |
| 42699.2809837963 | 21.5 |
| 42699.30181712963 | 21.5 |
| 42699.322650462964 | 21.5 |
| 42699.3434837963 | 21.6 |
| 42699.36431712963 | 21.5 |
| 42699.385150462964 | 21.5 |
| 42699.4059837963 | 21.5 |
| 42699.42681712963 | 21.5 |
| 42699.447650462964 | 21.5 |
| 42699.4684837963 | 21.6 |
| 42699.48931712963 | 21.6 |
| 42699.510150462964 | 21.6 |
| 42699.5309837963 | 21.6 |
| 42699.55181712963 | 21.6 |
| 42699.572650462964 | 21.6 |
| 42699.5934837963 | 21.6 |
| 42699.61431712963 | 21.6 |
| 42699.635150462964 | 21.6 |
| 42699.6559837963 | 21.7 |
| 42699.67681712963 | 21.7 |
| 42699.697650462964 | 21.6 |
| 42699.7184837963 | 21.6 |
| 42699.73931712963 | 21.6 |
| 42699.760150462964 | 21.6 |
| 42699.7809837963 | 21.6 |
| 42699.80181712963 | 21.6 |
| 42699.822650462964 | 21.6 |
| 42699.8434837963 | 21.6 |
| 42699.86431712963 | 21.6 |
| 42699.885150462964 | 21.6 |
| 42699.9059837963 | 21.6 |
| 42699.92681712963 | 21.6 |
| 42699.947650462964 | 21.6 |
| 42699.9684837963 | 21.6 |
| 42699.98931712963 | 21.6 |
| 42700.010150462964 | 21.6 |
| 42700.0309837963 | 21.6 |
| 42700.05181712963 | 21.6 |
| 42700.072650462964 | 21.6 |
| 42700.0934837963 | 21.7 |
| 42700.11431712963 | 21.7 |
| 42700.135150462964 | 21.6 |
| 42700.1559837963 | 21.6 |
| 42700.17681712963 | 21.6 |
| 42700.197650462964 | 21.6 |
| 42700.2184837963 | 21.6 |
| 42700.23931712963 | 21.6 |
| 42700.260150462964 | 21.6 |
| 42700.2809837963 | 21.6 |
| 42700.30181712963 | 21.6 |
| 42700.322650462964 | 21.6 |
| 42700.3434837963 | 21.6 |
| 42700.36431712963 | 21.6 |
| 42700.385150462964 | 21.6 |
| 42700.4059837963 | 21.6 |
| 42700.42681712963 | 21.6 |
| 42700.447650462964 | 21.6 |
| 42700.4684837963 | 21.6 |
| 42700.48931712963 | 21.6 |
| 42700.510150462964 | 21.6 |
| 42700.5309837963 | 21.6 |
| 42700.55181712963 | 21.6 |
| 42700.572650462964 | 21.6 |
| 42700.5934837963 | 21.6 |
| 42700.61431712963 | 21.7 |
| 42700.635150462964 | 21.7 |
| 42700.6559837963 | 21.6 |
| 42700.67681712963 | 21.6 |
| 42700.697650462964 | 21.6 |
| 42700.7184837963 | 21.6 |
| 42700.73931712963 | 21.6 |
| 42700.760150462964 | 21.6 |
| 42700.7809837963 | 21.6 |
| 42700.80181712963 | 21.6 |
| 42700.822650462964 | 21.7 |
| 42700.8434837963 | 21.7 |
| 42700.86431712963 | 21.7 |
| 42700.885150462964 | 21.6 |
| 42700.9059837963 | 21.6 |
| 42700.92681712963 | 21.6 |
| 42700.947650462964 | 21.6 |
| 42700.9684837963 | 21.6 |
| 42700.98931712963 | 21.6 |
| 42701.010150462964 | 21.6 |
| 42701.0309837963 | 21.6 |
| 42701.05181712963 | 21.6 |
| 42701.072650462964 | 21.6 |
| 42701.0934837963 | 21.6 |
| 42701.11431712963 | 21.6 |
| 42701.135150462964 | 21.6 |
| 42701.1559837963 | 21.6 |
| 42701.17681712963 | 21.6 |
| 42701.197650462964 | 21.6 |
| 42701.2184837963 | 21.6 |
| 42701.23931712963 | 21.6 |
| 42701.260150462964 | 21.6 |
| 42701.2809837963 | 21.6 |
| 42701.30181712963 | 21.6 |
| 42701.322650462964 | 21.6 |
| 42701.3434837963 | 21.6 |
| 42701.36431712963 | 21.6 |
| 42701.385150462964 | 21.6 |
| 42701.4059837963 | 21.6 |
| 42701.42681712963 | 21.6 |
| 42701.447650462964 | 21.6 |
| 42701.4684837963 | 21.6 |
| 42701.48931712963 | 21.6 |
| 42701.510150462964 | 21.6 |
| 42701.5309837963 | 21.6 |
| 42701.55181712963 | 21.6 |
| 42701.572650462964 | 21.7 |
| 42701.5934837963 | 21.6 |
| 42701.61431712963 | 21.6 |
| 42701.635150462964 | 21.6 |
| 42701.6559837963 | 21.7 |
| 42701.67681712963 | 21.6 |
| 42701.697650462964 | 21.6 |
| 42701.7184837963 | 21.6 |
| 42701.73931712963 | 21.6 |
| 42701.760150462964 | 21.6 |
| 42701.7809837963 | 21.6 |
| 42701.80181712963 | 21.6 |
| 42701.822650462964 | 21.6 |
| 42701.8434837963 | 21.7 |
| 42701.86431712963 | 21.7 |
| 42701.885150462964 | 21.7 |
| 42701.9059837963 | 21.7 |
| 42701.92681712963 | 21.7 |
| 42701.947650462964 | 21.7 |
| 42701.9684837963 | 21.7 |
| 42701.98931712963 | 21.6 |
| 42702.010150462964 | 21.7 |
| 42702.0309837963 | 21.7 |
| 42702.05181712963 | 21.7 |
| 42702.072650462964 | 21.7 |
| 42702.0934837963 | 21.7 |
| 42702.11431712963 | 21.7 |
| 42702.135150462964 | 21.7 |
| 42702.1559837963 | 21.7 |
| 42702.17681712963 | 21.7 |
| 42702.197650462964 | 21.7 |
| 42702.2184837963 | 21.7 |
| 42702.23931712963 | 21.6 |
| 42702.260150462964 | 21.6 |
| 42702.2809837963 | 21.6 |
| 42702.30181712963 | 21.6 |
| 42702.322650462964 | 21.6 |
| 42702.3434837963 | 21.6 |
| 42702.36431712963 | 21.6 |
| 42702.385150462964 | 21.6 |
| 42702.4059837963 | 21.6 |
| 42702.42681712963 | 21.5 |
| 42702.447650462964 | 21.5 |
| 42702.4684837963 | 21.6 |
| 42702.48931712963 | 21.6 |
| 42702.510150462964 | 21.6 |
| 42702.5309837963 | 21.6 |
| 42702.55181712963 | 21.6 |
| 42702.572650462964 | 21.6 |
| 42702.5934837963 | 21.6 |
| 42702.61431712963 | 21.6 |
| 42702.635150462964 | 21.6 |
| 42702.6559837963 | 21.6 |
| 42702.67681712963 | 21.6 |
| 42702.697650462964 | 21.6 |
| 42702.7184837963 | 21.6 |
| 42702.73931712963 | 21.6 |
| 42702.760150462964 | 21.5 |
| 42702.7809837963 | 21.5 |
| 42702.80181712963 | 21.5 |
| 42702.822650462964 | 21.5 |
| 42702.8434837963 | 21.5 |
| 42702.86431712963 | 21.5 |
| 42702.885150462964 | 21.5 |
| 42702.9059837963 | 21.5 |
| 42702.92681712963 | 21.5 |
| 42702.947650462964 | 21.5 |
| 42702.9684837963 | 21.5 |
| 42702.98931712963 | 21.5 |
| 42703.010150462964 | 21.4 |
| 42703.0309837963 | 21.4 |
| 42703.05181712963 | 21.4 |
| 42703.072650462964 | 21.4 |
| 42703.0934837963 | 21.4 |
| 42703.11431712963 | 21.4 |
| 42703.135150462964 | 21.4 |
| 42703.1559837963 | 21.4 |
| 42703.17681712963 | 21.4 |
| 42703.197650462964 | 21.4 |
| 42703.2184837963 | 21.4 |
| 42703.23931712963 | 21.4 |
| 42703.260150462964 | 21.4 |
| 42703.2809837963 | 21.4 |
| 42703.30181712963 | 21.4 |
| 42703.322650462964 | 21.4 |
| 42703.3434837963 | 21.4 |
| 42703.36431712963 | 21.4 |
| 42703.385150462964 | 21.3 |
| 42703.4059837963 | 21.3 |
| 42703.42681712963 | 21.3 |
| 42703.447650462964 | 21.3 |
| 42703.4684837963 | 21.3 |
| 42703.48931712963 | 21.4 |
| 42703.510150462964 | 21.3 |
| 42703.5309837963 | 21.3 |
| 42703.55181712963 | 21.4 |
| 42703.572650462964 | 21.4 |
| 42703.5934837963 | 21.4 |
| 42703.61431712963 | 21.4 |
| 42703.635150462964 | 21.4 |
| 42703.6559837963 | 21.4 |
| 42703.67681712963 | 21.4 |
| 42703.697650462964 | 21.4 |
| 42703.7184837963 | 21.4 |
| 42703.73931712963 | 21.4 |
| 42703.760150462964 | 21.4 |
| 42703.7809837963 | 21.4 |
| 42703.80181712963 | 21.4 |
| 42703.822650462964 | 21.4 |
| 42703.8434837963 | 21.3 |
| 42703.86431712963 | 21.3 |
| 42703.885150462964 | 21.3 |
| 42703.9059837963 | 21.3 |
| 42703.92681712963 | 21.3 |
| 42703.947650462964 | 21.3 |
| 42703.9684837963 | 21.3 |
| 42703.98931712963 | 21.3 |
| 42704.010150462964 | 21.3 |
| 42704.0309837963 | 21.3 |
| 42704.05181712963 | 21.3 |
| 42704.072650462964 | 21.3 |
| 42704.0934837963 | 21.3 |
| 42704.11431712963 | 21.3 |
| 42704.135150462964 | 21.2 |
| 42704.1559837963 | 21.2 |
| 42704.17681712963 | 21.3 |
| 42704.197650462964 | 21.3 |
| 42704.2184837963 | 21.3 |
| 42704.23931712963 | 21.3 |
| 42704.260150462964 | 21.3 |
| 42704.2809837963 | 21.3 |
| 42704.30181712963 | 21.3 |
| 42704.322650462964 | 21.3 |
| 42704.3434837963 | 21.3 |
| 42704.36431712963 | 21.3 |
| 42704.385150462964 | 21.3 |
| 42704.4059837963 | 21.3 |
| 42704.42681712963 | 21.4 |
| 42704.447650462964 | 21.4 |
| 42704.4684837963 | 21.4 |
| 42704.48931712963 | 21.4 |
| 42704.510150462964 | 21.5 |
| 42704.5309837963 | 21.5 |
| 42704.55181712963 | 21.6 |
| 42704.572650462964 | 21.6 |
| 42704.5934837963 | 21.7 |
| 42704.61431712963 | 21.7 |
| 42704.635150462964 | 21.7 |
| 42704.6559837963 | 21.7 |
| 42704.67681712963 | 21.7 |
| 42704.697650462964 | 21.7 |
| 42704.7184837963 | 21.7 |
| 42704.73931712963 | 21.7 |
| 42704.760150462964 | 21.7 |
| 42704.7809837963 | 21.6 |
| 42704.80181712963 | 21.6 |
| 42704.822650462964 | 21.6 |
| 42704.8434837963 | 21.6 |
| 42704.86431712963 | 21.5 |
| 42704.885150462964 | 21.5 |
| 42704.9059837963 | 21.5 |
| 42704.92681712963 | 21.5 |
| 42704.947650462964 | 21.5 |
| 42704.9684837963 | 21.5 |
| 42704.98931712963 | 21.4 |
| 42705.010150462964 | 21.4 |
| 42705.0309837963 | 21.4 |
| 42705.05181712963 | 21.4 |
| 42705.072650462964 | 21.4 |
| 42705.0934837963 | 21.4 |
| 42705.11431712963 | 21.4 |
| 42705.135150462964 | 21.4 |
| 42705.1559837963 | 21.4 |
| 42705.17681712963 | 21.4 |
| 42705.197650462964 | 21.4 |
| 42705.2184837963 | 21.4 |
| 42705.23931712963 | 21.4 |
| 42705.260150462964 | 21.4 |
| 42705.2809837963 | 21.4 |
| 42705.30181712963 | 21.4 |
| 42705.322650462964 | 21.4 |
| 42705.3434837963 | 21.4 |
| 42705.36431712963 | 21.4 |
| 42705.385150462964 | 21.4 |
| 42705.4059837963 | 21.4 |
| 42705.42681712963 | 21.4 |
| 42705.447650462964 | 21.4 |
| 42705.4684837963 | 21.4 |
| 42705.48931712963 | 21.4 |
| 42705.510150462964 | 21.4 |
| 42705.5309837963 | 21.5 |
| 42705.55181712963 | 21.6 |
| 42705.572650462964 | 21.6 |
| 42705.5934837963 | 21.6 |
| 42705.61431712963 | 21.7 |
| 42705.635150462964 | 21.7 |
| 42705.6559837963 | 21.7 |
| 42705.67681712963 | 21.8 |
| 42705.697650462964 | 21.7 |
| 42705.7184837963 | 21.7 |
| 42705.73931712963 | 21.7 |
| 42705.760150462964 | 21.6 |
| 42705.7809837963 | 21.6 |
| 42705.80181712963 | 21.6 |
| 42705.822650462964 | 21.5 |
| 42705.8434837963 | 21.5 |
| 42705.86431712963 | 21.5 |
| 42705.885150462964 | 21.5 |
| 42705.9059837963 | 21.5 |
| 42705.92681712963 | 21.5 |
| 42705.947650462964 | 21.4 |
| 42705.9684837963 | 21.4 |
| 42705.98931712963 | 21.4 |
| 42706.010150462964 | 21.4 |
| 42706.0309837963 | 21.4 |
| 42706.05181712963 | 21.4 |
| 42706.072650462964 | 21.4 |
| 42706.0934837963 | 21.4 |
| 42706.11431712963 | 21.4 |
| 42706.135150462964 | 21.4 |
| 42706.1559837963 | 21.4 |
| 42706.17681712963 | 21.3 |
| 42706.197650462964 | 21.4 |
| 42706.2184837963 | 21.4 |
| 42706.23931712963 | 21.4 |
| 42706.260150462964 | 21.4 |
| 42706.2809837963 | 21.4 |
| 42706.30181712963 | 21.4 |
| 42706.322650462964 | 21.4 |
| 42706.3434837963 | 21.4 |
| 42706.36431712963 | 21.4 |
| 42706.385150462964 | 21.4 |
| 42706.4059837963 | 21.4 |
| 42706.42681712963 | 21.4 |
| 42706.447650462964 | 21.4 |
| 42706.4684837963 | 21.4 |
| 42706.48931712963 | 21.4 |
| 42706.510150462964 | 21.5 |
| 42706.5309837963 | 21.5 |
| 42706.55181712963 | 21.5 |
| 42706.572650462964 | 21.6 |
| 42706.5934837963 | 21.6 |
| 42706.61431712963 | 21.7 |
| 42706.635150462964 | 21.8 |
| 42706.6559837963 | 21.8 |
| 42706.67681712963 | 21.8 |
| 42706.697650462964 | 21.8 |
| 42706.7184837963 | 21.8 |
| 42706.73931712963 | 21.8 |
| 42706.760150462964 | 21.8 |
| 42706.7809837963 | 21.7 |
| 42706.80181712963 | 21.7 |
| 42706.822650462964 | 21.7 |
| 42706.8434837963 | 21.7 |
| 42706.86431712963 | 21.7 |
| 42706.885150462964 | 21.7 |
| 42706.9059837963 | 21.7 |
| 42706.92681712963 | 21.7 |
| 42706.947650462964 | 21.7 |
| 42706.9684837963 | 21.6 |
| 42706.98931712963 | 21.6 |
| 42707.010150462964 | 21.6 |
| 42707.0309837963 | 21.6 |
| 42707.05181712963 | 21.6 |
| 42707.072650462964 | 21.6 |
| 42707.0934837963 | 21.6 |
| 42707.11431712963 | 21.6 |
| 42707.135150462964 | 21.6 |
| 42707.1559837963 | 21.6 |
| 42707.17681712963 | 21.6 |
| 42707.197650462964 | 21.6 |
| 42707.2184837963 | 21.6 |
| 42707.23931712963 | 21.7 |
| 42707.260150462964 | 21.6 |
| 42707.2809837963 | 21.6 |
| 42707.30181712963 | 21.7 |
| 42707.322650462964 | 21.7 |
| 42707.3434837963 | 21.7 |
| 42707.36431712963 | 21.7 |
| 42707.385150462964 | 21.6 |
| 42707.4059837963 | 21.7 |
| 42707.42681712963 | 21.7 |
| 42707.447650462964 | 21.7 |
| 42707.4684837963 | 21.6 |
| 42707.48931712963 | 21.6 |
| 42707.510150462964 | 21.6 |
| 42707.5309837963 | 21.7 |
| 42707.55181712963 | 21.7 |
| 42707.572650462964 | 21.7 |
| 42707.5934837963 | 21.7 |
| 42707.61431712963 | 21.7 |
| 42707.635150462964 | 21.7 |
| 42707.6559837963 | 21.7 |
| 42707.67681712963 | 21.7 |
| 42707.697650462964 | 21.7 |
| 42707.7184837963 | 21.7 |
| 42707.73931712963 | 21.7 |
| 42707.760150462964 | 21.7 |
| 42707.7809837963 | 21.7 |
| 42707.80181712963 | 21.7 |
| 42707.822650462964 | 21.7 |
| 42707.8434837963 | 21.7 |
| 42707.86431712963 | 21.7 |
| 42707.885150462964 | 21.7 |
| 42707.9059837963 | 21.7 |
| 42707.92681712963 | 21.7 |
| 42707.947650462964 | 21.7 |
| 42707.9684837963 | 21.7 |
| 42707.98931712963 | 21.7 |
| 42708.010150462964 | 21.7 |
| 42708.0309837963 | 21.7 |
| 42708.05181712963 | 21.7 |
| 42708.072650462964 | 21.7 |
| 42708.0934837963 | 21.7 |
| 42708.11431712963 | 21.7 |
| 42708.135150462964 | 21.7 |
| 42708.1559837963 | 21.7 |
| 42708.17681712963 | 21.7 |
| 42708.197650462964 | 21.7 |
| 42708.2184837963 | 21.7 |
| 42708.23931712963 | 21.7 |
| 42708.260150462964 | 21.6 |
| 42708.2809837963 | 21.7 |
| 42708.30181712963 | 21.7 |
| 42708.322650462964 | 21.7 |
| 42708.3434837963 | 21.7 |
| 42708.36431712963 | 21.7 |
| 42708.385150462964 | 21.7 |
| 42708.4059837963 | 21.7 |
| 42708.42681712963 | 21.7 |
| 42708.447650462964 | 21.6 |
| 42708.4684837963 | 21.7 |
| 42708.48931712963 | 21.7 |
| 42708.510150462964 | 21.6 |
| 42708.5309837963 | 21.7 |
| 42708.55181712963 | 21.7 |
| 42708.572650462964 | 21.7 |
| 42708.5934837963 | 21.7 |
| 42708.61431712963 | 21.7 |
| 42708.635150462964 | 21.7 |
| 42708.6559837963 | 21.7 |
| 42708.67681712963 | 21.7 |
| 42708.697650462964 | 21.7 |
| 42708.7184837963 | 21.7 |
| 42708.73931712963 | 21.7 |
| 42708.760150462964 | 21.7 |
| 42708.7809837963 | 21.7 |
| 42708.80181712963 | 21.7 |
| 42708.822650462964 | 21.6 |
| 42708.8434837963 | 21.6 |
| 42708.86431712963 | 21.6 |
| 42708.885150462964 | 21.6 |
| 42708.9059837963 | 21.6 |
| 42708.92681712963 | 21.6 |
| 42708.947650462964 | 21.6 |
| 42708.9684837963 | 21.6 |
| 42708.98931712963 | 21.6 |
| 42709.010150462964 | 21.6 |
| 42709.0309837963 | 21.6 |
| 42709.05181712963 | 21.6 |
| 42709.072650462964 | 21.6 |
| 42709.0934837963 | 21.6 |
| 42709.11431712963 | 21.6 |
| 42709.135150462964 | 21.6 |
| 42709.1559837963 | 21.6 |
| 42709.17681712963 | 21.6 |
| 42709.197650462964 | 21.6 |
| 42709.2184837963 | 21.6 |
| 42709.23931712963 | 21.6 |
| 42709.260150462964 | 21.6 |
| 42709.2809837963 | 21.6 |
| 42709.30181712963 | 21.6 |
| 42709.322650462964 | 21.6 |
| 42709.3434837963 | 21.6 |
| 42709.36431712963 | 21.6 |
| 42709.385150462964 | 21.6 |
| 42709.4059837963 | 21.6 |
| 42709.42681712963 | 21.6 |
| 42709.447650462964 | 21.6 |
| 42709.4684837963 | 21.6 |
| 42709.48931712963 | 21.6 |
| 42709.510150462964 | 21.6 |
| 42709.5309837963 | 21.6 |
| 42709.55181712963 | 21.6 |
| 42709.572650462964 | 21.6 |
| 42709.5934837963 | 21.6 |
| 42709.61431712963 | 21.6 |
| 42709.635150462964 | 21.7 |
| 42709.6559837963 | 21.7 |
| 42709.67681712963 | 21.7 |
| 42709.697650462964 | 21.7 |
| 42709.7184837963 | 21.7 |
| 42709.73931712963 | 21.7 |
| 42709.760150462964 | 21.7 |